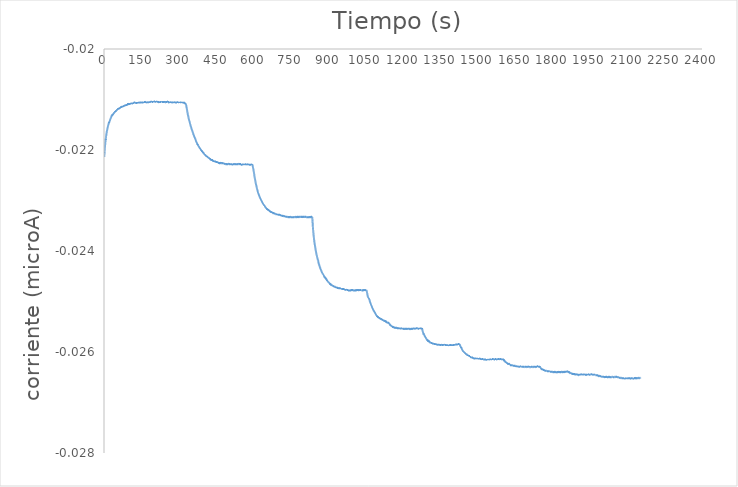
| Category | Series 0 |
|---|---|
| 0.1 | -0.022 |
| 0.2 | -0.022 |
| 0.3 | -0.022 |
| 0.4 | -0.022 |
| 0.5 | -0.022 |
| 0.6 | -0.022 |
| 0.7 | -0.022 |
| 0.8 | -0.022 |
| 0.9 | -0.022 |
| 1.0 | -0.022 |
| 1.1 | -0.022 |
| 1.2 | -0.022 |
| 1.3 | -0.022 |
| 1.4 | -0.022 |
| 1.5 | -0.022 |
| 1.6 | -0.022 |
| 1.7 | -0.022 |
| 1.8 | -0.022 |
| 1.9 | -0.022 |
| 2.0 | -0.022 |
| 2.1 | -0.022 |
| 2.2 | -0.022 |
| 2.3 | -0.022 |
| 2.4 | -0.022 |
| 2.5 | -0.022 |
| 2.6 | -0.022 |
| 2.7 | -0.022 |
| 2.8 | -0.022 |
| 2.9 | -0.022 |
| 3.0 | -0.022 |
| 3.1 | -0.022 |
| 3.2 | -0.022 |
| 3.3 | -0.022 |
| 3.4 | -0.022 |
| 3.5 | -0.022 |
| 3.6 | -0.022 |
| 3.7 | -0.022 |
| 3.8 | -0.022 |
| 3.9 | -0.022 |
| 4.0 | -0.022 |
| 4.1 | -0.022 |
| 4.2 | -0.022 |
| 4.3 | -0.022 |
| 4.4 | -0.022 |
| 4.5 | -0.022 |
| 4.6 | -0.022 |
| 4.7 | -0.022 |
| 4.8 | -0.022 |
| 4.9 | -0.022 |
| 5.0 | -0.022 |
| 5.1 | -0.022 |
| 5.2 | -0.022 |
| 5.3 | -0.022 |
| 5.4 | -0.022 |
| 5.5 | -0.022 |
| 5.6 | -0.022 |
| 5.7 | -0.022 |
| 5.8 | -0.022 |
| 5.9 | -0.022 |
| 6.0 | -0.022 |
| 6.1 | -0.022 |
| 6.2 | -0.022 |
| 6.3 | -0.022 |
| 6.4 | -0.022 |
| 6.5 | -0.022 |
| 6.6 | -0.022 |
| 6.7 | -0.022 |
| 6.8 | -0.022 |
| 6.9 | -0.022 |
| 7.0 | -0.022 |
| 7.1 | -0.022 |
| 7.2 | -0.022 |
| 7.3 | -0.022 |
| 7.4 | -0.022 |
| 7.5 | -0.022 |
| 7.6 | -0.022 |
| 7.7 | -0.022 |
| 7.8 | -0.022 |
| 7.9 | -0.022 |
| 8.0 | -0.022 |
| 8.1 | -0.022 |
| 8.2 | -0.022 |
| 8.3 | -0.022 |
| 8.4 | -0.022 |
| 8.5 | -0.022 |
| 8.6 | -0.022 |
| 8.7 | -0.022 |
| 8.8 | -0.022 |
| 8.9 | -0.022 |
| 9.0 | -0.022 |
| 9.1 | -0.022 |
| 9.2 | -0.022 |
| 9.3 | -0.022 |
| 9.4 | -0.022 |
| 9.5 | -0.022 |
| 9.6 | -0.022 |
| 9.7 | -0.022 |
| 9.8 | -0.022 |
| 9.9 | -0.022 |
| 10.0 | -0.022 |
| 10.1 | -0.022 |
| 10.2 | -0.022 |
| 10.3 | -0.022 |
| 10.4 | -0.022 |
| 10.5 | -0.022 |
| 10.6 | -0.022 |
| 10.7 | -0.022 |
| 10.8 | -0.022 |
| 10.9 | -0.022 |
| 11.0 | -0.022 |
| 11.1 | -0.022 |
| 11.2 | -0.022 |
| 11.3 | -0.022 |
| 11.4 | -0.022 |
| 11.5 | -0.022 |
| 11.6 | -0.022 |
| 11.7 | -0.022 |
| 11.8 | -0.022 |
| 11.9 | -0.022 |
| 12.0 | -0.022 |
| 12.1 | -0.022 |
| 12.2 | -0.022 |
| 12.3 | -0.022 |
| 12.4 | -0.022 |
| 12.5 | -0.022 |
| 12.6 | -0.022 |
| 12.7 | -0.022 |
| 12.8 | -0.022 |
| 12.9 | -0.022 |
| 13.0 | -0.022 |
| 13.1 | -0.022 |
| 13.2 | -0.022 |
| 13.3 | -0.022 |
| 13.4 | -0.022 |
| 13.5 | -0.022 |
| 13.6 | -0.022 |
| 13.7 | -0.022 |
| 13.8 | -0.022 |
| 13.9 | -0.022 |
| 14.0 | -0.022 |
| 14.1 | -0.022 |
| 14.2 | -0.022 |
| 14.3 | -0.022 |
| 14.4 | -0.022 |
| 14.5 | -0.022 |
| 14.6 | -0.022 |
| 14.7 | -0.022 |
| 14.8 | -0.022 |
| 14.9 | -0.022 |
| 15.0 | -0.022 |
| 15.1 | -0.022 |
| 15.2 | -0.022 |
| 15.3 | -0.022 |
| 15.4 | -0.022 |
| 15.5 | -0.022 |
| 15.6 | -0.022 |
| 15.7 | -0.022 |
| 15.8 | -0.022 |
| 15.9 | -0.022 |
| 16.0 | -0.022 |
| 16.1 | -0.022 |
| 16.2 | -0.022 |
| 16.3 | -0.022 |
| 16.4 | -0.022 |
| 16.5 | -0.022 |
| 16.6 | -0.022 |
| 16.7 | -0.022 |
| 16.8 | -0.022 |
| 16.9 | -0.022 |
| 17.0 | -0.022 |
| 17.1 | -0.022 |
| 17.2 | -0.022 |
| 17.3 | -0.022 |
| 17.4 | -0.022 |
| 17.5 | -0.022 |
| 17.6 | -0.022 |
| 17.7 | -0.021 |
| 17.8 | -0.021 |
| 17.9 | -0.021 |
| 18.0 | -0.021 |
| 18.1 | -0.021 |
| 18.2 | -0.021 |
| 18.3 | -0.021 |
| 18.4 | -0.021 |
| 18.5 | -0.021 |
| 18.6 | -0.021 |
| 18.7 | -0.021 |
| 18.8 | -0.021 |
| 18.9 | -0.021 |
| 19.0 | -0.021 |
| 19.1 | -0.021 |
| 19.2 | -0.021 |
| 19.3 | -0.021 |
| 19.4 | -0.021 |
| 19.5 | -0.021 |
| 19.6 | -0.021 |
| 19.7 | -0.021 |
| 19.8 | -0.021 |
| 19.9 | -0.021 |
| 20.0 | -0.021 |
| 20.1 | -0.021 |
| 20.2 | -0.021 |
| 20.3 | -0.021 |
| 20.4 | -0.021 |
| 20.5 | -0.021 |
| 20.6 | -0.021 |
| 20.7 | -0.021 |
| 20.8 | -0.021 |
| 20.9 | -0.021 |
| 21.0 | -0.021 |
| 21.1 | -0.021 |
| 21.2 | -0.021 |
| 21.3 | -0.021 |
| 21.4 | -0.021 |
| 21.5 | -0.021 |
| 21.6 | -0.021 |
| 21.7 | -0.021 |
| 21.8 | -0.021 |
| 21.9 | -0.021 |
| 22.0 | -0.021 |
| 22.1 | -0.021 |
| 22.2 | -0.021 |
| 22.3 | -0.021 |
| 22.4 | -0.021 |
| 22.5 | -0.021 |
| 22.6 | -0.021 |
| 22.7 | -0.021 |
| 22.8 | -0.021 |
| 22.9 | -0.021 |
| 23.0 | -0.021 |
| 23.1 | -0.021 |
| 23.2 | -0.021 |
| 23.3 | -0.021 |
| 23.4 | -0.021 |
| 23.5 | -0.021 |
| 23.6 | -0.021 |
| 23.7 | -0.021 |
| 23.8 | -0.021 |
| 23.9 | -0.021 |
| 24.0 | -0.021 |
| 24.1 | -0.021 |
| 24.2 | -0.021 |
| 24.3 | -0.021 |
| 24.4 | -0.021 |
| 24.5 | -0.021 |
| 24.6 | -0.021 |
| 24.7 | -0.021 |
| 24.8 | -0.021 |
| 24.9 | -0.021 |
| 25.0 | -0.021 |
| 25.1 | -0.021 |
| 25.2 | -0.021 |
| 25.3 | -0.021 |
| 25.4 | -0.021 |
| 25.5 | -0.021 |
| 25.6 | -0.021 |
| 25.7 | -0.021 |
| 25.8 | -0.021 |
| 25.9 | -0.021 |
| 26.0 | -0.021 |
| 26.1 | -0.021 |
| 26.2 | -0.021 |
| 26.3 | -0.021 |
| 26.4 | -0.021 |
| 26.5 | -0.021 |
| 26.6 | -0.021 |
| 26.7 | -0.021 |
| 26.8 | -0.021 |
| 26.9 | -0.021 |
| 27.0 | -0.021 |
| 27.1 | -0.021 |
| 27.2 | -0.021 |
| 27.3 | -0.021 |
| 27.4 | -0.021 |
| 27.5 | -0.021 |
| 27.6 | -0.021 |
| 27.7 | -0.021 |
| 27.8 | -0.021 |
| 27.9 | -0.021 |
| 28.0 | -0.021 |
| 28.1 | -0.021 |
| 28.2 | -0.021 |
| 28.3 | -0.021 |
| 28.4 | -0.021 |
| 28.5 | -0.021 |
| 28.6 | -0.021 |
| 28.7 | -0.021 |
| 28.8 | -0.021 |
| 28.9 | -0.021 |
| 29.0 | -0.021 |
| 29.1 | -0.021 |
| 29.2 | -0.021 |
| 29.3 | -0.021 |
| 29.4 | -0.021 |
| 29.5 | -0.021 |
| 29.6 | -0.021 |
| 29.7 | -0.021 |
| 29.8 | -0.021 |
| 29.9 | -0.021 |
| 30.0 | -0.021 |
| 30.1 | -0.021 |
| 30.2 | -0.021 |
| 30.3 | -0.021 |
| 30.4 | -0.021 |
| 30.5 | -0.021 |
| 30.6 | -0.021 |
| 30.7 | -0.021 |
| 30.8 | -0.021 |
| 30.9 | -0.021 |
| 31.0 | -0.021 |
| 31.1 | -0.021 |
| 31.2 | -0.021 |
| 31.3 | -0.021 |
| 31.4 | -0.021 |
| 31.5 | -0.021 |
| 31.6 | -0.021 |
| 31.7 | -0.021 |
| 31.8 | -0.021 |
| 31.9 | -0.021 |
| 32.0 | -0.021 |
| 32.1 | -0.021 |
| 32.2 | -0.021 |
| 32.3 | -0.021 |
| 32.4 | -0.021 |
| 32.5 | -0.021 |
| 32.6 | -0.021 |
| 32.7 | -0.021 |
| 32.8 | -0.021 |
| 32.9 | -0.021 |
| 33.0 | -0.021 |
| 33.1 | -0.021 |
| 33.2 | -0.021 |
| 33.3 | -0.021 |
| 33.4 | -0.021 |
| 33.5 | -0.021 |
| 33.6 | -0.021 |
| 33.7 | -0.021 |
| 33.8 | -0.021 |
| 33.9 | -0.021 |
| 34.0 | -0.021 |
| 34.1 | -0.021 |
| 34.2 | -0.021 |
| 34.3 | -0.021 |
| 34.4 | -0.021 |
| 34.5 | -0.021 |
| 34.6 | -0.021 |
| 34.7 | -0.021 |
| 34.8 | -0.021 |
| 34.9 | -0.021 |
| 35.0 | -0.021 |
| 35.1 | -0.021 |
| 35.2 | -0.021 |
| 35.3 | -0.021 |
| 35.4 | -0.021 |
| 35.5 | -0.021 |
| 35.6 | -0.021 |
| 35.7 | -0.021 |
| 35.8 | -0.021 |
| 35.9 | -0.021 |
| 36.0 | -0.021 |
| 36.1 | -0.021 |
| 36.2 | -0.021 |
| 36.3 | -0.021 |
| 36.4 | -0.021 |
| 36.5 | -0.021 |
| 36.6 | -0.021 |
| 36.7 | -0.021 |
| 36.8 | -0.021 |
| 36.9 | -0.021 |
| 37.0 | -0.021 |
| 37.1 | -0.021 |
| 37.2 | -0.021 |
| 37.3 | -0.021 |
| 37.4 | -0.021 |
| 37.5 | -0.021 |
| 37.6 | -0.021 |
| 37.7 | -0.021 |
| 37.8 | -0.021 |
| 37.9 | -0.021 |
| 38.0 | -0.021 |
| 38.1 | -0.021 |
| 38.2 | -0.021 |
| 38.3 | -0.021 |
| 38.4 | -0.021 |
| 38.5 | -0.021 |
| 38.6 | -0.021 |
| 38.7 | -0.021 |
| 38.8 | -0.021 |
| 38.9 | -0.021 |
| 39.0 | -0.021 |
| 39.1 | -0.021 |
| 39.2 | -0.021 |
| 39.3 | -0.021 |
| 39.4 | -0.021 |
| 39.5 | -0.021 |
| 39.6 | -0.021 |
| 39.7 | -0.021 |
| 39.8 | -0.021 |
| 39.9 | -0.021 |
| 40.0 | -0.021 |
| 40.1 | -0.021 |
| 40.2 | -0.021 |
| 40.3 | -0.021 |
| 40.4 | -0.021 |
| 40.5 | -0.021 |
| 40.6 | -0.021 |
| 40.7 | -0.021 |
| 40.8 | -0.021 |
| 40.9 | -0.021 |
| 41.0 | -0.021 |
| 41.1 | -0.021 |
| 41.2 | -0.021 |
| 41.3 | -0.021 |
| 41.4 | -0.021 |
| 41.5 | -0.021 |
| 41.6 | -0.021 |
| 41.7 | -0.021 |
| 41.8 | -0.021 |
| 41.9 | -0.021 |
| 42.0 | -0.021 |
| 42.1 | -0.021 |
| 42.2 | -0.021 |
| 42.3 | -0.021 |
| 42.4 | -0.021 |
| 42.5 | -0.021 |
| 42.6 | -0.021 |
| 42.7 | -0.021 |
| 42.8 | -0.021 |
| 42.9 | -0.021 |
| 43.0 | -0.021 |
| 43.1 | -0.021 |
| 43.2 | -0.021 |
| 43.3 | -0.021 |
| 43.4 | -0.021 |
| 43.5 | -0.021 |
| 43.6 | -0.021 |
| 43.7 | -0.021 |
| 43.8 | -0.021 |
| 43.9 | -0.021 |
| 44.0 | -0.021 |
| 44.1 | -0.021 |
| 44.2 | -0.021 |
| 44.3 | -0.021 |
| 44.4 | -0.021 |
| 44.5 | -0.021 |
| 44.6 | -0.021 |
| 44.7 | -0.021 |
| 44.8 | -0.021 |
| 44.9 | -0.021 |
| 45.0 | -0.021 |
| 45.1 | -0.021 |
| 45.2 | -0.021 |
| 45.3 | -0.021 |
| 45.4 | -0.021 |
| 45.5 | -0.021 |
| 45.6 | -0.021 |
| 45.7 | -0.021 |
| 45.8 | -0.021 |
| 45.9 | -0.021 |
| 46.0 | -0.021 |
| 46.1 | -0.021 |
| 46.2 | -0.021 |
| 46.3 | -0.021 |
| 46.4 | -0.021 |
| 46.5 | -0.021 |
| 46.6 | -0.021 |
| 46.7 | -0.021 |
| 46.8 | -0.021 |
| 46.9 | -0.021 |
| 47.0 | -0.021 |
| 47.1 | -0.021 |
| 47.2 | -0.021 |
| 47.3 | -0.021 |
| 47.4 | -0.021 |
| 47.5 | -0.021 |
| 47.6 | -0.021 |
| 47.7 | -0.021 |
| 47.8 | -0.021 |
| 47.9 | -0.021 |
| 48.0 | -0.021 |
| 48.1 | -0.021 |
| 48.2 | -0.021 |
| 48.3 | -0.021 |
| 48.4 | -0.021 |
| 48.5 | -0.021 |
| 48.6 | -0.021 |
| 48.7 | -0.021 |
| 48.8 | -0.021 |
| 48.9 | -0.021 |
| 49.0 | -0.021 |
| 49.1 | -0.021 |
| 49.2 | -0.021 |
| 49.3 | -0.021 |
| 49.4 | -0.021 |
| 49.5 | -0.021 |
| 49.6 | -0.021 |
| 49.7 | -0.021 |
| 49.8 | -0.021 |
| 49.9 | -0.021 |
| 50.0 | -0.021 |
| 50.1 | -0.021 |
| 50.2 | -0.021 |
| 50.3 | -0.021 |
| 50.4 | -0.021 |
| 50.5 | -0.021 |
| 50.6 | -0.021 |
| 50.7 | -0.021 |
| 50.8 | -0.021 |
| 50.9 | -0.021 |
| 51.0 | -0.021 |
| 51.1 | -0.021 |
| 51.2 | -0.021 |
| 51.3 | -0.021 |
| 51.4 | -0.021 |
| 51.5 | -0.021 |
| 51.6 | -0.021 |
| 51.7 | -0.021 |
| 51.8 | -0.021 |
| 51.9 | -0.021 |
| 52.0 | -0.021 |
| 52.1 | -0.021 |
| 52.2 | -0.021 |
| 52.3 | -0.021 |
| 52.4 | -0.021 |
| 52.5 | -0.021 |
| 52.6 | -0.021 |
| 52.7 | -0.021 |
| 52.8 | -0.021 |
| 52.9 | -0.021 |
| 53.0 | -0.021 |
| 53.1 | -0.021 |
| 53.2 | -0.021 |
| 53.3 | -0.021 |
| 53.4 | -0.021 |
| 53.5 | -0.021 |
| 53.6 | -0.021 |
| 53.7 | -0.021 |
| 53.8 | -0.021 |
| 53.9 | -0.021 |
| 54.0 | -0.021 |
| 54.1 | -0.021 |
| 54.2 | -0.021 |
| 54.3 | -0.021 |
| 54.4 | -0.021 |
| 54.5 | -0.021 |
| 54.6 | -0.021 |
| 54.7 | -0.021 |
| 54.8 | -0.021 |
| 54.9 | -0.021 |
| 55.0 | -0.021 |
| 55.1 | -0.021 |
| 55.2 | -0.021 |
| 55.3 | -0.021 |
| 55.4 | -0.021 |
| 55.5 | -0.021 |
| 55.6 | -0.021 |
| 55.7 | -0.021 |
| 55.8 | -0.021 |
| 55.9 | -0.021 |
| 56.0 | -0.021 |
| 56.1 | -0.021 |
| 56.2 | -0.021 |
| 56.3 | -0.021 |
| 56.4 | -0.021 |
| 56.5 | -0.021 |
| 56.6 | -0.021 |
| 56.7 | -0.021 |
| 56.8 | -0.021 |
| 56.9 | -0.021 |
| 57.0 | -0.021 |
| 57.1 | -0.021 |
| 57.2 | -0.021 |
| 57.3 | -0.021 |
| 57.4 | -0.021 |
| 57.5 | -0.021 |
| 57.6 | -0.021 |
| 57.7 | -0.021 |
| 57.8 | -0.021 |
| 57.9 | -0.021 |
| 58.0 | -0.021 |
| 58.1 | -0.021 |
| 58.2 | -0.021 |
| 58.3 | -0.021 |
| 58.4 | -0.021 |
| 58.5 | -0.021 |
| 58.6 | -0.021 |
| 58.7 | -0.021 |
| 58.8 | -0.021 |
| 58.9 | -0.021 |
| 59.0 | -0.021 |
| 59.1 | -0.021 |
| 59.2 | -0.021 |
| 59.3 | -0.021 |
| 59.4 | -0.021 |
| 59.5 | -0.021 |
| 59.6 | -0.021 |
| 59.7 | -0.021 |
| 59.8 | -0.021 |
| 59.9 | -0.021 |
| 60.0 | -0.021 |
| 60.1 | -0.021 |
| 60.2 | -0.021 |
| 60.3 | -0.021 |
| 60.4 | -0.021 |
| 60.5 | -0.021 |
| 60.6 | -0.021 |
| 60.7 | -0.021 |
| 60.8 | -0.021 |
| 60.9 | -0.021 |
| 61.0 | -0.021 |
| 61.1 | -0.021 |
| 61.2 | -0.021 |
| 61.3 | -0.021 |
| 61.4 | -0.021 |
| 61.5 | -0.021 |
| 61.6 | -0.021 |
| 61.7 | -0.021 |
| 61.8 | -0.021 |
| 61.9 | -0.021 |
| 62.0 | -0.021 |
| 62.1 | -0.021 |
| 62.2 | -0.021 |
| 62.3 | -0.021 |
| 62.4 | -0.021 |
| 62.5 | -0.021 |
| 62.6 | -0.021 |
| 62.7 | -0.021 |
| 62.8 | -0.021 |
| 62.9 | -0.021 |
| 63.0 | -0.021 |
| 63.1 | -0.021 |
| 63.2 | -0.021 |
| 63.3 | -0.021 |
| 63.4 | -0.021 |
| 63.5 | -0.021 |
| 63.6 | -0.021 |
| 63.7 | -0.021 |
| 63.8 | -0.021 |
| 63.9 | -0.021 |
| 64.0 | -0.021 |
| 64.1 | -0.021 |
| 64.2 | -0.021 |
| 64.3 | -0.021 |
| 64.4 | -0.021 |
| 64.5 | -0.021 |
| 64.6 | -0.021 |
| 64.7 | -0.021 |
| 64.8 | -0.021 |
| 64.9 | -0.021 |
| 65.0 | -0.021 |
| 65.1 | -0.021 |
| 65.2 | -0.021 |
| 65.3 | -0.021 |
| 65.4 | -0.021 |
| 65.5 | -0.021 |
| 65.6 | -0.021 |
| 65.7 | -0.021 |
| 65.8 | -0.021 |
| 65.9 | -0.021 |
| 66.0 | -0.021 |
| 66.1 | -0.021 |
| 66.2 | -0.021 |
| 66.3 | -0.021 |
| 66.4 | -0.021 |
| 66.5 | -0.021 |
| 66.6 | -0.021 |
| 66.7 | -0.021 |
| 66.8 | -0.021 |
| 66.9 | -0.021 |
| 67.0 | -0.021 |
| 67.1 | -0.021 |
| 67.2 | -0.021 |
| 67.3 | -0.021 |
| 67.4 | -0.021 |
| 67.5 | -0.021 |
| 67.6 | -0.021 |
| 67.7 | -0.021 |
| 67.8 | -0.021 |
| 67.9 | -0.021 |
| 68.0 | -0.021 |
| 68.1 | -0.021 |
| 68.2 | -0.021 |
| 68.3 | -0.021 |
| 68.4 | -0.021 |
| 68.5 | -0.021 |
| 68.6 | -0.021 |
| 68.7 | -0.021 |
| 68.8 | -0.021 |
| 68.9 | -0.021 |
| 69.0 | -0.021 |
| 69.1 | -0.021 |
| 69.2 | -0.021 |
| 69.3 | -0.021 |
| 69.4 | -0.021 |
| 69.5 | -0.021 |
| 69.6 | -0.021 |
| 69.7 | -0.021 |
| 69.8 | -0.021 |
| 69.9 | -0.021 |
| 70.0 | -0.021 |
| 70.1 | -0.021 |
| 70.2 | -0.021 |
| 70.3 | -0.021 |
| 70.4 | -0.021 |
| 70.5 | -0.021 |
| 70.6 | -0.021 |
| 70.7 | -0.021 |
| 70.8 | -0.021 |
| 70.9 | -0.021 |
| 71.0 | -0.021 |
| 71.1 | -0.021 |
| 71.2 | -0.021 |
| 71.3 | -0.021 |
| 71.4 | -0.021 |
| 71.5 | -0.021 |
| 71.6 | -0.021 |
| 71.7 | -0.021 |
| 71.8 | -0.021 |
| 71.9 | -0.021 |
| 72.0 | -0.021 |
| 72.1 | -0.021 |
| 72.2 | -0.021 |
| 72.3 | -0.021 |
| 72.4 | -0.021 |
| 72.5 | -0.021 |
| 72.6 | -0.021 |
| 72.7 | -0.021 |
| 72.8 | -0.021 |
| 72.9 | -0.021 |
| 73.0 | -0.021 |
| 73.1 | -0.021 |
| 73.2 | -0.021 |
| 73.3 | -0.021 |
| 73.4 | -0.021 |
| 73.5 | -0.021 |
| 73.6 | -0.021 |
| 73.7 | -0.021 |
| 73.8 | -0.021 |
| 73.9 | -0.021 |
| 74.0 | -0.021 |
| 74.1 | -0.021 |
| 74.2 | -0.021 |
| 74.3 | -0.021 |
| 74.4 | -0.021 |
| 74.5 | -0.021 |
| 74.6 | -0.021 |
| 74.7 | -0.021 |
| 74.8 | -0.021 |
| 74.9 | -0.021 |
| 75.0 | -0.021 |
| 75.1 | -0.021 |
| 75.2 | -0.021 |
| 75.3 | -0.021 |
| 75.4 | -0.021 |
| 75.5 | -0.021 |
| 75.6 | -0.021 |
| 75.7 | -0.021 |
| 75.8 | -0.021 |
| 75.9 | -0.021 |
| 76.0 | -0.021 |
| 76.1 | -0.021 |
| 76.2 | -0.021 |
| 76.3 | -0.021 |
| 76.4 | -0.021 |
| 76.5 | -0.021 |
| 76.6 | -0.021 |
| 76.7 | -0.021 |
| 76.8 | -0.021 |
| 76.9 | -0.021 |
| 77.0 | -0.021 |
| 77.1 | -0.021 |
| 77.2 | -0.021 |
| 77.3 | -0.021 |
| 77.4 | -0.021 |
| 77.5 | -0.021 |
| 77.6 | -0.021 |
| 77.7 | -0.021 |
| 77.8 | -0.021 |
| 77.9 | -0.021 |
| 78.0 | -0.021 |
| 78.1 | -0.021 |
| 78.2 | -0.021 |
| 78.3 | -0.021 |
| 78.4 | -0.021 |
| 78.5 | -0.021 |
| 78.6 | -0.021 |
| 78.7 | -0.021 |
| 78.8 | -0.021 |
| 78.9 | -0.021 |
| 79.0 | -0.021 |
| 79.1 | -0.021 |
| 79.2 | -0.021 |
| 79.3 | -0.021 |
| 79.4 | -0.021 |
| 79.5 | -0.021 |
| 79.6 | -0.021 |
| 79.7 | -0.021 |
| 79.8 | -0.021 |
| 79.9 | -0.021 |
| 80.0 | -0.021 |
| 80.1 | -0.021 |
| 80.2 | -0.021 |
| 80.3 | -0.021 |
| 80.4 | -0.021 |
| 80.5 | -0.021 |
| 80.6 | -0.021 |
| 80.7 | -0.021 |
| 80.8 | -0.021 |
| 80.9 | -0.021 |
| 81.0 | -0.021 |
| 81.1 | -0.021 |
| 81.2 | -0.021 |
| 81.3 | -0.021 |
| 81.4 | -0.021 |
| 81.5 | -0.021 |
| 81.6 | -0.021 |
| 81.7 | -0.021 |
| 81.8 | -0.021 |
| 81.9 | -0.021 |
| 82.0 | -0.021 |
| 82.1 | -0.021 |
| 82.2 | -0.021 |
| 82.3 | -0.021 |
| 82.4 | -0.021 |
| 82.5 | -0.021 |
| 82.6 | -0.021 |
| 82.7 | -0.021 |
| 82.8 | -0.021 |
| 82.9 | -0.021 |
| 83.0 | -0.021 |
| 83.1 | -0.021 |
| 83.2 | -0.021 |
| 83.3 | -0.021 |
| 83.4 | -0.021 |
| 83.5 | -0.021 |
| 83.6 | -0.021 |
| 83.7 | -0.021 |
| 83.8 | -0.021 |
| 83.9 | -0.021 |
| 84.0 | -0.021 |
| 84.1 | -0.021 |
| 84.2 | -0.021 |
| 84.3 | -0.021 |
| 84.4 | -0.021 |
| 84.5 | -0.021 |
| 84.6 | -0.021 |
| 84.7 | -0.021 |
| 84.8 | -0.021 |
| 84.9 | -0.021 |
| 85.0 | -0.021 |
| 85.1 | -0.021 |
| 85.2 | -0.021 |
| 85.3 | -0.021 |
| 85.4 | -0.021 |
| 85.5 | -0.021 |
| 85.6 | -0.021 |
| 85.7 | -0.021 |
| 85.8 | -0.021 |
| 85.9 | -0.021 |
| 86.0 | -0.021 |
| 86.1 | -0.021 |
| 86.2 | -0.021 |
| 86.3 | -0.021 |
| 86.4 | -0.021 |
| 86.5 | -0.021 |
| 86.6 | -0.021 |
| 86.7 | -0.021 |
| 86.8 | -0.021 |
| 86.9 | -0.021 |
| 87.0 | -0.021 |
| 87.1 | -0.021 |
| 87.2 | -0.021 |
| 87.3 | -0.021 |
| 87.4 | -0.021 |
| 87.5 | -0.021 |
| 87.6 | -0.021 |
| 87.7 | -0.021 |
| 87.8 | -0.021 |
| 87.9 | -0.021 |
| 88.0 | -0.021 |
| 88.1 | -0.021 |
| 88.2 | -0.021 |
| 88.3 | -0.021 |
| 88.4 | -0.021 |
| 88.5 | -0.021 |
| 88.6 | -0.021 |
| 88.7 | -0.021 |
| 88.8 | -0.021 |
| 88.9 | -0.021 |
| 89.0 | -0.021 |
| 89.1 | -0.021 |
| 89.2 | -0.021 |
| 89.3 | -0.021 |
| 89.4 | -0.021 |
| 89.5 | -0.021 |
| 89.6 | -0.021 |
| 89.7 | -0.021 |
| 89.8 | -0.021 |
| 89.9 | -0.021 |
| 90.0 | -0.021 |
| 90.1 | -0.021 |
| 90.2 | -0.021 |
| 90.3 | -0.021 |
| 90.4 | -0.021 |
| 90.5 | -0.021 |
| 90.6 | -0.021 |
| 90.7 | -0.021 |
| 90.8 | -0.021 |
| 90.9 | -0.021 |
| 91.0 | -0.021 |
| 91.1 | -0.021 |
| 91.2 | -0.021 |
| 91.3 | -0.021 |
| 91.4 | -0.021 |
| 91.5 | -0.021 |
| 91.6 | -0.021 |
| 91.7 | -0.021 |
| 91.8 | -0.021 |
| 91.9 | -0.021 |
| 92.0 | -0.021 |
| 92.1 | -0.021 |
| 92.2 | -0.021 |
| 92.3 | -0.021 |
| 92.4 | -0.021 |
| 92.5 | -0.021 |
| 92.6 | -0.021 |
| 92.7 | -0.021 |
| 92.8 | -0.021 |
| 92.9 | -0.021 |
| 93.0 | -0.021 |
| 93.1 | -0.021 |
| 93.2 | -0.021 |
| 93.3 | -0.021 |
| 93.4 | -0.021 |
| 93.5 | -0.021 |
| 93.6 | -0.021 |
| 93.7 | -0.021 |
| 93.8 | -0.021 |
| 93.9 | -0.021 |
| 94.0 | -0.021 |
| 94.1 | -0.021 |
| 94.2 | -0.021 |
| 94.3 | -0.021 |
| 94.4 | -0.021 |
| 94.5 | -0.021 |
| 94.6 | -0.021 |
| 94.7 | -0.021 |
| 94.8 | -0.021 |
| 94.9 | -0.021 |
| 95.0 | -0.021 |
| 95.1 | -0.021 |
| 95.2 | -0.021 |
| 95.3 | -0.021 |
| 95.4 | -0.021 |
| 95.5 | -0.021 |
| 95.6 | -0.021 |
| 95.7 | -0.021 |
| 95.8 | -0.021 |
| 95.9 | -0.021 |
| 96.0 | -0.021 |
| 96.1 | -0.021 |
| 96.2 | -0.021 |
| 96.3 | -0.021 |
| 96.4 | -0.021 |
| 96.5 | -0.021 |
| 96.6 | -0.021 |
| 96.7 | -0.021 |
| 96.8 | -0.021 |
| 96.9 | -0.021 |
| 97.0 | -0.021 |
| 97.1 | -0.021 |
| 97.2 | -0.021 |
| 97.3 | -0.021 |
| 97.4 | -0.021 |
| 97.5 | -0.021 |
| 97.6 | -0.021 |
| 97.7 | -0.021 |
| 97.8 | -0.021 |
| 97.9 | -0.021 |
| 98.0 | -0.021 |
| 98.1 | -0.021 |
| 98.2 | -0.021 |
| 98.3 | -0.021 |
| 98.4 | -0.021 |
| 98.5 | -0.021 |
| 98.6 | -0.021 |
| 98.7 | -0.021 |
| 98.8 | -0.021 |
| 98.9 | -0.021 |
| 99.0 | -0.021 |
| 99.1 | -0.021 |
| 99.2 | -0.021 |
| 99.3 | -0.021 |
| 99.4 | -0.021 |
| 99.5 | -0.021 |
| 99.6 | -0.021 |
| 99.7 | -0.021 |
| 99.8 | -0.021 |
| 99.9 | -0.021 |
| 100.0 | -0.021 |
| 100.1 | -0.021 |
| 100.2 | -0.021 |
| 100.3 | -0.021 |
| 100.4 | -0.021 |
| 100.5 | -0.021 |
| 100.6 | -0.021 |
| 100.7 | -0.021 |
| 100.8 | -0.021 |
| 100.9 | -0.021 |
| 101.0 | -0.021 |
| 101.1 | -0.021 |
| 101.2 | -0.021 |
| 101.3 | -0.021 |
| 101.4 | -0.021 |
| 101.5 | -0.021 |
| 101.6 | -0.021 |
| 101.7 | -0.021 |
| 101.8 | -0.021 |
| 101.9 | -0.021 |
| 102.0 | -0.021 |
| 102.1 | -0.021 |
| 102.2 | -0.021 |
| 102.3 | -0.021 |
| 102.4 | -0.021 |
| 102.5 | -0.021 |
| 102.6 | -0.021 |
| 102.7 | -0.021 |
| 102.8 | -0.021 |
| 102.9 | -0.021 |
| 103.0 | -0.021 |
| 103.1 | -0.021 |
| 103.2 | -0.021 |
| 103.3 | -0.021 |
| 103.4 | -0.021 |
| 103.5 | -0.021 |
| 103.6 | -0.021 |
| 103.7 | -0.021 |
| 103.8 | -0.021 |
| 103.9 | -0.021 |
| 104.0 | -0.021 |
| 104.1 | -0.021 |
| 104.2 | -0.021 |
| 104.3 | -0.021 |
| 104.4 | -0.021 |
| 104.5 | -0.021 |
| 104.6 | -0.021 |
| 104.7 | -0.021 |
| 104.8 | -0.021 |
| 104.9 | -0.021 |
| 105.0 | -0.021 |
| 105.1 | -0.021 |
| 105.2 | -0.021 |
| 105.3 | -0.021 |
| 105.4 | -0.021 |
| 105.5 | -0.021 |
| 105.6 | -0.021 |
| 105.7 | -0.021 |
| 105.8 | -0.021 |
| 105.9 | -0.021 |
| 106.0 | -0.021 |
| 106.1 | -0.021 |
| 106.2 | -0.021 |
| 106.3 | -0.021 |
| 106.4 | -0.021 |
| 106.5 | -0.021 |
| 106.6 | -0.021 |
| 106.7 | -0.021 |
| 106.8 | -0.021 |
| 106.9 | -0.021 |
| 107.0 | -0.021 |
| 107.1 | -0.021 |
| 107.2 | -0.021 |
| 107.3 | -0.021 |
| 107.4 | -0.021 |
| 107.5 | -0.021 |
| 107.6 | -0.021 |
| 107.7 | -0.021 |
| 107.8 | -0.021 |
| 107.9 | -0.021 |
| 108.0 | -0.021 |
| 108.1 | -0.021 |
| 108.2 | -0.021 |
| 108.3 | -0.021 |
| 108.4 | -0.021 |
| 108.5 | -0.021 |
| 108.6 | -0.021 |
| 108.7 | -0.021 |
| 108.8 | -0.021 |
| 108.9 | -0.021 |
| 109.0 | -0.021 |
| 109.1 | -0.021 |
| 109.2 | -0.021 |
| 109.3 | -0.021 |
| 109.4 | -0.021 |
| 109.5 | -0.021 |
| 109.6 | -0.021 |
| 109.7 | -0.021 |
| 109.8 | -0.021 |
| 109.9 | -0.021 |
| 110.0 | -0.021 |
| 110.1 | -0.021 |
| 110.2 | -0.021 |
| 110.3 | -0.021 |
| 110.4 | -0.021 |
| 110.5 | -0.021 |
| 110.6 | -0.021 |
| 110.7 | -0.021 |
| 110.8 | -0.021 |
| 110.9 | -0.021 |
| 111.0 | -0.021 |
| 111.1 | -0.021 |
| 111.2 | -0.021 |
| 111.3 | -0.021 |
| 111.4 | -0.021 |
| 111.5 | -0.021 |
| 111.6 | -0.021 |
| 111.7 | -0.021 |
| 111.8 | -0.021 |
| 111.9 | -0.021 |
| 112.0 | -0.021 |
| 112.1 | -0.021 |
| 112.2 | -0.021 |
| 112.3 | -0.021 |
| 112.4 | -0.021 |
| 112.5 | -0.021 |
| 112.6 | -0.021 |
| 112.7 | -0.021 |
| 112.8 | -0.021 |
| 112.9 | -0.021 |
| 113.0 | -0.021 |
| 113.1 | -0.021 |
| 113.2 | -0.021 |
| 113.3 | -0.021 |
| 113.4 | -0.021 |
| 113.5 | -0.021 |
| 113.6 | -0.021 |
| 113.7 | -0.021 |
| 113.8 | -0.021 |
| 113.9 | -0.021 |
| 114.0 | -0.021 |
| 114.1 | -0.021 |
| 114.2 | -0.021 |
| 114.3 | -0.021 |
| 114.4 | -0.021 |
| 114.5 | -0.021 |
| 114.6 | -0.021 |
| 114.7 | -0.021 |
| 114.8 | -0.021 |
| 114.9 | -0.021 |
| 115.0 | -0.021 |
| 115.1 | -0.021 |
| 115.2 | -0.021 |
| 115.3 | -0.021 |
| 115.4 | -0.021 |
| 115.5 | -0.021 |
| 115.6 | -0.021 |
| 115.7 | -0.021 |
| 115.8 | -0.021 |
| 115.9 | -0.021 |
| 116.0 | -0.021 |
| 116.1 | -0.021 |
| 116.2 | -0.021 |
| 116.3 | -0.021 |
| 116.4 | -0.021 |
| 116.5 | -0.021 |
| 116.6 | -0.021 |
| 116.7 | -0.021 |
| 116.8 | -0.021 |
| 116.9 | -0.021 |
| 117.0 | -0.021 |
| 117.1 | -0.021 |
| 117.2 | -0.021 |
| 117.3 | -0.021 |
| 117.4 | -0.021 |
| 117.5 | -0.021 |
| 117.6 | -0.021 |
| 117.7 | -0.021 |
| 117.8 | -0.021 |
| 117.9 | -0.021 |
| 118.0 | -0.021 |
| 118.1 | -0.021 |
| 118.2 | -0.021 |
| 118.3 | -0.021 |
| 118.4 | -0.021 |
| 118.5 | -0.021 |
| 118.6 | -0.021 |
| 118.7 | -0.021 |
| 118.8 | -0.021 |
| 118.9 | -0.021 |
| 119.0 | -0.021 |
| 119.1 | -0.021 |
| 119.2 | -0.021 |
| 119.3 | -0.021 |
| 119.4 | -0.021 |
| 119.5 | -0.021 |
| 119.6 | -0.021 |
| 119.7 | -0.021 |
| 119.8 | -0.021 |
| 119.9 | -0.021 |
| 120.0 | -0.021 |
| 120.1 | -0.021 |
| 120.2 | -0.021 |
| 120.3 | -0.021 |
| 120.4 | -0.021 |
| 120.5 | -0.021 |
| 120.6 | -0.021 |
| 120.7 | -0.021 |
| 120.8 | -0.021 |
| 120.9 | -0.021 |
| 121.0 | -0.021 |
| 121.1 | -0.021 |
| 121.2 | -0.021 |
| 121.3 | -0.021 |
| 121.4 | -0.021 |
| 121.5 | -0.021 |
| 121.6 | -0.021 |
| 121.7 | -0.021 |
| 121.8 | -0.021 |
| 121.9 | -0.021 |
| 122.0 | -0.021 |
| 122.1 | -0.021 |
| 122.2 | -0.021 |
| 122.3 | -0.021 |
| 122.4 | -0.021 |
| 122.5 | -0.021 |
| 122.6 | -0.021 |
| 122.7 | -0.021 |
| 122.8 | -0.021 |
| 122.9 | -0.021 |
| 123.0 | -0.021 |
| 123.1 | -0.021 |
| 123.2 | -0.021 |
| 123.3 | -0.021 |
| 123.4 | -0.021 |
| 123.5 | -0.021 |
| 123.6 | -0.021 |
| 123.7 | -0.021 |
| 123.8 | -0.021 |
| 123.9 | -0.021 |
| 124.0 | -0.021 |
| 124.1 | -0.021 |
| 124.2 | -0.021 |
| 124.3 | -0.021 |
| 124.4 | -0.021 |
| 124.5 | -0.021 |
| 124.6 | -0.021 |
| 124.7 | -0.021 |
| 124.8 | -0.021 |
| 124.9 | -0.021 |
| 125.0 | -0.021 |
| 125.1 | -0.021 |
| 125.2 | -0.021 |
| 125.3 | -0.021 |
| 125.4 | -0.021 |
| 125.5 | -0.021 |
| 125.6 | -0.021 |
| 125.7 | -0.021 |
| 125.8 | -0.021 |
| 125.9 | -0.021 |
| 126.0 | -0.021 |
| 126.1 | -0.021 |
| 126.2 | -0.021 |
| 126.3 | -0.021 |
| 126.4 | -0.021 |
| 126.5 | -0.021 |
| 126.6 | -0.021 |
| 126.7 | -0.021 |
| 126.8 | -0.021 |
| 126.9 | -0.021 |
| 127.0 | -0.021 |
| 127.1 | -0.021 |
| 127.2 | -0.021 |
| 127.3 | -0.021 |
| 127.4 | -0.021 |
| 127.5 | -0.021 |
| 127.6 | -0.021 |
| 127.7 | -0.021 |
| 127.8 | -0.021 |
| 127.9 | -0.021 |
| 128.0 | -0.021 |
| 128.1 | -0.021 |
| 128.2 | -0.021 |
| 128.3 | -0.021 |
| 128.4 | -0.021 |
| 128.5 | -0.021 |
| 128.6 | -0.021 |
| 128.7 | -0.021 |
| 128.8 | -0.021 |
| 128.9 | -0.021 |
| 129.0 | -0.021 |
| 129.1 | -0.021 |
| 129.2 | -0.021 |
| 129.3 | -0.021 |
| 129.4 | -0.021 |
| 129.5 | -0.021 |
| 129.6 | -0.021 |
| 129.7 | -0.021 |
| 129.8 | -0.021 |
| 129.9 | -0.021 |
| 130.0 | -0.021 |
| 130.1 | -0.021 |
| 130.2 | -0.021 |
| 130.3 | -0.021 |
| 130.4 | -0.021 |
| 130.5 | -0.021 |
| 130.6 | -0.021 |
| 130.7 | -0.021 |
| 130.8 | -0.021 |
| 130.9 | -0.021 |
| 131.0 | -0.021 |
| 131.1 | -0.021 |
| 131.2 | -0.021 |
| 131.3 | -0.021 |
| 131.4 | -0.021 |
| 131.5 | -0.021 |
| 131.6 | -0.021 |
| 131.7 | -0.021 |
| 131.8 | -0.021 |
| 131.9 | -0.021 |
| 132.0 | -0.021 |
| 132.1 | -0.021 |
| 132.2 | -0.021 |
| 132.3 | -0.021 |
| 132.4 | -0.021 |
| 132.5 | -0.021 |
| 132.6 | -0.021 |
| 132.7 | -0.021 |
| 132.8 | -0.021 |
| 132.9 | -0.021 |
| 133.0 | -0.021 |
| 133.1 | -0.021 |
| 133.2 | -0.021 |
| 133.3 | -0.021 |
| 133.4 | -0.021 |
| 133.5 | -0.021 |
| 133.6 | -0.021 |
| 133.7 | -0.021 |
| 133.8 | -0.021 |
| 133.9 | -0.021 |
| 134.0 | -0.021 |
| 134.1 | -0.021 |
| 134.2 | -0.021 |
| 134.3 | -0.021 |
| 134.4 | -0.021 |
| 134.5 | -0.021 |
| 134.6 | -0.021 |
| 134.7 | -0.021 |
| 134.8 | -0.021 |
| 134.9 | -0.021 |
| 135.0 | -0.021 |
| 135.1 | -0.021 |
| 135.2 | -0.021 |
| 135.3 | -0.021 |
| 135.4 | -0.021 |
| 135.5 | -0.021 |
| 135.6 | -0.021 |
| 135.7 | -0.021 |
| 135.8 | -0.021 |
| 135.9 | -0.021 |
| 136.0 | -0.021 |
| 136.1 | -0.021 |
| 136.2 | -0.021 |
| 136.3 | -0.021 |
| 136.4 | -0.021 |
| 136.5 | -0.021 |
| 136.6 | -0.021 |
| 136.7 | -0.021 |
| 136.8 | -0.021 |
| 136.9 | -0.021 |
| 137.0 | -0.021 |
| 137.1 | -0.021 |
| 137.2 | -0.021 |
| 137.3 | -0.021 |
| 137.4 | -0.021 |
| 137.5 | -0.021 |
| 137.6 | -0.021 |
| 137.7 | -0.021 |
| 137.8 | -0.021 |
| 137.9 | -0.021 |
| 138.0 | -0.021 |
| 138.1 | -0.021 |
| 138.2 | -0.021 |
| 138.3 | -0.021 |
| 138.4 | -0.021 |
| 138.5 | -0.021 |
| 138.6 | -0.021 |
| 138.7 | -0.021 |
| 138.8 | -0.021 |
| 138.9 | -0.021 |
| 139.0 | -0.021 |
| 139.1 | -0.021 |
| 139.2 | -0.021 |
| 139.3 | -0.021 |
| 139.4 | -0.021 |
| 139.5 | -0.021 |
| 139.6 | -0.021 |
| 139.7 | -0.021 |
| 139.8 | -0.021 |
| 139.9 | -0.021 |
| 140.0 | -0.021 |
| 140.1 | -0.021 |
| 140.2 | -0.021 |
| 140.3 | -0.021 |
| 140.4 | -0.021 |
| 140.5 | -0.021 |
| 140.6 | -0.021 |
| 140.7 | -0.021 |
| 140.8 | -0.021 |
| 140.9 | -0.021 |
| 141.0 | -0.021 |
| 141.1 | -0.021 |
| 141.2 | -0.021 |
| 141.3 | -0.021 |
| 141.4 | -0.021 |
| 141.5 | -0.021 |
| 141.6 | -0.021 |
| 141.7 | -0.021 |
| 141.8 | -0.021 |
| 141.9 | -0.021 |
| 142.0 | -0.021 |
| 142.1 | -0.021 |
| 142.2 | -0.021 |
| 142.3 | -0.021 |
| 142.4 | -0.021 |
| 142.5 | -0.021 |
| 142.6 | -0.021 |
| 142.7 | -0.021 |
| 142.8 | -0.021 |
| 142.9 | -0.021 |
| 143.0 | -0.021 |
| 143.1 | -0.021 |
| 143.2 | -0.021 |
| 143.3 | -0.021 |
| 143.4 | -0.021 |
| 143.5 | -0.021 |
| 143.6 | -0.021 |
| 143.7 | -0.021 |
| 143.8 | -0.021 |
| 143.9 | -0.021 |
| 144.0 | -0.021 |
| 144.1 | -0.021 |
| 144.2 | -0.021 |
| 144.3 | -0.021 |
| 144.4 | -0.021 |
| 144.5 | -0.021 |
| 144.6 | -0.021 |
| 144.7 | -0.021 |
| 144.8 | -0.021 |
| 144.9 | -0.021 |
| 145.0 | -0.021 |
| 145.1 | -0.021 |
| 145.2 | -0.021 |
| 145.3 | -0.021 |
| 145.4 | -0.021 |
| 145.5 | -0.021 |
| 145.6 | -0.021 |
| 145.7 | -0.021 |
| 145.8 | -0.021 |
| 145.9 | -0.021 |
| 146.0 | -0.021 |
| 146.1 | -0.021 |
| 146.2 | -0.021 |
| 146.3 | -0.021 |
| 146.4 | -0.021 |
| 146.5 | -0.021 |
| 146.6 | -0.021 |
| 146.7 | -0.021 |
| 146.8 | -0.021 |
| 146.9 | -0.021 |
| 147.0 | -0.021 |
| 147.1 | -0.021 |
| 147.2 | -0.021 |
| 147.3 | -0.021 |
| 147.4 | -0.021 |
| 147.5 | -0.021 |
| 147.6 | -0.021 |
| 147.7 | -0.021 |
| 147.8 | -0.021 |
| 147.9 | -0.021 |
| 148.0 | -0.021 |
| 148.1 | -0.021 |
| 148.2 | -0.021 |
| 148.3 | -0.021 |
| 148.4 | -0.021 |
| 148.5 | -0.021 |
| 148.6 | -0.021 |
| 148.7 | -0.021 |
| 148.8 | -0.021 |
| 148.9 | -0.021 |
| 149.0 | -0.021 |
| 149.1 | -0.021 |
| 149.2 | -0.021 |
| 149.3 | -0.021 |
| 149.4 | -0.021 |
| 149.5 | -0.021 |
| 149.6 | -0.021 |
| 149.7 | -0.021 |
| 149.8 | -0.021 |
| 149.9 | -0.021 |
| 150.0 | -0.021 |
| 150.1 | -0.021 |
| 150.2 | -0.021 |
| 150.3 | -0.021 |
| 150.4 | -0.021 |
| 150.5 | -0.021 |
| 150.6 | -0.021 |
| 150.7 | -0.021 |
| 150.8 | -0.021 |
| 150.9 | -0.021 |
| 151.0 | -0.021 |
| 151.1 | -0.021 |
| 151.2 | -0.021 |
| 151.3 | -0.021 |
| 151.4 | -0.021 |
| 151.5 | -0.021 |
| 151.6 | -0.021 |
| 151.7 | -0.021 |
| 151.8 | -0.021 |
| 151.9 | -0.021 |
| 152.0 | -0.021 |
| 152.1 | -0.021 |
| 152.2 | -0.021 |
| 152.3 | -0.021 |
| 152.4 | -0.021 |
| 152.5 | -0.021 |
| 152.6 | -0.021 |
| 152.7 | -0.021 |
| 152.8 | -0.021 |
| 152.9 | -0.021 |
| 153.0 | -0.021 |
| 153.1 | -0.021 |
| 153.2 | -0.021 |
| 153.3 | -0.021 |
| 153.4 | -0.021 |
| 153.5 | -0.021 |
| 153.6 | -0.021 |
| 153.7 | -0.021 |
| 153.8 | -0.021 |
| 153.9 | -0.021 |
| 154.0 | -0.021 |
| 154.1 | -0.021 |
| 154.2 | -0.021 |
| 154.3 | -0.021 |
| 154.4 | -0.021 |
| 154.5 | -0.021 |
| 154.6 | -0.021 |
| 154.7 | -0.021 |
| 154.8 | -0.021 |
| 154.9 | -0.021 |
| 155.0 | -0.021 |
| 155.1 | -0.021 |
| 155.2 | -0.021 |
| 155.3 | -0.021 |
| 155.4 | -0.021 |
| 155.5 | -0.021 |
| 155.6 | -0.021 |
| 155.7 | -0.021 |
| 155.8 | -0.021 |
| 155.9 | -0.021 |
| 156.0 | -0.021 |
| 156.1 | -0.021 |
| 156.2 | -0.021 |
| 156.3 | -0.021 |
| 156.4 | -0.021 |
| 156.5 | -0.021 |
| 156.6 | -0.021 |
| 156.7 | -0.021 |
| 156.8 | -0.021 |
| 156.9 | -0.021 |
| 157.0 | -0.021 |
| 157.1 | -0.021 |
| 157.2 | -0.021 |
| 157.3 | -0.021 |
| 157.4 | -0.021 |
| 157.5 | -0.021 |
| 157.6 | -0.021 |
| 157.7 | -0.021 |
| 157.8 | -0.021 |
| 157.9 | -0.021 |
| 158.0 | -0.021 |
| 158.1 | -0.021 |
| 158.2 | -0.021 |
| 158.3 | -0.021 |
| 158.4 | -0.021 |
| 158.5 | -0.021 |
| 158.6 | -0.021 |
| 158.7 | -0.021 |
| 158.8 | -0.021 |
| 158.9 | -0.021 |
| 159.0 | -0.021 |
| 159.1 | -0.021 |
| 159.2 | -0.021 |
| 159.3 | -0.021 |
| 159.4 | -0.021 |
| 159.5 | -0.021 |
| 159.6 | -0.021 |
| 159.7 | -0.021 |
| 159.8 | -0.021 |
| 159.9 | -0.021 |
| 160.0 | -0.021 |
| 160.1 | -0.021 |
| 160.2 | -0.021 |
| 160.3 | -0.021 |
| 160.4 | -0.021 |
| 160.5 | -0.021 |
| 160.6 | -0.021 |
| 160.7 | -0.021 |
| 160.8 | -0.021 |
| 160.9 | -0.021 |
| 161.0 | -0.021 |
| 161.1 | -0.021 |
| 161.2 | -0.021 |
| 161.3 | -0.021 |
| 161.4 | -0.021 |
| 161.5 | -0.021 |
| 161.6 | -0.021 |
| 161.7 | -0.021 |
| 161.8 | -0.021 |
| 161.9 | -0.021 |
| 162.0 | -0.021 |
| 162.1 | -0.021 |
| 162.2 | -0.021 |
| 162.3 | -0.021 |
| 162.4 | -0.021 |
| 162.5 | -0.021 |
| 162.6 | -0.021 |
| 162.7 | -0.021 |
| 162.8 | -0.021 |
| 162.9 | -0.021 |
| 163.0 | -0.021 |
| 163.1 | -0.021 |
| 163.2 | -0.021 |
| 163.3 | -0.021 |
| 163.4 | -0.021 |
| 163.5 | -0.021 |
| 163.6 | -0.021 |
| 163.7 | -0.021 |
| 163.8 | -0.021 |
| 163.9 | -0.021 |
| 164.0 | -0.021 |
| 164.1 | -0.021 |
| 164.2 | -0.021 |
| 164.3 | -0.021 |
| 164.4 | -0.021 |
| 164.5 | -0.021 |
| 164.6 | -0.021 |
| 164.7 | -0.021 |
| 164.8 | -0.021 |
| 164.9 | -0.021 |
| 165.0 | -0.021 |
| 165.1 | -0.021 |
| 165.2 | -0.021 |
| 165.3 | -0.021 |
| 165.4 | -0.021 |
| 165.5 | -0.021 |
| 165.6 | -0.021 |
| 165.7 | -0.021 |
| 165.8 | -0.021 |
| 165.9 | -0.021 |
| 166.0 | -0.021 |
| 166.1 | -0.021 |
| 166.2 | -0.021 |
| 166.3 | -0.021 |
| 166.4 | -0.021 |
| 166.5 | -0.021 |
| 166.6 | -0.021 |
| 166.7 | -0.021 |
| 166.8 | -0.021 |
| 166.9 | -0.021 |
| 167.0 | -0.021 |
| 167.1 | -0.021 |
| 167.2 | -0.021 |
| 167.3 | -0.021 |
| 167.4 | -0.021 |
| 167.5 | -0.021 |
| 167.6 | -0.021 |
| 167.7 | -0.021 |
| 167.8 | -0.021 |
| 167.9 | -0.021 |
| 168.0 | -0.021 |
| 168.1 | -0.021 |
| 168.2 | -0.021 |
| 168.3 | -0.021 |
| 168.4 | -0.021 |
| 168.5 | -0.021 |
| 168.6 | -0.021 |
| 168.7 | -0.021 |
| 168.8 | -0.021 |
| 168.9 | -0.021 |
| 169.0 | -0.021 |
| 169.1 | -0.021 |
| 169.2 | -0.021 |
| 169.3 | -0.021 |
| 169.4 | -0.021 |
| 169.5 | -0.021 |
| 169.6 | -0.021 |
| 169.7 | -0.021 |
| 169.8 | -0.021 |
| 169.9 | -0.021 |
| 170.0 | -0.021 |
| 170.1 | -0.021 |
| 170.2 | -0.021 |
| 170.3 | -0.021 |
| 170.4 | -0.021 |
| 170.5 | -0.021 |
| 170.6 | -0.021 |
| 170.7 | -0.021 |
| 170.8 | -0.021 |
| 170.9 | -0.021 |
| 171.0 | -0.021 |
| 171.1 | -0.021 |
| 171.2 | -0.021 |
| 171.3 | -0.021 |
| 171.4 | -0.021 |
| 171.5 | -0.021 |
| 171.6 | -0.021 |
| 171.7 | -0.021 |
| 171.8 | -0.021 |
| 171.9 | -0.021 |
| 172.0 | -0.021 |
| 172.1 | -0.021 |
| 172.2 | -0.021 |
| 172.3 | -0.021 |
| 172.4 | -0.021 |
| 172.5 | -0.021 |
| 172.6 | -0.021 |
| 172.7 | -0.021 |
| 172.8 | -0.021 |
| 172.9 | -0.021 |
| 173.0 | -0.021 |
| 173.1 | -0.021 |
| 173.2 | -0.021 |
| 173.3 | -0.021 |
| 173.4 | -0.021 |
| 173.5 | -0.021 |
| 173.6 | -0.021 |
| 173.7 | -0.021 |
| 173.8 | -0.021 |
| 173.9 | -0.021 |
| 174.0 | -0.021 |
| 174.1 | -0.021 |
| 174.2 | -0.021 |
| 174.3 | -0.021 |
| 174.4 | -0.021 |
| 174.5 | -0.021 |
| 174.6 | -0.021 |
| 174.7 | -0.021 |
| 174.8 | -0.021 |
| 174.9 | -0.021 |
| 175.0 | -0.021 |
| 175.1 | -0.021 |
| 175.2 | -0.021 |
| 175.3 | -0.021 |
| 175.4 | -0.021 |
| 175.5 | -0.021 |
| 175.6 | -0.021 |
| 175.7 | -0.021 |
| 175.8 | -0.021 |
| 175.9 | -0.021 |
| 176.0 | -0.021 |
| 176.1 | -0.021 |
| 176.2 | -0.021 |
| 176.3 | -0.021 |
| 176.4 | -0.021 |
| 176.5 | -0.021 |
| 176.6 | -0.021 |
| 176.7 | -0.021 |
| 176.8 | -0.021 |
| 176.9 | -0.021 |
| 177.0 | -0.021 |
| 177.1 | -0.021 |
| 177.2 | -0.021 |
| 177.3 | -0.021 |
| 177.4 | -0.021 |
| 177.5 | -0.021 |
| 177.6 | -0.021 |
| 177.7 | -0.021 |
| 177.8 | -0.021 |
| 177.9 | -0.021 |
| 178.0 | -0.021 |
| 178.1 | -0.021 |
| 178.2 | -0.021 |
| 178.3 | -0.021 |
| 178.4 | -0.021 |
| 178.5 | -0.021 |
| 178.6 | -0.021 |
| 178.7 | -0.021 |
| 178.8 | -0.021 |
| 178.9 | -0.021 |
| 179.0 | -0.021 |
| 179.1 | -0.021 |
| 179.2 | -0.021 |
| 179.3 | -0.021 |
| 179.4 | -0.021 |
| 179.5 | -0.021 |
| 179.6 | -0.021 |
| 179.7 | -0.021 |
| 179.8 | -0.021 |
| 179.9 | -0.021 |
| 180.0 | -0.021 |
| 180.1 | -0.021 |
| 180.2 | -0.021 |
| 180.3 | -0.021 |
| 180.4 | -0.021 |
| 180.5 | -0.021 |
| 180.6 | -0.021 |
| 180.7 | -0.021 |
| 180.8 | -0.021 |
| 180.9 | -0.021 |
| 181.0 | -0.021 |
| 181.1 | -0.021 |
| 181.2 | -0.021 |
| 181.3 | -0.021 |
| 181.4 | -0.021 |
| 181.5 | -0.021 |
| 181.6 | -0.021 |
| 181.7 | -0.021 |
| 181.8 | -0.021 |
| 181.9 | -0.021 |
| 182.0 | -0.021 |
| 182.1 | -0.021 |
| 182.2 | -0.021 |
| 182.3 | -0.021 |
| 182.4 | -0.021 |
| 182.5 | -0.021 |
| 182.6 | -0.021 |
| 182.7 | -0.021 |
| 182.8 | -0.021 |
| 182.9 | -0.021 |
| 183.0 | -0.021 |
| 183.1 | -0.021 |
| 183.2 | -0.021 |
| 183.3 | -0.021 |
| 183.4 | -0.021 |
| 183.5 | -0.021 |
| 183.6 | -0.021 |
| 183.7 | -0.021 |
| 183.8 | -0.021 |
| 183.9 | -0.021 |
| 184.0 | -0.021 |
| 184.1 | -0.021 |
| 184.2 | -0.021 |
| 184.3 | -0.021 |
| 184.4 | -0.021 |
| 184.5 | -0.021 |
| 184.6 | -0.021 |
| 184.7 | -0.021 |
| 184.8 | -0.021 |
| 184.9 | -0.021 |
| 185.0 | -0.021 |
| 185.1 | -0.021 |
| 185.2 | -0.021 |
| 185.3 | -0.021 |
| 185.4 | -0.021 |
| 185.5 | -0.021 |
| 185.6 | -0.021 |
| 185.7 | -0.021 |
| 185.8 | -0.021 |
| 185.9 | -0.021 |
| 186.0 | -0.021 |
| 186.1 | -0.021 |
| 186.2 | -0.021 |
| 186.3 | -0.021 |
| 186.4 | -0.021 |
| 186.5 | -0.021 |
| 186.6 | -0.021 |
| 186.7 | -0.021 |
| 186.8 | -0.021 |
| 186.9 | -0.021 |
| 187.0 | -0.021 |
| 187.1 | -0.021 |
| 187.2 | -0.021 |
| 187.3 | -0.021 |
| 187.4 | -0.021 |
| 187.5 | -0.021 |
| 187.6 | -0.021 |
| 187.7 | -0.021 |
| 187.8 | -0.021 |
| 187.9 | -0.021 |
| 188.0 | -0.021 |
| 188.1 | -0.021 |
| 188.2 | -0.021 |
| 188.3 | -0.021 |
| 188.4 | -0.021 |
| 188.5 | -0.021 |
| 188.6 | -0.021 |
| 188.7 | -0.021 |
| 188.8 | -0.021 |
| 188.9 | -0.021 |
| 189.0 | -0.021 |
| 189.1 | -0.021 |
| 189.2 | -0.021 |
| 189.3 | -0.021 |
| 189.4 | -0.021 |
| 189.5 | -0.021 |
| 189.6 | -0.021 |
| 189.7 | -0.021 |
| 189.8 | -0.021 |
| 189.9 | -0.021 |
| 190.0 | -0.021 |
| 190.1 | -0.021 |
| 190.2 | -0.021 |
| 190.3 | -0.021 |
| 190.4 | -0.021 |
| 190.5 | -0.021 |
| 190.6 | -0.021 |
| 190.7 | -0.021 |
| 190.8 | -0.021 |
| 190.9 | -0.021 |
| 191.0 | -0.021 |
| 191.1 | -0.021 |
| 191.2 | -0.021 |
| 191.3 | -0.021 |
| 191.4 | -0.021 |
| 191.5 | -0.021 |
| 191.6 | -0.021 |
| 191.7 | -0.021 |
| 191.8 | -0.021 |
| 191.9 | -0.021 |
| 192.0 | -0.021 |
| 192.1 | -0.021 |
| 192.2 | -0.021 |
| 192.3 | -0.021 |
| 192.4 | -0.021 |
| 192.5 | -0.021 |
| 192.6 | -0.021 |
| 192.7 | -0.021 |
| 192.8 | -0.021 |
| 192.9 | -0.021 |
| 193.0 | -0.021 |
| 193.1 | -0.021 |
| 193.2 | -0.021 |
| 193.3 | -0.021 |
| 193.4 | -0.021 |
| 193.5 | -0.021 |
| 193.6 | -0.021 |
| 193.7 | -0.021 |
| 193.8 | -0.021 |
| 193.9 | -0.021 |
| 194.0 | -0.021 |
| 194.1 | -0.021 |
| 194.2 | -0.021 |
| 194.3 | -0.021 |
| 194.4 | -0.021 |
| 194.5 | -0.021 |
| 194.6 | -0.021 |
| 194.7 | -0.021 |
| 194.8 | -0.021 |
| 194.9 | -0.021 |
| 195.0 | -0.021 |
| 195.1 | -0.021 |
| 195.2 | -0.021 |
| 195.3 | -0.021 |
| 195.4 | -0.021 |
| 195.5 | -0.021 |
| 195.6 | -0.021 |
| 195.7 | -0.021 |
| 195.8 | -0.021 |
| 195.9 | -0.021 |
| 196.0 | -0.021 |
| 196.1 | -0.021 |
| 196.2 | -0.021 |
| 196.3 | -0.021 |
| 196.4 | -0.021 |
| 196.5 | -0.021 |
| 196.6 | -0.021 |
| 196.7 | -0.021 |
| 196.8 | -0.021 |
| 196.9 | -0.021 |
| 197.0 | -0.021 |
| 197.1 | -0.021 |
| 197.2 | -0.021 |
| 197.3 | -0.021 |
| 197.4 | -0.021 |
| 197.5 | -0.021 |
| 197.6 | -0.021 |
| 197.7 | -0.021 |
| 197.8 | -0.021 |
| 197.9 | -0.021 |
| 198.0 | -0.021 |
| 198.1 | -0.021 |
| 198.2 | -0.021 |
| 198.3 | -0.021 |
| 198.4 | -0.021 |
| 198.5 | -0.021 |
| 198.6 | -0.021 |
| 198.7 | -0.021 |
| 198.8 | -0.021 |
| 198.9 | -0.021 |
| 199.0 | -0.021 |
| 199.1 | -0.021 |
| 199.2 | -0.021 |
| 199.3 | -0.021 |
| 199.4 | -0.021 |
| 199.5 | -0.021 |
| 199.6 | -0.021 |
| 199.7 | -0.021 |
| 199.8 | -0.021 |
| 199.9 | -0.021 |
| 200.0 | -0.021 |
| 200.1 | -0.021 |
| 200.2 | -0.021 |
| 200.3 | -0.021 |
| 200.4 | -0.021 |
| 200.5 | -0.021 |
| 200.6 | -0.021 |
| 200.7 | -0.021 |
| 200.8 | -0.021 |
| 200.9 | -0.021 |
| 201.0 | -0.021 |
| 201.1 | -0.021 |
| 201.2 | -0.021 |
| 201.3 | -0.021 |
| 201.4 | -0.021 |
| 201.5 | -0.021 |
| 201.6 | -0.021 |
| 201.7 | -0.021 |
| 201.8 | -0.021 |
| 201.9 | -0.021 |
| 202.0 | -0.021 |
| 202.1 | -0.021 |
| 202.2 | -0.021 |
| 202.3 | -0.021 |
| 202.4 | -0.021 |
| 202.5 | -0.021 |
| 202.6 | -0.021 |
| 202.7 | -0.021 |
| 202.8 | -0.021 |
| 202.9 | -0.021 |
| 203.0 | -0.021 |
| 203.1 | -0.021 |
| 203.2 | -0.021 |
| 203.3 | -0.021 |
| 203.4 | -0.021 |
| 203.5 | -0.021 |
| 203.6 | -0.021 |
| 203.7 | -0.021 |
| 203.8 | -0.021 |
| 203.9 | -0.021 |
| 204.0 | -0.021 |
| 204.1 | -0.021 |
| 204.2 | -0.021 |
| 204.3 | -0.021 |
| 204.4 | -0.021 |
| 204.5 | -0.021 |
| 204.6 | -0.021 |
| 204.7 | -0.021 |
| 204.8 | -0.021 |
| 204.9 | -0.021 |
| 205.0 | -0.021 |
| 205.1 | -0.021 |
| 205.2 | -0.021 |
| 205.3 | -0.021 |
| 205.4 | -0.021 |
| 205.5 | -0.021 |
| 205.6 | -0.021 |
| 205.7 | -0.021 |
| 205.8 | -0.021 |
| 205.9 | -0.021 |
| 206.0 | -0.021 |
| 206.1 | -0.021 |
| 206.2 | -0.021 |
| 206.3 | -0.021 |
| 206.4 | -0.021 |
| 206.5 | -0.021 |
| 206.6 | -0.021 |
| 206.7 | -0.021 |
| 206.8 | -0.021 |
| 206.9 | -0.021 |
| 207.0 | -0.021 |
| 207.1 | -0.021 |
| 207.2 | -0.021 |
| 207.3 | -0.021 |
| 207.4 | -0.021 |
| 207.5 | -0.021 |
| 207.6 | -0.021 |
| 207.7 | -0.021 |
| 207.8 | -0.021 |
| 207.9 | -0.021 |
| 208.0 | -0.021 |
| 208.1 | -0.021 |
| 208.2 | -0.021 |
| 208.3 | -0.021 |
| 208.4 | -0.021 |
| 208.5 | -0.021 |
| 208.6 | -0.021 |
| 208.7 | -0.021 |
| 208.8 | -0.021 |
| 208.9 | -0.021 |
| 209.0 | -0.021 |
| 209.1 | -0.021 |
| 209.2 | -0.021 |
| 209.3 | -0.021 |
| 209.4 | -0.021 |
| 209.5 | -0.021 |
| 209.6 | -0.021 |
| 209.7 | -0.021 |
| 209.8 | -0.021 |
| 209.9 | -0.021 |
| 210.0 | -0.021 |
| 210.1 | -0.021 |
| 210.2 | -0.021 |
| 210.3 | -0.021 |
| 210.4 | -0.021 |
| 210.5 | -0.021 |
| 210.6 | -0.021 |
| 210.7 | -0.021 |
| 210.8 | -0.021 |
| 210.9 | -0.021 |
| 211.0 | -0.021 |
| 211.1 | -0.021 |
| 211.2 | -0.021 |
| 211.3 | -0.021 |
| 211.4 | -0.021 |
| 211.5 | -0.021 |
| 211.6 | -0.021 |
| 211.7 | -0.021 |
| 211.8 | -0.021 |
| 211.9 | -0.021 |
| 212.0 | -0.021 |
| 212.1 | -0.021 |
| 212.2 | -0.021 |
| 212.3 | -0.021 |
| 212.4 | -0.021 |
| 212.5 | -0.021 |
| 212.6 | -0.021 |
| 212.7 | -0.021 |
| 212.8 | -0.021 |
| 212.9 | -0.021 |
| 213.0 | -0.021 |
| 213.1 | -0.021 |
| 213.2 | -0.021 |
| 213.3 | -0.021 |
| 213.4 | -0.021 |
| 213.5 | -0.021 |
| 213.6 | -0.021 |
| 213.7 | -0.021 |
| 213.8 | -0.021 |
| 213.9 | -0.021 |
| 214.0 | -0.021 |
| 214.1 | -0.021 |
| 214.2 | -0.021 |
| 214.3 | -0.021 |
| 214.4 | -0.021 |
| 214.5 | -0.021 |
| 214.6 | -0.021 |
| 214.7 | -0.021 |
| 214.8 | -0.021 |
| 214.9 | -0.021 |
| 215.0 | -0.021 |
| 215.1 | -0.021 |
| 215.2 | -0.021 |
| 215.3 | -0.021 |
| 215.4 | -0.021 |
| 215.5 | -0.021 |
| 215.6 | -0.021 |
| 215.7 | -0.021 |
| 215.8 | -0.021 |
| 215.9 | -0.021 |
| 216.0 | -0.021 |
| 216.1 | -0.021 |
| 216.2 | -0.021 |
| 216.3 | -0.021 |
| 216.4 | -0.021 |
| 216.5 | -0.021 |
| 216.6 | -0.021 |
| 216.7 | -0.021 |
| 216.8 | -0.021 |
| 216.9 | -0.021 |
| 217.0 | -0.021 |
| 217.1 | -0.021 |
| 217.2 | -0.021 |
| 217.3 | -0.021 |
| 217.4 | -0.021 |
| 217.5 | -0.021 |
| 217.6 | -0.021 |
| 217.7 | -0.021 |
| 217.8 | -0.021 |
| 217.9 | -0.021 |
| 218.0 | -0.021 |
| 218.1 | -0.021 |
| 218.2 | -0.021 |
| 218.3 | -0.021 |
| 218.4 | -0.021 |
| 218.5 | -0.021 |
| 218.6 | -0.021 |
| 218.7 | -0.021 |
| 218.8 | -0.021 |
| 218.9 | -0.021 |
| 219.0 | -0.021 |
| 219.1 | -0.021 |
| 219.2 | -0.021 |
| 219.3 | -0.021 |
| 219.4 | -0.021 |
| 219.5 | -0.021 |
| 219.6 | -0.021 |
| 219.7 | -0.021 |
| 219.8 | -0.021 |
| 219.9 | -0.021 |
| 220.0 | -0.021 |
| 220.1 | -0.021 |
| 220.2 | -0.021 |
| 220.3 | -0.021 |
| 220.4 | -0.021 |
| 220.5 | -0.021 |
| 220.6 | -0.021 |
| 220.7 | -0.021 |
| 220.8 | -0.021 |
| 220.9 | -0.021 |
| 221.0 | -0.021 |
| 221.1 | -0.021 |
| 221.2 | -0.021 |
| 221.3 | -0.021 |
| 221.4 | -0.021 |
| 221.5 | -0.021 |
| 221.6 | -0.021 |
| 221.7 | -0.021 |
| 221.8 | -0.021 |
| 221.9 | -0.021 |
| 222.0 | -0.021 |
| 222.1 | -0.021 |
| 222.2 | -0.021 |
| 222.3 | -0.021 |
| 222.4 | -0.021 |
| 222.5 | -0.021 |
| 222.6 | -0.021 |
| 222.7 | -0.021 |
| 222.8 | -0.021 |
| 222.9 | -0.021 |
| 223.0 | -0.021 |
| 223.1 | -0.021 |
| 223.2 | -0.021 |
| 223.3 | -0.021 |
| 223.4 | -0.021 |
| 223.5 | -0.021 |
| 223.6 | -0.021 |
| 223.7 | -0.021 |
| 223.8 | -0.021 |
| 223.9 | -0.021 |
| 224.0 | -0.021 |
| 224.1 | -0.021 |
| 224.2 | -0.021 |
| 224.3 | -0.021 |
| 224.4 | -0.021 |
| 224.5 | -0.021 |
| 224.6 | -0.021 |
| 224.7 | -0.021 |
| 224.8 | -0.021 |
| 224.9 | -0.021 |
| 225.0 | -0.021 |
| 225.1 | -0.021 |
| 225.2 | -0.021 |
| 225.3 | -0.021 |
| 225.4 | -0.021 |
| 225.5 | -0.021 |
| 225.6 | -0.021 |
| 225.7 | -0.021 |
| 225.8 | -0.021 |
| 225.9 | -0.021 |
| 226.0 | -0.021 |
| 226.1 | -0.021 |
| 226.2 | -0.021 |
| 226.3 | -0.021 |
| 226.4 | -0.021 |
| 226.5 | -0.021 |
| 226.6 | -0.021 |
| 226.7 | -0.021 |
| 226.8 | -0.021 |
| 226.9 | -0.021 |
| 227.0 | -0.021 |
| 227.1 | -0.021 |
| 227.2 | -0.021 |
| 227.3 | -0.021 |
| 227.4 | -0.021 |
| 227.5 | -0.021 |
| 227.6 | -0.021 |
| 227.7 | -0.021 |
| 227.8 | -0.021 |
| 227.9 | -0.021 |
| 228.0 | -0.021 |
| 228.1 | -0.021 |
| 228.2 | -0.021 |
| 228.3 | -0.021 |
| 228.4 | -0.021 |
| 228.5 | -0.021 |
| 228.6 | -0.021 |
| 228.7 | -0.021 |
| 228.8 | -0.021 |
| 228.9 | -0.021 |
| 229.0 | -0.021 |
| 229.1 | -0.021 |
| 229.2 | -0.021 |
| 229.3 | -0.021 |
| 229.4 | -0.021 |
| 229.5 | -0.021 |
| 229.6 | -0.021 |
| 229.7 | -0.021 |
| 229.8 | -0.021 |
| 229.9 | -0.021 |
| 230.0 | -0.021 |
| 230.1 | -0.021 |
| 230.2 | -0.021 |
| 230.3 | -0.021 |
| 230.4 | -0.021 |
| 230.5 | -0.021 |
| 230.6 | -0.021 |
| 230.7 | -0.021 |
| 230.8 | -0.021 |
| 230.9 | -0.021 |
| 231.0 | -0.021 |
| 231.1 | -0.021 |
| 231.2 | -0.021 |
| 231.3 | -0.021 |
| 231.4 | -0.021 |
| 231.5 | -0.021 |
| 231.6 | -0.021 |
| 231.7 | -0.021 |
| 231.8 | -0.021 |
| 231.9 | -0.021 |
| 232.0 | -0.021 |
| 232.1 | -0.021 |
| 232.2 | -0.021 |
| 232.3 | -0.021 |
| 232.4 | -0.021 |
| 232.5 | -0.021 |
| 232.6 | -0.021 |
| 232.7 | -0.021 |
| 232.8 | -0.021 |
| 232.9 | -0.021 |
| 233.0 | -0.021 |
| 233.1 | -0.021 |
| 233.2 | -0.021 |
| 233.3 | -0.021 |
| 233.4 | -0.021 |
| 233.5 | -0.021 |
| 233.6 | -0.021 |
| 233.7 | -0.021 |
| 233.8 | -0.021 |
| 233.9 | -0.021 |
| 234.0 | -0.021 |
| 234.1 | -0.021 |
| 234.2 | -0.021 |
| 234.3 | -0.021 |
| 234.4 | -0.021 |
| 234.5 | -0.021 |
| 234.6 | -0.021 |
| 234.7 | -0.021 |
| 234.8 | -0.021 |
| 234.9 | -0.021 |
| 235.0 | -0.021 |
| 235.1 | -0.021 |
| 235.2 | -0.021 |
| 235.3 | -0.021 |
| 235.4 | -0.021 |
| 235.5 | -0.021 |
| 235.6 | -0.021 |
| 235.7 | -0.021 |
| 235.8 | -0.021 |
| 235.9 | -0.021 |
| 236.0 | -0.021 |
| 236.1 | -0.021 |
| 236.2 | -0.021 |
| 236.3 | -0.021 |
| 236.4 | -0.021 |
| 236.5 | -0.021 |
| 236.6 | -0.021 |
| 236.7 | -0.021 |
| 236.8 | -0.021 |
| 236.9 | -0.021 |
| 237.0 | -0.021 |
| 237.1 | -0.021 |
| 237.2 | -0.021 |
| 237.3 | -0.021 |
| 237.4 | -0.021 |
| 237.5 | -0.021 |
| 237.6 | -0.021 |
| 237.7 | -0.021 |
| 237.8 | -0.021 |
| 237.9 | -0.021 |
| 238.0 | -0.021 |
| 238.1 | -0.021 |
| 238.2 | -0.021 |
| 238.3 | -0.021 |
| 238.4 | -0.021 |
| 238.5 | -0.021 |
| 238.6 | -0.021 |
| 238.7 | -0.021 |
| 238.8 | -0.021 |
| 238.9 | -0.021 |
| 239.0 | -0.021 |
| 239.1 | -0.021 |
| 239.2 | -0.021 |
| 239.3 | -0.021 |
| 239.4 | -0.021 |
| 239.5 | -0.021 |
| 239.6 | -0.021 |
| 239.7 | -0.021 |
| 239.8 | -0.021 |
| 239.9 | -0.021 |
| 240.0 | -0.021 |
| 240.1 | -0.021 |
| 240.2 | -0.021 |
| 240.3 | -0.021 |
| 240.4 | -0.021 |
| 240.5 | -0.021 |
| 240.6 | -0.021 |
| 240.7 | -0.021 |
| 240.8 | -0.021 |
| 240.9 | -0.021 |
| 241.0 | -0.021 |
| 241.1 | -0.021 |
| 241.2 | -0.021 |
| 241.3 | -0.021 |
| 241.4 | -0.021 |
| 241.5 | -0.021 |
| 241.6 | -0.021 |
| 241.7 | -0.021 |
| 241.8 | -0.021 |
| 241.9 | -0.021 |
| 242.0 | -0.021 |
| 242.1 | -0.021 |
| 242.2 | -0.021 |
| 242.3 | -0.021 |
| 242.4 | -0.021 |
| 242.5 | -0.021 |
| 242.6 | -0.021 |
| 242.7 | -0.021 |
| 242.8 | -0.021 |
| 242.9 | -0.021 |
| 243.0 | -0.021 |
| 243.1 | -0.021 |
| 243.2 | -0.021 |
| 243.3 | -0.021 |
| 243.4 | -0.021 |
| 243.5 | -0.021 |
| 243.6 | -0.021 |
| 243.7 | -0.021 |
| 243.8 | -0.021 |
| 243.9 | -0.021 |
| 244.0 | -0.021 |
| 244.1 | -0.021 |
| 244.2 | -0.021 |
| 244.3 | -0.021 |
| 244.4 | -0.021 |
| 244.5 | -0.021 |
| 244.6 | -0.021 |
| 244.7 | -0.021 |
| 244.8 | -0.021 |
| 244.9 | -0.021 |
| 245.0 | -0.021 |
| 245.1 | -0.021 |
| 245.2 | -0.021 |
| 245.3 | -0.021 |
| 245.4 | -0.021 |
| 245.5 | -0.021 |
| 245.6 | -0.021 |
| 245.7 | -0.021 |
| 245.8 | -0.021 |
| 245.9 | -0.021 |
| 246.0 | -0.021 |
| 246.1 | -0.021 |
| 246.2 | -0.021 |
| 246.3 | -0.021 |
| 246.4 | -0.021 |
| 246.5 | -0.021 |
| 246.6 | -0.021 |
| 246.7 | -0.021 |
| 246.8 | -0.021 |
| 246.9 | -0.021 |
| 247.0 | -0.021 |
| 247.1 | -0.021 |
| 247.2 | -0.021 |
| 247.3 | -0.021 |
| 247.4 | -0.021 |
| 247.5 | -0.021 |
| 247.6 | -0.021 |
| 247.7 | -0.021 |
| 247.8 | -0.021 |
| 247.9 | -0.021 |
| 248.0 | -0.021 |
| 248.1 | -0.021 |
| 248.2 | -0.021 |
| 248.3 | -0.021 |
| 248.4 | -0.021 |
| 248.5 | -0.021 |
| 248.6 | -0.021 |
| 248.7 | -0.021 |
| 248.8 | -0.021 |
| 248.9 | -0.021 |
| 249.0 | -0.021 |
| 249.1 | -0.021 |
| 249.2 | -0.021 |
| 249.3 | -0.021 |
| 249.4 | -0.021 |
| 249.5 | -0.021 |
| 249.6 | -0.021 |
| 249.7 | -0.021 |
| 249.8 | -0.021 |
| 249.9 | -0.021 |
| 250.0 | -0.021 |
| 250.1 | -0.021 |
| 250.2 | -0.021 |
| 250.3 | -0.021 |
| 250.4 | -0.021 |
| 250.5 | -0.021 |
| 250.6 | -0.021 |
| 250.7 | -0.021 |
| 250.8 | -0.021 |
| 250.9 | -0.021 |
| 251.0 | -0.021 |
| 251.1 | -0.021 |
| 251.2 | -0.021 |
| 251.3 | -0.021 |
| 251.4 | -0.021 |
| 251.5 | -0.021 |
| 251.6 | -0.021 |
| 251.7 | -0.021 |
| 251.8 | -0.021 |
| 251.9 | -0.021 |
| 252.0 | -0.021 |
| 252.1 | -0.021 |
| 252.2 | -0.021 |
| 252.3 | -0.021 |
| 252.4 | -0.021 |
| 252.5 | -0.021 |
| 252.6 | -0.021 |
| 252.7 | -0.021 |
| 252.8 | -0.021 |
| 252.9 | -0.021 |
| 253.0 | -0.021 |
| 253.1 | -0.021 |
| 253.2 | -0.021 |
| 253.3 | -0.021 |
| 253.4 | -0.021 |
| 253.5 | -0.021 |
| 253.6 | -0.021 |
| 253.7 | -0.021 |
| 253.8 | -0.021 |
| 253.9 | -0.021 |
| 254.0 | -0.021 |
| 254.1 | -0.021 |
| 254.2 | -0.021 |
| 254.3 | -0.021 |
| 254.4 | -0.021 |
| 254.5 | -0.021 |
| 254.6 | -0.021 |
| 254.7 | -0.021 |
| 254.8 | -0.021 |
| 254.9 | -0.021 |
| 255.0 | -0.021 |
| 255.1 | -0.021 |
| 255.2 | -0.021 |
| 255.3 | -0.021 |
| 255.4 | -0.021 |
| 255.5 | -0.021 |
| 255.6 | -0.021 |
| 255.7 | -0.021 |
| 255.8 | -0.021 |
| 255.9 | -0.021 |
| 256.0 | -0.021 |
| 256.1 | -0.021 |
| 256.2 | -0.021 |
| 256.3 | -0.021 |
| 256.4 | -0.021 |
| 256.5 | -0.021 |
| 256.6 | -0.021 |
| 256.7 | -0.021 |
| 256.8 | -0.021 |
| 256.9 | -0.021 |
| 257.0 | -0.021 |
| 257.1 | -0.021 |
| 257.2 | -0.021 |
| 257.3 | -0.021 |
| 257.4 | -0.021 |
| 257.5 | -0.021 |
| 257.6 | -0.021 |
| 257.7 | -0.021 |
| 257.8 | -0.021 |
| 257.9 | -0.021 |
| 258.0 | -0.021 |
| 258.1 | -0.021 |
| 258.2 | -0.021 |
| 258.3 | -0.021 |
| 258.4 | -0.021 |
| 258.5 | -0.021 |
| 258.6 | -0.021 |
| 258.7 | -0.021 |
| 258.8 | -0.021 |
| 258.9 | -0.021 |
| 259.0 | -0.021 |
| 259.1 | -0.021 |
| 259.2 | -0.021 |
| 259.3 | -0.021 |
| 259.4 | -0.021 |
| 259.5 | -0.021 |
| 259.6 | -0.021 |
| 259.7 | -0.021 |
| 259.8 | -0.021 |
| 259.9 | -0.021 |
| 260.0 | -0.021 |
| 260.1 | -0.021 |
| 260.2 | -0.021 |
| 260.3 | -0.021 |
| 260.4 | -0.021 |
| 260.5 | -0.021 |
| 260.6 | -0.021 |
| 260.7 | -0.021 |
| 260.8 | -0.021 |
| 260.9 | -0.021 |
| 261.0 | -0.021 |
| 261.1 | -0.021 |
| 261.2 | -0.021 |
| 261.3 | -0.021 |
| 261.4 | -0.021 |
| 261.5 | -0.021 |
| 261.6 | -0.021 |
| 261.7 | -0.021 |
| 261.8 | -0.021 |
| 261.9 | -0.021 |
| 262.0 | -0.021 |
| 262.1 | -0.021 |
| 262.2 | -0.021 |
| 262.3 | -0.021 |
| 262.4 | -0.021 |
| 262.5 | -0.021 |
| 262.6 | -0.021 |
| 262.7 | -0.021 |
| 262.8 | -0.021 |
| 262.9 | -0.021 |
| 263.0 | -0.021 |
| 263.1 | -0.021 |
| 263.2 | -0.021 |
| 263.3 | -0.021 |
| 263.4 | -0.021 |
| 263.5 | -0.021 |
| 263.6 | -0.021 |
| 263.7 | -0.021 |
| 263.8 | -0.021 |
| 263.9 | -0.021 |
| 264.0 | -0.021 |
| 264.1 | -0.021 |
| 264.2 | -0.021 |
| 264.3 | -0.021 |
| 264.4 | -0.021 |
| 264.5 | -0.021 |
| 264.6 | -0.021 |
| 264.7 | -0.021 |
| 264.8 | -0.021 |
| 264.9 | -0.021 |
| 265.0 | -0.021 |
| 265.1 | -0.021 |
| 265.2 | -0.021 |
| 265.3 | -0.021 |
| 265.4 | -0.021 |
| 265.5 | -0.021 |
| 265.6 | -0.021 |
| 265.7 | -0.021 |
| 265.8 | -0.021 |
| 265.9 | -0.021 |
| 266.0 | -0.021 |
| 266.1 | -0.021 |
| 266.2 | -0.021 |
| 266.3 | -0.021 |
| 266.4 | -0.021 |
| 266.5 | -0.021 |
| 266.6 | -0.021 |
| 266.7 | -0.021 |
| 266.8 | -0.021 |
| 266.9 | -0.021 |
| 267.0 | -0.021 |
| 267.1 | -0.021 |
| 267.2 | -0.021 |
| 267.3 | -0.021 |
| 267.4 | -0.021 |
| 267.5 | -0.021 |
| 267.6 | -0.021 |
| 267.7 | -0.021 |
| 267.8 | -0.021 |
| 267.9 | -0.021 |
| 268.0 | -0.021 |
| 268.1 | -0.021 |
| 268.2 | -0.021 |
| 268.3 | -0.021 |
| 268.4 | -0.021 |
| 268.5 | -0.021 |
| 268.6 | -0.021 |
| 268.7 | -0.021 |
| 268.8 | -0.021 |
| 268.9 | -0.021 |
| 269.0 | -0.021 |
| 269.1 | -0.021 |
| 269.2 | -0.021 |
| 269.3 | -0.021 |
| 269.4 | -0.021 |
| 269.5 | -0.021 |
| 269.6 | -0.021 |
| 269.7 | -0.021 |
| 269.8 | -0.021 |
| 269.9 | -0.021 |
| 270.0 | -0.021 |
| 270.1 | -0.021 |
| 270.2 | -0.021 |
| 270.3 | -0.021 |
| 270.4 | -0.021 |
| 270.5 | -0.021 |
| 270.6 | -0.021 |
| 270.7 | -0.021 |
| 270.8 | -0.021 |
| 270.9 | -0.021 |
| 271.0 | -0.021 |
| 271.1 | -0.021 |
| 271.2 | -0.021 |
| 271.3 | -0.021 |
| 271.4 | -0.021 |
| 271.5 | -0.021 |
| 271.6 | -0.021 |
| 271.7 | -0.021 |
| 271.8 | -0.021 |
| 271.9 | -0.021 |
| 272.0 | -0.021 |
| 272.1 | -0.021 |
| 272.2 | -0.021 |
| 272.3 | -0.021 |
| 272.4 | -0.021 |
| 272.5 | -0.021 |
| 272.6 | -0.021 |
| 272.7 | -0.021 |
| 272.8 | -0.021 |
| 272.9 | -0.021 |
| 273.0 | -0.021 |
| 273.1 | -0.021 |
| 273.2 | -0.021 |
| 273.3 | -0.021 |
| 273.4 | -0.021 |
| 273.5 | -0.021 |
| 273.6 | -0.021 |
| 273.7 | -0.021 |
| 273.8 | -0.021 |
| 273.9 | -0.021 |
| 274.0 | -0.021 |
| 274.1 | -0.021 |
| 274.2 | -0.021 |
| 274.3 | -0.021 |
| 274.4 | -0.021 |
| 274.5 | -0.021 |
| 274.6 | -0.021 |
| 274.7 | -0.021 |
| 274.8 | -0.021 |
| 274.9 | -0.021 |
| 275.0 | -0.021 |
| 275.1 | -0.021 |
| 275.2 | -0.021 |
| 275.3 | -0.021 |
| 275.4 | -0.021 |
| 275.5 | -0.021 |
| 275.6 | -0.021 |
| 275.7 | -0.021 |
| 275.8 | -0.021 |
| 275.9 | -0.021 |
| 276.0 | -0.021 |
| 276.1 | -0.021 |
| 276.2 | -0.021 |
| 276.3 | -0.021 |
| 276.4 | -0.021 |
| 276.5 | -0.021 |
| 276.6 | -0.021 |
| 276.7 | -0.021 |
| 276.8 | -0.021 |
| 276.9 | -0.021 |
| 277.0 | -0.021 |
| 277.1 | -0.021 |
| 277.2 | -0.021 |
| 277.3 | -0.021 |
| 277.4 | -0.021 |
| 277.5 | -0.021 |
| 277.6 | -0.021 |
| 277.7 | -0.021 |
| 277.8 | -0.021 |
| 277.9 | -0.021 |
| 278.0 | -0.021 |
| 278.1 | -0.021 |
| 278.2 | -0.021 |
| 278.3 | -0.021 |
| 278.4 | -0.021 |
| 278.5 | -0.021 |
| 278.6 | -0.021 |
| 278.7 | -0.021 |
| 278.8 | -0.021 |
| 278.9 | -0.021 |
| 279.0 | -0.021 |
| 279.1 | -0.021 |
| 279.2 | -0.021 |
| 279.3 | -0.021 |
| 279.4 | -0.021 |
| 279.5 | -0.021 |
| 279.6 | -0.021 |
| 279.7 | -0.021 |
| 279.8 | -0.021 |
| 279.9 | -0.021 |
| 280.0 | -0.021 |
| 280.1 | -0.021 |
| 280.2 | -0.021 |
| 280.3 | -0.021 |
| 280.4 | -0.021 |
| 280.5 | -0.021 |
| 280.6 | -0.021 |
| 280.7 | -0.021 |
| 280.8 | -0.021 |
| 280.9 | -0.021 |
| 281.0 | -0.021 |
| 281.1 | -0.021 |
| 281.2 | -0.021 |
| 281.3 | -0.021 |
| 281.4 | -0.021 |
| 281.5 | -0.021 |
| 281.6 | -0.021 |
| 281.7 | -0.021 |
| 281.8 | -0.021 |
| 281.9 | -0.021 |
| 282.0 | -0.021 |
| 282.1 | -0.021 |
| 282.2 | -0.021 |
| 282.3 | -0.021 |
| 282.4 | -0.021 |
| 282.5 | -0.021 |
| 282.6 | -0.021 |
| 282.7 | -0.021 |
| 282.8 | -0.021 |
| 282.9 | -0.021 |
| 283.0 | -0.021 |
| 283.1 | -0.021 |
| 283.2 | -0.021 |
| 283.3 | -0.021 |
| 283.4 | -0.021 |
| 283.5 | -0.021 |
| 283.6 | -0.021 |
| 283.7 | -0.021 |
| 283.8 | -0.021 |
| 283.9 | -0.021 |
| 284.0 | -0.021 |
| 284.1 | -0.021 |
| 284.2 | -0.021 |
| 284.3 | -0.021 |
| 284.4 | -0.021 |
| 284.5 | -0.021 |
| 284.6 | -0.021 |
| 284.7 | -0.021 |
| 284.8 | -0.021 |
| 284.9 | -0.021 |
| 285.0 | -0.021 |
| 285.1 | -0.021 |
| 285.2 | -0.021 |
| 285.3 | -0.021 |
| 285.4 | -0.021 |
| 285.5 | -0.021 |
| 285.6 | -0.021 |
| 285.7 | -0.021 |
| 285.8 | -0.021 |
| 285.9 | -0.021 |
| 286.0 | -0.021 |
| 286.1 | -0.021 |
| 286.2 | -0.021 |
| 286.3 | -0.021 |
| 286.4 | -0.021 |
| 286.5 | -0.021 |
| 286.6 | -0.021 |
| 286.7 | -0.021 |
| 286.8 | -0.021 |
| 286.9 | -0.021 |
| 287.0 | -0.021 |
| 287.1 | -0.021 |
| 287.2 | -0.021 |
| 287.3 | -0.021 |
| 287.4 | -0.021 |
| 287.5 | -0.021 |
| 287.6 | -0.021 |
| 287.7 | -0.021 |
| 287.8 | -0.021 |
| 287.9 | -0.021 |
| 288.0 | -0.021 |
| 288.1 | -0.021 |
| 288.2 | -0.021 |
| 288.3 | -0.021 |
| 288.4 | -0.021 |
| 288.5 | -0.021 |
| 288.6 | -0.021 |
| 288.7 | -0.021 |
| 288.8 | -0.021 |
| 288.9 | -0.021 |
| 289.0 | -0.021 |
| 289.1 | -0.021 |
| 289.2 | -0.021 |
| 289.3 | -0.021 |
| 289.4 | -0.021 |
| 289.5 | -0.021 |
| 289.6 | -0.021 |
| 289.7 | -0.021 |
| 289.8 | -0.021 |
| 289.9 | -0.021 |
| 290.0 | -0.021 |
| 290.1 | -0.021 |
| 290.2 | -0.021 |
| 290.3 | -0.021 |
| 290.4 | -0.021 |
| 290.5 | -0.021 |
| 290.6 | -0.021 |
| 290.7 | -0.021 |
| 290.8 | -0.021 |
| 290.9 | -0.021 |
| 291.0 | -0.021 |
| 291.1 | -0.021 |
| 291.2 | -0.021 |
| 291.3 | -0.021 |
| 291.4 | -0.021 |
| 291.5 | -0.021 |
| 291.6 | -0.021 |
| 291.7 | -0.021 |
| 291.8 | -0.021 |
| 291.9 | -0.021 |
| 292.0 | -0.021 |
| 292.1 | -0.021 |
| 292.2 | -0.021 |
| 292.3 | -0.021 |
| 292.4 | -0.021 |
| 292.5 | -0.021 |
| 292.6 | -0.021 |
| 292.7 | -0.021 |
| 292.8 | -0.021 |
| 292.9 | -0.021 |
| 293.0 | -0.021 |
| 293.1 | -0.021 |
| 293.2 | -0.021 |
| 293.3 | -0.021 |
| 293.4 | -0.021 |
| 293.5 | -0.021 |
| 293.6 | -0.021 |
| 293.7 | -0.021 |
| 293.8 | -0.021 |
| 293.9 | -0.021 |
| 294.0 | -0.021 |
| 294.1 | -0.021 |
| 294.2 | -0.021 |
| 294.3 | -0.021 |
| 294.4 | -0.021 |
| 294.5 | -0.021 |
| 294.6 | -0.021 |
| 294.7 | -0.021 |
| 294.8 | -0.021 |
| 294.9 | -0.021 |
| 295.0 | -0.021 |
| 295.1 | -0.021 |
| 295.2 | -0.021 |
| 295.3 | -0.021 |
| 295.4 | -0.021 |
| 295.5 | -0.021 |
| 295.6 | -0.021 |
| 295.7 | -0.021 |
| 295.8 | -0.021 |
| 295.9 | -0.021 |
| 296.0 | -0.021 |
| 296.1 | -0.021 |
| 296.2 | -0.021 |
| 296.3 | -0.021 |
| 296.4 | -0.021 |
| 296.5 | -0.021 |
| 296.6 | -0.021 |
| 296.7 | -0.021 |
| 296.8 | -0.021 |
| 296.9 | -0.021 |
| 297.0 | -0.021 |
| 297.1 | -0.021 |
| 297.2 | -0.021 |
| 297.3 | -0.021 |
| 297.4 | -0.021 |
| 297.5 | -0.021 |
| 297.6 | -0.021 |
| 297.7 | -0.021 |
| 297.8 | -0.021 |
| 297.9 | -0.021 |
| 298.0 | -0.021 |
| 298.1 | -0.021 |
| 298.2 | -0.021 |
| 298.3 | -0.021 |
| 298.4 | -0.021 |
| 298.5 | -0.021 |
| 298.6 | -0.021 |
| 298.7 | -0.021 |
| 298.8 | -0.021 |
| 298.9 | -0.021 |
| 299.0 | -0.021 |
| 299.1 | -0.021 |
| 299.2 | -0.021 |
| 299.3 | -0.021 |
| 299.4 | -0.021 |
| 299.5 | -0.021 |
| 299.6 | -0.021 |
| 299.7 | -0.021 |
| 299.8 | -0.021 |
| 299.9 | -0.021 |
| 300.0 | -0.021 |
| 300.1 | -0.021 |
| 300.2 | -0.021 |
| 300.3 | -0.021 |
| 300.4 | -0.021 |
| 300.5 | -0.021 |
| 300.6 | -0.021 |
| 300.7 | -0.021 |
| 300.8 | -0.021 |
| 300.9 | -0.021 |
| 301.0 | -0.021 |
| 301.1 | -0.021 |
| 301.2 | -0.021 |
| 301.3 | -0.021 |
| 301.4 | -0.021 |
| 301.5 | -0.021 |
| 301.6 | -0.021 |
| 301.7 | -0.021 |
| 301.8 | -0.021 |
| 301.9 | -0.021 |
| 302.0 | -0.021 |
| 302.1 | -0.021 |
| 302.2 | -0.021 |
| 302.3 | -0.021 |
| 302.4 | -0.021 |
| 302.5 | -0.021 |
| 302.6 | -0.021 |
| 302.7 | -0.021 |
| 302.8 | -0.021 |
| 302.9 | -0.021 |
| 303.0 | -0.021 |
| 303.1 | -0.021 |
| 303.2 | -0.021 |
| 303.3 | -0.021 |
| 303.4 | -0.021 |
| 303.5 | -0.021 |
| 303.6 | -0.021 |
| 303.7 | -0.021 |
| 303.8 | -0.021 |
| 303.9 | -0.021 |
| 304.0 | -0.021 |
| 304.1 | -0.021 |
| 304.2 | -0.021 |
| 304.3 | -0.021 |
| 304.4 | -0.021 |
| 304.5 | -0.021 |
| 304.6 | -0.021 |
| 304.7 | -0.021 |
| 304.8 | -0.021 |
| 304.9 | -0.021 |
| 305.0 | -0.021 |
| 305.1 | -0.021 |
| 305.2 | -0.021 |
| 305.3 | -0.021 |
| 305.4 | -0.021 |
| 305.5 | -0.021 |
| 305.6 | -0.021 |
| 305.7 | -0.021 |
| 305.8 | -0.021 |
| 305.9 | -0.021 |
| 306.0 | -0.021 |
| 306.1 | -0.021 |
| 306.2 | -0.021 |
| 306.3 | -0.021 |
| 306.4 | -0.021 |
| 306.5 | -0.021 |
| 306.6 | -0.021 |
| 306.7 | -0.021 |
| 306.8 | -0.021 |
| 306.9 | -0.021 |
| 307.0 | -0.021 |
| 307.1 | -0.021 |
| 307.2 | -0.021 |
| 307.3 | -0.021 |
| 307.4 | -0.021 |
| 307.5 | -0.021 |
| 307.6 | -0.021 |
| 307.7 | -0.021 |
| 307.8 | -0.021 |
| 307.9 | -0.021 |
| 308.0 | -0.021 |
| 308.1 | -0.021 |
| 308.2 | -0.021 |
| 308.3 | -0.021 |
| 308.4 | -0.021 |
| 308.5 | -0.021 |
| 308.6 | -0.021 |
| 308.7 | -0.021 |
| 308.8 | -0.021 |
| 308.9 | -0.021 |
| 309.0 | -0.021 |
| 309.1 | -0.021 |
| 309.2 | -0.021 |
| 309.3 | -0.021 |
| 309.4 | -0.021 |
| 309.5 | -0.021 |
| 309.6 | -0.021 |
| 309.7 | -0.021 |
| 309.8 | -0.021 |
| 309.9 | -0.021 |
| 310.0 | -0.021 |
| 310.1 | -0.021 |
| 310.2 | -0.021 |
| 310.3 | -0.021 |
| 310.4 | -0.021 |
| 310.5 | -0.021 |
| 310.6 | -0.021 |
| 310.7 | -0.021 |
| 310.8 | -0.021 |
| 310.9 | -0.021 |
| 311.0 | -0.021 |
| 311.1 | -0.021 |
| 311.2 | -0.021 |
| 311.3 | -0.021 |
| 311.4 | -0.021 |
| 311.5 | -0.021 |
| 311.6 | -0.021 |
| 311.7 | -0.021 |
| 311.8 | -0.021 |
| 311.9 | -0.021 |
| 312.0 | -0.021 |
| 312.1 | -0.021 |
| 312.2 | -0.021 |
| 312.3 | -0.021 |
| 312.4 | -0.021 |
| 312.5 | -0.021 |
| 312.6 | -0.021 |
| 312.7 | -0.021 |
| 312.8 | -0.021 |
| 312.9 | -0.021 |
| 313.0 | -0.021 |
| 313.1 | -0.021 |
| 313.2 | -0.021 |
| 313.3 | -0.021 |
| 313.4 | -0.021 |
| 313.5 | -0.021 |
| 313.6 | -0.021 |
| 313.7 | -0.021 |
| 313.8 | -0.021 |
| 313.9 | -0.021 |
| 314.0 | -0.021 |
| 314.1 | -0.021 |
| 314.2 | -0.021 |
| 314.3 | -0.021 |
| 314.4 | -0.021 |
| 314.5 | -0.021 |
| 314.6 | -0.021 |
| 314.7 | -0.021 |
| 314.8 | -0.021 |
| 314.9 | -0.021 |
| 315.0 | -0.021 |
| 315.1 | -0.021 |
| 315.2 | -0.021 |
| 315.3 | -0.021 |
| 315.4 | -0.021 |
| 315.5 | -0.021 |
| 315.6 | -0.021 |
| 315.7 | -0.021 |
| 315.8 | -0.021 |
| 315.9 | -0.021 |
| 316.0 | -0.021 |
| 316.1 | -0.021 |
| 316.2 | -0.021 |
| 316.3 | -0.021 |
| 316.4 | -0.021 |
| 316.5 | -0.021 |
| 316.6 | -0.021 |
| 316.7 | -0.021 |
| 316.8 | -0.021 |
| 316.9 | -0.021 |
| 317.0 | -0.021 |
| 317.1 | -0.021 |
| 317.2 | -0.021 |
| 317.3 | -0.021 |
| 317.4 | -0.021 |
| 317.5 | -0.021 |
| 317.6 | -0.021 |
| 317.7 | -0.021 |
| 317.8 | -0.021 |
| 317.9 | -0.021 |
| 318.0 | -0.021 |
| 318.1 | -0.021 |
| 318.2 | -0.021 |
| 318.3 | -0.021 |
| 318.4 | -0.021 |
| 318.5 | -0.021 |
| 318.6 | -0.021 |
| 318.7 | -0.021 |
| 318.8 | -0.021 |
| 318.9 | -0.021 |
| 319.0 | -0.021 |
| 319.1 | -0.021 |
| 319.2 | -0.021 |
| 319.3 | -0.021 |
| 319.4 | -0.021 |
| 319.5 | -0.021 |
| 319.6 | -0.021 |
| 319.7 | -0.021 |
| 319.8 | -0.021 |
| 319.9 | -0.021 |
| 320.0 | -0.021 |
| 320.1 | -0.021 |
| 320.2 | -0.021 |
| 320.3 | -0.021 |
| 320.4 | -0.021 |
| 320.5 | -0.021 |
| 320.6 | -0.021 |
| 320.7 | -0.021 |
| 320.8 | -0.021 |
| 320.9 | -0.021 |
| 321.0 | -0.021 |
| 321.1 | -0.021 |
| 321.2 | -0.021 |
| 321.3 | -0.021 |
| 321.4 | -0.021 |
| 321.5 | -0.021 |
| 321.6 | -0.021 |
| 321.7 | -0.021 |
| 321.8 | -0.021 |
| 321.9 | -0.021 |
| 322.0 | -0.021 |
| 322.1 | -0.021 |
| 322.2 | -0.021 |
| 322.3 | -0.021 |
| 322.4 | -0.021 |
| 322.5 | -0.021 |
| 322.6 | -0.021 |
| 322.7 | -0.021 |
| 322.8 | -0.021 |
| 322.9 | -0.021 |
| 323.0 | -0.021 |
| 323.1 | -0.021 |
| 323.2 | -0.021 |
| 323.3 | -0.021 |
| 323.4 | -0.021 |
| 323.5 | -0.021 |
| 323.6 | -0.021 |
| 323.7 | -0.021 |
| 323.8 | -0.021 |
| 323.9 | -0.021 |
| 324.0 | -0.021 |
| 324.1 | -0.021 |
| 324.2 | -0.021 |
| 324.3 | -0.021 |
| 324.4 | -0.021 |
| 324.5 | -0.021 |
| 324.6 | -0.021 |
| 324.7 | -0.021 |
| 324.8 | -0.021 |
| 324.9 | -0.021 |
| 325.0 | -0.021 |
| 325.1 | -0.021 |
| 325.2 | -0.021 |
| 325.3 | -0.021 |
| 325.4 | -0.021 |
| 325.5 | -0.021 |
| 325.6 | -0.021 |
| 325.7 | -0.021 |
| 325.8 | -0.021 |
| 325.9 | -0.021 |
| 326.0 | -0.021 |
| 326.1 | -0.021 |
| 326.2 | -0.021 |
| 326.3 | -0.021 |
| 326.4 | -0.021 |
| 326.5 | -0.021 |
| 326.6 | -0.021 |
| 326.7 | -0.021 |
| 326.8 | -0.021 |
| 326.9 | -0.021 |
| 327.0 | -0.021 |
| 327.1 | -0.021 |
| 327.2 | -0.021 |
| 327.3 | -0.021 |
| 327.4 | -0.021 |
| 327.5 | -0.021 |
| 327.6 | -0.021 |
| 327.7 | -0.021 |
| 327.8 | -0.021 |
| 327.9 | -0.021 |
| 328.0 | -0.021 |
| 328.1 | -0.021 |
| 328.2 | -0.021 |
| 328.3 | -0.021 |
| 328.4 | -0.021 |
| 328.5 | -0.021 |
| 328.6 | -0.021 |
| 328.7 | -0.021 |
| 328.8 | -0.021 |
| 328.9 | -0.021 |
| 329.0 | -0.021 |
| 329.1 | -0.021 |
| 329.2 | -0.021 |
| 329.3 | -0.021 |
| 329.4 | -0.021 |
| 329.5 | -0.021 |
| 329.6 | -0.021 |
| 329.7 | -0.021 |
| 329.8 | -0.021 |
| 329.9 | -0.021 |
| 330.0 | -0.021 |
| 330.1 | -0.021 |
| 330.2 | -0.021 |
| 330.3 | -0.021 |
| 330.4 | -0.021 |
| 330.5 | -0.021 |
| 330.6 | -0.021 |
| 330.7 | -0.021 |
| 330.8 | -0.021 |
| 330.9 | -0.021 |
| 331.0 | -0.021 |
| 331.1 | -0.021 |
| 331.2 | -0.021 |
| 331.3 | -0.021 |
| 331.4 | -0.021 |
| 331.5 | -0.021 |
| 331.6 | -0.021 |
| 331.7 | -0.021 |
| 331.8 | -0.021 |
| 331.9 | -0.021 |
| 332.0 | -0.021 |
| 332.1 | -0.021 |
| 332.2 | -0.021 |
| 332.3 | -0.021 |
| 332.4 | -0.021 |
| 332.5 | -0.021 |
| 332.6 | -0.021 |
| 332.7 | -0.021 |
| 332.8 | -0.021 |
| 332.9 | -0.021 |
| 333.0 | -0.021 |
| 333.1 | -0.021 |
| 333.2 | -0.021 |
| 333.3 | -0.021 |
| 333.4 | -0.021 |
| 333.5 | -0.021 |
| 333.6 | -0.021 |
| 333.7 | -0.021 |
| 333.8 | -0.021 |
| 333.9 | -0.021 |
| 334.0 | -0.021 |
| 334.1 | -0.021 |
| 334.2 | -0.021 |
| 334.3 | -0.021 |
| 334.4 | -0.021 |
| 334.5 | -0.021 |
| 334.6 | -0.021 |
| 334.7 | -0.021 |
| 334.8 | -0.021 |
| 334.9 | -0.021 |
| 335.0 | -0.021 |
| 335.1 | -0.021 |
| 335.2 | -0.021 |
| 335.3 | -0.021 |
| 335.4 | -0.021 |
| 335.5 | -0.021 |
| 335.6 | -0.021 |
| 335.7 | -0.021 |
| 335.8 | -0.021 |
| 335.9 | -0.021 |
| 336.0 | -0.021 |
| 336.1 | -0.021 |
| 336.2 | -0.021 |
| 336.3 | -0.021 |
| 336.4 | -0.021 |
| 336.5 | -0.021 |
| 336.6 | -0.021 |
| 336.7 | -0.021 |
| 336.8 | -0.021 |
| 336.9 | -0.021 |
| 337.0 | -0.021 |
| 337.1 | -0.021 |
| 337.2 | -0.021 |
| 337.3 | -0.021 |
| 337.4 | -0.021 |
| 337.5 | -0.021 |
| 337.6 | -0.021 |
| 337.7 | -0.021 |
| 337.8 | -0.021 |
| 337.9 | -0.021 |
| 338.0 | -0.021 |
| 338.1 | -0.021 |
| 338.2 | -0.021 |
| 338.3 | -0.021 |
| 338.4 | -0.021 |
| 338.5 | -0.021 |
| 338.6 | -0.021 |
| 338.7 | -0.021 |
| 338.8 | -0.021 |
| 338.9 | -0.021 |
| 339.0 | -0.021 |
| 339.1 | -0.021 |
| 339.2 | -0.021 |
| 339.3 | -0.021 |
| 339.4 | -0.021 |
| 339.5 | -0.021 |
| 339.6 | -0.021 |
| 339.7 | -0.021 |
| 339.8 | -0.021 |
| 339.9 | -0.021 |
| 340.0 | -0.021 |
| 340.1 | -0.021 |
| 340.2 | -0.021 |
| 340.3 | -0.021 |
| 340.4 | -0.021 |
| 340.5 | -0.021 |
| 340.6 | -0.021 |
| 340.7 | -0.021 |
| 340.8 | -0.021 |
| 340.9 | -0.021 |
| 341.0 | -0.021 |
| 341.1 | -0.021 |
| 341.2 | -0.021 |
| 341.3 | -0.021 |
| 341.4 | -0.021 |
| 341.5 | -0.021 |
| 341.6 | -0.021 |
| 341.7 | -0.021 |
| 341.8 | -0.021 |
| 341.9 | -0.021 |
| 342.0 | -0.021 |
| 342.1 | -0.021 |
| 342.2 | -0.021 |
| 342.3 | -0.021 |
| 342.4 | -0.021 |
| 342.5 | -0.021 |
| 342.6 | -0.021 |
| 342.7 | -0.021 |
| 342.8 | -0.021 |
| 342.9 | -0.021 |
| 343.0 | -0.021 |
| 343.1 | -0.021 |
| 343.2 | -0.021 |
| 343.3 | -0.021 |
| 343.4 | -0.021 |
| 343.5 | -0.021 |
| 343.6 | -0.021 |
| 343.7 | -0.021 |
| 343.8 | -0.021 |
| 343.9 | -0.021 |
| 344.0 | -0.021 |
| 344.1 | -0.021 |
| 344.2 | -0.021 |
| 344.3 | -0.021 |
| 344.4 | -0.021 |
| 344.5 | -0.021 |
| 344.6 | -0.021 |
| 344.7 | -0.021 |
| 344.8 | -0.021 |
| 344.9 | -0.021 |
| 345.0 | -0.021 |
| 345.1 | -0.021 |
| 345.2 | -0.021 |
| 345.3 | -0.021 |
| 345.4 | -0.021 |
| 345.5 | -0.021 |
| 345.6 | -0.021 |
| 345.7 | -0.021 |
| 345.8 | -0.021 |
| 345.9 | -0.021 |
| 346.0 | -0.021 |
| 346.1 | -0.021 |
| 346.2 | -0.022 |
| 346.3 | -0.022 |
| 346.4 | -0.022 |
| 346.5 | -0.022 |
| 346.6 | -0.022 |
| 346.7 | -0.022 |
| 346.8 | -0.022 |
| 346.9 | -0.022 |
| 347.0 | -0.022 |
| 347.1 | -0.022 |
| 347.2 | -0.022 |
| 347.3 | -0.022 |
| 347.4 | -0.022 |
| 347.5 | -0.022 |
| 347.6 | -0.022 |
| 347.7 | -0.022 |
| 347.8 | -0.022 |
| 347.9 | -0.022 |
| 348.0 | -0.022 |
| 348.1 | -0.022 |
| 348.2 | -0.022 |
| 348.3 | -0.022 |
| 348.4 | -0.022 |
| 348.5 | -0.022 |
| 348.6 | -0.022 |
| 348.7 | -0.022 |
| 348.8 | -0.022 |
| 348.9 | -0.022 |
| 349.0 | -0.022 |
| 349.1 | -0.022 |
| 349.2 | -0.022 |
| 349.3 | -0.022 |
| 349.4 | -0.022 |
| 349.5 | -0.022 |
| 349.6 | -0.022 |
| 349.7 | -0.022 |
| 349.8 | -0.022 |
| 349.9 | -0.022 |
| 350.0 | -0.022 |
| 350.1 | -0.022 |
| 350.2 | -0.022 |
| 350.3 | -0.022 |
| 350.4 | -0.022 |
| 350.5 | -0.022 |
| 350.6 | -0.022 |
| 350.7 | -0.022 |
| 350.8 | -0.022 |
| 350.9 | -0.022 |
| 351.0 | -0.022 |
| 351.1 | -0.022 |
| 351.2 | -0.022 |
| 351.3 | -0.022 |
| 351.4 | -0.022 |
| 351.5 | -0.022 |
| 351.6 | -0.022 |
| 351.7 | -0.022 |
| 351.8 | -0.022 |
| 351.9 | -0.022 |
| 352.0 | -0.022 |
| 352.1 | -0.022 |
| 352.2 | -0.022 |
| 352.3 | -0.022 |
| 352.4 | -0.022 |
| 352.5 | -0.022 |
| 352.6 | -0.022 |
| 352.7 | -0.022 |
| 352.8 | -0.022 |
| 352.9 | -0.022 |
| 353.0 | -0.022 |
| 353.1 | -0.022 |
| 353.2 | -0.022 |
| 353.3 | -0.022 |
| 353.4 | -0.022 |
| 353.5 | -0.022 |
| 353.6 | -0.022 |
| 353.7 | -0.022 |
| 353.8 | -0.022 |
| 353.9 | -0.022 |
| 354.0 | -0.022 |
| 354.1 | -0.022 |
| 354.2 | -0.022 |
| 354.3 | -0.022 |
| 354.4 | -0.022 |
| 354.5 | -0.022 |
| 354.6 | -0.022 |
| 354.7 | -0.022 |
| 354.8 | -0.022 |
| 354.9 | -0.022 |
| 355.0 | -0.022 |
| 355.1 | -0.022 |
| 355.2 | -0.022 |
| 355.3 | -0.022 |
| 355.4 | -0.022 |
| 355.5 | -0.022 |
| 355.6 | -0.022 |
| 355.7 | -0.022 |
| 355.8 | -0.022 |
| 355.9 | -0.022 |
| 356.0 | -0.022 |
| 356.1 | -0.022 |
| 356.2 | -0.022 |
| 356.3 | -0.022 |
| 356.4 | -0.022 |
| 356.5 | -0.022 |
| 356.6 | -0.022 |
| 356.7 | -0.022 |
| 356.8 | -0.022 |
| 356.9 | -0.022 |
| 357.0 | -0.022 |
| 357.1 | -0.022 |
| 357.2 | -0.022 |
| 357.3 | -0.022 |
| 357.4 | -0.022 |
| 357.5 | -0.022 |
| 357.6 | -0.022 |
| 357.7 | -0.022 |
| 357.8 | -0.022 |
| 357.9 | -0.022 |
| 358.0 | -0.022 |
| 358.1 | -0.022 |
| 358.2 | -0.022 |
| 358.3 | -0.022 |
| 358.4 | -0.022 |
| 358.5 | -0.022 |
| 358.6 | -0.022 |
| 358.7 | -0.022 |
| 358.8 | -0.022 |
| 358.9 | -0.022 |
| 359.0 | -0.022 |
| 359.1 | -0.022 |
| 359.2 | -0.022 |
| 359.3 | -0.022 |
| 359.4 | -0.022 |
| 359.5 | -0.022 |
| 359.6 | -0.022 |
| 359.7 | -0.022 |
| 359.8 | -0.022 |
| 359.9 | -0.022 |
| 360.0 | -0.022 |
| 360.1 | -0.022 |
| 360.2 | -0.022 |
| 360.3 | -0.022 |
| 360.4 | -0.022 |
| 360.5 | -0.022 |
| 360.6 | -0.022 |
| 360.7 | -0.022 |
| 360.8 | -0.022 |
| 360.9 | -0.022 |
| 361.0 | -0.022 |
| 361.1 | -0.022 |
| 361.2 | -0.022 |
| 361.3 | -0.022 |
| 361.4 | -0.022 |
| 361.5 | -0.022 |
| 361.6 | -0.022 |
| 361.7 | -0.022 |
| 361.8 | -0.022 |
| 361.9 | -0.022 |
| 362.0 | -0.022 |
| 362.1 | -0.022 |
| 362.2 | -0.022 |
| 362.3 | -0.022 |
| 362.4 | -0.022 |
| 362.5 | -0.022 |
| 362.6 | -0.022 |
| 362.7 | -0.022 |
| 362.8 | -0.022 |
| 362.9 | -0.022 |
| 363.0 | -0.022 |
| 363.1 | -0.022 |
| 363.2 | -0.022 |
| 363.3 | -0.022 |
| 363.4 | -0.022 |
| 363.5 | -0.022 |
| 363.6 | -0.022 |
| 363.7 | -0.022 |
| 363.8 | -0.022 |
| 363.9 | -0.022 |
| 364.0 | -0.022 |
| 364.1 | -0.022 |
| 364.2 | -0.022 |
| 364.3 | -0.022 |
| 364.4 | -0.022 |
| 364.5 | -0.022 |
| 364.6 | -0.022 |
| 364.7 | -0.022 |
| 364.8 | -0.022 |
| 364.9 | -0.022 |
| 365.0 | -0.022 |
| 365.1 | -0.022 |
| 365.2 | -0.022 |
| 365.3 | -0.022 |
| 365.4 | -0.022 |
| 365.5 | -0.022 |
| 365.6 | -0.022 |
| 365.7 | -0.022 |
| 365.8 | -0.022 |
| 365.9 | -0.022 |
| 366.0 | -0.022 |
| 366.1 | -0.022 |
| 366.2 | -0.022 |
| 366.3 | -0.022 |
| 366.4 | -0.022 |
| 366.5 | -0.022 |
| 366.6 | -0.022 |
| 366.7 | -0.022 |
| 366.8 | -0.022 |
| 366.9 | -0.022 |
| 367.0 | -0.022 |
| 367.1 | -0.022 |
| 367.2 | -0.022 |
| 367.3 | -0.022 |
| 367.4 | -0.022 |
| 367.5 | -0.022 |
| 367.6 | -0.022 |
| 367.7 | -0.022 |
| 367.8 | -0.022 |
| 367.9 | -0.022 |
| 368.0 | -0.022 |
| 368.1 | -0.022 |
| 368.2 | -0.022 |
| 368.3 | -0.022 |
| 368.4 | -0.022 |
| 368.5 | -0.022 |
| 368.6 | -0.022 |
| 368.7 | -0.022 |
| 368.8 | -0.022 |
| 368.9 | -0.022 |
| 369.0 | -0.022 |
| 369.1 | -0.022 |
| 369.2 | -0.022 |
| 369.3 | -0.022 |
| 369.4 | -0.022 |
| 369.5 | -0.022 |
| 369.6 | -0.022 |
| 369.7 | -0.022 |
| 369.8 | -0.022 |
| 369.9 | -0.022 |
| 370.0 | -0.022 |
| 370.1 | -0.022 |
| 370.2 | -0.022 |
| 370.3 | -0.022 |
| 370.4 | -0.022 |
| 370.5 | -0.022 |
| 370.6 | -0.022 |
| 370.7 | -0.022 |
| 370.8 | -0.022 |
| 370.9 | -0.022 |
| 371.0 | -0.022 |
| 371.1 | -0.022 |
| 371.2 | -0.022 |
| 371.3 | -0.022 |
| 371.4 | -0.022 |
| 371.5 | -0.022 |
| 371.6 | -0.022 |
| 371.7 | -0.022 |
| 371.8 | -0.022 |
| 371.9 | -0.022 |
| 372.0 | -0.022 |
| 372.1 | -0.022 |
| 372.2 | -0.022 |
| 372.3 | -0.022 |
| 372.4 | -0.022 |
| 372.5 | -0.022 |
| 372.6 | -0.022 |
| 372.7 | -0.022 |
| 372.8 | -0.022 |
| 372.9 | -0.022 |
| 373.0 | -0.022 |
| 373.1 | -0.022 |
| 373.2 | -0.022 |
| 373.3 | -0.022 |
| 373.4 | -0.022 |
| 373.5 | -0.022 |
| 373.6 | -0.022 |
| 373.7 | -0.022 |
| 373.8 | -0.022 |
| 373.9 | -0.022 |
| 374.0 | -0.022 |
| 374.1 | -0.022 |
| 374.2 | -0.022 |
| 374.3 | -0.022 |
| 374.4 | -0.022 |
| 374.5 | -0.022 |
| 374.6 | -0.022 |
| 374.7 | -0.022 |
| 374.8 | -0.022 |
| 374.9 | -0.022 |
| 375.0 | -0.022 |
| 375.1 | -0.022 |
| 375.2 | -0.022 |
| 375.3 | -0.022 |
| 375.4 | -0.022 |
| 375.5 | -0.022 |
| 375.6 | -0.022 |
| 375.7 | -0.022 |
| 375.8 | -0.022 |
| 375.9 | -0.022 |
| 376.0 | -0.022 |
| 376.1 | -0.022 |
| 376.2 | -0.022 |
| 376.3 | -0.022 |
| 376.4 | -0.022 |
| 376.5 | -0.022 |
| 376.6 | -0.022 |
| 376.7 | -0.022 |
| 376.8 | -0.022 |
| 376.9 | -0.022 |
| 377.0 | -0.022 |
| 377.1 | -0.022 |
| 377.2 | -0.022 |
| 377.3 | -0.022 |
| 377.4 | -0.022 |
| 377.5 | -0.022 |
| 377.6 | -0.022 |
| 377.7 | -0.022 |
| 377.8 | -0.022 |
| 377.9 | -0.022 |
| 378.0 | -0.022 |
| 378.1 | -0.022 |
| 378.2 | -0.022 |
| 378.3 | -0.022 |
| 378.4 | -0.022 |
| 378.5 | -0.022 |
| 378.6 | -0.022 |
| 378.7 | -0.022 |
| 378.8 | -0.022 |
| 378.9 | -0.022 |
| 379.0 | -0.022 |
| 379.1 | -0.022 |
| 379.2 | -0.022 |
| 379.3 | -0.022 |
| 379.4 | -0.022 |
| 379.5 | -0.022 |
| 379.6 | -0.022 |
| 379.7 | -0.022 |
| 379.8 | -0.022 |
| 379.9 | -0.022 |
| 380.0 | -0.022 |
| 380.1 | -0.022 |
| 380.2 | -0.022 |
| 380.3 | -0.022 |
| 380.4 | -0.022 |
| 380.5 | -0.022 |
| 380.6 | -0.022 |
| 380.7 | -0.022 |
| 380.8 | -0.022 |
| 380.9 | -0.022 |
| 381.0 | -0.022 |
| 381.1 | -0.022 |
| 381.2 | -0.022 |
| 381.3 | -0.022 |
| 381.4 | -0.022 |
| 381.5 | -0.022 |
| 381.6 | -0.022 |
| 381.7 | -0.022 |
| 381.8 | -0.022 |
| 381.9 | -0.022 |
| 382.0 | -0.022 |
| 382.1 | -0.022 |
| 382.2 | -0.022 |
| 382.3 | -0.022 |
| 382.4 | -0.022 |
| 382.5 | -0.022 |
| 382.6 | -0.022 |
| 382.7 | -0.022 |
| 382.8 | -0.022 |
| 382.9 | -0.022 |
| 383.0 | -0.022 |
| 383.1 | -0.022 |
| 383.2 | -0.022 |
| 383.3 | -0.022 |
| 383.4 | -0.022 |
| 383.5 | -0.022 |
| 383.6 | -0.022 |
| 383.7 | -0.022 |
| 383.8 | -0.022 |
| 383.9 | -0.022 |
| 384.0 | -0.022 |
| 384.1 | -0.022 |
| 384.2 | -0.022 |
| 384.3 | -0.022 |
| 384.4 | -0.022 |
| 384.5 | -0.022 |
| 384.6 | -0.022 |
| 384.7 | -0.022 |
| 384.8 | -0.022 |
| 384.9 | -0.022 |
| 385.0 | -0.022 |
| 385.1 | -0.022 |
| 385.2 | -0.022 |
| 385.3 | -0.022 |
| 385.4 | -0.022 |
| 385.5 | -0.022 |
| 385.6 | -0.022 |
| 385.7 | -0.022 |
| 385.8 | -0.022 |
| 385.9 | -0.022 |
| 386.0 | -0.022 |
| 386.1 | -0.022 |
| 386.2 | -0.022 |
| 386.3 | -0.022 |
| 386.4 | -0.022 |
| 386.5 | -0.022 |
| 386.6 | -0.022 |
| 386.7 | -0.022 |
| 386.8 | -0.022 |
| 386.9 | -0.022 |
| 387.0 | -0.022 |
| 387.1 | -0.022 |
| 387.2 | -0.022 |
| 387.3 | -0.022 |
| 387.4 | -0.022 |
| 387.5 | -0.022 |
| 387.6 | -0.022 |
| 387.7 | -0.022 |
| 387.8 | -0.022 |
| 387.9 | -0.022 |
| 388.0 | -0.022 |
| 388.1 | -0.022 |
| 388.2 | -0.022 |
| 388.3 | -0.022 |
| 388.4 | -0.022 |
| 388.5 | -0.022 |
| 388.6 | -0.022 |
| 388.7 | -0.022 |
| 388.8 | -0.022 |
| 388.9 | -0.022 |
| 389.0 | -0.022 |
| 389.1 | -0.022 |
| 389.2 | -0.022 |
| 389.3 | -0.022 |
| 389.4 | -0.022 |
| 389.5 | -0.022 |
| 389.6 | -0.022 |
| 389.7 | -0.022 |
| 389.8 | -0.022 |
| 389.9 | -0.022 |
| 390.0 | -0.022 |
| 390.1 | -0.022 |
| 390.2 | -0.022 |
| 390.3 | -0.022 |
| 390.4 | -0.022 |
| 390.5 | -0.022 |
| 390.6 | -0.022 |
| 390.7 | -0.022 |
| 390.8 | -0.022 |
| 390.9 | -0.022 |
| 391.0 | -0.022 |
| 391.1 | -0.022 |
| 391.2 | -0.022 |
| 391.3 | -0.022 |
| 391.4 | -0.022 |
| 391.5 | -0.022 |
| 391.6 | -0.022 |
| 391.7 | -0.022 |
| 391.8 | -0.022 |
| 391.9 | -0.022 |
| 392.0 | -0.022 |
| 392.1 | -0.022 |
| 392.2 | -0.022 |
| 392.3 | -0.022 |
| 392.4 | -0.022 |
| 392.5 | -0.022 |
| 392.6 | -0.022 |
| 392.7 | -0.022 |
| 392.8 | -0.022 |
| 392.9 | -0.022 |
| 393.0 | -0.022 |
| 393.1 | -0.022 |
| 393.2 | -0.022 |
| 393.3 | -0.022 |
| 393.4 | -0.022 |
| 393.5 | -0.022 |
| 393.6 | -0.022 |
| 393.7 | -0.022 |
| 393.8 | -0.022 |
| 393.9 | -0.022 |
| 394.0 | -0.022 |
| 394.1 | -0.022 |
| 394.2 | -0.022 |
| 394.3 | -0.022 |
| 394.4 | -0.022 |
| 394.5 | -0.022 |
| 394.6 | -0.022 |
| 394.7 | -0.022 |
| 394.8 | -0.022 |
| 394.9 | -0.022 |
| 395.0 | -0.022 |
| 395.1 | -0.022 |
| 395.2 | -0.022 |
| 395.3 | -0.022 |
| 395.4 | -0.022 |
| 395.5 | -0.022 |
| 395.6 | -0.022 |
| 395.7 | -0.022 |
| 395.8 | -0.022 |
| 395.9 | -0.022 |
| 396.0 | -0.022 |
| 396.1 | -0.022 |
| 396.2 | -0.022 |
| 396.3 | -0.022 |
| 396.4 | -0.022 |
| 396.5 | -0.022 |
| 396.6 | -0.022 |
| 396.7 | -0.022 |
| 396.8 | -0.022 |
| 396.9 | -0.022 |
| 397.0 | -0.022 |
| 397.1 | -0.022 |
| 397.2 | -0.022 |
| 397.3 | -0.022 |
| 397.4 | -0.022 |
| 397.5 | -0.022 |
| 397.6 | -0.022 |
| 397.7 | -0.022 |
| 397.8 | -0.022 |
| 397.9 | -0.022 |
| 398.0 | -0.022 |
| 398.1 | -0.022 |
| 398.2 | -0.022 |
| 398.3 | -0.022 |
| 398.4 | -0.022 |
| 398.5 | -0.022 |
| 398.6 | -0.022 |
| 398.7 | -0.022 |
| 398.8 | -0.022 |
| 398.9 | -0.022 |
| 399.0 | -0.022 |
| 399.1 | -0.022 |
| 399.2 | -0.022 |
| 399.3 | -0.022 |
| 399.4 | -0.022 |
| 399.5 | -0.022 |
| 399.6 | -0.022 |
| 399.7 | -0.022 |
| 399.8 | -0.022 |
| 399.9 | -0.022 |
| 400.0 | -0.022 |
| 400.1 | -0.022 |
| 400.2 | -0.022 |
| 400.3 | -0.022 |
| 400.4 | -0.022 |
| 400.5 | -0.022 |
| 400.6 | -0.022 |
| 400.7 | -0.022 |
| 400.8 | -0.022 |
| 400.9 | -0.022 |
| 401.0 | -0.022 |
| 401.1 | -0.022 |
| 401.2 | -0.022 |
| 401.3 | -0.022 |
| 401.4 | -0.022 |
| 401.5 | -0.022 |
| 401.6 | -0.022 |
| 401.7 | -0.022 |
| 401.8 | -0.022 |
| 401.9 | -0.022 |
| 402.0 | -0.022 |
| 402.1 | -0.022 |
| 402.2 | -0.022 |
| 402.3 | -0.022 |
| 402.4 | -0.022 |
| 402.5 | -0.022 |
| 402.6 | -0.022 |
| 402.7 | -0.022 |
| 402.8 | -0.022 |
| 402.9 | -0.022 |
| 403.0 | -0.022 |
| 403.1 | -0.022 |
| 403.2 | -0.022 |
| 403.3 | -0.022 |
| 403.4 | -0.022 |
| 403.5 | -0.022 |
| 403.6 | -0.022 |
| 403.7 | -0.022 |
| 403.8 | -0.022 |
| 403.9 | -0.022 |
| 404.0 | -0.022 |
| 404.1 | -0.022 |
| 404.2 | -0.022 |
| 404.3 | -0.022 |
| 404.4 | -0.022 |
| 404.5 | -0.022 |
| 404.6 | -0.022 |
| 404.7 | -0.022 |
| 404.8 | -0.022 |
| 404.9 | -0.022 |
| 405.0 | -0.022 |
| 405.1 | -0.022 |
| 405.2 | -0.022 |
| 405.3 | -0.022 |
| 405.4 | -0.022 |
| 405.5 | -0.022 |
| 405.6 | -0.022 |
| 405.7 | -0.022 |
| 405.8 | -0.022 |
| 405.9 | -0.022 |
| 406.0 | -0.022 |
| 406.1 | -0.022 |
| 406.2 | -0.022 |
| 406.3 | -0.022 |
| 406.4 | -0.022 |
| 406.5 | -0.022 |
| 406.6 | -0.022 |
| 406.7 | -0.022 |
| 406.8 | -0.022 |
| 406.9 | -0.022 |
| 407.0 | -0.022 |
| 407.1 | -0.022 |
| 407.2 | -0.022 |
| 407.3 | -0.022 |
| 407.4 | -0.022 |
| 407.5 | -0.022 |
| 407.6 | -0.022 |
| 407.7 | -0.022 |
| 407.8 | -0.022 |
| 407.9 | -0.022 |
| 408.0 | -0.022 |
| 408.1 | -0.022 |
| 408.2 | -0.022 |
| 408.3 | -0.022 |
| 408.4 | -0.022 |
| 408.5 | -0.022 |
| 408.6 | -0.022 |
| 408.7 | -0.022 |
| 408.8 | -0.022 |
| 408.9 | -0.022 |
| 409.0 | -0.022 |
| 409.1 | -0.022 |
| 409.2 | -0.022 |
| 409.3 | -0.022 |
| 409.4 | -0.022 |
| 409.5 | -0.022 |
| 409.6 | -0.022 |
| 409.7 | -0.022 |
| 409.8 | -0.022 |
| 409.9 | -0.022 |
| 410.0 | -0.022 |
| 410.1 | -0.022 |
| 410.2 | -0.022 |
| 410.3 | -0.022 |
| 410.4 | -0.022 |
| 410.5 | -0.022 |
| 410.6 | -0.022 |
| 410.7 | -0.022 |
| 410.8 | -0.022 |
| 410.9 | -0.022 |
| 411.0 | -0.022 |
| 411.1 | -0.022 |
| 411.2 | -0.022 |
| 411.3 | -0.022 |
| 411.4 | -0.022 |
| 411.5 | -0.022 |
| 411.6 | -0.022 |
| 411.7 | -0.022 |
| 411.8 | -0.022 |
| 411.9 | -0.022 |
| 412.0 | -0.022 |
| 412.1 | -0.022 |
| 412.2 | -0.022 |
| 412.3 | -0.022 |
| 412.4 | -0.022 |
| 412.5 | -0.022 |
| 412.6 | -0.022 |
| 412.7 | -0.022 |
| 412.8 | -0.022 |
| 412.9 | -0.022 |
| 413.0 | -0.022 |
| 413.1 | -0.022 |
| 413.2 | -0.022 |
| 413.3 | -0.022 |
| 413.4 | -0.022 |
| 413.5 | -0.022 |
| 413.6 | -0.022 |
| 413.7 | -0.022 |
| 413.8 | -0.022 |
| 413.9 | -0.022 |
| 414.0 | -0.022 |
| 414.1 | -0.022 |
| 414.2 | -0.022 |
| 414.3 | -0.022 |
| 414.4 | -0.022 |
| 414.5 | -0.022 |
| 414.6 | -0.022 |
| 414.7 | -0.022 |
| 414.8 | -0.022 |
| 414.9 | -0.022 |
| 415.0 | -0.022 |
| 415.1 | -0.022 |
| 415.2 | -0.022 |
| 415.3 | -0.022 |
| 415.4 | -0.022 |
| 415.5 | -0.022 |
| 415.6 | -0.022 |
| 415.7 | -0.022 |
| 415.8 | -0.022 |
| 415.9 | -0.022 |
| 416.0 | -0.022 |
| 416.1 | -0.022 |
| 416.2 | -0.022 |
| 416.3 | -0.022 |
| 416.4 | -0.022 |
| 416.5 | -0.022 |
| 416.6 | -0.022 |
| 416.7 | -0.022 |
| 416.8 | -0.022 |
| 416.9 | -0.022 |
| 417.0 | -0.022 |
| 417.1 | -0.022 |
| 417.2 | -0.022 |
| 417.3 | -0.022 |
| 417.4 | -0.022 |
| 417.5 | -0.022 |
| 417.6 | -0.022 |
| 417.7 | -0.022 |
| 417.8 | -0.022 |
| 417.9 | -0.022 |
| 418.0 | -0.022 |
| 418.1 | -0.022 |
| 418.2 | -0.022 |
| 418.3 | -0.022 |
| 418.4 | -0.022 |
| 418.5 | -0.022 |
| 418.6 | -0.022 |
| 418.7 | -0.022 |
| 418.8 | -0.022 |
| 418.9 | -0.022 |
| 419.0 | -0.022 |
| 419.1 | -0.022 |
| 419.2 | -0.022 |
| 419.3 | -0.022 |
| 419.4 | -0.022 |
| 419.5 | -0.022 |
| 419.6 | -0.022 |
| 419.7 | -0.022 |
| 419.8 | -0.022 |
| 419.9 | -0.022 |
| 420.0 | -0.022 |
| 420.1 | -0.022 |
| 420.2 | -0.022 |
| 420.3 | -0.022 |
| 420.4 | -0.022 |
| 420.5 | -0.022 |
| 420.6 | -0.022 |
| 420.7 | -0.022 |
| 420.8 | -0.022 |
| 420.9 | -0.022 |
| 421.0 | -0.022 |
| 421.1 | -0.022 |
| 421.2 | -0.022 |
| 421.3 | -0.022 |
| 421.4 | -0.022 |
| 421.5 | -0.022 |
| 421.6 | -0.022 |
| 421.7 | -0.022 |
| 421.8 | -0.022 |
| 421.9 | -0.022 |
| 422.0 | -0.022 |
| 422.1 | -0.022 |
| 422.2 | -0.022 |
| 422.3 | -0.022 |
| 422.4 | -0.022 |
| 422.5 | -0.022 |
| 422.6 | -0.022 |
| 422.7 | -0.022 |
| 422.8 | -0.022 |
| 422.9 | -0.022 |
| 423.0 | -0.022 |
| 423.1 | -0.022 |
| 423.2 | -0.022 |
| 423.3 | -0.022 |
| 423.4 | -0.022 |
| 423.5 | -0.022 |
| 423.6 | -0.022 |
| 423.7 | -0.022 |
| 423.8 | -0.022 |
| 423.9 | -0.022 |
| 424.0 | -0.022 |
| 424.1 | -0.022 |
| 424.2 | -0.022 |
| 424.3 | -0.022 |
| 424.4 | -0.022 |
| 424.5 | -0.022 |
| 424.6 | -0.022 |
| 424.7 | -0.022 |
| 424.8 | -0.022 |
| 424.9 | -0.022 |
| 425.0 | -0.022 |
| 425.1 | -0.022 |
| 425.2 | -0.022 |
| 425.3 | -0.022 |
| 425.4 | -0.022 |
| 425.5 | -0.022 |
| 425.6 | -0.022 |
| 425.7 | -0.022 |
| 425.8 | -0.022 |
| 425.9 | -0.022 |
| 426.0 | -0.022 |
| 426.1 | -0.022 |
| 426.2 | -0.022 |
| 426.3 | -0.022 |
| 426.4 | -0.022 |
| 426.5 | -0.022 |
| 426.6 | -0.022 |
| 426.7 | -0.022 |
| 426.8 | -0.022 |
| 426.9 | -0.022 |
| 427.0 | -0.022 |
| 427.1 | -0.022 |
| 427.2 | -0.022 |
| 427.3 | -0.022 |
| 427.4 | -0.022 |
| 427.5 | -0.022 |
| 427.6 | -0.022 |
| 427.7 | -0.022 |
| 427.8 | -0.022 |
| 427.9 | -0.022 |
| 428.0 | -0.022 |
| 428.1 | -0.022 |
| 428.2 | -0.022 |
| 428.3 | -0.022 |
| 428.4 | -0.022 |
| 428.5 | -0.022 |
| 428.6 | -0.022 |
| 428.7 | -0.022 |
| 428.8 | -0.022 |
| 428.9 | -0.022 |
| 429.0 | -0.022 |
| 429.1 | -0.022 |
| 429.2 | -0.022 |
| 429.3 | -0.022 |
| 429.4 | -0.022 |
| 429.5 | -0.022 |
| 429.6 | -0.022 |
| 429.7 | -0.022 |
| 429.8 | -0.022 |
| 429.9 | -0.022 |
| 430.0 | -0.022 |
| 430.1 | -0.022 |
| 430.2 | -0.022 |
| 430.3 | -0.022 |
| 430.4 | -0.022 |
| 430.5 | -0.022 |
| 430.6 | -0.022 |
| 430.7 | -0.022 |
| 430.8 | -0.022 |
| 430.9 | -0.022 |
| 431.0 | -0.022 |
| 431.1 | -0.022 |
| 431.2 | -0.022 |
| 431.3 | -0.022 |
| 431.4 | -0.022 |
| 431.5 | -0.022 |
| 431.6 | -0.022 |
| 431.7 | -0.022 |
| 431.8 | -0.022 |
| 431.9 | -0.022 |
| 432.0 | -0.022 |
| 432.1 | -0.022 |
| 432.2 | -0.022 |
| 432.3 | -0.022 |
| 432.4 | -0.022 |
| 432.5 | -0.022 |
| 432.6 | -0.022 |
| 432.7 | -0.022 |
| 432.8 | -0.022 |
| 432.9 | -0.022 |
| 433.0 | -0.022 |
| 433.1 | -0.022 |
| 433.2 | -0.022 |
| 433.3 | -0.022 |
| 433.4 | -0.022 |
| 433.5 | -0.022 |
| 433.6 | -0.022 |
| 433.7 | -0.022 |
| 433.8 | -0.022 |
| 433.9 | -0.022 |
| 434.0 | -0.022 |
| 434.1 | -0.022 |
| 434.2 | -0.022 |
| 434.3 | -0.022 |
| 434.4 | -0.022 |
| 434.5 | -0.022 |
| 434.6 | -0.022 |
| 434.7 | -0.022 |
| 434.8 | -0.022 |
| 434.9 | -0.022 |
| 435.0 | -0.022 |
| 435.1 | -0.022 |
| 435.2 | -0.022 |
| 435.3 | -0.022 |
| 435.4 | -0.022 |
| 435.5 | -0.022 |
| 435.6 | -0.022 |
| 435.7 | -0.022 |
| 435.8 | -0.022 |
| 435.9 | -0.022 |
| 436.0 | -0.022 |
| 436.1 | -0.022 |
| 436.2 | -0.022 |
| 436.3 | -0.022 |
| 436.4 | -0.022 |
| 436.5 | -0.022 |
| 436.6 | -0.022 |
| 436.7 | -0.022 |
| 436.8 | -0.022 |
| 436.9 | -0.022 |
| 437.0 | -0.022 |
| 437.1 | -0.022 |
| 437.2 | -0.022 |
| 437.3 | -0.022 |
| 437.4 | -0.022 |
| 437.5 | -0.022 |
| 437.6 | -0.022 |
| 437.7 | -0.022 |
| 437.8 | -0.022 |
| 437.9 | -0.022 |
| 438.0 | -0.022 |
| 438.1 | -0.022 |
| 438.2 | -0.022 |
| 438.3 | -0.022 |
| 438.4 | -0.022 |
| 438.5 | -0.022 |
| 438.6 | -0.022 |
| 438.7 | -0.022 |
| 438.8 | -0.022 |
| 438.9 | -0.022 |
| 439.0 | -0.022 |
| 439.1 | -0.022 |
| 439.2 | -0.022 |
| 439.3 | -0.022 |
| 439.4 | -0.022 |
| 439.5 | -0.022 |
| 439.6 | -0.022 |
| 439.7 | -0.022 |
| 439.8 | -0.022 |
| 439.9 | -0.022 |
| 440.0 | -0.022 |
| 440.1 | -0.022 |
| 440.2 | -0.022 |
| 440.3 | -0.022 |
| 440.4 | -0.022 |
| 440.5 | -0.022 |
| 440.6 | -0.022 |
| 440.7 | -0.022 |
| 440.8 | -0.022 |
| 440.9 | -0.022 |
| 441.0 | -0.022 |
| 441.1 | -0.022 |
| 441.2 | -0.022 |
| 441.3 | -0.022 |
| 441.4 | -0.022 |
| 441.5 | -0.022 |
| 441.6 | -0.022 |
| 441.7 | -0.022 |
| 441.8 | -0.022 |
| 441.9 | -0.022 |
| 442.0 | -0.022 |
| 442.1 | -0.022 |
| 442.2 | -0.022 |
| 442.3 | -0.022 |
| 442.4 | -0.022 |
| 442.5 | -0.022 |
| 442.6 | -0.022 |
| 442.7 | -0.022 |
| 442.8 | -0.022 |
| 442.9 | -0.022 |
| 443.0 | -0.022 |
| 443.1 | -0.022 |
| 443.2 | -0.022 |
| 443.3 | -0.022 |
| 443.4 | -0.022 |
| 443.5 | -0.022 |
| 443.6 | -0.022 |
| 443.7 | -0.022 |
| 443.8 | -0.022 |
| 443.9 | -0.022 |
| 444.0 | -0.022 |
| 444.1 | -0.022 |
| 444.2 | -0.022 |
| 444.3 | -0.022 |
| 444.4 | -0.022 |
| 444.5 | -0.022 |
| 444.6 | -0.022 |
| 444.7 | -0.022 |
| 444.8 | -0.022 |
| 444.9 | -0.022 |
| 445.0 | -0.022 |
| 445.1 | -0.022 |
| 445.2 | -0.022 |
| 445.3 | -0.022 |
| 445.4 | -0.022 |
| 445.5 | -0.022 |
| 445.6 | -0.022 |
| 445.7 | -0.022 |
| 445.8 | -0.022 |
| 445.9 | -0.022 |
| 446.0 | -0.022 |
| 446.1 | -0.022 |
| 446.2 | -0.022 |
| 446.3 | -0.022 |
| 446.4 | -0.022 |
| 446.5 | -0.022 |
| 446.6 | -0.022 |
| 446.7 | -0.022 |
| 446.8 | -0.022 |
| 446.9 | -0.022 |
| 447.0 | -0.022 |
| 447.1 | -0.022 |
| 447.2 | -0.022 |
| 447.3 | -0.022 |
| 447.4 | -0.022 |
| 447.5 | -0.022 |
| 447.6 | -0.022 |
| 447.7 | -0.022 |
| 447.8 | -0.022 |
| 447.9 | -0.022 |
| 448.0 | -0.022 |
| 448.1 | -0.022 |
| 448.2 | -0.022 |
| 448.3 | -0.022 |
| 448.4 | -0.022 |
| 448.5 | -0.022 |
| 448.6 | -0.022 |
| 448.7 | -0.022 |
| 448.8 | -0.022 |
| 448.9 | -0.022 |
| 449.0 | -0.022 |
| 449.1 | -0.022 |
| 449.2 | -0.022 |
| 449.3 | -0.022 |
| 449.4 | -0.022 |
| 449.5 | -0.022 |
| 449.6 | -0.022 |
| 449.7 | -0.022 |
| 449.8 | -0.022 |
| 449.9 | -0.022 |
| 450.0 | -0.022 |
| 450.1 | -0.022 |
| 450.2 | -0.022 |
| 450.3 | -0.022 |
| 450.4 | -0.022 |
| 450.5 | -0.022 |
| 450.6 | -0.022 |
| 450.7 | -0.022 |
| 450.8 | -0.022 |
| 450.9 | -0.022 |
| 451.0 | -0.022 |
| 451.1 | -0.022 |
| 451.2 | -0.022 |
| 451.3 | -0.022 |
| 451.4 | -0.022 |
| 451.5 | -0.022 |
| 451.6 | -0.022 |
| 451.7 | -0.022 |
| 451.8 | -0.022 |
| 451.9 | -0.022 |
| 452.0 | -0.022 |
| 452.1 | -0.022 |
| 452.2 | -0.022 |
| 452.3 | -0.022 |
| 452.4 | -0.022 |
| 452.5 | -0.022 |
| 452.6 | -0.022 |
| 452.7 | -0.022 |
| 452.8 | -0.022 |
| 452.9 | -0.022 |
| 453.0 | -0.022 |
| 453.1 | -0.022 |
| 453.2 | -0.022 |
| 453.3 | -0.022 |
| 453.4 | -0.022 |
| 453.5 | -0.022 |
| 453.6 | -0.022 |
| 453.7 | -0.022 |
| 453.8 | -0.022 |
| 453.9 | -0.022 |
| 454.0 | -0.022 |
| 454.1 | -0.022 |
| 454.2 | -0.022 |
| 454.3 | -0.022 |
| 454.4 | -0.022 |
| 454.5 | -0.022 |
| 454.6 | -0.022 |
| 454.7 | -0.022 |
| 454.8 | -0.022 |
| 454.9 | -0.022 |
| 455.0 | -0.022 |
| 455.1 | -0.022 |
| 455.2 | -0.022 |
| 455.3 | -0.022 |
| 455.4 | -0.022 |
| 455.5 | -0.022 |
| 455.6 | -0.022 |
| 455.7 | -0.022 |
| 455.8 | -0.022 |
| 455.9 | -0.022 |
| 456.0 | -0.022 |
| 456.1 | -0.022 |
| 456.2 | -0.022 |
| 456.3 | -0.022 |
| 456.4 | -0.022 |
| 456.5 | -0.022 |
| 456.6 | -0.022 |
| 456.7 | -0.022 |
| 456.8 | -0.022 |
| 456.9 | -0.022 |
| 457.0 | -0.022 |
| 457.1 | -0.022 |
| 457.2 | -0.022 |
| 457.3 | -0.022 |
| 457.4 | -0.022 |
| 457.5 | -0.022 |
| 457.6 | -0.022 |
| 457.7 | -0.022 |
| 457.8 | -0.022 |
| 457.9 | -0.022 |
| 458.0 | -0.022 |
| 458.1 | -0.022 |
| 458.2 | -0.022 |
| 458.3 | -0.022 |
| 458.4 | -0.022 |
| 458.5 | -0.022 |
| 458.6 | -0.022 |
| 458.7 | -0.022 |
| 458.8 | -0.022 |
| 458.9 | -0.022 |
| 459.0 | -0.022 |
| 459.1 | -0.022 |
| 459.2 | -0.022 |
| 459.3 | -0.022 |
| 459.4 | -0.022 |
| 459.5 | -0.022 |
| 459.6 | -0.022 |
| 459.7 | -0.022 |
| 459.8 | -0.022 |
| 459.9 | -0.022 |
| 460.0 | -0.022 |
| 460.1 | -0.022 |
| 460.2 | -0.022 |
| 460.3 | -0.022 |
| 460.4 | -0.022 |
| 460.5 | -0.022 |
| 460.6 | -0.022 |
| 460.7 | -0.022 |
| 460.8 | -0.022 |
| 460.9 | -0.022 |
| 461.0 | -0.022 |
| 461.1 | -0.022 |
| 461.2 | -0.022 |
| 461.3 | -0.022 |
| 461.4 | -0.022 |
| 461.5 | -0.022 |
| 461.6 | -0.022 |
| 461.7 | -0.022 |
| 461.8 | -0.022 |
| 461.9 | -0.022 |
| 462.0 | -0.022 |
| 462.1 | -0.022 |
| 462.2 | -0.022 |
| 462.3 | -0.022 |
| 462.4 | -0.022 |
| 462.5 | -0.022 |
| 462.6 | -0.022 |
| 462.7 | -0.022 |
| 462.8 | -0.022 |
| 462.9 | -0.022 |
| 463.0 | -0.022 |
| 463.1 | -0.022 |
| 463.2 | -0.022 |
| 463.3 | -0.022 |
| 463.4 | -0.022 |
| 463.5 | -0.022 |
| 463.6 | -0.022 |
| 463.7 | -0.022 |
| 463.8 | -0.022 |
| 463.9 | -0.022 |
| 464.0 | -0.022 |
| 464.1 | -0.022 |
| 464.2 | -0.022 |
| 464.3 | -0.022 |
| 464.4 | -0.022 |
| 464.5 | -0.022 |
| 464.6 | -0.022 |
| 464.7 | -0.022 |
| 464.8 | -0.022 |
| 464.9 | -0.022 |
| 465.0 | -0.022 |
| 465.1 | -0.022 |
| 465.2 | -0.022 |
| 465.3 | -0.022 |
| 465.4 | -0.022 |
| 465.5 | -0.022 |
| 465.6 | -0.022 |
| 465.7 | -0.022 |
| 465.8 | -0.022 |
| 465.9 | -0.022 |
| 466.0 | -0.022 |
| 466.1 | -0.022 |
| 466.2 | -0.022 |
| 466.3 | -0.022 |
| 466.4 | -0.022 |
| 466.5 | -0.022 |
| 466.6 | -0.022 |
| 466.7 | -0.022 |
| 466.8 | -0.022 |
| 466.9 | -0.022 |
| 467.0 | -0.022 |
| 467.1 | -0.022 |
| 467.2 | -0.022 |
| 467.3 | -0.022 |
| 467.4 | -0.022 |
| 467.5 | -0.022 |
| 467.6 | -0.022 |
| 467.7 | -0.022 |
| 467.8 | -0.022 |
| 467.9 | -0.022 |
| 468.0 | -0.022 |
| 468.1 | -0.022 |
| 468.2 | -0.022 |
| 468.3 | -0.022 |
| 468.4 | -0.022 |
| 468.5 | -0.022 |
| 468.6 | -0.022 |
| 468.7 | -0.022 |
| 468.8 | -0.022 |
| 468.9 | -0.022 |
| 469.0 | -0.022 |
| 469.1 | -0.022 |
| 469.2 | -0.022 |
| 469.3 | -0.022 |
| 469.4 | -0.022 |
| 469.5 | -0.022 |
| 469.6 | -0.022 |
| 469.7 | -0.022 |
| 469.8 | -0.022 |
| 469.9 | -0.022 |
| 470.0 | -0.022 |
| 470.1 | -0.022 |
| 470.2 | -0.022 |
| 470.3 | -0.022 |
| 470.4 | -0.022 |
| 470.5 | -0.022 |
| 470.6 | -0.022 |
| 470.7 | -0.022 |
| 470.8 | -0.022 |
| 470.9 | -0.022 |
| 471.0 | -0.022 |
| 471.1 | -0.022 |
| 471.2 | -0.022 |
| 471.3 | -0.022 |
| 471.4 | -0.022 |
| 471.5 | -0.022 |
| 471.6 | -0.022 |
| 471.7 | -0.022 |
| 471.8 | -0.022 |
| 471.9 | -0.022 |
| 472.0 | -0.022 |
| 472.1 | -0.022 |
| 472.2 | -0.022 |
| 472.3 | -0.022 |
| 472.4 | -0.022 |
| 472.5 | -0.022 |
| 472.6 | -0.022 |
| 472.7 | -0.022 |
| 472.8 | -0.022 |
| 472.9 | -0.022 |
| 473.0 | -0.022 |
| 473.1 | -0.022 |
| 473.2 | -0.022 |
| 473.3 | -0.022 |
| 473.4 | -0.022 |
| 473.5 | -0.022 |
| 473.6 | -0.022 |
| 473.7 | -0.022 |
| 473.8 | -0.022 |
| 473.9 | -0.022 |
| 474.0 | -0.022 |
| 474.1 | -0.022 |
| 474.2 | -0.022 |
| 474.3 | -0.022 |
| 474.4 | -0.022 |
| 474.5 | -0.022 |
| 474.6 | -0.022 |
| 474.7 | -0.022 |
| 474.8 | -0.022 |
| 474.9 | -0.022 |
| 475.0 | -0.022 |
| 475.1 | -0.022 |
| 475.2 | -0.022 |
| 475.3 | -0.022 |
| 475.4 | -0.022 |
| 475.5 | -0.022 |
| 475.6 | -0.022 |
| 475.7 | -0.022 |
| 475.8 | -0.022 |
| 475.9 | -0.022 |
| 476.0 | -0.022 |
| 476.1 | -0.022 |
| 476.2 | -0.022 |
| 476.3 | -0.022 |
| 476.4 | -0.022 |
| 476.5 | -0.022 |
| 476.6 | -0.022 |
| 476.7 | -0.022 |
| 476.8 | -0.022 |
| 476.9 | -0.022 |
| 477.0 | -0.022 |
| 477.1 | -0.022 |
| 477.2 | -0.022 |
| 477.3 | -0.022 |
| 477.4 | -0.022 |
| 477.5 | -0.022 |
| 477.6 | -0.022 |
| 477.7 | -0.022 |
| 477.8 | -0.022 |
| 477.9 | -0.022 |
| 478.0 | -0.022 |
| 478.1 | -0.022 |
| 478.2 | -0.022 |
| 478.3 | -0.022 |
| 478.4 | -0.022 |
| 478.5 | -0.022 |
| 478.6 | -0.022 |
| 478.7 | -0.022 |
| 478.8 | -0.022 |
| 478.9 | -0.022 |
| 479.0 | -0.022 |
| 479.1 | -0.022 |
| 479.2 | -0.022 |
| 479.3 | -0.022 |
| 479.4 | -0.022 |
| 479.5 | -0.022 |
| 479.6 | -0.022 |
| 479.7 | -0.022 |
| 479.8 | -0.022 |
| 479.9 | -0.022 |
| 480.0 | -0.022 |
| 480.1 | -0.022 |
| 480.2 | -0.022 |
| 480.3 | -0.022 |
| 480.4 | -0.022 |
| 480.5 | -0.022 |
| 480.6 | -0.022 |
| 480.7 | -0.022 |
| 480.8 | -0.022 |
| 480.9 | -0.022 |
| 481.0 | -0.022 |
| 481.1 | -0.022 |
| 481.2 | -0.022 |
| 481.3 | -0.022 |
| 481.4 | -0.022 |
| 481.5 | -0.022 |
| 481.6 | -0.022 |
| 481.7 | -0.022 |
| 481.8 | -0.022 |
| 481.9 | -0.022 |
| 482.0 | -0.022 |
| 482.1 | -0.022 |
| 482.2 | -0.022 |
| 482.3 | -0.022 |
| 482.4 | -0.022 |
| 482.5 | -0.022 |
| 482.6 | -0.022 |
| 482.7 | -0.022 |
| 482.8 | -0.022 |
| 482.9 | -0.022 |
| 483.0 | -0.022 |
| 483.1 | -0.022 |
| 483.2 | -0.022 |
| 483.3 | -0.022 |
| 483.4 | -0.022 |
| 483.5 | -0.022 |
| 483.6 | -0.022 |
| 483.7 | -0.022 |
| 483.8 | -0.022 |
| 483.9 | -0.022 |
| 484.0 | -0.022 |
| 484.1 | -0.022 |
| 484.2 | -0.022 |
| 484.3 | -0.022 |
| 484.4 | -0.022 |
| 484.5 | -0.022 |
| 484.6 | -0.022 |
| 484.7 | -0.022 |
| 484.8 | -0.022 |
| 484.9 | -0.022 |
| 485.0 | -0.022 |
| 485.1 | -0.022 |
| 485.2 | -0.022 |
| 485.3 | -0.022 |
| 485.4 | -0.022 |
| 485.5 | -0.022 |
| 485.6 | -0.022 |
| 485.7 | -0.022 |
| 485.8 | -0.022 |
| 485.9 | -0.022 |
| 486.0 | -0.022 |
| 486.1 | -0.022 |
| 486.2 | -0.022 |
| 486.3 | -0.022 |
| 486.4 | -0.022 |
| 486.5 | -0.022 |
| 486.6 | -0.022 |
| 486.7 | -0.022 |
| 486.8 | -0.022 |
| 486.9 | -0.022 |
| 487.0 | -0.022 |
| 487.1 | -0.022 |
| 487.2 | -0.022 |
| 487.3 | -0.022 |
| 487.4 | -0.022 |
| 487.5 | -0.022 |
| 487.6 | -0.022 |
| 487.7 | -0.022 |
| 487.8 | -0.022 |
| 487.9 | -0.022 |
| 488.0 | -0.022 |
| 488.1 | -0.022 |
| 488.2 | -0.022 |
| 488.3 | -0.022 |
| 488.4 | -0.022 |
| 488.5 | -0.022 |
| 488.6 | -0.022 |
| 488.7 | -0.022 |
| 488.8 | -0.022 |
| 488.9 | -0.022 |
| 489.0 | -0.022 |
| 489.1 | -0.022 |
| 489.2 | -0.022 |
| 489.3 | -0.022 |
| 489.4 | -0.022 |
| 489.5 | -0.022 |
| 489.6 | -0.022 |
| 489.7 | -0.022 |
| 489.8 | -0.022 |
| 489.9 | -0.022 |
| 490.0 | -0.022 |
| 490.1 | -0.022 |
| 490.2 | -0.022 |
| 490.3 | -0.022 |
| 490.4 | -0.022 |
| 490.5 | -0.022 |
| 490.6 | -0.022 |
| 490.7 | -0.022 |
| 490.8 | -0.022 |
| 490.9 | -0.022 |
| 491.0 | -0.022 |
| 491.1 | -0.022 |
| 491.2 | -0.022 |
| 491.3 | -0.022 |
| 491.4 | -0.022 |
| 491.5 | -0.022 |
| 491.6 | -0.022 |
| 491.7 | -0.022 |
| 491.8 | -0.022 |
| 491.9 | -0.022 |
| 492.0 | -0.022 |
| 492.1 | -0.022 |
| 492.2 | -0.022 |
| 492.3 | -0.022 |
| 492.4 | -0.022 |
| 492.5 | -0.022 |
| 492.6 | -0.022 |
| 492.7 | -0.022 |
| 492.8 | -0.022 |
| 492.9 | -0.022 |
| 493.0 | -0.022 |
| 493.1 | -0.022 |
| 493.2 | -0.022 |
| 493.3 | -0.022 |
| 493.4 | -0.022 |
| 493.5 | -0.022 |
| 493.6 | -0.022 |
| 493.7 | -0.022 |
| 493.8 | -0.022 |
| 493.9 | -0.022 |
| 494.0 | -0.022 |
| 494.1 | -0.022 |
| 494.2 | -0.022 |
| 494.3 | -0.022 |
| 494.4 | -0.022 |
| 494.5 | -0.022 |
| 494.6 | -0.022 |
| 494.7 | -0.022 |
| 494.8 | -0.022 |
| 494.9 | -0.022 |
| 495.0 | -0.022 |
| 495.1 | -0.022 |
| 495.2 | -0.022 |
| 495.3 | -0.022 |
| 495.4 | -0.022 |
| 495.5 | -0.022 |
| 495.6 | -0.022 |
| 495.7 | -0.022 |
| 495.8 | -0.022 |
| 495.9 | -0.022 |
| 496.0 | -0.022 |
| 496.1 | -0.022 |
| 496.2 | -0.022 |
| 496.3 | -0.022 |
| 496.4 | -0.022 |
| 496.5 | -0.022 |
| 496.6 | -0.022 |
| 496.7 | -0.022 |
| 496.8 | -0.022 |
| 496.9 | -0.022 |
| 497.0 | -0.022 |
| 497.1 | -0.022 |
| 497.2 | -0.022 |
| 497.3 | -0.022 |
| 497.4 | -0.022 |
| 497.5 | -0.022 |
| 497.6 | -0.022 |
| 497.7 | -0.022 |
| 497.8 | -0.022 |
| 497.9 | -0.022 |
| 498.0 | -0.022 |
| 498.1 | -0.022 |
| 498.2 | -0.022 |
| 498.3 | -0.022 |
| 498.4 | -0.022 |
| 498.5 | -0.022 |
| 498.6 | -0.022 |
| 498.7 | -0.022 |
| 498.8 | -0.022 |
| 498.9 | -0.022 |
| 499.0 | -0.022 |
| 499.1 | -0.022 |
| 499.2 | -0.022 |
| 499.3 | -0.022 |
| 499.4 | -0.022 |
| 499.5 | -0.022 |
| 499.6 | -0.022 |
| 499.7 | -0.022 |
| 499.8 | -0.022 |
| 499.9 | -0.022 |
| 500.0 | -0.022 |
| 500.1 | -0.022 |
| 500.2 | -0.022 |
| 500.3 | -0.022 |
| 500.4 | -0.022 |
| 500.5 | -0.022 |
| 500.6 | -0.022 |
| 500.7 | -0.022 |
| 500.8 | -0.022 |
| 500.9 | -0.022 |
| 501.0 | -0.022 |
| 501.1 | -0.022 |
| 501.2 | -0.022 |
| 501.3 | -0.022 |
| 501.4 | -0.022 |
| 501.5 | -0.022 |
| 501.6 | -0.022 |
| 501.7 | -0.022 |
| 501.8 | -0.022 |
| 501.9 | -0.022 |
| 502.0 | -0.022 |
| 502.1 | -0.022 |
| 502.2 | -0.022 |
| 502.3 | -0.022 |
| 502.4 | -0.022 |
| 502.5 | -0.022 |
| 502.6 | -0.022 |
| 502.7 | -0.022 |
| 502.8 | -0.022 |
| 502.9 | -0.022 |
| 503.0 | -0.022 |
| 503.1 | -0.022 |
| 503.2 | -0.022 |
| 503.3 | -0.022 |
| 503.4 | -0.022 |
| 503.5 | -0.022 |
| 503.6 | -0.022 |
| 503.7 | -0.022 |
| 503.8 | -0.022 |
| 503.9 | -0.022 |
| 504.0 | -0.022 |
| 504.1 | -0.022 |
| 504.2 | -0.022 |
| 504.3 | -0.022 |
| 504.4 | -0.022 |
| 504.5 | -0.022 |
| 504.6 | -0.022 |
| 504.7 | -0.022 |
| 504.8 | -0.022 |
| 504.9 | -0.022 |
| 505.0 | -0.022 |
| 505.1 | -0.022 |
| 505.2 | -0.022 |
| 505.3 | -0.022 |
| 505.4 | -0.022 |
| 505.5 | -0.022 |
| 505.6 | -0.022 |
| 505.7 | -0.022 |
| 505.8 | -0.022 |
| 505.9 | -0.022 |
| 506.0 | -0.022 |
| 506.1 | -0.022 |
| 506.2 | -0.022 |
| 506.3 | -0.022 |
| 506.4 | -0.022 |
| 506.5 | -0.022 |
| 506.6 | -0.022 |
| 506.7 | -0.022 |
| 506.8 | -0.022 |
| 506.9 | -0.022 |
| 507.0 | -0.022 |
| 507.1 | -0.022 |
| 507.2 | -0.022 |
| 507.3 | -0.022 |
| 507.4 | -0.022 |
| 507.5 | -0.022 |
| 507.6 | -0.022 |
| 507.7 | -0.022 |
| 507.8 | -0.022 |
| 507.9 | -0.022 |
| 508.0 | -0.022 |
| 508.1 | -0.022 |
| 508.2 | -0.022 |
| 508.3 | -0.022 |
| 508.4 | -0.022 |
| 508.5 | -0.022 |
| 508.6 | -0.022 |
| 508.7 | -0.022 |
| 508.8 | -0.022 |
| 508.9 | -0.022 |
| 509.0 | -0.022 |
| 509.1 | -0.022 |
| 509.2 | -0.022 |
| 509.3 | -0.022 |
| 509.4 | -0.022 |
| 509.5 | -0.022 |
| 509.6 | -0.022 |
| 509.7 | -0.022 |
| 509.8 | -0.022 |
| 509.9 | -0.022 |
| 510.0 | -0.022 |
| 510.1 | -0.022 |
| 510.2 | -0.022 |
| 510.3 | -0.022 |
| 510.4 | -0.022 |
| 510.5 | -0.022 |
| 510.6 | -0.022 |
| 510.7 | -0.022 |
| 510.8 | -0.022 |
| 510.9 | -0.022 |
| 511.0 | -0.022 |
| 511.1 | -0.022 |
| 511.2 | -0.022 |
| 511.3 | -0.022 |
| 511.4 | -0.022 |
| 511.5 | -0.022 |
| 511.6 | -0.022 |
| 511.7 | -0.022 |
| 511.8 | -0.022 |
| 511.9 | -0.022 |
| 512.0 | -0.022 |
| 512.1 | -0.022 |
| 512.2 | -0.022 |
| 512.3 | -0.022 |
| 512.4 | -0.022 |
| 512.5 | -0.022 |
| 512.6 | -0.022 |
| 512.7 | -0.022 |
| 512.8 | -0.022 |
| 512.9 | -0.022 |
| 513.0 | -0.022 |
| 513.1 | -0.022 |
| 513.2 | -0.022 |
| 513.3 | -0.022 |
| 513.4 | -0.022 |
| 513.5 | -0.022 |
| 513.6 | -0.022 |
| 513.7 | -0.022 |
| 513.8 | -0.022 |
| 513.9 | -0.022 |
| 514.0 | -0.022 |
| 514.1 | -0.022 |
| 514.2 | -0.022 |
| 514.3 | -0.022 |
| 514.4 | -0.022 |
| 514.5 | -0.022 |
| 514.6 | -0.022 |
| 514.7 | -0.022 |
| 514.8 | -0.022 |
| 514.9 | -0.022 |
| 515.0 | -0.022 |
| 515.1 | -0.022 |
| 515.2 | -0.022 |
| 515.3 | -0.022 |
| 515.4 | -0.022 |
| 515.5 | -0.022 |
| 515.6 | -0.022 |
| 515.7 | -0.022 |
| 515.8 | -0.022 |
| 515.9 | -0.022 |
| 516.0 | -0.022 |
| 516.1 | -0.022 |
| 516.2 | -0.022 |
| 516.3 | -0.022 |
| 516.4 | -0.022 |
| 516.5 | -0.022 |
| 516.6 | -0.022 |
| 516.7 | -0.022 |
| 516.8 | -0.022 |
| 516.9 | -0.022 |
| 517.0 | -0.022 |
| 517.1 | -0.022 |
| 517.2 | -0.022 |
| 517.3 | -0.022 |
| 517.4 | -0.022 |
| 517.5 | -0.022 |
| 517.6 | -0.022 |
| 517.7 | -0.022 |
| 517.8 | -0.022 |
| 517.9 | -0.022 |
| 518.0 | -0.022 |
| 518.1 | -0.022 |
| 518.2 | -0.022 |
| 518.3 | -0.022 |
| 518.4 | -0.022 |
| 518.5 | -0.022 |
| 518.6 | -0.022 |
| 518.7 | -0.022 |
| 518.8 | -0.022 |
| 518.9 | -0.022 |
| 519.0 | -0.022 |
| 519.1 | -0.022 |
| 519.2 | -0.022 |
| 519.3 | -0.022 |
| 519.4 | -0.022 |
| 519.5 | -0.022 |
| 519.6 | -0.022 |
| 519.7 | -0.022 |
| 519.8 | -0.022 |
| 519.9 | -0.022 |
| 520.0 | -0.022 |
| 520.1 | -0.022 |
| 520.2 | -0.022 |
| 520.3 | -0.022 |
| 520.4 | -0.022 |
| 520.5 | -0.022 |
| 520.6 | -0.022 |
| 520.7 | -0.022 |
| 520.8 | -0.022 |
| 520.9 | -0.022 |
| 521.0 | -0.022 |
| 521.1 | -0.022 |
| 521.2 | -0.022 |
| 521.3 | -0.022 |
| 521.4 | -0.022 |
| 521.5 | -0.022 |
| 521.6 | -0.022 |
| 521.7 | -0.022 |
| 521.8 | -0.022 |
| 521.9 | -0.022 |
| 522.0 | -0.022 |
| 522.1 | -0.022 |
| 522.2 | -0.022 |
| 522.3 | -0.022 |
| 522.4 | -0.022 |
| 522.5 | -0.022 |
| 522.6 | -0.022 |
| 522.7 | -0.022 |
| 522.8 | -0.022 |
| 522.9 | -0.022 |
| 523.0 | -0.022 |
| 523.1 | -0.022 |
| 523.2 | -0.022 |
| 523.3 | -0.022 |
| 523.4 | -0.022 |
| 523.5 | -0.022 |
| 523.6 | -0.022 |
| 523.7 | -0.022 |
| 523.8 | -0.022 |
| 523.9 | -0.022 |
| 524.0 | -0.022 |
| 524.1 | -0.022 |
| 524.2 | -0.022 |
| 524.3 | -0.022 |
| 524.4 | -0.022 |
| 524.5 | -0.022 |
| 524.6 | -0.022 |
| 524.7 | -0.022 |
| 524.8 | -0.022 |
| 524.9 | -0.022 |
| 525.0 | -0.022 |
| 525.1 | -0.022 |
| 525.2 | -0.022 |
| 525.3 | -0.022 |
| 525.4 | -0.022 |
| 525.5 | -0.022 |
| 525.6 | -0.022 |
| 525.7 | -0.022 |
| 525.8 | -0.022 |
| 525.9 | -0.022 |
| 526.0 | -0.022 |
| 526.1 | -0.022 |
| 526.2 | -0.022 |
| 526.3 | -0.022 |
| 526.4 | -0.022 |
| 526.5 | -0.022 |
| 526.6 | -0.022 |
| 526.7 | -0.022 |
| 526.8 | -0.022 |
| 526.9 | -0.022 |
| 527.0 | -0.022 |
| 527.1 | -0.022 |
| 527.2 | -0.022 |
| 527.3 | -0.022 |
| 527.4 | -0.022 |
| 527.5 | -0.022 |
| 527.6 | -0.022 |
| 527.7 | -0.022 |
| 527.8 | -0.022 |
| 527.9 | -0.022 |
| 528.0 | -0.022 |
| 528.1 | -0.022 |
| 528.2 | -0.022 |
| 528.3 | -0.022 |
| 528.4 | -0.022 |
| 528.5 | -0.022 |
| 528.6 | -0.022 |
| 528.7 | -0.022 |
| 528.8 | -0.022 |
| 528.9 | -0.022 |
| 529.0 | -0.022 |
| 529.1 | -0.022 |
| 529.2 | -0.022 |
| 529.3 | -0.022 |
| 529.4 | -0.022 |
| 529.5 | -0.022 |
| 529.6 | -0.022 |
| 529.7 | -0.022 |
| 529.8 | -0.022 |
| 529.9 | -0.022 |
| 530.0 | -0.022 |
| 530.1 | -0.022 |
| 530.2 | -0.022 |
| 530.3 | -0.022 |
| 530.4 | -0.022 |
| 530.5 | -0.022 |
| 530.6 | -0.022 |
| 530.7 | -0.022 |
| 530.8 | -0.022 |
| 530.9 | -0.022 |
| 531.0 | -0.022 |
| 531.1 | -0.022 |
| 531.2 | -0.022 |
| 531.3 | -0.022 |
| 531.4 | -0.022 |
| 531.5 | -0.022 |
| 531.6 | -0.022 |
| 531.7 | -0.022 |
| 531.8 | -0.022 |
| 531.9 | -0.022 |
| 532.0 | -0.022 |
| 532.1 | -0.022 |
| 532.2 | -0.022 |
| 532.3 | -0.022 |
| 532.4 | -0.022 |
| 532.5 | -0.022 |
| 532.6 | -0.022 |
| 532.7 | -0.022 |
| 532.8 | -0.022 |
| 532.9 | -0.022 |
| 533.0 | -0.022 |
| 533.1 | -0.022 |
| 533.2 | -0.022 |
| 533.3 | -0.022 |
| 533.4 | -0.022 |
| 533.5 | -0.022 |
| 533.6 | -0.022 |
| 533.7 | -0.022 |
| 533.8 | -0.022 |
| 533.9 | -0.022 |
| 534.0 | -0.022 |
| 534.1 | -0.022 |
| 534.2 | -0.022 |
| 534.3 | -0.022 |
| 534.4 | -0.022 |
| 534.5 | -0.022 |
| 534.6 | -0.022 |
| 534.7 | -0.022 |
| 534.8 | -0.022 |
| 534.9 | -0.022 |
| 535.0 | -0.022 |
| 535.1 | -0.022 |
| 535.2 | -0.022 |
| 535.3 | -0.022 |
| 535.4 | -0.022 |
| 535.5 | -0.022 |
| 535.6 | -0.022 |
| 535.7 | -0.022 |
| 535.8 | -0.022 |
| 535.9 | -0.022 |
| 536.0 | -0.022 |
| 536.1 | -0.022 |
| 536.2 | -0.022 |
| 536.3 | -0.022 |
| 536.4 | -0.022 |
| 536.5 | -0.022 |
| 536.6 | -0.022 |
| 536.7 | -0.022 |
| 536.8 | -0.022 |
| 536.9 | -0.022 |
| 537.0 | -0.022 |
| 537.1 | -0.022 |
| 537.2 | -0.022 |
| 537.3 | -0.022 |
| 537.4 | -0.022 |
| 537.5 | -0.022 |
| 537.6 | -0.022 |
| 537.7 | -0.022 |
| 537.8 | -0.022 |
| 537.9 | -0.022 |
| 538.0 | -0.022 |
| 538.1 | -0.022 |
| 538.2 | -0.022 |
| 538.3 | -0.022 |
| 538.4 | -0.022 |
| 538.5 | -0.022 |
| 538.6 | -0.022 |
| 538.7 | -0.022 |
| 538.8 | -0.022 |
| 538.9 | -0.022 |
| 539.0 | -0.022 |
| 539.1 | -0.022 |
| 539.2 | -0.022 |
| 539.3 | -0.022 |
| 539.4 | -0.022 |
| 539.5 | -0.022 |
| 539.6 | -0.022 |
| 539.7 | -0.022 |
| 539.8 | -0.022 |
| 539.9 | -0.022 |
| 540.0 | -0.022 |
| 540.1 | -0.022 |
| 540.2 | -0.022 |
| 540.3 | -0.022 |
| 540.4 | -0.022 |
| 540.5 | -0.022 |
| 540.6 | -0.022 |
| 540.7 | -0.022 |
| 540.8 | -0.022 |
| 540.9 | -0.022 |
| 541.0 | -0.022 |
| 541.1 | -0.022 |
| 541.2 | -0.022 |
| 541.3 | -0.022 |
| 541.4 | -0.022 |
| 541.5 | -0.022 |
| 541.6 | -0.022 |
| 541.7 | -0.022 |
| 541.8 | -0.022 |
| 541.9 | -0.022 |
| 542.0 | -0.022 |
| 542.1 | -0.022 |
| 542.2 | -0.022 |
| 542.3 | -0.022 |
| 542.4 | -0.022 |
| 542.5 | -0.022 |
| 542.6 | -0.022 |
| 542.7 | -0.022 |
| 542.8 | -0.022 |
| 542.9 | -0.022 |
| 543.0 | -0.022 |
| 543.1 | -0.022 |
| 543.2 | -0.022 |
| 543.3 | -0.022 |
| 543.4 | -0.022 |
| 543.5 | -0.022 |
| 543.6 | -0.022 |
| 543.7 | -0.022 |
| 543.8 | -0.022 |
| 543.9 | -0.022 |
| 544.0 | -0.022 |
| 544.1 | -0.022 |
| 544.2 | -0.022 |
| 544.3 | -0.022 |
| 544.4 | -0.022 |
| 544.5 | -0.022 |
| 544.6 | -0.022 |
| 544.7 | -0.022 |
| 544.8 | -0.022 |
| 544.9 | -0.022 |
| 545.0 | -0.022 |
| 545.1 | -0.022 |
| 545.2 | -0.022 |
| 545.3 | -0.022 |
| 545.4 | -0.022 |
| 545.5 | -0.022 |
| 545.6 | -0.022 |
| 545.7 | -0.022 |
| 545.8 | -0.022 |
| 545.9 | -0.022 |
| 546.0 | -0.022 |
| 546.1 | -0.022 |
| 546.2 | -0.022 |
| 546.3 | -0.022 |
| 546.4 | -0.022 |
| 546.5 | -0.022 |
| 546.6 | -0.022 |
| 546.7 | -0.022 |
| 546.8 | -0.022 |
| 546.9 | -0.022 |
| 547.0 | -0.022 |
| 547.1 | -0.022 |
| 547.2 | -0.022 |
| 547.3 | -0.022 |
| 547.4 | -0.022 |
| 547.5 | -0.022 |
| 547.6 | -0.022 |
| 547.7 | -0.022 |
| 547.8 | -0.022 |
| 547.9 | -0.022 |
| 548.0 | -0.022 |
| 548.1 | -0.022 |
| 548.2 | -0.022 |
| 548.3 | -0.022 |
| 548.4 | -0.022 |
| 548.5 | -0.022 |
| 548.6 | -0.022 |
| 548.7 | -0.022 |
| 548.8 | -0.022 |
| 548.9 | -0.022 |
| 549.0 | -0.022 |
| 549.1 | -0.022 |
| 549.2 | -0.022 |
| 549.3 | -0.022 |
| 549.4 | -0.022 |
| 549.5 | -0.022 |
| 549.6 | -0.022 |
| 549.7 | -0.022 |
| 549.8 | -0.022 |
| 549.9 | -0.022 |
| 550.0 | -0.022 |
| 550.1 | -0.022 |
| 550.2 | -0.022 |
| 550.3 | -0.022 |
| 550.4 | -0.022 |
| 550.5 | -0.022 |
| 550.6 | -0.022 |
| 550.7 | -0.022 |
| 550.8 | -0.022 |
| 550.9 | -0.022 |
| 551.0 | -0.022 |
| 551.1 | -0.022 |
| 551.2 | -0.022 |
| 551.3 | -0.022 |
| 551.4 | -0.022 |
| 551.5 | -0.022 |
| 551.6 | -0.022 |
| 551.7 | -0.022 |
| 551.8 | -0.022 |
| 551.9 | -0.022 |
| 552.0 | -0.022 |
| 552.1 | -0.022 |
| 552.2 | -0.022 |
| 552.3 | -0.022 |
| 552.4 | -0.022 |
| 552.5 | -0.022 |
| 552.6 | -0.022 |
| 552.7 | -0.022 |
| 552.8 | -0.022 |
| 552.9 | -0.022 |
| 553.0 | -0.022 |
| 553.1 | -0.022 |
| 553.2 | -0.022 |
| 553.3 | -0.022 |
| 553.4 | -0.022 |
| 553.5 | -0.022 |
| 553.6 | -0.022 |
| 553.7 | -0.022 |
| 553.8 | -0.022 |
| 553.9 | -0.022 |
| 554.0 | -0.022 |
| 554.1 | -0.022 |
| 554.2 | -0.022 |
| 554.3 | -0.022 |
| 554.4 | -0.022 |
| 554.5 | -0.022 |
| 554.6 | -0.022 |
| 554.7 | -0.022 |
| 554.8 | -0.022 |
| 554.9 | -0.022 |
| 555.0 | -0.022 |
| 555.1 | -0.022 |
| 555.2 | -0.022 |
| 555.3 | -0.022 |
| 555.4 | -0.022 |
| 555.5 | -0.022 |
| 555.6 | -0.022 |
| 555.7 | -0.022 |
| 555.8 | -0.022 |
| 555.9 | -0.022 |
| 556.0 | -0.022 |
| 556.1 | -0.022 |
| 556.2 | -0.022 |
| 556.3 | -0.022 |
| 556.4 | -0.022 |
| 556.5 | -0.022 |
| 556.6 | -0.022 |
| 556.7 | -0.022 |
| 556.8 | -0.022 |
| 556.9 | -0.022 |
| 557.0 | -0.022 |
| 557.1 | -0.022 |
| 557.2 | -0.022 |
| 557.3 | -0.022 |
| 557.4 | -0.022 |
| 557.5 | -0.022 |
| 557.6 | -0.022 |
| 557.7 | -0.022 |
| 557.8 | -0.022 |
| 557.9 | -0.022 |
| 558.0 | -0.022 |
| 558.1 | -0.022 |
| 558.2 | -0.022 |
| 558.3 | -0.022 |
| 558.4 | -0.022 |
| 558.5 | -0.022 |
| 558.6 | -0.022 |
| 558.7 | -0.022 |
| 558.8 | -0.022 |
| 558.9 | -0.022 |
| 559.0 | -0.022 |
| 559.1 | -0.022 |
| 559.2 | -0.022 |
| 559.3 | -0.022 |
| 559.4 | -0.022 |
| 559.5 | -0.022 |
| 559.6 | -0.022 |
| 559.7 | -0.022 |
| 559.8 | -0.022 |
| 559.9 | -0.022 |
| 560.0 | -0.022 |
| 560.1 | -0.022 |
| 560.2 | -0.022 |
| 560.3 | -0.022 |
| 560.4 | -0.022 |
| 560.5 | -0.022 |
| 560.6 | -0.022 |
| 560.7 | -0.022 |
| 560.8 | -0.022 |
| 560.9 | -0.022 |
| 561.0 | -0.022 |
| 561.1 | -0.022 |
| 561.2 | -0.022 |
| 561.3 | -0.022 |
| 561.4 | -0.022 |
| 561.5 | -0.022 |
| 561.6 | -0.022 |
| 561.7 | -0.022 |
| 561.8 | -0.022 |
| 561.9 | -0.022 |
| 562.0 | -0.022 |
| 562.1 | -0.022 |
| 562.2 | -0.022 |
| 562.3 | -0.022 |
| 562.4 | -0.022 |
| 562.5 | -0.022 |
| 562.6 | -0.022 |
| 562.7 | -0.022 |
| 562.8 | -0.022 |
| 562.9 | -0.022 |
| 563.0 | -0.022 |
| 563.1 | -0.022 |
| 563.2 | -0.022 |
| 563.3 | -0.022 |
| 563.4 | -0.022 |
| 563.5 | -0.022 |
| 563.6 | -0.022 |
| 563.7 | -0.022 |
| 563.8 | -0.022 |
| 563.9 | -0.022 |
| 564.0 | -0.022 |
| 564.1 | -0.022 |
| 564.2 | -0.022 |
| 564.3 | -0.022 |
| 564.4 | -0.022 |
| 564.5 | -0.022 |
| 564.6 | -0.022 |
| 564.7 | -0.022 |
| 564.8 | -0.022 |
| 564.9 | -0.022 |
| 565.0 | -0.022 |
| 565.1 | -0.022 |
| 565.2 | -0.022 |
| 565.3 | -0.022 |
| 565.4 | -0.022 |
| 565.5 | -0.022 |
| 565.6 | -0.022 |
| 565.7 | -0.022 |
| 565.8 | -0.022 |
| 565.9 | -0.022 |
| 566.0 | -0.022 |
| 566.1 | -0.022 |
| 566.2 | -0.022 |
| 566.3 | -0.022 |
| 566.4 | -0.022 |
| 566.5 | -0.022 |
| 566.6 | -0.022 |
| 566.7 | -0.022 |
| 566.8 | -0.022 |
| 566.9 | -0.022 |
| 567.0 | -0.022 |
| 567.1 | -0.022 |
| 567.2 | -0.022 |
| 567.3 | -0.022 |
| 567.4 | -0.022 |
| 567.5 | -0.022 |
| 567.6 | -0.022 |
| 567.7 | -0.022 |
| 567.8 | -0.022 |
| 567.9 | -0.022 |
| 568.0 | -0.022 |
| 568.1 | -0.022 |
| 568.2 | -0.022 |
| 568.3 | -0.022 |
| 568.4 | -0.022 |
| 568.5 | -0.022 |
| 568.6 | -0.022 |
| 568.7 | -0.022 |
| 568.8 | -0.022 |
| 568.9 | -0.022 |
| 569.0 | -0.022 |
| 569.1 | -0.022 |
| 569.2 | -0.022 |
| 569.3 | -0.022 |
| 569.4 | -0.022 |
| 569.5 | -0.022 |
| 569.6 | -0.022 |
| 569.7 | -0.022 |
| 569.8 | -0.022 |
| 569.9 | -0.022 |
| 570.0 | -0.022 |
| 570.1 | -0.022 |
| 570.2 | -0.022 |
| 570.3 | -0.022 |
| 570.4 | -0.022 |
| 570.5 | -0.022 |
| 570.6 | -0.022 |
| 570.7 | -0.022 |
| 570.8 | -0.022 |
| 570.9 | -0.022 |
| 571.0 | -0.022 |
| 571.1 | -0.022 |
| 571.2 | -0.022 |
| 571.3 | -0.022 |
| 571.4 | -0.022 |
| 571.5 | -0.022 |
| 571.6 | -0.022 |
| 571.7 | -0.022 |
| 571.8 | -0.022 |
| 571.9 | -0.022 |
| 572.0 | -0.022 |
| 572.1 | -0.022 |
| 572.2 | -0.022 |
| 572.3 | -0.022 |
| 572.4 | -0.022 |
| 572.5 | -0.022 |
| 572.6 | -0.022 |
| 572.7 | -0.022 |
| 572.8 | -0.022 |
| 572.9 | -0.022 |
| 573.0 | -0.022 |
| 573.1 | -0.022 |
| 573.2 | -0.022 |
| 573.3 | -0.022 |
| 573.4 | -0.022 |
| 573.5 | -0.022 |
| 573.6 | -0.022 |
| 573.7 | -0.022 |
| 573.8 | -0.022 |
| 573.9 | -0.022 |
| 574.0 | -0.022 |
| 574.1 | -0.022 |
| 574.2 | -0.022 |
| 574.3 | -0.022 |
| 574.4 | -0.022 |
| 574.5 | -0.022 |
| 574.6 | -0.022 |
| 574.7 | -0.022 |
| 574.8 | -0.022 |
| 574.9 | -0.022 |
| 575.0 | -0.022 |
| 575.1 | -0.022 |
| 575.2 | -0.022 |
| 575.3 | -0.022 |
| 575.4 | -0.022 |
| 575.5 | -0.022 |
| 575.6 | -0.022 |
| 575.7 | -0.022 |
| 575.8 | -0.022 |
| 575.9 | -0.022 |
| 576.0 | -0.022 |
| 576.1 | -0.022 |
| 576.2 | -0.022 |
| 576.3 | -0.022 |
| 576.4 | -0.022 |
| 576.5 | -0.022 |
| 576.6 | -0.022 |
| 576.7 | -0.022 |
| 576.8 | -0.022 |
| 576.9 | -0.022 |
| 577.0 | -0.022 |
| 577.1 | -0.022 |
| 577.2 | -0.022 |
| 577.3 | -0.022 |
| 577.4 | -0.022 |
| 577.5 | -0.022 |
| 577.6 | -0.022 |
| 577.7 | -0.022 |
| 577.8 | -0.022 |
| 577.9 | -0.022 |
| 578.0 | -0.022 |
| 578.1 | -0.022 |
| 578.2 | -0.022 |
| 578.3 | -0.022 |
| 578.4 | -0.022 |
| 578.5 | -0.022 |
| 578.6 | -0.022 |
| 578.7 | -0.022 |
| 578.8 | -0.022 |
| 578.9 | -0.022 |
| 579.0 | -0.022 |
| 579.1 | -0.022 |
| 579.2 | -0.022 |
| 579.3 | -0.022 |
| 579.4 | -0.022 |
| 579.5 | -0.022 |
| 579.6 | -0.022 |
| 579.7 | -0.022 |
| 579.8 | -0.022 |
| 579.9 | -0.022 |
| 580.0 | -0.022 |
| 580.1 | -0.022 |
| 580.2 | -0.022 |
| 580.3 | -0.022 |
| 580.4 | -0.022 |
| 580.5 | -0.022 |
| 580.6 | -0.022 |
| 580.7 | -0.022 |
| 580.8 | -0.022 |
| 580.9 | -0.022 |
| 581.0 | -0.022 |
| 581.1 | -0.022 |
| 581.2 | -0.022 |
| 581.3 | -0.022 |
| 581.4 | -0.022 |
| 581.5 | -0.022 |
| 581.6 | -0.022 |
| 581.7 | -0.022 |
| 581.8 | -0.022 |
| 581.9 | -0.022 |
| 582.0 | -0.022 |
| 582.1 | -0.022 |
| 582.2 | -0.022 |
| 582.3 | -0.022 |
| 582.4 | -0.022 |
| 582.5 | -0.022 |
| 582.6 | -0.022 |
| 582.7 | -0.022 |
| 582.8 | -0.022 |
| 582.9 | -0.022 |
| 583.0 | -0.022 |
| 583.1 | -0.022 |
| 583.2 | -0.022 |
| 583.3 | -0.022 |
| 583.4 | -0.022 |
| 583.5 | -0.022 |
| 583.6 | -0.022 |
| 583.7 | -0.022 |
| 583.8 | -0.022 |
| 583.9 | -0.022 |
| 584.0 | -0.022 |
| 584.1 | -0.022 |
| 584.2 | -0.022 |
| 584.3 | -0.022 |
| 584.4 | -0.022 |
| 584.5 | -0.022 |
| 584.6 | -0.022 |
| 584.7 | -0.022 |
| 584.8 | -0.022 |
| 584.9 | -0.022 |
| 585.0 | -0.022 |
| 585.1 | -0.022 |
| 585.2 | -0.022 |
| 585.3 | -0.022 |
| 585.4 | -0.022 |
| 585.5 | -0.022 |
| 585.6 | -0.022 |
| 585.7 | -0.022 |
| 585.8 | -0.022 |
| 585.9 | -0.022 |
| 586.0 | -0.022 |
| 586.1 | -0.022 |
| 586.2 | -0.022 |
| 586.3 | -0.022 |
| 586.4 | -0.022 |
| 586.5 | -0.022 |
| 586.6 | -0.022 |
| 586.7 | -0.022 |
| 586.8 | -0.022 |
| 586.9 | -0.022 |
| 587.0 | -0.022 |
| 587.1 | -0.022 |
| 587.2 | -0.022 |
| 587.3 | -0.022 |
| 587.4 | -0.022 |
| 587.5 | -0.022 |
| 587.6 | -0.022 |
| 587.7 | -0.022 |
| 587.8 | -0.022 |
| 587.9 | -0.022 |
| 588.0 | -0.022 |
| 588.1 | -0.022 |
| 588.2 | -0.022 |
| 588.3 | -0.022 |
| 588.4 | -0.022 |
| 588.5 | -0.022 |
| 588.6 | -0.022 |
| 588.7 | -0.022 |
| 588.8 | -0.022 |
| 588.9 | -0.022 |
| 589.0 | -0.022 |
| 589.1 | -0.022 |
| 589.2 | -0.022 |
| 589.3 | -0.022 |
| 589.4 | -0.022 |
| 589.5 | -0.022 |
| 589.6 | -0.022 |
| 589.7 | -0.022 |
| 589.8 | -0.022 |
| 589.9 | -0.022 |
| 590.0 | -0.022 |
| 590.1 | -0.022 |
| 590.2 | -0.022 |
| 590.3 | -0.022 |
| 590.4 | -0.022 |
| 590.5 | -0.022 |
| 590.6 | -0.022 |
| 590.7 | -0.022 |
| 590.8 | -0.022 |
| 590.9 | -0.022 |
| 591.0 | -0.022 |
| 591.1 | -0.022 |
| 591.2 | -0.022 |
| 591.3 | -0.022 |
| 591.4 | -0.022 |
| 591.5 | -0.022 |
| 591.6 | -0.022 |
| 591.7 | -0.022 |
| 591.8 | -0.022 |
| 591.9 | -0.022 |
| 592.0 | -0.022 |
| 592.1 | -0.022 |
| 592.2 | -0.022 |
| 592.3 | -0.022 |
| 592.4 | -0.022 |
| 592.5 | -0.022 |
| 592.6 | -0.022 |
| 592.7 | -0.022 |
| 592.8 | -0.022 |
| 592.9 | -0.022 |
| 593.0 | -0.022 |
| 593.1 | -0.022 |
| 593.2 | -0.022 |
| 593.3 | -0.022 |
| 593.4 | -0.022 |
| 593.5 | -0.022 |
| 593.6 | -0.022 |
| 593.7 | -0.022 |
| 593.8 | -0.022 |
| 593.9 | -0.022 |
| 594.0 | -0.022 |
| 594.1 | -0.022 |
| 594.2 | -0.022 |
| 594.3 | -0.022 |
| 594.4 | -0.022 |
| 594.5 | -0.022 |
| 594.6 | -0.022 |
| 594.7 | -0.022 |
| 594.8 | -0.022 |
| 594.9 | -0.022 |
| 595.0 | -0.022 |
| 595.1 | -0.022 |
| 595.2 | -0.022 |
| 595.3 | -0.022 |
| 595.4 | -0.022 |
| 595.5 | -0.022 |
| 595.6 | -0.022 |
| 595.7 | -0.022 |
| 595.8 | -0.022 |
| 595.9 | -0.022 |
| 596.0 | -0.022 |
| 596.1 | -0.022 |
| 596.2 | -0.022 |
| 596.3 | -0.022 |
| 596.4 | -0.022 |
| 596.5 | -0.022 |
| 596.6 | -0.022 |
| 596.7 | -0.022 |
| 596.8 | -0.022 |
| 596.9 | -0.022 |
| 597.0 | -0.022 |
| 597.1 | -0.022 |
| 597.2 | -0.022 |
| 597.3 | -0.022 |
| 597.4 | -0.022 |
| 597.5 | -0.022 |
| 597.6 | -0.022 |
| 597.7 | -0.022 |
| 597.8 | -0.022 |
| 597.9 | -0.022 |
| 598.0 | -0.022 |
| 598.1 | -0.022 |
| 598.2 | -0.022 |
| 598.3 | -0.022 |
| 598.4 | -0.022 |
| 598.5 | -0.022 |
| 598.6 | -0.022 |
| 598.7 | -0.022 |
| 598.8 | -0.022 |
| 598.9 | -0.022 |
| 599.0 | -0.022 |
| 599.1 | -0.022 |
| 599.2 | -0.022 |
| 599.3 | -0.022 |
| 599.4 | -0.022 |
| 599.5 | -0.022 |
| 599.6 | -0.022 |
| 599.7 | -0.022 |
| 599.8 | -0.022 |
| 599.9 | -0.022 |
| 600.0 | -0.022 |
| 600.1 | -0.022 |
| 600.2 | -0.022 |
| 600.3 | -0.022 |
| 600.4 | -0.022 |
| 600.5 | -0.022 |
| 600.6 | -0.022 |
| 600.7 | -0.022 |
| 600.8 | -0.022 |
| 600.9 | -0.022 |
| 601.0 | -0.022 |
| 601.1 | -0.022 |
| 601.2 | -0.022 |
| 601.3 | -0.022 |
| 601.4 | -0.022 |
| 601.5 | -0.022 |
| 601.6 | -0.022 |
| 601.7 | -0.022 |
| 601.8 | -0.022 |
| 601.9 | -0.022 |
| 602.0 | -0.022 |
| 602.1 | -0.022 |
| 602.2 | -0.022 |
| 602.3 | -0.022 |
| 602.4 | -0.022 |
| 602.5 | -0.022 |
| 602.6 | -0.022 |
| 602.7 | -0.022 |
| 602.8 | -0.022 |
| 602.9 | -0.022 |
| 603.0 | -0.022 |
| 603.1 | -0.022 |
| 603.2 | -0.022 |
| 603.3 | -0.022 |
| 603.4 | -0.022 |
| 603.5 | -0.023 |
| 603.6 | -0.023 |
| 603.7 | -0.023 |
| 603.8 | -0.023 |
| 603.9 | -0.023 |
| 604.0 | -0.023 |
| 604.1 | -0.023 |
| 604.2 | -0.023 |
| 604.3 | -0.023 |
| 604.4 | -0.023 |
| 604.5 | -0.023 |
| 604.6 | -0.023 |
| 604.7 | -0.023 |
| 604.8 | -0.023 |
| 604.9 | -0.023 |
| 605.0 | -0.023 |
| 605.1 | -0.023 |
| 605.2 | -0.023 |
| 605.3 | -0.023 |
| 605.4 | -0.023 |
| 605.5 | -0.023 |
| 605.6 | -0.023 |
| 605.7 | -0.023 |
| 605.8 | -0.023 |
| 605.9 | -0.023 |
| 606.0 | -0.023 |
| 606.1 | -0.023 |
| 606.2 | -0.023 |
| 606.3 | -0.023 |
| 606.4 | -0.023 |
| 606.5 | -0.023 |
| 606.6 | -0.023 |
| 606.7 | -0.023 |
| 606.8 | -0.023 |
| 606.9 | -0.023 |
| 607.0 | -0.023 |
| 607.1 | -0.023 |
| 607.2 | -0.023 |
| 607.3 | -0.023 |
| 607.4 | -0.023 |
| 607.5 | -0.023 |
| 607.6 | -0.023 |
| 607.7 | -0.023 |
| 607.8 | -0.023 |
| 607.9 | -0.023 |
| 608.0 | -0.023 |
| 608.1 | -0.023 |
| 608.2 | -0.023 |
| 608.3 | -0.023 |
| 608.4 | -0.023 |
| 608.5 | -0.023 |
| 608.6 | -0.023 |
| 608.7 | -0.023 |
| 608.8 | -0.023 |
| 608.9 | -0.023 |
| 609.0 | -0.023 |
| 609.1 | -0.023 |
| 609.2 | -0.023 |
| 609.3 | -0.023 |
| 609.4 | -0.023 |
| 609.5 | -0.023 |
| 609.6 | -0.023 |
| 609.7 | -0.023 |
| 609.8 | -0.023 |
| 609.9 | -0.023 |
| 610.0 | -0.023 |
| 610.1 | -0.023 |
| 610.2 | -0.023 |
| 610.3 | -0.023 |
| 610.4 | -0.023 |
| 610.5 | -0.023 |
| 610.6 | -0.023 |
| 610.7 | -0.023 |
| 610.8 | -0.023 |
| 610.9 | -0.023 |
| 611.0 | -0.023 |
| 611.1 | -0.023 |
| 611.2 | -0.023 |
| 611.3 | -0.023 |
| 611.4 | -0.023 |
| 611.5 | -0.023 |
| 611.6 | -0.023 |
| 611.7 | -0.023 |
| 611.8 | -0.023 |
| 611.9 | -0.023 |
| 612.0 | -0.023 |
| 612.1 | -0.023 |
| 612.2 | -0.023 |
| 612.3 | -0.023 |
| 612.4 | -0.023 |
| 612.5 | -0.023 |
| 612.6 | -0.023 |
| 612.7 | -0.023 |
| 612.8 | -0.023 |
| 612.9 | -0.023 |
| 613.0 | -0.023 |
| 613.1 | -0.023 |
| 613.2 | -0.023 |
| 613.3 | -0.023 |
| 613.4 | -0.023 |
| 613.5 | -0.023 |
| 613.6 | -0.023 |
| 613.7 | -0.023 |
| 613.8 | -0.023 |
| 613.9 | -0.023 |
| 614.0 | -0.023 |
| 614.1 | -0.023 |
| 614.2 | -0.023 |
| 614.3 | -0.023 |
| 614.4 | -0.023 |
| 614.5 | -0.023 |
| 614.6 | -0.023 |
| 614.7 | -0.023 |
| 614.8 | -0.023 |
| 614.9 | -0.023 |
| 615.0 | -0.023 |
| 615.1 | -0.023 |
| 615.2 | -0.023 |
| 615.3 | -0.023 |
| 615.4 | -0.023 |
| 615.5 | -0.023 |
| 615.6 | -0.023 |
| 615.7 | -0.023 |
| 615.8 | -0.023 |
| 615.9 | -0.023 |
| 616.0 | -0.023 |
| 616.1 | -0.023 |
| 616.2 | -0.023 |
| 616.3 | -0.023 |
| 616.4 | -0.023 |
| 616.5 | -0.023 |
| 616.6 | -0.023 |
| 616.7 | -0.023 |
| 616.8 | -0.023 |
| 616.9 | -0.023 |
| 617.0 | -0.023 |
| 617.1 | -0.023 |
| 617.2 | -0.023 |
| 617.3 | -0.023 |
| 617.4 | -0.023 |
| 617.5 | -0.023 |
| 617.6 | -0.023 |
| 617.7 | -0.023 |
| 617.8 | -0.023 |
| 617.9 | -0.023 |
| 618.0 | -0.023 |
| 618.1 | -0.023 |
| 618.2 | -0.023 |
| 618.3 | -0.023 |
| 618.4 | -0.023 |
| 618.5 | -0.023 |
| 618.6 | -0.023 |
| 618.7 | -0.023 |
| 618.8 | -0.023 |
| 618.9 | -0.023 |
| 619.0 | -0.023 |
| 619.1 | -0.023 |
| 619.2 | -0.023 |
| 619.3 | -0.023 |
| 619.4 | -0.023 |
| 619.5 | -0.023 |
| 619.6 | -0.023 |
| 619.7 | -0.023 |
| 619.8 | -0.023 |
| 619.9 | -0.023 |
| 620.0 | -0.023 |
| 620.1 | -0.023 |
| 620.2 | -0.023 |
| 620.3 | -0.023 |
| 620.4 | -0.023 |
| 620.5 | -0.023 |
| 620.6 | -0.023 |
| 620.7 | -0.023 |
| 620.8 | -0.023 |
| 620.9 | -0.023 |
| 621.0 | -0.023 |
| 621.1 | -0.023 |
| 621.2 | -0.023 |
| 621.3 | -0.023 |
| 621.4 | -0.023 |
| 621.5 | -0.023 |
| 621.6 | -0.023 |
| 621.7 | -0.023 |
| 621.8 | -0.023 |
| 621.9 | -0.023 |
| 622.0 | -0.023 |
| 622.1 | -0.023 |
| 622.2 | -0.023 |
| 622.3 | -0.023 |
| 622.4 | -0.023 |
| 622.5 | -0.023 |
| 622.6 | -0.023 |
| 622.7 | -0.023 |
| 622.8 | -0.023 |
| 622.9 | -0.023 |
| 623.0 | -0.023 |
| 623.1 | -0.023 |
| 623.2 | -0.023 |
| 623.3 | -0.023 |
| 623.4 | -0.023 |
| 623.5 | -0.023 |
| 623.6 | -0.023 |
| 623.7 | -0.023 |
| 623.8 | -0.023 |
| 623.9 | -0.023 |
| 624.0 | -0.023 |
| 624.1 | -0.023 |
| 624.2 | -0.023 |
| 624.3 | -0.023 |
| 624.4 | -0.023 |
| 624.5 | -0.023 |
| 624.6 | -0.023 |
| 624.7 | -0.023 |
| 624.8 | -0.023 |
| 624.9 | -0.023 |
| 625.0 | -0.023 |
| 625.1 | -0.023 |
| 625.2 | -0.023 |
| 625.3 | -0.023 |
| 625.4 | -0.023 |
| 625.5 | -0.023 |
| 625.6 | -0.023 |
| 625.7 | -0.023 |
| 625.8 | -0.023 |
| 625.9 | -0.023 |
| 626.0 | -0.023 |
| 626.1 | -0.023 |
| 626.2 | -0.023 |
| 626.3 | -0.023 |
| 626.4 | -0.023 |
| 626.5 | -0.023 |
| 626.6 | -0.023 |
| 626.7 | -0.023 |
| 626.8 | -0.023 |
| 626.9 | -0.023 |
| 627.0 | -0.023 |
| 627.1 | -0.023 |
| 627.2 | -0.023 |
| 627.3 | -0.023 |
| 627.4 | -0.023 |
| 627.5 | -0.023 |
| 627.6 | -0.023 |
| 627.7 | -0.023 |
| 627.8 | -0.023 |
| 627.9 | -0.023 |
| 628.0 | -0.023 |
| 628.1 | -0.023 |
| 628.2 | -0.023 |
| 628.3 | -0.023 |
| 628.4 | -0.023 |
| 628.5 | -0.023 |
| 628.6 | -0.023 |
| 628.7 | -0.023 |
| 628.8 | -0.023 |
| 628.9 | -0.023 |
| 629.0 | -0.023 |
| 629.1 | -0.023 |
| 629.2 | -0.023 |
| 629.3 | -0.023 |
| 629.4 | -0.023 |
| 629.5 | -0.023 |
| 629.6 | -0.023 |
| 629.7 | -0.023 |
| 629.8 | -0.023 |
| 629.9 | -0.023 |
| 630.0 | -0.023 |
| 630.1 | -0.023 |
| 630.2 | -0.023 |
| 630.3 | -0.023 |
| 630.4 | -0.023 |
| 630.5 | -0.023 |
| 630.6 | -0.023 |
| 630.7 | -0.023 |
| 630.8 | -0.023 |
| 630.9 | -0.023 |
| 631.0 | -0.023 |
| 631.1 | -0.023 |
| 631.2 | -0.023 |
| 631.3 | -0.023 |
| 631.4 | -0.023 |
| 631.5 | -0.023 |
| 631.6 | -0.023 |
| 631.7 | -0.023 |
| 631.8 | -0.023 |
| 631.9 | -0.023 |
| 632.0 | -0.023 |
| 632.1 | -0.023 |
| 632.2 | -0.023 |
| 632.3 | -0.023 |
| 632.4 | -0.023 |
| 632.5 | -0.023 |
| 632.6 | -0.023 |
| 632.7 | -0.023 |
| 632.8 | -0.023 |
| 632.9 | -0.023 |
| 633.0 | -0.023 |
| 633.1 | -0.023 |
| 633.2 | -0.023 |
| 633.3 | -0.023 |
| 633.4 | -0.023 |
| 633.5 | -0.023 |
| 633.6 | -0.023 |
| 633.7 | -0.023 |
| 633.8 | -0.023 |
| 633.9 | -0.023 |
| 634.0 | -0.023 |
| 634.1 | -0.023 |
| 634.2 | -0.023 |
| 634.3 | -0.023 |
| 634.4 | -0.023 |
| 634.5 | -0.023 |
| 634.6 | -0.023 |
| 634.7 | -0.023 |
| 634.8 | -0.023 |
| 634.9 | -0.023 |
| 635.0 | -0.023 |
| 635.1 | -0.023 |
| 635.2 | -0.023 |
| 635.3 | -0.023 |
| 635.4 | -0.023 |
| 635.5 | -0.023 |
| 635.6 | -0.023 |
| 635.7 | -0.023 |
| 635.8 | -0.023 |
| 635.9 | -0.023 |
| 636.0 | -0.023 |
| 636.1 | -0.023 |
| 636.2 | -0.023 |
| 636.3 | -0.023 |
| 636.4 | -0.023 |
| 636.5 | -0.023 |
| 636.6 | -0.023 |
| 636.7 | -0.023 |
| 636.8 | -0.023 |
| 636.9 | -0.023 |
| 637.0 | -0.023 |
| 637.1 | -0.023 |
| 637.2 | -0.023 |
| 637.3 | -0.023 |
| 637.4 | -0.023 |
| 637.5 | -0.023 |
| 637.6 | -0.023 |
| 637.7 | -0.023 |
| 637.8 | -0.023 |
| 637.9 | -0.023 |
| 638.0 | -0.023 |
| 638.1 | -0.023 |
| 638.2 | -0.023 |
| 638.3 | -0.023 |
| 638.4 | -0.023 |
| 638.5 | -0.023 |
| 638.6 | -0.023 |
| 638.7 | -0.023 |
| 638.8 | -0.023 |
| 638.9 | -0.023 |
| 639.0 | -0.023 |
| 639.1 | -0.023 |
| 639.2 | -0.023 |
| 639.3 | -0.023 |
| 639.4 | -0.023 |
| 639.5 | -0.023 |
| 639.6 | -0.023 |
| 639.7 | -0.023 |
| 639.8 | -0.023 |
| 639.9 | -0.023 |
| 640.0 | -0.023 |
| 640.1 | -0.023 |
| 640.2 | -0.023 |
| 640.3 | -0.023 |
| 640.4 | -0.023 |
| 640.5 | -0.023 |
| 640.6 | -0.023 |
| 640.7 | -0.023 |
| 640.8 | -0.023 |
| 640.9 | -0.023 |
| 641.0 | -0.023 |
| 641.1 | -0.023 |
| 641.2 | -0.023 |
| 641.3 | -0.023 |
| 641.4 | -0.023 |
| 641.5 | -0.023 |
| 641.6 | -0.023 |
| 641.7 | -0.023 |
| 641.8 | -0.023 |
| 641.9 | -0.023 |
| 642.0 | -0.023 |
| 642.1 | -0.023 |
| 642.2 | -0.023 |
| 642.3 | -0.023 |
| 642.4 | -0.023 |
| 642.5 | -0.023 |
| 642.6 | -0.023 |
| 642.7 | -0.023 |
| 642.8 | -0.023 |
| 642.9 | -0.023 |
| 643.0 | -0.023 |
| 643.1 | -0.023 |
| 643.2 | -0.023 |
| 643.3 | -0.023 |
| 643.4 | -0.023 |
| 643.5 | -0.023 |
| 643.6 | -0.023 |
| 643.7 | -0.023 |
| 643.8 | -0.023 |
| 643.9 | -0.023 |
| 644.0 | -0.023 |
| 644.1 | -0.023 |
| 644.2 | -0.023 |
| 644.3 | -0.023 |
| 644.4 | -0.023 |
| 644.5 | -0.023 |
| 644.6 | -0.023 |
| 644.7 | -0.023 |
| 644.8 | -0.023 |
| 644.9 | -0.023 |
| 645.0 | -0.023 |
| 645.1 | -0.023 |
| 645.2 | -0.023 |
| 645.3 | -0.023 |
| 645.4 | -0.023 |
| 645.5 | -0.023 |
| 645.6 | -0.023 |
| 645.7 | -0.023 |
| 645.8 | -0.023 |
| 645.9 | -0.023 |
| 646.0 | -0.023 |
| 646.1 | -0.023 |
| 646.2 | -0.023 |
| 646.3 | -0.023 |
| 646.4 | -0.023 |
| 646.5 | -0.023 |
| 646.6 | -0.023 |
| 646.7 | -0.023 |
| 646.8 | -0.023 |
| 646.9 | -0.023 |
| 647.0 | -0.023 |
| 647.1 | -0.023 |
| 647.2 | -0.023 |
| 647.3 | -0.023 |
| 647.4 | -0.023 |
| 647.5 | -0.023 |
| 647.6 | -0.023 |
| 647.7 | -0.023 |
| 647.8 | -0.023 |
| 647.9 | -0.023 |
| 648.0 | -0.023 |
| 648.1 | -0.023 |
| 648.2 | -0.023 |
| 648.3 | -0.023 |
| 648.4 | -0.023 |
| 648.5 | -0.023 |
| 648.6 | -0.023 |
| 648.7 | -0.023 |
| 648.8 | -0.023 |
| 648.9 | -0.023 |
| 649.0 | -0.023 |
| 649.1 | -0.023 |
| 649.2 | -0.023 |
| 649.3 | -0.023 |
| 649.4 | -0.023 |
| 649.5 | -0.023 |
| 649.6 | -0.023 |
| 649.7 | -0.023 |
| 649.8 | -0.023 |
| 649.9 | -0.023 |
| 650.0 | -0.023 |
| 650.1 | -0.023 |
| 650.2 | -0.023 |
| 650.3 | -0.023 |
| 650.4 | -0.023 |
| 650.5 | -0.023 |
| 650.6 | -0.023 |
| 650.7 | -0.023 |
| 650.8 | -0.023 |
| 650.9 | -0.023 |
| 651.0 | -0.023 |
| 651.1 | -0.023 |
| 651.2 | -0.023 |
| 651.3 | -0.023 |
| 651.4 | -0.023 |
| 651.5 | -0.023 |
| 651.6 | -0.023 |
| 651.7 | -0.023 |
| 651.8 | -0.023 |
| 651.9 | -0.023 |
| 652.0 | -0.023 |
| 652.1 | -0.023 |
| 652.2 | -0.023 |
| 652.3 | -0.023 |
| 652.4 | -0.023 |
| 652.5 | -0.023 |
| 652.6 | -0.023 |
| 652.7 | -0.023 |
| 652.8 | -0.023 |
| 652.9 | -0.023 |
| 653.0 | -0.023 |
| 653.1 | -0.023 |
| 653.2 | -0.023 |
| 653.3 | -0.023 |
| 653.4 | -0.023 |
| 653.5 | -0.023 |
| 653.6 | -0.023 |
| 653.7 | -0.023 |
| 653.8 | -0.023 |
| 653.9 | -0.023 |
| 654.0 | -0.023 |
| 654.1 | -0.023 |
| 654.2 | -0.023 |
| 654.3 | -0.023 |
| 654.4 | -0.023 |
| 654.5 | -0.023 |
| 654.6 | -0.023 |
| 654.7 | -0.023 |
| 654.8 | -0.023 |
| 654.9 | -0.023 |
| 655.0 | -0.023 |
| 655.1 | -0.023 |
| 655.2 | -0.023 |
| 655.3 | -0.023 |
| 655.4 | -0.023 |
| 655.5 | -0.023 |
| 655.6 | -0.023 |
| 655.7 | -0.023 |
| 655.8 | -0.023 |
| 655.9 | -0.023 |
| 656.0 | -0.023 |
| 656.1 | -0.023 |
| 656.2 | -0.023 |
| 656.3 | -0.023 |
| 656.4 | -0.023 |
| 656.5 | -0.023 |
| 656.6 | -0.023 |
| 656.7 | -0.023 |
| 656.8 | -0.023 |
| 656.9 | -0.023 |
| 657.0 | -0.023 |
| 657.1 | -0.023 |
| 657.2 | -0.023 |
| 657.3 | -0.023 |
| 657.4 | -0.023 |
| 657.5 | -0.023 |
| 657.6 | -0.023 |
| 657.7 | -0.023 |
| 657.8 | -0.023 |
| 657.9 | -0.023 |
| 658.0 | -0.023 |
| 658.1 | -0.023 |
| 658.2 | -0.023 |
| 658.3 | -0.023 |
| 658.4 | -0.023 |
| 658.5 | -0.023 |
| 658.6 | -0.023 |
| 658.7 | -0.023 |
| 658.8 | -0.023 |
| 658.9 | -0.023 |
| 659.0 | -0.023 |
| 659.1 | -0.023 |
| 659.2 | -0.023 |
| 659.3 | -0.023 |
| 659.4 | -0.023 |
| 659.5 | -0.023 |
| 659.6 | -0.023 |
| 659.7 | -0.023 |
| 659.8 | -0.023 |
| 659.9 | -0.023 |
| 660.0 | -0.023 |
| 660.1 | -0.023 |
| 660.2 | -0.023 |
| 660.3 | -0.023 |
| 660.4 | -0.023 |
| 660.5 | -0.023 |
| 660.6 | -0.023 |
| 660.7 | -0.023 |
| 660.8 | -0.023 |
| 660.9 | -0.023 |
| 661.0 | -0.023 |
| 661.1 | -0.023 |
| 661.2 | -0.023 |
| 661.3 | -0.023 |
| 661.4 | -0.023 |
| 661.5 | -0.023 |
| 661.6 | -0.023 |
| 661.7 | -0.023 |
| 661.8 | -0.023 |
| 661.9 | -0.023 |
| 662.0 | -0.023 |
| 662.1 | -0.023 |
| 662.2 | -0.023 |
| 662.3 | -0.023 |
| 662.4 | -0.023 |
| 662.5 | -0.023 |
| 662.6 | -0.023 |
| 662.7 | -0.023 |
| 662.8 | -0.023 |
| 662.9 | -0.023 |
| 663.0 | -0.023 |
| 663.1 | -0.023 |
| 663.2 | -0.023 |
| 663.3 | -0.023 |
| 663.4 | -0.023 |
| 663.5 | -0.023 |
| 663.6 | -0.023 |
| 663.7 | -0.023 |
| 663.8 | -0.023 |
| 663.9 | -0.023 |
| 664.0 | -0.023 |
| 664.1 | -0.023 |
| 664.2 | -0.023 |
| 664.3 | -0.023 |
| 664.4 | -0.023 |
| 664.5 | -0.023 |
| 664.6 | -0.023 |
| 664.7 | -0.023 |
| 664.8 | -0.023 |
| 664.9 | -0.023 |
| 665.0 | -0.023 |
| 665.1 | -0.023 |
| 665.2 | -0.023 |
| 665.3 | -0.023 |
| 665.4 | -0.023 |
| 665.5 | -0.023 |
| 665.6 | -0.023 |
| 665.7 | -0.023 |
| 665.8 | -0.023 |
| 665.9 | -0.023 |
| 666.0 | -0.023 |
| 666.1 | -0.023 |
| 666.2 | -0.023 |
| 666.3 | -0.023 |
| 666.4 | -0.023 |
| 666.5 | -0.023 |
| 666.6 | -0.023 |
| 666.7 | -0.023 |
| 666.8 | -0.023 |
| 666.9 | -0.023 |
| 667.0 | -0.023 |
| 667.1 | -0.023 |
| 667.2 | -0.023 |
| 667.3 | -0.023 |
| 667.4 | -0.023 |
| 667.5 | -0.023 |
| 667.6 | -0.023 |
| 667.7 | -0.023 |
| 667.8 | -0.023 |
| 667.9 | -0.023 |
| 668.0 | -0.023 |
| 668.1 | -0.023 |
| 668.2 | -0.023 |
| 668.3 | -0.023 |
| 668.4 | -0.023 |
| 668.5 | -0.023 |
| 668.6 | -0.023 |
| 668.7 | -0.023 |
| 668.8 | -0.023 |
| 668.9 | -0.023 |
| 669.0 | -0.023 |
| 669.1 | -0.023 |
| 669.2 | -0.023 |
| 669.3 | -0.023 |
| 669.4 | -0.023 |
| 669.5 | -0.023 |
| 669.6 | -0.023 |
| 669.7 | -0.023 |
| 669.8 | -0.023 |
| 669.9 | -0.023 |
| 670.0 | -0.023 |
| 670.1 | -0.023 |
| 670.2 | -0.023 |
| 670.3 | -0.023 |
| 670.4 | -0.023 |
| 670.5 | -0.023 |
| 670.6 | -0.023 |
| 670.7 | -0.023 |
| 670.8 | -0.023 |
| 670.9 | -0.023 |
| 671.0 | -0.023 |
| 671.1 | -0.023 |
| 671.2 | -0.023 |
| 671.3 | -0.023 |
| 671.4 | -0.023 |
| 671.5 | -0.023 |
| 671.6 | -0.023 |
| 671.7 | -0.023 |
| 671.8 | -0.023 |
| 671.9 | -0.023 |
| 672.0 | -0.023 |
| 672.1 | -0.023 |
| 672.2 | -0.023 |
| 672.3 | -0.023 |
| 672.4 | -0.023 |
| 672.5 | -0.023 |
| 672.6 | -0.023 |
| 672.7 | -0.023 |
| 672.8 | -0.023 |
| 672.9 | -0.023 |
| 673.0 | -0.023 |
| 673.1 | -0.023 |
| 673.2 | -0.023 |
| 673.3 | -0.023 |
| 673.4 | -0.023 |
| 673.5 | -0.023 |
| 673.6 | -0.023 |
| 673.7 | -0.023 |
| 673.8 | -0.023 |
| 673.9 | -0.023 |
| 674.0 | -0.023 |
| 674.1 | -0.023 |
| 674.2 | -0.023 |
| 674.3 | -0.023 |
| 674.4 | -0.023 |
| 674.5 | -0.023 |
| 674.6 | -0.023 |
| 674.7 | -0.023 |
| 674.8 | -0.023 |
| 674.9 | -0.023 |
| 675.0 | -0.023 |
| 675.1 | -0.023 |
| 675.2 | -0.023 |
| 675.3 | -0.023 |
| 675.4 | -0.023 |
| 675.5 | -0.023 |
| 675.6 | -0.023 |
| 675.7 | -0.023 |
| 675.8 | -0.023 |
| 675.9 | -0.023 |
| 676.0 | -0.023 |
| 676.1 | -0.023 |
| 676.2 | -0.023 |
| 676.3 | -0.023 |
| 676.4 | -0.023 |
| 676.5 | -0.023 |
| 676.6 | -0.023 |
| 676.7 | -0.023 |
| 676.8 | -0.023 |
| 676.9 | -0.023 |
| 677.0 | -0.023 |
| 677.1 | -0.023 |
| 677.2 | -0.023 |
| 677.3 | -0.023 |
| 677.4 | -0.023 |
| 677.5 | -0.023 |
| 677.6 | -0.023 |
| 677.7 | -0.023 |
| 677.8 | -0.023 |
| 677.9 | -0.023 |
| 678.0 | -0.023 |
| 678.1 | -0.023 |
| 678.2 | -0.023 |
| 678.3 | -0.023 |
| 678.4 | -0.023 |
| 678.5 | -0.023 |
| 678.6 | -0.023 |
| 678.7 | -0.023 |
| 678.8 | -0.023 |
| 678.9 | -0.023 |
| 679.0 | -0.023 |
| 679.1 | -0.023 |
| 679.2 | -0.023 |
| 679.3 | -0.023 |
| 679.4 | -0.023 |
| 679.5 | -0.023 |
| 679.6 | -0.023 |
| 679.7 | -0.023 |
| 679.8 | -0.023 |
| 679.9 | -0.023 |
| 680.0 | -0.023 |
| 680.1 | -0.023 |
| 680.2 | -0.023 |
| 680.3 | -0.023 |
| 680.4 | -0.023 |
| 680.5 | -0.023 |
| 680.6 | -0.023 |
| 680.7 | -0.023 |
| 680.8 | -0.023 |
| 680.9 | -0.023 |
| 681.0 | -0.023 |
| 681.1 | -0.023 |
| 681.2 | -0.023 |
| 681.3 | -0.023 |
| 681.4 | -0.023 |
| 681.5 | -0.023 |
| 681.6 | -0.023 |
| 681.7 | -0.023 |
| 681.8 | -0.023 |
| 681.9 | -0.023 |
| 682.0 | -0.023 |
| 682.1 | -0.023 |
| 682.2 | -0.023 |
| 682.3 | -0.023 |
| 682.4 | -0.023 |
| 682.5 | -0.023 |
| 682.6 | -0.023 |
| 682.7 | -0.023 |
| 682.8 | -0.023 |
| 682.9 | -0.023 |
| 683.0 | -0.023 |
| 683.1 | -0.023 |
| 683.2 | -0.023 |
| 683.3 | -0.023 |
| 683.4 | -0.023 |
| 683.5 | -0.023 |
| 683.6 | -0.023 |
| 683.7 | -0.023 |
| 683.8 | -0.023 |
| 683.9 | -0.023 |
| 684.0 | -0.023 |
| 684.1 | -0.023 |
| 684.2 | -0.023 |
| 684.3 | -0.023 |
| 684.4 | -0.023 |
| 684.5 | -0.023 |
| 684.6 | -0.023 |
| 684.7 | -0.023 |
| 684.8 | -0.023 |
| 684.9 | -0.023 |
| 685.0 | -0.023 |
| 685.1 | -0.023 |
| 685.2 | -0.023 |
| 685.3 | -0.023 |
| 685.4 | -0.023 |
| 685.5 | -0.023 |
| 685.6 | -0.023 |
| 685.7 | -0.023 |
| 685.8 | -0.023 |
| 685.9 | -0.023 |
| 686.0 | -0.023 |
| 686.1 | -0.023 |
| 686.2 | -0.023 |
| 686.3 | -0.023 |
| 686.4 | -0.023 |
| 686.5 | -0.023 |
| 686.6 | -0.023 |
| 686.7 | -0.023 |
| 686.8 | -0.023 |
| 686.9 | -0.023 |
| 687.0 | -0.023 |
| 687.1 | -0.023 |
| 687.2 | -0.023 |
| 687.3 | -0.023 |
| 687.4 | -0.023 |
| 687.5 | -0.023 |
| 687.6 | -0.023 |
| 687.7 | -0.023 |
| 687.8 | -0.023 |
| 687.9 | -0.023 |
| 688.0 | -0.023 |
| 688.1 | -0.023 |
| 688.2 | -0.023 |
| 688.3 | -0.023 |
| 688.4 | -0.023 |
| 688.5 | -0.023 |
| 688.6 | -0.023 |
| 688.7 | -0.023 |
| 688.8 | -0.023 |
| 688.9 | -0.023 |
| 689.0 | -0.023 |
| 689.1 | -0.023 |
| 689.2 | -0.023 |
| 689.3 | -0.023 |
| 689.4 | -0.023 |
| 689.5 | -0.023 |
| 689.6 | -0.023 |
| 689.7 | -0.023 |
| 689.8 | -0.023 |
| 689.9 | -0.023 |
| 690.0 | -0.023 |
| 690.1 | -0.023 |
| 690.2 | -0.023 |
| 690.3 | -0.023 |
| 690.4 | -0.023 |
| 690.5 | -0.023 |
| 690.6 | -0.023 |
| 690.7 | -0.023 |
| 690.8 | -0.023 |
| 690.9 | -0.023 |
| 691.0 | -0.023 |
| 691.1 | -0.023 |
| 691.2 | -0.023 |
| 691.3 | -0.023 |
| 691.4 | -0.023 |
| 691.5 | -0.023 |
| 691.6 | -0.023 |
| 691.7 | -0.023 |
| 691.8 | -0.023 |
| 691.9 | -0.023 |
| 692.0 | -0.023 |
| 692.1 | -0.023 |
| 692.2 | -0.023 |
| 692.3 | -0.023 |
| 692.4 | -0.023 |
| 692.5 | -0.023 |
| 692.6 | -0.023 |
| 692.7 | -0.023 |
| 692.8 | -0.023 |
| 692.9 | -0.023 |
| 693.0 | -0.023 |
| 693.1 | -0.023 |
| 693.2 | -0.023 |
| 693.3 | -0.023 |
| 693.4 | -0.023 |
| 693.5 | -0.023 |
| 693.6 | -0.023 |
| 693.7 | -0.023 |
| 693.8 | -0.023 |
| 693.9 | -0.023 |
| 694.0 | -0.023 |
| 694.1 | -0.023 |
| 694.2 | -0.023 |
| 694.3 | -0.023 |
| 694.4 | -0.023 |
| 694.5 | -0.023 |
| 694.6 | -0.023 |
| 694.7 | -0.023 |
| 694.8 | -0.023 |
| 694.9 | -0.023 |
| 695.0 | -0.023 |
| 695.1 | -0.023 |
| 695.2 | -0.023 |
| 695.3 | -0.023 |
| 695.4 | -0.023 |
| 695.5 | -0.023 |
| 695.6 | -0.023 |
| 695.7 | -0.023 |
| 695.8 | -0.023 |
| 695.9 | -0.023 |
| 696.0 | -0.023 |
| 696.1 | -0.023 |
| 696.2 | -0.023 |
| 696.3 | -0.023 |
| 696.4 | -0.023 |
| 696.5 | -0.023 |
| 696.6 | -0.023 |
| 696.7 | -0.023 |
| 696.8 | -0.023 |
| 696.9 | -0.023 |
| 697.0 | -0.023 |
| 697.1 | -0.023 |
| 697.2 | -0.023 |
| 697.3 | -0.023 |
| 697.4 | -0.023 |
| 697.5 | -0.023 |
| 697.6 | -0.023 |
| 697.7 | -0.023 |
| 697.8 | -0.023 |
| 697.9 | -0.023 |
| 698.0 | -0.023 |
| 698.1 | -0.023 |
| 698.2 | -0.023 |
| 698.3 | -0.023 |
| 698.4 | -0.023 |
| 698.5 | -0.023 |
| 698.6 | -0.023 |
| 698.7 | -0.023 |
| 698.8 | -0.023 |
| 698.9 | -0.023 |
| 699.0 | -0.023 |
| 699.1 | -0.023 |
| 699.2 | -0.023 |
| 699.3 | -0.023 |
| 699.4 | -0.023 |
| 699.5 | -0.023 |
| 699.6 | -0.023 |
| 699.7 | -0.023 |
| 699.8 | -0.023 |
| 699.9 | -0.023 |
| 700.0 | -0.023 |
| 700.1 | -0.023 |
| 700.2 | -0.023 |
| 700.3 | -0.023 |
| 700.4 | -0.023 |
| 700.5 | -0.023 |
| 700.6 | -0.023 |
| 700.7 | -0.023 |
| 700.8 | -0.023 |
| 700.9 | -0.023 |
| 701.0 | -0.023 |
| 701.1 | -0.023 |
| 701.2 | -0.023 |
| 701.3 | -0.023 |
| 701.4 | -0.023 |
| 701.5 | -0.023 |
| 701.6 | -0.023 |
| 701.7 | -0.023 |
| 701.8 | -0.023 |
| 701.9 | -0.023 |
| 702.0 | -0.023 |
| 702.1 | -0.023 |
| 702.2 | -0.023 |
| 702.3 | -0.023 |
| 702.4 | -0.023 |
| 702.5 | -0.023 |
| 702.6 | -0.023 |
| 702.7 | -0.023 |
| 702.8 | -0.023 |
| 702.9 | -0.023 |
| 703.0 | -0.023 |
| 703.1 | -0.023 |
| 703.2 | -0.023 |
| 703.3 | -0.023 |
| 703.4 | -0.023 |
| 703.5 | -0.023 |
| 703.6 | -0.023 |
| 703.7 | -0.023 |
| 703.8 | -0.023 |
| 703.9 | -0.023 |
| 704.0 | -0.023 |
| 704.1 | -0.023 |
| 704.2 | -0.023 |
| 704.3 | -0.023 |
| 704.4 | -0.023 |
| 704.5 | -0.023 |
| 704.6 | -0.023 |
| 704.7 | -0.023 |
| 704.8 | -0.023 |
| 704.9 | -0.023 |
| 705.0 | -0.023 |
| 705.1 | -0.023 |
| 705.2 | -0.023 |
| 705.3 | -0.023 |
| 705.4 | -0.023 |
| 705.5 | -0.023 |
| 705.6 | -0.023 |
| 705.7 | -0.023 |
| 705.8 | -0.023 |
| 705.9 | -0.023 |
| 706.0 | -0.023 |
| 706.1 | -0.023 |
| 706.2 | -0.023 |
| 706.3 | -0.023 |
| 706.4 | -0.023 |
| 706.5 | -0.023 |
| 706.6 | -0.023 |
| 706.7 | -0.023 |
| 706.8 | -0.023 |
| 706.9 | -0.023 |
| 707.0 | -0.023 |
| 707.1 | -0.023 |
| 707.2 | -0.023 |
| 707.3 | -0.023 |
| 707.4 | -0.023 |
| 707.5 | -0.023 |
| 707.6 | -0.023 |
| 707.7 | -0.023 |
| 707.8 | -0.023 |
| 707.9 | -0.023 |
| 708.0 | -0.023 |
| 708.1 | -0.023 |
| 708.2 | -0.023 |
| 708.3 | -0.023 |
| 708.4 | -0.023 |
| 708.5 | -0.023 |
| 708.6 | -0.023 |
| 708.7 | -0.023 |
| 708.8 | -0.023 |
| 708.9 | -0.023 |
| 709.0 | -0.023 |
| 709.1 | -0.023 |
| 709.2 | -0.023 |
| 709.3 | -0.023 |
| 709.4 | -0.023 |
| 709.5 | -0.023 |
| 709.6 | -0.023 |
| 709.7 | -0.023 |
| 709.8 | -0.023 |
| 709.9 | -0.023 |
| 710.0 | -0.023 |
| 710.1 | -0.023 |
| 710.2 | -0.023 |
| 710.3 | -0.023 |
| 710.4 | -0.023 |
| 710.5 | -0.023 |
| 710.6 | -0.023 |
| 710.7 | -0.023 |
| 710.8 | -0.023 |
| 710.9 | -0.023 |
| 711.0 | -0.023 |
| 711.1 | -0.023 |
| 711.2 | -0.023 |
| 711.3 | -0.023 |
| 711.4 | -0.023 |
| 711.5 | -0.023 |
| 711.6 | -0.023 |
| 711.7 | -0.023 |
| 711.8 | -0.023 |
| 711.9 | -0.023 |
| 712.0 | -0.023 |
| 712.1 | -0.023 |
| 712.2 | -0.023 |
| 712.3 | -0.023 |
| 712.4 | -0.023 |
| 712.5 | -0.023 |
| 712.6 | -0.023 |
| 712.7 | -0.023 |
| 712.8 | -0.023 |
| 712.9 | -0.023 |
| 713.0 | -0.023 |
| 713.1 | -0.023 |
| 713.2 | -0.023 |
| 713.3 | -0.023 |
| 713.4 | -0.023 |
| 713.5 | -0.023 |
| 713.6 | -0.023 |
| 713.7 | -0.023 |
| 713.8 | -0.023 |
| 713.9 | -0.023 |
| 714.0 | -0.023 |
| 714.1 | -0.023 |
| 714.2 | -0.023 |
| 714.3 | -0.023 |
| 714.4 | -0.023 |
| 714.5 | -0.023 |
| 714.6 | -0.023 |
| 714.7 | -0.023 |
| 714.8 | -0.023 |
| 714.9 | -0.023 |
| 715.0 | -0.023 |
| 715.1 | -0.023 |
| 715.2 | -0.023 |
| 715.3 | -0.023 |
| 715.4 | -0.023 |
| 715.5 | -0.023 |
| 715.6 | -0.023 |
| 715.7 | -0.023 |
| 715.8 | -0.023 |
| 715.9 | -0.023 |
| 716.0 | -0.023 |
| 716.1 | -0.023 |
| 716.2 | -0.023 |
| 716.3 | -0.023 |
| 716.4 | -0.023 |
| 716.5 | -0.023 |
| 716.6 | -0.023 |
| 716.7 | -0.023 |
| 716.8 | -0.023 |
| 716.9 | -0.023 |
| 717.0 | -0.023 |
| 717.1 | -0.023 |
| 717.2 | -0.023 |
| 717.3 | -0.023 |
| 717.4 | -0.023 |
| 717.5 | -0.023 |
| 717.6 | -0.023 |
| 717.7 | -0.023 |
| 717.8 | -0.023 |
| 717.9 | -0.023 |
| 718.0 | -0.023 |
| 718.1 | -0.023 |
| 718.2 | -0.023 |
| 718.3 | -0.023 |
| 718.4 | -0.023 |
| 718.5 | -0.023 |
| 718.6 | -0.023 |
| 718.7 | -0.023 |
| 718.8 | -0.023 |
| 718.9 | -0.023 |
| 719.0 | -0.023 |
| 719.1 | -0.023 |
| 719.2 | -0.023 |
| 719.3 | -0.023 |
| 719.4 | -0.023 |
| 719.5 | -0.023 |
| 719.6 | -0.023 |
| 719.7 | -0.023 |
| 719.8 | -0.023 |
| 719.9 | -0.023 |
| 720.0 | -0.023 |
| 720.1 | -0.023 |
| 720.2 | -0.023 |
| 720.3 | -0.023 |
| 720.4 | -0.023 |
| 720.5 | -0.023 |
| 720.6 | -0.023 |
| 720.7 | -0.023 |
| 720.8 | -0.023 |
| 720.9 | -0.023 |
| 721.0 | -0.023 |
| 721.1 | -0.023 |
| 721.2 | -0.023 |
| 721.3 | -0.023 |
| 721.4 | -0.023 |
| 721.5 | -0.023 |
| 721.6 | -0.023 |
| 721.7 | -0.023 |
| 721.8 | -0.023 |
| 721.9 | -0.023 |
| 722.0 | -0.023 |
| 722.1 | -0.023 |
| 722.2 | -0.023 |
| 722.3 | -0.023 |
| 722.4 | -0.023 |
| 722.5 | -0.023 |
| 722.6 | -0.023 |
| 722.7 | -0.023 |
| 722.8 | -0.023 |
| 722.9 | -0.023 |
| 723.0 | -0.023 |
| 723.1 | -0.023 |
| 723.2 | -0.023 |
| 723.3 | -0.023 |
| 723.4 | -0.023 |
| 723.5 | -0.023 |
| 723.6 | -0.023 |
| 723.7 | -0.023 |
| 723.8 | -0.023 |
| 723.9 | -0.023 |
| 724.0 | -0.023 |
| 724.1 | -0.023 |
| 724.2 | -0.023 |
| 724.3 | -0.023 |
| 724.4 | -0.023 |
| 724.5 | -0.023 |
| 724.6 | -0.023 |
| 724.7 | -0.023 |
| 724.8 | -0.023 |
| 724.9 | -0.023 |
| 725.0 | -0.023 |
| 725.1 | -0.023 |
| 725.2 | -0.023 |
| 725.3 | -0.023 |
| 725.4 | -0.023 |
| 725.5 | -0.023 |
| 725.6 | -0.023 |
| 725.7 | -0.023 |
| 725.8 | -0.023 |
| 725.9 | -0.023 |
| 726.0 | -0.023 |
| 726.1 | -0.023 |
| 726.2 | -0.023 |
| 726.3 | -0.023 |
| 726.4 | -0.023 |
| 726.5 | -0.023 |
| 726.6 | -0.023 |
| 726.7 | -0.023 |
| 726.8 | -0.023 |
| 726.9 | -0.023 |
| 727.0 | -0.023 |
| 727.1 | -0.023 |
| 727.2 | -0.023 |
| 727.3 | -0.023 |
| 727.4 | -0.023 |
| 727.5 | -0.023 |
| 727.6 | -0.023 |
| 727.7 | -0.023 |
| 727.8 | -0.023 |
| 727.9 | -0.023 |
| 728.0 | -0.023 |
| 728.1 | -0.023 |
| 728.2 | -0.023 |
| 728.3 | -0.023 |
| 728.4 | -0.023 |
| 728.5 | -0.023 |
| 728.6 | -0.023 |
| 728.7 | -0.023 |
| 728.8 | -0.023 |
| 728.9 | -0.023 |
| 729.0 | -0.023 |
| 729.1 | -0.023 |
| 729.2 | -0.023 |
| 729.3 | -0.023 |
| 729.4 | -0.023 |
| 729.5 | -0.023 |
| 729.6 | -0.023 |
| 729.7 | -0.023 |
| 729.8 | -0.023 |
| 729.9 | -0.023 |
| 730.0 | -0.023 |
| 730.1 | -0.023 |
| 730.2 | -0.023 |
| 730.3 | -0.023 |
| 730.4 | -0.023 |
| 730.5 | -0.023 |
| 730.6 | -0.023 |
| 730.7 | -0.023 |
| 730.8 | -0.023 |
| 730.9 | -0.023 |
| 731.0 | -0.023 |
| 731.1 | -0.023 |
| 731.2 | -0.023 |
| 731.3 | -0.023 |
| 731.4 | -0.023 |
| 731.5 | -0.023 |
| 731.6 | -0.023 |
| 731.7 | -0.023 |
| 731.8 | -0.023 |
| 731.9 | -0.023 |
| 732.0 | -0.023 |
| 732.1 | -0.023 |
| 732.2 | -0.023 |
| 732.3 | -0.023 |
| 732.4 | -0.023 |
| 732.5 | -0.023 |
| 732.6 | -0.023 |
| 732.7 | -0.023 |
| 732.8 | -0.023 |
| 732.9 | -0.023 |
| 733.0 | -0.023 |
| 733.1 | -0.023 |
| 733.2 | -0.023 |
| 733.3 | -0.023 |
| 733.4 | -0.023 |
| 733.5 | -0.023 |
| 733.6 | -0.023 |
| 733.7 | -0.023 |
| 733.8 | -0.023 |
| 733.9 | -0.023 |
| 734.0 | -0.023 |
| 734.1 | -0.023 |
| 734.2 | -0.023 |
| 734.3 | -0.023 |
| 734.4 | -0.023 |
| 734.5 | -0.023 |
| 734.6 | -0.023 |
| 734.7 | -0.023 |
| 734.8 | -0.023 |
| 734.9 | -0.023 |
| 735.0 | -0.023 |
| 735.1 | -0.023 |
| 735.2 | -0.023 |
| 735.3 | -0.023 |
| 735.4 | -0.023 |
| 735.5 | -0.023 |
| 735.6 | -0.023 |
| 735.7 | -0.023 |
| 735.8 | -0.023 |
| 735.9 | -0.023 |
| 736.0 | -0.023 |
| 736.1 | -0.023 |
| 736.2 | -0.023 |
| 736.3 | -0.023 |
| 736.4 | -0.023 |
| 736.5 | -0.023 |
| 736.6 | -0.023 |
| 736.7 | -0.023 |
| 736.8 | -0.023 |
| 736.9 | -0.023 |
| 737.0 | -0.023 |
| 737.1 | -0.023 |
| 737.2 | -0.023 |
| 737.3 | -0.023 |
| 737.4 | -0.023 |
| 737.5 | -0.023 |
| 737.6 | -0.023 |
| 737.7 | -0.023 |
| 737.8 | -0.023 |
| 737.9 | -0.023 |
| 738.0 | -0.023 |
| 738.1 | -0.023 |
| 738.2 | -0.023 |
| 738.3 | -0.023 |
| 738.4 | -0.023 |
| 738.5 | -0.023 |
| 738.6 | -0.023 |
| 738.7 | -0.023 |
| 738.8 | -0.023 |
| 738.9 | -0.023 |
| 739.0 | -0.023 |
| 739.1 | -0.023 |
| 739.2 | -0.023 |
| 739.3 | -0.023 |
| 739.4 | -0.023 |
| 739.5 | -0.023 |
| 739.6 | -0.023 |
| 739.7 | -0.023 |
| 739.8 | -0.023 |
| 739.9 | -0.023 |
| 740.0 | -0.023 |
| 740.1 | -0.023 |
| 740.2 | -0.023 |
| 740.3 | -0.023 |
| 740.4 | -0.023 |
| 740.5 | -0.023 |
| 740.6 | -0.023 |
| 740.7 | -0.023 |
| 740.8 | -0.023 |
| 740.9 | -0.023 |
| 741.0 | -0.023 |
| 741.1 | -0.023 |
| 741.2 | -0.023 |
| 741.3 | -0.023 |
| 741.4 | -0.023 |
| 741.5 | -0.023 |
| 741.6 | -0.023 |
| 741.7 | -0.023 |
| 741.8 | -0.023 |
| 741.9 | -0.023 |
| 742.0 | -0.023 |
| 742.1 | -0.023 |
| 742.2 | -0.023 |
| 742.3 | -0.023 |
| 742.4 | -0.023 |
| 742.5 | -0.023 |
| 742.6 | -0.023 |
| 742.7 | -0.023 |
| 742.8 | -0.023 |
| 742.9 | -0.023 |
| 743.0 | -0.023 |
| 743.1 | -0.023 |
| 743.2 | -0.023 |
| 743.3 | -0.023 |
| 743.4 | -0.023 |
| 743.5 | -0.023 |
| 743.6 | -0.023 |
| 743.7 | -0.023 |
| 743.8 | -0.023 |
| 743.9 | -0.023 |
| 744.0 | -0.023 |
| 744.1 | -0.023 |
| 744.2 | -0.023 |
| 744.3 | -0.023 |
| 744.4 | -0.023 |
| 744.5 | -0.023 |
| 744.6 | -0.023 |
| 744.7 | -0.023 |
| 744.8 | -0.023 |
| 744.9 | -0.023 |
| 745.0 | -0.023 |
| 745.1 | -0.023 |
| 745.2 | -0.023 |
| 745.3 | -0.023 |
| 745.4 | -0.023 |
| 745.5 | -0.023 |
| 745.6 | -0.023 |
| 745.7 | -0.023 |
| 745.8 | -0.023 |
| 745.9 | -0.023 |
| 746.0 | -0.023 |
| 746.1 | -0.023 |
| 746.2 | -0.023 |
| 746.3 | -0.023 |
| 746.4 | -0.023 |
| 746.5 | -0.023 |
| 746.6 | -0.023 |
| 746.7 | -0.023 |
| 746.8 | -0.023 |
| 746.9 | -0.023 |
| 747.0 | -0.023 |
| 747.1 | -0.023 |
| 747.2 | -0.023 |
| 747.3 | -0.023 |
| 747.4 | -0.023 |
| 747.5 | -0.023 |
| 747.6 | -0.023 |
| 747.7 | -0.023 |
| 747.8 | -0.023 |
| 747.9 | -0.023 |
| 748.0 | -0.023 |
| 748.1 | -0.023 |
| 748.2 | -0.023 |
| 748.3 | -0.023 |
| 748.4 | -0.023 |
| 748.5 | -0.023 |
| 748.6 | -0.023 |
| 748.7 | -0.023 |
| 748.8 | -0.023 |
| 748.9 | -0.023 |
| 749.0 | -0.023 |
| 749.1 | -0.023 |
| 749.2 | -0.023 |
| 749.3 | -0.023 |
| 749.4 | -0.023 |
| 749.5 | -0.023 |
| 749.6 | -0.023 |
| 749.7 | -0.023 |
| 749.8 | -0.023 |
| 749.9 | -0.023 |
| 750.0 | -0.023 |
| 750.1 | -0.023 |
| 750.2 | -0.023 |
| 750.3 | -0.023 |
| 750.4 | -0.023 |
| 750.5 | -0.023 |
| 750.6 | -0.023 |
| 750.7 | -0.023 |
| 750.8 | -0.023 |
| 750.9 | -0.023 |
| 751.0 | -0.023 |
| 751.1 | -0.023 |
| 751.2 | -0.023 |
| 751.3 | -0.023 |
| 751.4 | -0.023 |
| 751.5 | -0.023 |
| 751.6 | -0.023 |
| 751.7 | -0.023 |
| 751.8 | -0.023 |
| 751.9 | -0.023 |
| 752.0 | -0.023 |
| 752.1 | -0.023 |
| 752.2 | -0.023 |
| 752.3 | -0.023 |
| 752.4 | -0.023 |
| 752.5 | -0.023 |
| 752.6 | -0.023 |
| 752.7 | -0.023 |
| 752.8 | -0.023 |
| 752.9 | -0.023 |
| 753.0 | -0.023 |
| 753.1 | -0.023 |
| 753.2 | -0.023 |
| 753.3 | -0.023 |
| 753.4 | -0.023 |
| 753.5 | -0.023 |
| 753.6 | -0.023 |
| 753.7 | -0.023 |
| 753.8 | -0.023 |
| 753.9 | -0.023 |
| 754.0 | -0.023 |
| 754.1 | -0.023 |
| 754.2 | -0.023 |
| 754.3 | -0.023 |
| 754.4 | -0.023 |
| 754.5 | -0.023 |
| 754.6 | -0.023 |
| 754.7 | -0.023 |
| 754.8 | -0.023 |
| 754.9 | -0.023 |
| 755.0 | -0.023 |
| 755.1 | -0.023 |
| 755.2 | -0.023 |
| 755.3 | -0.023 |
| 755.4 | -0.023 |
| 755.5 | -0.023 |
| 755.6 | -0.023 |
| 755.7 | -0.023 |
| 755.8 | -0.023 |
| 755.9 | -0.023 |
| 756.0 | -0.023 |
| 756.1 | -0.023 |
| 756.2 | -0.023 |
| 756.3 | -0.023 |
| 756.4 | -0.023 |
| 756.5 | -0.023 |
| 756.6 | -0.023 |
| 756.7 | -0.023 |
| 756.8 | -0.023 |
| 756.9 | -0.023 |
| 757.0 | -0.023 |
| 757.1 | -0.023 |
| 757.2 | -0.023 |
| 757.3 | -0.023 |
| 757.4 | -0.023 |
| 757.5 | -0.023 |
| 757.6 | -0.023 |
| 757.7 | -0.023 |
| 757.8 | -0.023 |
| 757.9 | -0.023 |
| 758.0 | -0.023 |
| 758.1 | -0.023 |
| 758.2 | -0.023 |
| 758.3 | -0.023 |
| 758.4 | -0.023 |
| 758.5 | -0.023 |
| 758.6 | -0.023 |
| 758.7 | -0.023 |
| 758.8 | -0.023 |
| 758.9 | -0.023 |
| 759.0 | -0.023 |
| 759.1 | -0.023 |
| 759.2 | -0.023 |
| 759.3 | -0.023 |
| 759.4 | -0.023 |
| 759.5 | -0.023 |
| 759.6 | -0.023 |
| 759.7 | -0.023 |
| 759.8 | -0.023 |
| 759.9 | -0.023 |
| 760.0 | -0.023 |
| 760.1 | -0.023 |
| 760.2 | -0.023 |
| 760.3 | -0.023 |
| 760.4 | -0.023 |
| 760.5 | -0.023 |
| 760.6 | -0.023 |
| 760.7 | -0.023 |
| 760.8 | -0.023 |
| 760.9 | -0.023 |
| 761.0 | -0.023 |
| 761.1 | -0.023 |
| 761.2 | -0.023 |
| 761.3 | -0.023 |
| 761.4 | -0.023 |
| 761.5 | -0.023 |
| 761.6 | -0.023 |
| 761.7 | -0.023 |
| 761.8 | -0.023 |
| 761.9 | -0.023 |
| 762.0 | -0.023 |
| 762.1 | -0.023 |
| 762.2 | -0.023 |
| 762.3 | -0.023 |
| 762.4 | -0.023 |
| 762.5 | -0.023 |
| 762.6 | -0.023 |
| 762.7 | -0.023 |
| 762.8 | -0.023 |
| 762.9 | -0.023 |
| 763.0 | -0.023 |
| 763.1 | -0.023 |
| 763.2 | -0.023 |
| 763.3 | -0.023 |
| 763.4 | -0.023 |
| 763.5 | -0.023 |
| 763.6 | -0.023 |
| 763.7 | -0.023 |
| 763.8 | -0.023 |
| 763.9 | -0.023 |
| 764.0 | -0.023 |
| 764.1 | -0.023 |
| 764.2 | -0.023 |
| 764.3 | -0.023 |
| 764.4 | -0.023 |
| 764.5 | -0.023 |
| 764.6 | -0.023 |
| 764.7 | -0.023 |
| 764.8 | -0.023 |
| 764.9 | -0.023 |
| 765.0 | -0.023 |
| 765.1 | -0.023 |
| 765.2 | -0.023 |
| 765.3 | -0.023 |
| 765.4 | -0.023 |
| 765.5 | -0.023 |
| 765.6 | -0.023 |
| 765.7 | -0.023 |
| 765.8 | -0.023 |
| 765.9 | -0.023 |
| 766.0 | -0.023 |
| 766.1 | -0.023 |
| 766.2 | -0.023 |
| 766.3 | -0.023 |
| 766.4 | -0.023 |
| 766.5 | -0.023 |
| 766.6 | -0.023 |
| 766.7 | -0.023 |
| 766.8 | -0.023 |
| 766.9 | -0.023 |
| 767.0 | -0.023 |
| 767.1 | -0.023 |
| 767.2 | -0.023 |
| 767.3 | -0.023 |
| 767.4 | -0.023 |
| 767.5 | -0.023 |
| 767.6 | -0.023 |
| 767.7 | -0.023 |
| 767.8 | -0.023 |
| 767.9 | -0.023 |
| 768.0 | -0.023 |
| 768.1 | -0.023 |
| 768.2 | -0.023 |
| 768.3 | -0.023 |
| 768.4 | -0.023 |
| 768.5 | -0.023 |
| 768.6 | -0.023 |
| 768.7 | -0.023 |
| 768.8 | -0.023 |
| 768.9 | -0.023 |
| 769.0 | -0.023 |
| 769.1 | -0.023 |
| 769.2 | -0.023 |
| 769.3 | -0.023 |
| 769.4 | -0.023 |
| 769.5 | -0.023 |
| 769.6 | -0.023 |
| 769.7 | -0.023 |
| 769.8 | -0.023 |
| 769.9 | -0.023 |
| 770.0 | -0.023 |
| 770.1 | -0.023 |
| 770.2 | -0.023 |
| 770.3 | -0.023 |
| 770.4 | -0.023 |
| 770.5 | -0.023 |
| 770.6 | -0.023 |
| 770.7 | -0.023 |
| 770.8 | -0.023 |
| 770.9 | -0.023 |
| 771.0 | -0.023 |
| 771.1 | -0.023 |
| 771.2 | -0.023 |
| 771.3 | -0.023 |
| 771.4 | -0.023 |
| 771.5 | -0.023 |
| 771.6 | -0.023 |
| 771.7 | -0.023 |
| 771.8 | -0.023 |
| 771.9 | -0.023 |
| 772.0 | -0.023 |
| 772.1 | -0.023 |
| 772.2 | -0.023 |
| 772.3 | -0.023 |
| 772.4 | -0.023 |
| 772.5 | -0.023 |
| 772.6 | -0.023 |
| 772.7 | -0.023 |
| 772.8 | -0.023 |
| 772.9 | -0.023 |
| 773.0 | -0.023 |
| 773.1 | -0.023 |
| 773.2 | -0.023 |
| 773.3 | -0.023 |
| 773.4 | -0.023 |
| 773.5 | -0.023 |
| 773.6 | -0.023 |
| 773.7 | -0.023 |
| 773.8 | -0.023 |
| 773.9 | -0.023 |
| 774.0 | -0.023 |
| 774.1 | -0.023 |
| 774.2 | -0.023 |
| 774.3 | -0.023 |
| 774.4 | -0.023 |
| 774.5 | -0.023 |
| 774.6 | -0.023 |
| 774.7 | -0.023 |
| 774.8 | -0.023 |
| 774.9 | -0.023 |
| 775.0 | -0.023 |
| 775.1 | -0.023 |
| 775.2 | -0.023 |
| 775.3 | -0.023 |
| 775.4 | -0.023 |
| 775.5 | -0.023 |
| 775.6 | -0.023 |
| 775.7 | -0.023 |
| 775.8 | -0.023 |
| 775.9 | -0.023 |
| 776.0 | -0.023 |
| 776.1 | -0.023 |
| 776.2 | -0.023 |
| 776.3 | -0.023 |
| 776.4 | -0.023 |
| 776.5 | -0.023 |
| 776.6 | -0.023 |
| 776.7 | -0.023 |
| 776.8 | -0.023 |
| 776.9 | -0.023 |
| 777.0 | -0.023 |
| 777.1 | -0.023 |
| 777.2 | -0.023 |
| 777.3 | -0.023 |
| 777.4 | -0.023 |
| 777.5 | -0.023 |
| 777.6 | -0.023 |
| 777.7 | -0.023 |
| 777.8 | -0.023 |
| 777.9 | -0.023 |
| 778.0 | -0.023 |
| 778.1 | -0.023 |
| 778.2 | -0.023 |
| 778.3 | -0.023 |
| 778.4 | -0.023 |
| 778.5 | -0.023 |
| 778.6 | -0.023 |
| 778.7 | -0.023 |
| 778.8 | -0.023 |
| 778.9 | -0.023 |
| 779.0 | -0.023 |
| 779.1 | -0.023 |
| 779.2 | -0.023 |
| 779.3 | -0.023 |
| 779.4 | -0.023 |
| 779.5 | -0.023 |
| 779.6 | -0.023 |
| 779.7 | -0.023 |
| 779.8 | -0.023 |
| 779.9 | -0.023 |
| 780.0 | -0.023 |
| 780.1 | -0.023 |
| 780.2 | -0.023 |
| 780.3 | -0.023 |
| 780.4 | -0.023 |
| 780.5 | -0.023 |
| 780.6 | -0.023 |
| 780.7 | -0.023 |
| 780.8 | -0.023 |
| 780.9 | -0.023 |
| 781.0 | -0.023 |
| 781.1 | -0.023 |
| 781.2 | -0.023 |
| 781.3 | -0.023 |
| 781.4 | -0.023 |
| 781.5 | -0.023 |
| 781.6 | -0.023 |
| 781.7 | -0.023 |
| 781.8 | -0.023 |
| 781.9 | -0.023 |
| 782.0 | -0.023 |
| 782.1 | -0.023 |
| 782.2 | -0.023 |
| 782.3 | -0.023 |
| 782.4 | -0.023 |
| 782.5 | -0.023 |
| 782.6 | -0.023 |
| 782.7 | -0.023 |
| 782.8 | -0.023 |
| 782.9 | -0.023 |
| 783.0 | -0.023 |
| 783.1 | -0.023 |
| 783.2 | -0.023 |
| 783.3 | -0.023 |
| 783.4 | -0.023 |
| 783.5 | -0.023 |
| 783.6 | -0.023 |
| 783.7 | -0.023 |
| 783.8 | -0.023 |
| 783.9 | -0.023 |
| 784.0 | -0.023 |
| 784.1 | -0.023 |
| 784.2 | -0.023 |
| 784.3 | -0.023 |
| 784.4 | -0.023 |
| 784.5 | -0.023 |
| 784.6 | -0.023 |
| 784.7 | -0.023 |
| 784.8 | -0.023 |
| 784.9 | -0.023 |
| 785.0 | -0.023 |
| 785.1 | -0.023 |
| 785.2 | -0.023 |
| 785.3 | -0.023 |
| 785.4 | -0.023 |
| 785.5 | -0.023 |
| 785.6 | -0.023 |
| 785.7 | -0.023 |
| 785.8 | -0.023 |
| 785.9 | -0.023 |
| 786.0 | -0.023 |
| 786.1 | -0.023 |
| 786.2 | -0.023 |
| 786.3 | -0.023 |
| 786.4 | -0.023 |
| 786.5 | -0.023 |
| 786.6 | -0.023 |
| 786.7 | -0.023 |
| 786.8 | -0.023 |
| 786.9 | -0.023 |
| 787.0 | -0.023 |
| 787.1 | -0.023 |
| 787.2 | -0.023 |
| 787.3 | -0.023 |
| 787.4 | -0.023 |
| 787.5 | -0.023 |
| 787.6 | -0.023 |
| 787.7 | -0.023 |
| 787.8 | -0.023 |
| 787.9 | -0.023 |
| 788.0 | -0.023 |
| 788.1 | -0.023 |
| 788.2 | -0.023 |
| 788.3 | -0.023 |
| 788.4 | -0.023 |
| 788.5 | -0.023 |
| 788.6 | -0.023 |
| 788.7 | -0.023 |
| 788.8 | -0.023 |
| 788.9 | -0.023 |
| 789.0 | -0.023 |
| 789.1 | -0.023 |
| 789.2 | -0.023 |
| 789.3 | -0.023 |
| 789.4 | -0.023 |
| 789.5 | -0.023 |
| 789.6 | -0.023 |
| 789.7 | -0.023 |
| 789.8 | -0.023 |
| 789.9 | -0.023 |
| 790.0 | -0.023 |
| 790.1 | -0.023 |
| 790.2 | -0.023 |
| 790.3 | -0.023 |
| 790.4 | -0.023 |
| 790.5 | -0.023 |
| 790.6 | -0.023 |
| 790.7 | -0.023 |
| 790.8 | -0.023 |
| 790.9 | -0.023 |
| 791.0 | -0.023 |
| 791.1 | -0.023 |
| 791.2 | -0.023 |
| 791.3 | -0.023 |
| 791.4 | -0.023 |
| 791.5 | -0.023 |
| 791.6 | -0.023 |
| 791.7 | -0.023 |
| 791.8 | -0.023 |
| 791.9 | -0.023 |
| 792.0 | -0.023 |
| 792.1 | -0.023 |
| 792.2 | -0.023 |
| 792.3 | -0.023 |
| 792.4 | -0.023 |
| 792.5 | -0.023 |
| 792.6 | -0.023 |
| 792.7 | -0.023 |
| 792.8 | -0.023 |
| 792.9 | -0.023 |
| 793.0 | -0.023 |
| 793.1 | -0.023 |
| 793.2 | -0.023 |
| 793.3 | -0.023 |
| 793.4 | -0.023 |
| 793.5 | -0.023 |
| 793.6 | -0.023 |
| 793.7 | -0.023 |
| 793.8 | -0.023 |
| 793.9 | -0.023 |
| 794.0 | -0.023 |
| 794.1 | -0.023 |
| 794.2 | -0.023 |
| 794.3 | -0.023 |
| 794.4 | -0.023 |
| 794.5 | -0.023 |
| 794.6 | -0.023 |
| 794.7 | -0.023 |
| 794.8 | -0.023 |
| 794.9 | -0.023 |
| 795.0 | -0.023 |
| 795.1 | -0.023 |
| 795.2 | -0.023 |
| 795.3 | -0.023 |
| 795.4 | -0.023 |
| 795.5 | -0.023 |
| 795.6 | -0.023 |
| 795.7 | -0.023 |
| 795.8 | -0.023 |
| 795.9 | -0.023 |
| 796.0 | -0.023 |
| 796.1 | -0.023 |
| 796.2 | -0.023 |
| 796.3 | -0.023 |
| 796.4 | -0.023 |
| 796.5 | -0.023 |
| 796.6 | -0.023 |
| 796.7 | -0.023 |
| 796.8 | -0.023 |
| 796.9 | -0.023 |
| 797.0 | -0.023 |
| 797.1 | -0.023 |
| 797.2 | -0.023 |
| 797.3 | -0.023 |
| 797.4 | -0.023 |
| 797.5 | -0.023 |
| 797.6 | -0.023 |
| 797.7 | -0.023 |
| 797.8 | -0.023 |
| 797.9 | -0.023 |
| 798.0 | -0.023 |
| 798.1 | -0.023 |
| 798.2 | -0.023 |
| 798.3 | -0.023 |
| 798.4 | -0.023 |
| 798.5 | -0.023 |
| 798.6 | -0.023 |
| 798.7 | -0.023 |
| 798.8 | -0.023 |
| 798.9 | -0.023 |
| 799.0 | -0.023 |
| 799.1 | -0.023 |
| 799.2 | -0.023 |
| 799.3 | -0.023 |
| 799.4 | -0.023 |
| 799.5 | -0.023 |
| 799.6 | -0.023 |
| 799.7 | -0.023 |
| 799.8 | -0.023 |
| 799.9 | -0.023 |
| 800.0 | -0.023 |
| 800.1 | -0.023 |
| 800.2 | -0.023 |
| 800.3 | -0.023 |
| 800.4 | -0.023 |
| 800.5 | -0.023 |
| 800.6 | -0.023 |
| 800.7 | -0.023 |
| 800.8 | -0.023 |
| 800.9 | -0.023 |
| 801.0 | -0.023 |
| 801.1 | -0.023 |
| 801.2 | -0.023 |
| 801.3 | -0.023 |
| 801.4 | -0.023 |
| 801.5 | -0.023 |
| 801.6 | -0.023 |
| 801.7 | -0.023 |
| 801.8 | -0.023 |
| 801.9 | -0.023 |
| 802.0 | -0.023 |
| 802.1 | -0.023 |
| 802.2 | -0.023 |
| 802.3 | -0.023 |
| 802.4 | -0.023 |
| 802.5 | -0.023 |
| 802.6 | -0.023 |
| 802.7 | -0.023 |
| 802.8 | -0.023 |
| 802.9 | -0.023 |
| 803.0 | -0.023 |
| 803.1 | -0.023 |
| 803.2 | -0.023 |
| 803.3 | -0.023 |
| 803.4 | -0.023 |
| 803.5 | -0.023 |
| 803.6 | -0.023 |
| 803.7 | -0.023 |
| 803.8 | -0.023 |
| 803.9 | -0.023 |
| 804.0 | -0.023 |
| 804.1 | -0.023 |
| 804.2 | -0.023 |
| 804.3 | -0.023 |
| 804.4 | -0.023 |
| 804.5 | -0.023 |
| 804.6 | -0.023 |
| 804.7 | -0.023 |
| 804.8 | -0.023 |
| 804.9 | -0.023 |
| 805.0 | -0.023 |
| 805.1 | -0.023 |
| 805.2 | -0.023 |
| 805.3 | -0.023 |
| 805.4 | -0.023 |
| 805.5 | -0.023 |
| 805.6 | -0.023 |
| 805.7 | -0.023 |
| 805.8 | -0.023 |
| 805.9 | -0.023 |
| 806.0 | -0.023 |
| 806.1 | -0.023 |
| 806.2 | -0.023 |
| 806.3 | -0.023 |
| 806.4 | -0.023 |
| 806.5 | -0.023 |
| 806.6 | -0.023 |
| 806.7 | -0.023 |
| 806.8 | -0.023 |
| 806.9 | -0.023 |
| 807.0 | -0.023 |
| 807.1 | -0.023 |
| 807.2 | -0.023 |
| 807.3 | -0.023 |
| 807.4 | -0.023 |
| 807.5 | -0.023 |
| 807.6 | -0.023 |
| 807.7 | -0.023 |
| 807.8 | -0.023 |
| 807.9 | -0.023 |
| 808.0 | -0.023 |
| 808.1 | -0.023 |
| 808.2 | -0.023 |
| 808.3 | -0.023 |
| 808.4 | -0.023 |
| 808.5 | -0.023 |
| 808.6 | -0.023 |
| 808.7 | -0.023 |
| 808.8 | -0.023 |
| 808.9 | -0.023 |
| 809.0 | -0.023 |
| 809.1 | -0.023 |
| 809.2 | -0.023 |
| 809.3 | -0.023 |
| 809.4 | -0.023 |
| 809.5 | -0.023 |
| 809.6 | -0.023 |
| 809.7 | -0.023 |
| 809.8 | -0.023 |
| 809.9 | -0.023 |
| 810.0 | -0.023 |
| 810.1 | -0.023 |
| 810.2 | -0.023 |
| 810.3 | -0.023 |
| 810.4 | -0.023 |
| 810.5 | -0.023 |
| 810.6 | -0.023 |
| 810.7 | -0.023 |
| 810.8 | -0.023 |
| 810.9 | -0.023 |
| 811.0 | -0.023 |
| 811.1 | -0.023 |
| 811.2 | -0.023 |
| 811.3 | -0.023 |
| 811.4 | -0.023 |
| 811.5 | -0.023 |
| 811.6 | -0.023 |
| 811.7 | -0.023 |
| 811.8 | -0.023 |
| 811.9 | -0.023 |
| 812.0 | -0.023 |
| 812.1 | -0.023 |
| 812.2 | -0.023 |
| 812.3 | -0.023 |
| 812.4 | -0.023 |
| 812.5 | -0.023 |
| 812.6 | -0.023 |
| 812.7 | -0.023 |
| 812.8 | -0.023 |
| 812.9 | -0.023 |
| 813.0 | -0.023 |
| 813.1 | -0.023 |
| 813.2 | -0.023 |
| 813.3 | -0.023 |
| 813.4 | -0.023 |
| 813.5 | -0.023 |
| 813.6 | -0.023 |
| 813.7 | -0.023 |
| 813.8 | -0.023 |
| 813.9 | -0.023 |
| 814.0 | -0.023 |
| 814.1 | -0.023 |
| 814.2 | -0.023 |
| 814.3 | -0.023 |
| 814.4 | -0.023 |
| 814.5 | -0.023 |
| 814.6 | -0.023 |
| 814.7 | -0.023 |
| 814.8 | -0.023 |
| 814.9 | -0.023 |
| 815.0 | -0.023 |
| 815.1 | -0.023 |
| 815.2 | -0.023 |
| 815.3 | -0.023 |
| 815.4 | -0.023 |
| 815.5 | -0.023 |
| 815.6 | -0.023 |
| 815.7 | -0.023 |
| 815.8 | -0.023 |
| 815.9 | -0.023 |
| 816.0 | -0.023 |
| 816.1 | -0.023 |
| 816.2 | -0.023 |
| 816.3 | -0.023 |
| 816.4 | -0.023 |
| 816.5 | -0.023 |
| 816.6 | -0.023 |
| 816.7 | -0.023 |
| 816.8 | -0.023 |
| 816.9 | -0.023 |
| 817.0 | -0.023 |
| 817.1 | -0.023 |
| 817.2 | -0.023 |
| 817.3 | -0.023 |
| 817.4 | -0.023 |
| 817.5 | -0.023 |
| 817.6 | -0.023 |
| 817.7 | -0.023 |
| 817.8 | -0.023 |
| 817.9 | -0.023 |
| 818.0 | -0.023 |
| 818.1 | -0.023 |
| 818.2 | -0.023 |
| 818.3 | -0.023 |
| 818.4 | -0.023 |
| 818.5 | -0.023 |
| 818.6 | -0.023 |
| 818.7 | -0.023 |
| 818.8 | -0.023 |
| 818.9 | -0.023 |
| 819.0 | -0.023 |
| 819.1 | -0.023 |
| 819.2 | -0.023 |
| 819.3 | -0.023 |
| 819.4 | -0.023 |
| 819.5 | -0.023 |
| 819.6 | -0.023 |
| 819.7 | -0.023 |
| 819.8 | -0.023 |
| 819.9 | -0.023 |
| 820.0 | -0.023 |
| 820.1 | -0.023 |
| 820.2 | -0.023 |
| 820.3 | -0.023 |
| 820.4 | -0.023 |
| 820.5 | -0.023 |
| 820.6 | -0.023 |
| 820.7 | -0.023 |
| 820.8 | -0.023 |
| 820.9 | -0.023 |
| 821.0 | -0.023 |
| 821.1 | -0.023 |
| 821.2 | -0.023 |
| 821.3 | -0.023 |
| 821.4 | -0.023 |
| 821.5 | -0.023 |
| 821.6 | -0.023 |
| 821.7 | -0.023 |
| 821.8 | -0.023 |
| 821.9 | -0.023 |
| 822.0 | -0.023 |
| 822.1 | -0.023 |
| 822.2 | -0.023 |
| 822.3 | -0.023 |
| 822.4 | -0.023 |
| 822.5 | -0.023 |
| 822.6 | -0.023 |
| 822.7 | -0.023 |
| 822.8 | -0.023 |
| 822.9 | -0.023 |
| 823.0 | -0.023 |
| 823.1 | -0.023 |
| 823.2 | -0.023 |
| 823.3 | -0.023 |
| 823.4 | -0.023 |
| 823.5 | -0.023 |
| 823.6 | -0.023 |
| 823.7 | -0.023 |
| 823.8 | -0.023 |
| 823.9 | -0.023 |
| 824.0 | -0.023 |
| 824.1 | -0.023 |
| 824.2 | -0.023 |
| 824.3 | -0.023 |
| 824.4 | -0.023 |
| 824.5 | -0.023 |
| 824.6 | -0.023 |
| 824.7 | -0.023 |
| 824.8 | -0.023 |
| 824.9 | -0.023 |
| 825.0 | -0.023 |
| 825.1 | -0.023 |
| 825.2 | -0.023 |
| 825.3 | -0.023 |
| 825.4 | -0.023 |
| 825.5 | -0.023 |
| 825.6 | -0.023 |
| 825.7 | -0.023 |
| 825.8 | -0.023 |
| 825.9 | -0.023 |
| 826.0 | -0.023 |
| 826.1 | -0.023 |
| 826.2 | -0.023 |
| 826.3 | -0.023 |
| 826.4 | -0.023 |
| 826.5 | -0.023 |
| 826.6 | -0.023 |
| 826.7 | -0.023 |
| 826.8 | -0.023 |
| 826.9 | -0.023 |
| 827.0 | -0.023 |
| 827.1 | -0.023 |
| 827.2 | -0.023 |
| 827.3 | -0.023 |
| 827.4 | -0.023 |
| 827.5 | -0.023 |
| 827.6 | -0.023 |
| 827.7 | -0.023 |
| 827.8 | -0.023 |
| 827.9 | -0.023 |
| 828.0 | -0.023 |
| 828.1 | -0.023 |
| 828.2 | -0.023 |
| 828.3 | -0.023 |
| 828.4 | -0.023 |
| 828.5 | -0.023 |
| 828.6 | -0.023 |
| 828.7 | -0.023 |
| 828.8 | -0.023 |
| 828.9 | -0.023 |
| 829.0 | -0.023 |
| 829.1 | -0.023 |
| 829.2 | -0.023 |
| 829.3 | -0.023 |
| 829.4 | -0.023 |
| 829.5 | -0.023 |
| 829.6 | -0.023 |
| 829.7 | -0.023 |
| 829.8 | -0.023 |
| 829.9 | -0.023 |
| 830.0 | -0.023 |
| 830.1 | -0.023 |
| 830.2 | -0.023 |
| 830.3 | -0.023 |
| 830.4 | -0.023 |
| 830.5 | -0.023 |
| 830.6 | -0.023 |
| 830.7 | -0.023 |
| 830.8 | -0.023 |
| 830.9 | -0.023 |
| 831.0 | -0.023 |
| 831.1 | -0.023 |
| 831.2 | -0.023 |
| 831.3 | -0.023 |
| 831.4 | -0.023 |
| 831.5 | -0.023 |
| 831.6 | -0.023 |
| 831.7 | -0.023 |
| 831.8 | -0.023 |
| 831.9 | -0.023 |
| 832.0 | -0.023 |
| 832.1 | -0.023 |
| 832.2 | -0.023 |
| 832.3 | -0.023 |
| 832.4 | -0.023 |
| 832.5 | -0.023 |
| 832.6 | -0.023 |
| 832.7 | -0.023 |
| 832.8 | -0.023 |
| 832.9 | -0.023 |
| 833.0 | -0.023 |
| 833.1 | -0.023 |
| 833.2 | -0.023 |
| 833.3 | -0.023 |
| 833.4 | -0.023 |
| 833.5 | -0.023 |
| 833.6 | -0.023 |
| 833.7 | -0.023 |
| 833.8 | -0.023 |
| 833.9 | -0.023 |
| 834.0 | -0.023 |
| 834.1 | -0.023 |
| 834.2 | -0.023 |
| 834.3 | -0.023 |
| 834.4 | -0.023 |
| 834.5 | -0.023 |
| 834.6 | -0.023 |
| 834.7 | -0.023 |
| 834.8 | -0.023 |
| 834.9 | -0.023 |
| 835.0 | -0.023 |
| 835.1 | -0.023 |
| 835.2 | -0.023 |
| 835.3 | -0.023 |
| 835.4 | -0.023 |
| 835.5 | -0.023 |
| 835.6 | -0.023 |
| 835.7 | -0.023 |
| 835.8 | -0.023 |
| 835.9 | -0.023 |
| 836.0 | -0.023 |
| 836.1 | -0.023 |
| 836.2 | -0.023 |
| 836.3 | -0.023 |
| 836.4 | -0.023 |
| 836.5 | -0.023 |
| 836.6 | -0.023 |
| 836.7 | -0.023 |
| 836.8 | -0.023 |
| 836.9 | -0.023 |
| 837.0 | -0.023 |
| 837.1 | -0.023 |
| 837.2 | -0.023 |
| 837.3 | -0.023 |
| 837.4 | -0.023 |
| 837.5 | -0.023 |
| 837.6 | -0.023 |
| 837.7 | -0.023 |
| 837.8 | -0.023 |
| 837.9 | -0.023 |
| 838.0 | -0.024 |
| 838.1 | -0.024 |
| 838.2 | -0.024 |
| 838.3 | -0.024 |
| 838.4 | -0.024 |
| 838.5 | -0.024 |
| 838.6 | -0.024 |
| 838.7 | -0.024 |
| 838.8 | -0.024 |
| 838.9 | -0.024 |
| 839.0 | -0.024 |
| 839.1 | -0.024 |
| 839.2 | -0.024 |
| 839.3 | -0.024 |
| 839.4 | -0.024 |
| 839.5 | -0.024 |
| 839.6 | -0.024 |
| 839.7 | -0.024 |
| 839.8 | -0.024 |
| 839.9 | -0.024 |
| 840.0 | -0.024 |
| 840.1 | -0.024 |
| 840.2 | -0.024 |
| 840.3 | -0.024 |
| 840.4 | -0.024 |
| 840.5 | -0.024 |
| 840.6 | -0.024 |
| 840.7 | -0.024 |
| 840.8 | -0.024 |
| 840.9 | -0.024 |
| 841.0 | -0.024 |
| 841.1 | -0.024 |
| 841.2 | -0.024 |
| 841.3 | -0.024 |
| 841.4 | -0.024 |
| 841.5 | -0.024 |
| 841.6 | -0.024 |
| 841.7 | -0.024 |
| 841.8 | -0.024 |
| 841.9 | -0.024 |
| 842.0 | -0.024 |
| 842.1 | -0.024 |
| 842.2 | -0.024 |
| 842.3 | -0.024 |
| 842.4 | -0.024 |
| 842.5 | -0.024 |
| 842.6 | -0.024 |
| 842.7 | -0.024 |
| 842.8 | -0.024 |
| 842.9 | -0.024 |
| 843.0 | -0.024 |
| 843.1 | -0.024 |
| 843.2 | -0.024 |
| 843.3 | -0.024 |
| 843.4 | -0.024 |
| 843.5 | -0.024 |
| 843.6 | -0.024 |
| 843.7 | -0.024 |
| 843.8 | -0.024 |
| 843.9 | -0.024 |
| 844.0 | -0.024 |
| 844.1 | -0.024 |
| 844.2 | -0.024 |
| 844.3 | -0.024 |
| 844.4 | -0.024 |
| 844.5 | -0.024 |
| 844.6 | -0.024 |
| 844.7 | -0.024 |
| 844.8 | -0.024 |
| 844.9 | -0.024 |
| 845.0 | -0.024 |
| 845.1 | -0.024 |
| 845.2 | -0.024 |
| 845.3 | -0.024 |
| 845.4 | -0.024 |
| 845.5 | -0.024 |
| 845.6 | -0.024 |
| 845.7 | -0.024 |
| 845.8 | -0.024 |
| 845.9 | -0.024 |
| 846.0 | -0.024 |
| 846.1 | -0.024 |
| 846.2 | -0.024 |
| 846.3 | -0.024 |
| 846.4 | -0.024 |
| 846.5 | -0.024 |
| 846.6 | -0.024 |
| 846.7 | -0.024 |
| 846.8 | -0.024 |
| 846.9 | -0.024 |
| 847.0 | -0.024 |
| 847.1 | -0.024 |
| 847.2 | -0.024 |
| 847.3 | -0.024 |
| 847.4 | -0.024 |
| 847.5 | -0.024 |
| 847.6 | -0.024 |
| 847.7 | -0.024 |
| 847.8 | -0.024 |
| 847.9 | -0.024 |
| 848.0 | -0.024 |
| 848.1 | -0.024 |
| 848.2 | -0.024 |
| 848.3 | -0.024 |
| 848.4 | -0.024 |
| 848.5 | -0.024 |
| 848.6 | -0.024 |
| 848.7 | -0.024 |
| 848.8 | -0.024 |
| 848.9 | -0.024 |
| 849.0 | -0.024 |
| 849.1 | -0.024 |
| 849.2 | -0.024 |
| 849.3 | -0.024 |
| 849.4 | -0.024 |
| 849.5 | -0.024 |
| 849.6 | -0.024 |
| 849.7 | -0.024 |
| 849.8 | -0.024 |
| 849.9 | -0.024 |
| 850.0 | -0.024 |
| 850.1 | -0.024 |
| 850.2 | -0.024 |
| 850.3 | -0.024 |
| 850.4 | -0.024 |
| 850.5 | -0.024 |
| 850.6 | -0.024 |
| 850.7 | -0.024 |
| 850.8 | -0.024 |
| 850.9 | -0.024 |
| 851.0 | -0.024 |
| 851.1 | -0.024 |
| 851.2 | -0.024 |
| 851.3 | -0.024 |
| 851.4 | -0.024 |
| 851.5 | -0.024 |
| 851.6 | -0.024 |
| 851.7 | -0.024 |
| 851.8 | -0.024 |
| 851.9 | -0.024 |
| 852.0 | -0.024 |
| 852.1 | -0.024 |
| 852.2 | -0.024 |
| 852.3 | -0.024 |
| 852.4 | -0.024 |
| 852.5 | -0.024 |
| 852.6 | -0.024 |
| 852.7 | -0.024 |
| 852.8 | -0.024 |
| 852.9 | -0.024 |
| 853.0 | -0.024 |
| 853.1 | -0.024 |
| 853.2 | -0.024 |
| 853.3 | -0.024 |
| 853.4 | -0.024 |
| 853.5 | -0.024 |
| 853.6 | -0.024 |
| 853.7 | -0.024 |
| 853.8 | -0.024 |
| 853.9 | -0.024 |
| 854.0 | -0.024 |
| 854.1 | -0.024 |
| 854.2 | -0.024 |
| 854.3 | -0.024 |
| 854.4 | -0.024 |
| 854.5 | -0.024 |
| 854.6 | -0.024 |
| 854.7 | -0.024 |
| 854.8 | -0.024 |
| 854.9 | -0.024 |
| 855.0 | -0.024 |
| 855.1 | -0.024 |
| 855.2 | -0.024 |
| 855.3 | -0.024 |
| 855.4 | -0.024 |
| 855.5 | -0.024 |
| 855.6 | -0.024 |
| 855.7 | -0.024 |
| 855.8 | -0.024 |
| 855.9 | -0.024 |
| 856.0 | -0.024 |
| 856.1 | -0.024 |
| 856.2 | -0.024 |
| 856.3 | -0.024 |
| 856.4 | -0.024 |
| 856.5 | -0.024 |
| 856.6 | -0.024 |
| 856.7 | -0.024 |
| 856.8 | -0.024 |
| 856.9 | -0.024 |
| 857.0 | -0.024 |
| 857.1 | -0.024 |
| 857.2 | -0.024 |
| 857.3 | -0.024 |
| 857.4 | -0.024 |
| 857.5 | -0.024 |
| 857.6 | -0.024 |
| 857.7 | -0.024 |
| 857.8 | -0.024 |
| 857.9 | -0.024 |
| 858.0 | -0.024 |
| 858.1 | -0.024 |
| 858.2 | -0.024 |
| 858.3 | -0.024 |
| 858.4 | -0.024 |
| 858.5 | -0.024 |
| 858.6 | -0.024 |
| 858.7 | -0.024 |
| 858.8 | -0.024 |
| 858.9 | -0.024 |
| 859.0 | -0.024 |
| 859.1 | -0.024 |
| 859.2 | -0.024 |
| 859.3 | -0.024 |
| 859.4 | -0.024 |
| 859.5 | -0.024 |
| 859.6 | -0.024 |
| 859.7 | -0.024 |
| 859.8 | -0.024 |
| 859.9 | -0.024 |
| 860.0 | -0.024 |
| 860.1 | -0.024 |
| 860.2 | -0.024 |
| 860.3 | -0.024 |
| 860.4 | -0.024 |
| 860.5 | -0.024 |
| 860.6 | -0.024 |
| 860.7 | -0.024 |
| 860.8 | -0.024 |
| 860.9 | -0.024 |
| 861.0 | -0.024 |
| 861.1 | -0.024 |
| 861.2 | -0.024 |
| 861.3 | -0.024 |
| 861.4 | -0.024 |
| 861.5 | -0.024 |
| 861.6 | -0.024 |
| 861.7 | -0.024 |
| 861.8 | -0.024 |
| 861.9 | -0.024 |
| 862.0 | -0.024 |
| 862.1 | -0.024 |
| 862.2 | -0.024 |
| 862.3 | -0.024 |
| 862.4 | -0.024 |
| 862.5 | -0.024 |
| 862.6 | -0.024 |
| 862.7 | -0.024 |
| 862.8 | -0.024 |
| 862.9 | -0.024 |
| 863.0 | -0.024 |
| 863.1 | -0.024 |
| 863.2 | -0.024 |
| 863.3 | -0.024 |
| 863.4 | -0.024 |
| 863.5 | -0.024 |
| 863.6 | -0.024 |
| 863.7 | -0.024 |
| 863.8 | -0.024 |
| 863.9 | -0.024 |
| 864.0 | -0.024 |
| 864.1 | -0.024 |
| 864.2 | -0.024 |
| 864.3 | -0.024 |
| 864.4 | -0.024 |
| 864.5 | -0.024 |
| 864.6 | -0.024 |
| 864.7 | -0.024 |
| 864.8 | -0.024 |
| 864.9 | -0.024 |
| 865.0 | -0.024 |
| 865.1 | -0.024 |
| 865.2 | -0.024 |
| 865.3 | -0.024 |
| 865.4 | -0.024 |
| 865.5 | -0.024 |
| 865.6 | -0.024 |
| 865.7 | -0.024 |
| 865.8 | -0.024 |
| 865.9 | -0.024 |
| 866.0 | -0.024 |
| 866.1 | -0.024 |
| 866.2 | -0.024 |
| 866.3 | -0.024 |
| 866.4 | -0.024 |
| 866.5 | -0.024 |
| 866.6 | -0.024 |
| 866.7 | -0.024 |
| 866.8 | -0.024 |
| 866.9 | -0.024 |
| 867.0 | -0.024 |
| 867.1 | -0.024 |
| 867.2 | -0.024 |
| 867.3 | -0.024 |
| 867.4 | -0.024 |
| 867.5 | -0.024 |
| 867.6 | -0.024 |
| 867.7 | -0.024 |
| 867.8 | -0.024 |
| 867.9 | -0.024 |
| 868.0 | -0.024 |
| 868.1 | -0.024 |
| 868.2 | -0.024 |
| 868.3 | -0.024 |
| 868.4 | -0.024 |
| 868.5 | -0.024 |
| 868.6 | -0.024 |
| 868.7 | -0.024 |
| 868.8 | -0.024 |
| 868.9 | -0.024 |
| 869.0 | -0.024 |
| 869.1 | -0.024 |
| 869.2 | -0.024 |
| 869.3 | -0.024 |
| 869.4 | -0.024 |
| 869.5 | -0.024 |
| 869.6 | -0.024 |
| 869.7 | -0.024 |
| 869.8 | -0.024 |
| 869.9 | -0.024 |
| 870.0 | -0.024 |
| 870.1 | -0.024 |
| 870.2 | -0.024 |
| 870.3 | -0.024 |
| 870.4 | -0.024 |
| 870.5 | -0.024 |
| 870.6 | -0.024 |
| 870.7 | -0.024 |
| 870.8 | -0.024 |
| 870.9 | -0.024 |
| 871.0 | -0.024 |
| 871.1 | -0.024 |
| 871.2 | -0.024 |
| 871.3 | -0.024 |
| 871.4 | -0.024 |
| 871.5 | -0.024 |
| 871.6 | -0.024 |
| 871.7 | -0.024 |
| 871.8 | -0.024 |
| 871.9 | -0.024 |
| 872.0 | -0.024 |
| 872.1 | -0.024 |
| 872.2 | -0.024 |
| 872.3 | -0.024 |
| 872.4 | -0.024 |
| 872.5 | -0.024 |
| 872.6 | -0.024 |
| 872.7 | -0.024 |
| 872.8 | -0.024 |
| 872.9 | -0.024 |
| 873.0 | -0.024 |
| 873.1 | -0.024 |
| 873.2 | -0.024 |
| 873.3 | -0.024 |
| 873.4 | -0.024 |
| 873.5 | -0.024 |
| 873.6 | -0.024 |
| 873.7 | -0.024 |
| 873.8 | -0.024 |
| 873.9 | -0.024 |
| 874.0 | -0.024 |
| 874.1 | -0.024 |
| 874.2 | -0.024 |
| 874.3 | -0.024 |
| 874.4 | -0.024 |
| 874.5 | -0.024 |
| 874.6 | -0.024 |
| 874.7 | -0.024 |
| 874.8 | -0.024 |
| 874.9 | -0.024 |
| 875.0 | -0.024 |
| 875.1 | -0.024 |
| 875.2 | -0.024 |
| 875.3 | -0.024 |
| 875.4 | -0.024 |
| 875.5 | -0.024 |
| 875.6 | -0.024 |
| 875.7 | -0.024 |
| 875.8 | -0.024 |
| 875.9 | -0.024 |
| 876.0 | -0.024 |
| 876.1 | -0.024 |
| 876.2 | -0.024 |
| 876.3 | -0.024 |
| 876.4 | -0.024 |
| 876.5 | -0.024 |
| 876.6 | -0.024 |
| 876.7 | -0.024 |
| 876.8 | -0.024 |
| 876.9 | -0.024 |
| 877.0 | -0.024 |
| 877.1 | -0.024 |
| 877.2 | -0.024 |
| 877.3 | -0.024 |
| 877.4 | -0.024 |
| 877.5 | -0.024 |
| 877.6 | -0.024 |
| 877.7 | -0.024 |
| 877.8 | -0.024 |
| 877.9 | -0.024 |
| 878.0 | -0.024 |
| 878.1 | -0.024 |
| 878.2 | -0.024 |
| 878.3 | -0.024 |
| 878.4 | -0.024 |
| 878.5 | -0.024 |
| 878.6 | -0.024 |
| 878.7 | -0.024 |
| 878.8 | -0.024 |
| 878.9 | -0.024 |
| 879.0 | -0.024 |
| 879.1 | -0.024 |
| 879.2 | -0.024 |
| 879.3 | -0.024 |
| 879.4 | -0.024 |
| 879.5 | -0.024 |
| 879.6 | -0.024 |
| 879.7 | -0.024 |
| 879.8 | -0.024 |
| 879.9 | -0.024 |
| 880.0 | -0.024 |
| 880.1 | -0.024 |
| 880.2 | -0.024 |
| 880.3 | -0.024 |
| 880.4 | -0.024 |
| 880.5 | -0.024 |
| 880.6 | -0.024 |
| 880.7 | -0.024 |
| 880.8 | -0.024 |
| 880.9 | -0.024 |
| 881.0 | -0.024 |
| 881.1 | -0.024 |
| 881.2 | -0.024 |
| 881.3 | -0.024 |
| 881.4 | -0.024 |
| 881.5 | -0.024 |
| 881.6 | -0.024 |
| 881.7 | -0.024 |
| 881.8 | -0.024 |
| 881.9 | -0.024 |
| 882.0 | -0.024 |
| 882.1 | -0.024 |
| 882.2 | -0.024 |
| 882.3 | -0.024 |
| 882.4 | -0.024 |
| 882.5 | -0.024 |
| 882.6 | -0.024 |
| 882.7 | -0.024 |
| 882.8 | -0.024 |
| 882.9 | -0.024 |
| 883.0 | -0.024 |
| 883.1 | -0.024 |
| 883.2 | -0.024 |
| 883.3 | -0.024 |
| 883.4 | -0.024 |
| 883.5 | -0.024 |
| 883.6 | -0.024 |
| 883.7 | -0.024 |
| 883.8 | -0.024 |
| 883.9 | -0.024 |
| 884.0 | -0.024 |
| 884.1 | -0.025 |
| 884.2 | -0.025 |
| 884.3 | -0.025 |
| 884.4 | -0.025 |
| 884.5 | -0.025 |
| 884.6 | -0.025 |
| 884.7 | -0.025 |
| 884.8 | -0.025 |
| 884.9 | -0.025 |
| 885.0 | -0.025 |
| 885.1 | -0.025 |
| 885.2 | -0.025 |
| 885.3 | -0.025 |
| 885.4 | -0.025 |
| 885.5 | -0.025 |
| 885.6 | -0.025 |
| 885.7 | -0.025 |
| 885.8 | -0.025 |
| 885.9 | -0.025 |
| 886.0 | -0.025 |
| 886.1 | -0.025 |
| 886.2 | -0.025 |
| 886.3 | -0.025 |
| 886.4 | -0.025 |
| 886.5 | -0.025 |
| 886.6 | -0.025 |
| 886.7 | -0.025 |
| 886.8 | -0.025 |
| 886.9 | -0.025 |
| 887.0 | -0.025 |
| 887.1 | -0.025 |
| 887.2 | -0.025 |
| 887.3 | -0.025 |
| 887.4 | -0.025 |
| 887.5 | -0.025 |
| 887.6 | -0.025 |
| 887.7 | -0.025 |
| 887.8 | -0.025 |
| 887.9 | -0.025 |
| 888.0 | -0.025 |
| 888.1 | -0.025 |
| 888.2 | -0.025 |
| 888.3 | -0.025 |
| 888.4 | -0.025 |
| 888.5 | -0.025 |
| 888.6 | -0.025 |
| 888.7 | -0.025 |
| 888.8 | -0.025 |
| 888.9 | -0.025 |
| 889.0 | -0.025 |
| 889.1 | -0.025 |
| 889.2 | -0.025 |
| 889.3 | -0.025 |
| 889.4 | -0.025 |
| 889.5 | -0.025 |
| 889.6 | -0.025 |
| 889.7 | -0.025 |
| 889.8 | -0.025 |
| 889.9 | -0.025 |
| 890.0 | -0.025 |
| 890.1 | -0.025 |
| 890.2 | -0.025 |
| 890.3 | -0.025 |
| 890.4 | -0.025 |
| 890.5 | -0.025 |
| 890.6 | -0.025 |
| 890.7 | -0.025 |
| 890.8 | -0.025 |
| 890.9 | -0.025 |
| 891.0 | -0.025 |
| 891.1 | -0.025 |
| 891.2 | -0.025 |
| 891.3 | -0.025 |
| 891.4 | -0.025 |
| 891.5 | -0.025 |
| 891.6 | -0.025 |
| 891.7 | -0.025 |
| 891.8 | -0.025 |
| 891.9 | -0.025 |
| 892.0 | -0.025 |
| 892.1 | -0.025 |
| 892.2 | -0.025 |
| 892.3 | -0.025 |
| 892.4 | -0.025 |
| 892.5 | -0.025 |
| 892.6 | -0.025 |
| 892.7 | -0.025 |
| 892.8 | -0.025 |
| 892.9 | -0.025 |
| 893.0 | -0.025 |
| 893.1 | -0.025 |
| 893.2 | -0.025 |
| 893.3 | -0.025 |
| 893.4 | -0.025 |
| 893.5 | -0.025 |
| 893.6 | -0.025 |
| 893.7 | -0.025 |
| 893.8 | -0.025 |
| 893.9 | -0.025 |
| 894.0 | -0.025 |
| 894.1 | -0.025 |
| 894.2 | -0.025 |
| 894.3 | -0.025 |
| 894.4 | -0.025 |
| 894.5 | -0.025 |
| 894.6 | -0.025 |
| 894.7 | -0.025 |
| 894.8 | -0.025 |
| 894.9 | -0.025 |
| 895.0 | -0.025 |
| 895.1 | -0.025 |
| 895.2 | -0.025 |
| 895.3 | -0.025 |
| 895.4 | -0.025 |
| 895.5 | -0.025 |
| 895.6 | -0.025 |
| 895.7 | -0.025 |
| 895.8 | -0.025 |
| 895.9 | -0.025 |
| 896.0 | -0.025 |
| 896.1 | -0.025 |
| 896.2 | -0.025 |
| 896.3 | -0.025 |
| 896.4 | -0.025 |
| 896.5 | -0.025 |
| 896.6 | -0.025 |
| 896.7 | -0.025 |
| 896.8 | -0.025 |
| 896.9 | -0.025 |
| 897.0 | -0.025 |
| 897.1 | -0.025 |
| 897.2 | -0.025 |
| 897.3 | -0.025 |
| 897.4 | -0.025 |
| 897.5 | -0.025 |
| 897.6 | -0.025 |
| 897.7 | -0.025 |
| 897.8 | -0.025 |
| 897.9 | -0.025 |
| 898.0 | -0.025 |
| 898.1 | -0.025 |
| 898.2 | -0.025 |
| 898.3 | -0.025 |
| 898.4 | -0.025 |
| 898.5 | -0.025 |
| 898.6 | -0.025 |
| 898.7 | -0.025 |
| 898.8 | -0.025 |
| 898.9 | -0.025 |
| 899.0 | -0.025 |
| 899.1 | -0.025 |
| 899.2 | -0.025 |
| 899.3 | -0.025 |
| 899.4 | -0.025 |
| 899.5 | -0.025 |
| 899.6 | -0.025 |
| 899.7 | -0.025 |
| 899.8 | -0.025 |
| 899.9 | -0.025 |
| 900.0 | -0.025 |
| 900.1 | -0.025 |
| 900.2 | -0.025 |
| 900.3 | -0.025 |
| 900.4 | -0.025 |
| 900.5 | -0.025 |
| 900.6 | -0.025 |
| 900.7 | -0.025 |
| 900.8 | -0.025 |
| 900.9 | -0.025 |
| 901.0 | -0.025 |
| 901.1 | -0.025 |
| 901.2 | -0.025 |
| 901.3 | -0.025 |
| 901.4 | -0.025 |
| 901.5 | -0.025 |
| 901.6 | -0.025 |
| 901.7 | -0.025 |
| 901.8 | -0.025 |
| 901.9 | -0.025 |
| 902.0 | -0.025 |
| 902.1 | -0.025 |
| 902.2 | -0.025 |
| 902.3 | -0.025 |
| 902.4 | -0.025 |
| 902.5 | -0.025 |
| 902.6 | -0.025 |
| 902.7 | -0.025 |
| 902.8 | -0.025 |
| 902.9 | -0.025 |
| 903.0 | -0.025 |
| 903.1 | -0.025 |
| 903.2 | -0.025 |
| 903.3 | -0.025 |
| 903.4 | -0.025 |
| 903.5 | -0.025 |
| 903.6 | -0.025 |
| 903.7 | -0.025 |
| 903.8 | -0.025 |
| 903.9 | -0.025 |
| 904.0 | -0.025 |
| 904.1 | -0.025 |
| 904.2 | -0.025 |
| 904.3 | -0.025 |
| 904.4 | -0.025 |
| 904.5 | -0.025 |
| 904.6 | -0.025 |
| 904.7 | -0.025 |
| 904.8 | -0.025 |
| 904.9 | -0.025 |
| 905.0 | -0.025 |
| 905.1 | -0.025 |
| 905.2 | -0.025 |
| 905.3 | -0.025 |
| 905.4 | -0.025 |
| 905.5 | -0.025 |
| 905.6 | -0.025 |
| 905.7 | -0.025 |
| 905.8 | -0.025 |
| 905.9 | -0.025 |
| 906.0 | -0.025 |
| 906.1 | -0.025 |
| 906.2 | -0.025 |
| 906.3 | -0.025 |
| 906.4 | -0.025 |
| 906.5 | -0.025 |
| 906.6 | -0.025 |
| 906.7 | -0.025 |
| 906.8 | -0.025 |
| 906.9 | -0.025 |
| 907.0 | -0.025 |
| 907.1 | -0.025 |
| 907.2 | -0.025 |
| 907.3 | -0.025 |
| 907.4 | -0.025 |
| 907.5 | -0.025 |
| 907.6 | -0.025 |
| 907.7 | -0.025 |
| 907.8 | -0.025 |
| 907.9 | -0.025 |
| 908.0 | -0.025 |
| 908.1 | -0.025 |
| 908.2 | -0.025 |
| 908.3 | -0.025 |
| 908.4 | -0.025 |
| 908.5 | -0.025 |
| 908.6 | -0.025 |
| 908.7 | -0.025 |
| 908.8 | -0.025 |
| 908.9 | -0.025 |
| 909.0 | -0.025 |
| 909.1 | -0.025 |
| 909.2 | -0.025 |
| 909.3 | -0.025 |
| 909.4 | -0.025 |
| 909.5 | -0.025 |
| 909.6 | -0.025 |
| 909.7 | -0.025 |
| 909.8 | -0.025 |
| 909.9 | -0.025 |
| 910.0 | -0.025 |
| 910.1 | -0.025 |
| 910.2 | -0.025 |
| 910.3 | -0.025 |
| 910.4 | -0.025 |
| 910.5 | -0.025 |
| 910.6 | -0.025 |
| 910.7 | -0.025 |
| 910.8 | -0.025 |
| 910.9 | -0.025 |
| 911.0 | -0.025 |
| 911.1 | -0.025 |
| 911.2 | -0.025 |
| 911.3 | -0.025 |
| 911.4 | -0.025 |
| 911.5 | -0.025 |
| 911.6 | -0.025 |
| 911.7 | -0.025 |
| 911.8 | -0.025 |
| 911.9 | -0.025 |
| 912.0 | -0.025 |
| 912.1 | -0.025 |
| 912.2 | -0.025 |
| 912.3 | -0.025 |
| 912.4 | -0.025 |
| 912.5 | -0.025 |
| 912.6 | -0.025 |
| 912.7 | -0.025 |
| 912.8 | -0.025 |
| 912.9 | -0.025 |
| 913.0 | -0.025 |
| 913.1 | -0.025 |
| 913.2 | -0.025 |
| 913.3 | -0.025 |
| 913.4 | -0.025 |
| 913.5 | -0.025 |
| 913.6 | -0.025 |
| 913.7 | -0.025 |
| 913.8 | -0.025 |
| 913.9 | -0.025 |
| 914.0 | -0.025 |
| 914.1 | -0.025 |
| 914.2 | -0.025 |
| 914.3 | -0.025 |
| 914.4 | -0.025 |
| 914.5 | -0.025 |
| 914.6 | -0.025 |
| 914.7 | -0.025 |
| 914.8 | -0.025 |
| 914.9 | -0.025 |
| 915.0 | -0.025 |
| 915.1 | -0.025 |
| 915.2 | -0.025 |
| 915.3 | -0.025 |
| 915.4 | -0.025 |
| 915.5 | -0.025 |
| 915.6 | -0.025 |
| 915.7 | -0.025 |
| 915.8 | -0.025 |
| 915.9 | -0.025 |
| 916.0 | -0.025 |
| 916.1 | -0.025 |
| 916.2 | -0.025 |
| 916.3 | -0.025 |
| 916.4 | -0.025 |
| 916.5 | -0.025 |
| 916.6 | -0.025 |
| 916.7 | -0.025 |
| 916.8 | -0.025 |
| 916.9 | -0.025 |
| 917.0 | -0.025 |
| 917.1 | -0.025 |
| 917.2 | -0.025 |
| 917.3 | -0.025 |
| 917.4 | -0.025 |
| 917.5 | -0.025 |
| 917.6 | -0.025 |
| 917.7 | -0.025 |
| 917.8 | -0.025 |
| 917.9 | -0.025 |
| 918.0 | -0.025 |
| 918.1 | -0.025 |
| 918.2 | -0.025 |
| 918.3 | -0.025 |
| 918.4 | -0.025 |
| 918.5 | -0.025 |
| 918.6 | -0.025 |
| 918.7 | -0.025 |
| 918.8 | -0.025 |
| 918.9 | -0.025 |
| 919.0 | -0.025 |
| 919.1 | -0.025 |
| 919.2 | -0.025 |
| 919.3 | -0.025 |
| 919.4 | -0.025 |
| 919.5 | -0.025 |
| 919.6 | -0.025 |
| 919.7 | -0.025 |
| 919.8 | -0.025 |
| 919.9 | -0.025 |
| 920.0 | -0.025 |
| 920.1 | -0.025 |
| 920.2 | -0.025 |
| 920.3 | -0.025 |
| 920.4 | -0.025 |
| 920.5 | -0.025 |
| 920.6 | -0.025 |
| 920.7 | -0.025 |
| 920.8 | -0.025 |
| 920.9 | -0.025 |
| 921.0 | -0.025 |
| 921.1 | -0.025 |
| 921.2 | -0.025 |
| 921.3 | -0.025 |
| 921.4 | -0.025 |
| 921.5 | -0.025 |
| 921.6 | -0.025 |
| 921.7 | -0.025 |
| 921.8 | -0.025 |
| 921.9 | -0.025 |
| 922.0 | -0.025 |
| 922.1 | -0.025 |
| 922.2 | -0.025 |
| 922.3 | -0.025 |
| 922.4 | -0.025 |
| 922.5 | -0.025 |
| 922.6 | -0.025 |
| 922.7 | -0.025 |
| 922.8 | -0.025 |
| 922.9 | -0.025 |
| 923.0 | -0.025 |
| 923.1 | -0.025 |
| 923.2 | -0.025 |
| 923.3 | -0.025 |
| 923.4 | -0.025 |
| 923.5 | -0.025 |
| 923.6 | -0.025 |
| 923.7 | -0.025 |
| 923.8 | -0.025 |
| 923.9 | -0.025 |
| 924.0 | -0.025 |
| 924.1 | -0.025 |
| 924.2 | -0.025 |
| 924.3 | -0.025 |
| 924.4 | -0.025 |
| 924.5 | -0.025 |
| 924.6 | -0.025 |
| 924.7 | -0.025 |
| 924.8 | -0.025 |
| 924.9 | -0.025 |
| 925.0 | -0.025 |
| 925.1 | -0.025 |
| 925.2 | -0.025 |
| 925.3 | -0.025 |
| 925.4 | -0.025 |
| 925.5 | -0.025 |
| 925.6 | -0.025 |
| 925.7 | -0.025 |
| 925.8 | -0.025 |
| 925.9 | -0.025 |
| 926.0 | -0.025 |
| 926.1 | -0.025 |
| 926.2 | -0.025 |
| 926.3 | -0.025 |
| 926.4 | -0.025 |
| 926.5 | -0.025 |
| 926.6 | -0.025 |
| 926.7 | -0.025 |
| 926.8 | -0.025 |
| 926.9 | -0.025 |
| 927.0 | -0.025 |
| 927.1 | -0.025 |
| 927.2 | -0.025 |
| 927.3 | -0.025 |
| 927.4 | -0.025 |
| 927.5 | -0.025 |
| 927.6 | -0.025 |
| 927.7 | -0.025 |
| 927.8 | -0.025 |
| 927.9 | -0.025 |
| 928.0 | -0.025 |
| 928.1 | -0.025 |
| 928.2 | -0.025 |
| 928.3 | -0.025 |
| 928.4 | -0.025 |
| 928.5 | -0.025 |
| 928.6 | -0.025 |
| 928.7 | -0.025 |
| 928.8 | -0.025 |
| 928.9 | -0.025 |
| 929.0 | -0.025 |
| 929.1 | -0.025 |
| 929.2 | -0.025 |
| 929.3 | -0.025 |
| 929.4 | -0.025 |
| 929.5 | -0.025 |
| 929.6 | -0.025 |
| 929.7 | -0.025 |
| 929.8 | -0.025 |
| 929.9 | -0.025 |
| 930.0 | -0.025 |
| 930.1 | -0.025 |
| 930.2 | -0.025 |
| 930.3 | -0.025 |
| 930.4 | -0.025 |
| 930.5 | -0.025 |
| 930.6 | -0.025 |
| 930.7 | -0.025 |
| 930.8 | -0.025 |
| 930.9 | -0.025 |
| 931.0 | -0.025 |
| 931.1 | -0.025 |
| 931.2 | -0.025 |
| 931.3 | -0.025 |
| 931.4 | -0.025 |
| 931.5 | -0.025 |
| 931.6 | -0.025 |
| 931.7 | -0.025 |
| 931.8 | -0.025 |
| 931.9 | -0.025 |
| 932.0 | -0.025 |
| 932.1 | -0.025 |
| 932.2 | -0.025 |
| 932.3 | -0.025 |
| 932.4 | -0.025 |
| 932.5 | -0.025 |
| 932.6 | -0.025 |
| 932.7 | -0.025 |
| 932.8 | -0.025 |
| 932.9 | -0.025 |
| 933.0 | -0.025 |
| 933.1 | -0.025 |
| 933.2 | -0.025 |
| 933.3 | -0.025 |
| 933.4 | -0.025 |
| 933.5 | -0.025 |
| 933.6 | -0.025 |
| 933.7 | -0.025 |
| 933.8 | -0.025 |
| 933.9 | -0.025 |
| 934.0 | -0.025 |
| 934.1 | -0.025 |
| 934.2 | -0.025 |
| 934.3 | -0.025 |
| 934.4 | -0.025 |
| 934.5 | -0.025 |
| 934.6 | -0.025 |
| 934.7 | -0.025 |
| 934.8 | -0.025 |
| 934.9 | -0.025 |
| 935.0 | -0.025 |
| 935.1 | -0.025 |
| 935.2 | -0.025 |
| 935.3 | -0.025 |
| 935.4 | -0.025 |
| 935.5 | -0.025 |
| 935.6 | -0.025 |
| 935.7 | -0.025 |
| 935.8 | -0.025 |
| 935.9 | -0.025 |
| 936.0 | -0.025 |
| 936.1 | -0.025 |
| 936.2 | -0.025 |
| 936.3 | -0.025 |
| 936.4 | -0.025 |
| 936.5 | -0.025 |
| 936.6 | -0.025 |
| 936.7 | -0.025 |
| 936.8 | -0.025 |
| 936.9 | -0.025 |
| 937.0 | -0.025 |
| 937.1 | -0.025 |
| 937.2 | -0.025 |
| 937.3 | -0.025 |
| 937.4 | -0.025 |
| 937.5 | -0.025 |
| 937.6 | -0.025 |
| 937.7 | -0.025 |
| 937.8 | -0.025 |
| 937.9 | -0.025 |
| 938.0 | -0.025 |
| 938.1 | -0.025 |
| 938.2 | -0.025 |
| 938.3 | -0.025 |
| 938.4 | -0.025 |
| 938.5 | -0.025 |
| 938.6 | -0.025 |
| 938.7 | -0.025 |
| 938.8 | -0.025 |
| 938.9 | -0.025 |
| 939.0 | -0.025 |
| 939.1 | -0.025 |
| 939.2 | -0.025 |
| 939.3 | -0.025 |
| 939.4 | -0.025 |
| 939.5 | -0.025 |
| 939.6 | -0.025 |
| 939.7 | -0.025 |
| 939.8 | -0.025 |
| 939.9 | -0.025 |
| 940.0 | -0.025 |
| 940.1 | -0.025 |
| 940.2 | -0.025 |
| 940.3 | -0.025 |
| 940.4 | -0.025 |
| 940.5 | -0.025 |
| 940.6 | -0.025 |
| 940.7 | -0.025 |
| 940.8 | -0.025 |
| 940.9 | -0.025 |
| 941.0 | -0.025 |
| 941.1 | -0.025 |
| 941.2 | -0.025 |
| 941.3 | -0.025 |
| 941.4 | -0.025 |
| 941.5 | -0.025 |
| 941.6 | -0.025 |
| 941.7 | -0.025 |
| 941.8 | -0.025 |
| 941.9 | -0.025 |
| 942.0 | -0.025 |
| 942.1 | -0.025 |
| 942.2 | -0.025 |
| 942.3 | -0.025 |
| 942.4 | -0.025 |
| 942.5 | -0.025 |
| 942.6 | -0.025 |
| 942.7 | -0.025 |
| 942.8 | -0.025 |
| 942.9 | -0.025 |
| 943.0 | -0.025 |
| 943.1 | -0.025 |
| 943.2 | -0.025 |
| 943.3 | -0.025 |
| 943.4 | -0.025 |
| 943.5 | -0.025 |
| 943.6 | -0.025 |
| 943.7 | -0.025 |
| 943.8 | -0.025 |
| 943.9 | -0.025 |
| 944.0 | -0.025 |
| 944.1 | -0.025 |
| 944.2 | -0.025 |
| 944.3 | -0.025 |
| 944.4 | -0.025 |
| 944.5 | -0.025 |
| 944.6 | -0.025 |
| 944.7 | -0.025 |
| 944.8 | -0.025 |
| 944.9 | -0.025 |
| 945.0 | -0.025 |
| 945.1 | -0.025 |
| 945.2 | -0.025 |
| 945.3 | -0.025 |
| 945.4 | -0.025 |
| 945.5 | -0.025 |
| 945.6 | -0.025 |
| 945.7 | -0.025 |
| 945.8 | -0.025 |
| 945.9 | -0.025 |
| 946.0 | -0.025 |
| 946.1 | -0.025 |
| 946.2 | -0.025 |
| 946.3 | -0.025 |
| 946.4 | -0.025 |
| 946.5 | -0.025 |
| 946.6 | -0.025 |
| 946.7 | -0.025 |
| 946.8 | -0.025 |
| 946.9 | -0.025 |
| 947.0 | -0.025 |
| 947.1 | -0.025 |
| 947.2 | -0.025 |
| 947.3 | -0.025 |
| 947.4 | -0.025 |
| 947.5 | -0.025 |
| 947.6 | -0.025 |
| 947.7 | -0.025 |
| 947.8 | -0.025 |
| 947.9 | -0.025 |
| 948.0 | -0.025 |
| 948.1 | -0.025 |
| 948.2 | -0.025 |
| 948.3 | -0.025 |
| 948.4 | -0.025 |
| 948.5 | -0.025 |
| 948.6 | -0.025 |
| 948.7 | -0.025 |
| 948.8 | -0.025 |
| 948.9 | -0.025 |
| 949.0 | -0.025 |
| 949.1 | -0.025 |
| 949.2 | -0.025 |
| 949.3 | -0.025 |
| 949.4 | -0.025 |
| 949.5 | -0.025 |
| 949.6 | -0.025 |
| 949.7 | -0.025 |
| 949.8 | -0.025 |
| 949.9 | -0.025 |
| 950.0 | -0.025 |
| 950.1 | -0.025 |
| 950.2 | -0.025 |
| 950.3 | -0.025 |
| 950.4 | -0.025 |
| 950.5 | -0.025 |
| 950.6 | -0.025 |
| 950.7 | -0.025 |
| 950.8 | -0.025 |
| 950.9 | -0.025 |
| 951.0 | -0.025 |
| 951.1 | -0.025 |
| 951.2 | -0.025 |
| 951.3 | -0.025 |
| 951.4 | -0.025 |
| 951.5 | -0.025 |
| 951.6 | -0.025 |
| 951.7 | -0.025 |
| 951.8 | -0.025 |
| 951.9 | -0.025 |
| 952.0 | -0.025 |
| 952.1 | -0.025 |
| 952.2 | -0.025 |
| 952.3 | -0.025 |
| 952.4 | -0.025 |
| 952.5 | -0.025 |
| 952.6 | -0.025 |
| 952.7 | -0.025 |
| 952.8 | -0.025 |
| 952.9 | -0.025 |
| 953.0 | -0.025 |
| 953.1 | -0.025 |
| 953.2 | -0.025 |
| 953.3 | -0.025 |
| 953.4 | -0.025 |
| 953.5 | -0.025 |
| 953.6 | -0.025 |
| 953.7 | -0.025 |
| 953.8 | -0.025 |
| 953.9 | -0.025 |
| 954.0 | -0.025 |
| 954.1 | -0.025 |
| 954.2 | -0.025 |
| 954.3 | -0.025 |
| 954.4 | -0.025 |
| 954.5 | -0.025 |
| 954.6 | -0.025 |
| 954.7 | -0.025 |
| 954.8 | -0.025 |
| 954.9 | -0.025 |
| 955.0 | -0.025 |
| 955.1 | -0.025 |
| 955.2 | -0.025 |
| 955.3 | -0.025 |
| 955.4 | -0.025 |
| 955.5 | -0.025 |
| 955.6 | -0.025 |
| 955.7 | -0.025 |
| 955.8 | -0.025 |
| 955.9 | -0.025 |
| 956.0 | -0.025 |
| 956.1 | -0.025 |
| 956.2 | -0.025 |
| 956.3 | -0.025 |
| 956.4 | -0.025 |
| 956.5 | -0.025 |
| 956.6 | -0.025 |
| 956.7 | -0.025 |
| 956.8 | -0.025 |
| 956.9 | -0.025 |
| 957.0 | -0.025 |
| 957.1 | -0.025 |
| 957.2 | -0.025 |
| 957.3 | -0.025 |
| 957.4 | -0.025 |
| 957.5 | -0.025 |
| 957.6 | -0.025 |
| 957.7 | -0.025 |
| 957.8 | -0.025 |
| 957.9 | -0.025 |
| 958.0 | -0.025 |
| 958.1 | -0.025 |
| 958.2 | -0.025 |
| 958.3 | -0.025 |
| 958.4 | -0.025 |
| 958.5 | -0.025 |
| 958.6 | -0.025 |
| 958.7 | -0.025 |
| 958.8 | -0.025 |
| 958.9 | -0.025 |
| 959.0 | -0.025 |
| 959.1 | -0.025 |
| 959.2 | -0.025 |
| 959.3 | -0.025 |
| 959.4 | -0.025 |
| 959.5 | -0.025 |
| 959.6 | -0.025 |
| 959.7 | -0.025 |
| 959.8 | -0.025 |
| 959.9 | -0.025 |
| 960.0 | -0.025 |
| 960.1 | -0.025 |
| 960.2 | -0.025 |
| 960.3 | -0.025 |
| 960.4 | -0.025 |
| 960.5 | -0.025 |
| 960.6 | -0.025 |
| 960.7 | -0.025 |
| 960.8 | -0.025 |
| 960.9 | -0.025 |
| 961.0 | -0.025 |
| 961.1 | -0.025 |
| 961.2 | -0.025 |
| 961.3 | -0.025 |
| 961.4 | -0.025 |
| 961.5 | -0.025 |
| 961.6 | -0.025 |
| 961.7 | -0.025 |
| 961.8 | -0.025 |
| 961.9 | -0.025 |
| 962.0 | -0.025 |
| 962.1 | -0.025 |
| 962.2 | -0.025 |
| 962.3 | -0.025 |
| 962.4 | -0.025 |
| 962.5 | -0.025 |
| 962.6 | -0.025 |
| 962.7 | -0.025 |
| 962.8 | -0.025 |
| 962.9 | -0.025 |
| 963.0 | -0.025 |
| 963.1 | -0.025 |
| 963.2 | -0.025 |
| 963.3 | -0.025 |
| 963.4 | -0.025 |
| 963.5 | -0.025 |
| 963.6 | -0.025 |
| 963.7 | -0.025 |
| 963.8 | -0.025 |
| 963.9 | -0.025 |
| 964.0 | -0.025 |
| 964.1 | -0.025 |
| 964.2 | -0.025 |
| 964.3 | -0.025 |
| 964.4 | -0.025 |
| 964.5 | -0.025 |
| 964.6 | -0.025 |
| 964.7 | -0.025 |
| 964.8 | -0.025 |
| 964.9 | -0.025 |
| 965.0 | -0.025 |
| 965.1 | -0.025 |
| 965.2 | -0.025 |
| 965.3 | -0.025 |
| 965.4 | -0.025 |
| 965.5 | -0.025 |
| 965.6 | -0.025 |
| 965.7 | -0.025 |
| 965.8 | -0.025 |
| 965.9 | -0.025 |
| 966.0 | -0.025 |
| 966.1 | -0.025 |
| 966.2 | -0.025 |
| 966.3 | -0.025 |
| 966.4 | -0.025 |
| 966.5 | -0.025 |
| 966.6 | -0.025 |
| 966.7 | -0.025 |
| 966.8 | -0.025 |
| 966.9 | -0.025 |
| 967.0 | -0.025 |
| 967.1 | -0.025 |
| 967.2 | -0.025 |
| 967.3 | -0.025 |
| 967.4 | -0.025 |
| 967.5 | -0.025 |
| 967.6 | -0.025 |
| 967.7 | -0.025 |
| 967.8 | -0.025 |
| 967.9 | -0.025 |
| 968.0 | -0.025 |
| 968.1 | -0.025 |
| 968.2 | -0.025 |
| 968.3 | -0.025 |
| 968.4 | -0.025 |
| 968.5 | -0.025 |
| 968.6 | -0.025 |
| 968.7 | -0.025 |
| 968.8 | -0.025 |
| 968.9 | -0.025 |
| 969.0 | -0.025 |
| 969.1 | -0.025 |
| 969.2 | -0.025 |
| 969.3 | -0.025 |
| 969.4 | -0.025 |
| 969.5 | -0.025 |
| 969.6 | -0.025 |
| 969.7 | -0.025 |
| 969.8 | -0.025 |
| 969.9 | -0.025 |
| 970.0 | -0.025 |
| 970.1 | -0.025 |
| 970.2 | -0.025 |
| 970.3 | -0.025 |
| 970.4 | -0.025 |
| 970.5 | -0.025 |
| 970.6 | -0.025 |
| 970.7 | -0.025 |
| 970.8 | -0.025 |
| 970.9 | -0.025 |
| 971.0 | -0.025 |
| 971.1 | -0.025 |
| 971.2 | -0.025 |
| 971.3 | -0.025 |
| 971.4 | -0.025 |
| 971.5 | -0.025 |
| 971.6 | -0.025 |
| 971.7 | -0.025 |
| 971.8 | -0.025 |
| 971.9 | -0.025 |
| 972.0 | -0.025 |
| 972.1 | -0.025 |
| 972.2 | -0.025 |
| 972.3 | -0.025 |
| 972.4 | -0.025 |
| 972.5 | -0.025 |
| 972.6 | -0.025 |
| 972.7 | -0.025 |
| 972.8 | -0.025 |
| 972.9 | -0.025 |
| 973.0 | -0.025 |
| 973.1 | -0.025 |
| 973.2 | -0.025 |
| 973.3 | -0.025 |
| 973.4 | -0.025 |
| 973.5 | -0.025 |
| 973.6 | -0.025 |
| 973.7 | -0.025 |
| 973.8 | -0.025 |
| 973.9 | -0.025 |
| 974.0 | -0.025 |
| 974.1 | -0.025 |
| 974.2 | -0.025 |
| 974.3 | -0.025 |
| 974.4 | -0.025 |
| 974.5 | -0.025 |
| 974.6 | -0.025 |
| 974.7 | -0.025 |
| 974.8 | -0.025 |
| 974.9 | -0.025 |
| 975.0 | -0.025 |
| 975.1 | -0.025 |
| 975.2 | -0.025 |
| 975.3 | -0.025 |
| 975.4 | -0.025 |
| 975.5 | -0.025 |
| 975.6 | -0.025 |
| 975.7 | -0.025 |
| 975.8 | -0.025 |
| 975.9 | -0.025 |
| 976.0 | -0.025 |
| 976.1 | -0.025 |
| 976.2 | -0.025 |
| 976.3 | -0.025 |
| 976.4 | -0.025 |
| 976.5 | -0.025 |
| 976.6 | -0.025 |
| 976.7 | -0.025 |
| 976.8 | -0.025 |
| 976.9 | -0.025 |
| 977.0 | -0.025 |
| 977.1 | -0.025 |
| 977.2 | -0.025 |
| 977.3 | -0.025 |
| 977.4 | -0.025 |
| 977.5 | -0.025 |
| 977.6 | -0.025 |
| 977.7 | -0.025 |
| 977.8 | -0.025 |
| 977.9 | -0.025 |
| 978.0 | -0.025 |
| 978.1 | -0.025 |
| 978.2 | -0.025 |
| 978.3 | -0.025 |
| 978.4 | -0.025 |
| 978.5 | -0.025 |
| 978.6 | -0.025 |
| 978.7 | -0.025 |
| 978.8 | -0.025 |
| 978.9 | -0.025 |
| 979.0 | -0.025 |
| 979.1 | -0.025 |
| 979.2 | -0.025 |
| 979.3 | -0.025 |
| 979.4 | -0.025 |
| 979.5 | -0.025 |
| 979.6 | -0.025 |
| 979.7 | -0.025 |
| 979.8 | -0.025 |
| 979.9 | -0.025 |
| 980.0 | -0.025 |
| 980.1 | -0.025 |
| 980.2 | -0.025 |
| 980.3 | -0.025 |
| 980.4 | -0.025 |
| 980.5 | -0.025 |
| 980.6 | -0.025 |
| 980.7 | -0.025 |
| 980.8 | -0.025 |
| 980.9 | -0.025 |
| 981.0 | -0.025 |
| 981.1 | -0.025 |
| 981.2 | -0.025 |
| 981.3 | -0.025 |
| 981.4 | -0.025 |
| 981.5 | -0.025 |
| 981.6 | -0.025 |
| 981.7 | -0.025 |
| 981.8 | -0.025 |
| 981.9 | -0.025 |
| 982.0 | -0.025 |
| 982.1 | -0.025 |
| 982.2 | -0.025 |
| 982.3 | -0.025 |
| 982.4 | -0.025 |
| 982.5 | -0.025 |
| 982.6 | -0.025 |
| 982.7 | -0.025 |
| 982.8 | -0.025 |
| 982.9 | -0.025 |
| 983.0 | -0.025 |
| 983.1 | -0.025 |
| 983.2 | -0.025 |
| 983.3 | -0.025 |
| 983.4 | -0.025 |
| 983.5 | -0.025 |
| 983.6 | -0.025 |
| 983.7 | -0.025 |
| 983.8 | -0.025 |
| 983.9 | -0.025 |
| 984.0 | -0.025 |
| 984.1 | -0.025 |
| 984.2 | -0.025 |
| 984.3 | -0.025 |
| 984.4 | -0.025 |
| 984.5 | -0.025 |
| 984.6 | -0.025 |
| 984.7 | -0.025 |
| 984.8 | -0.025 |
| 984.9 | -0.025 |
| 985.0 | -0.025 |
| 985.1 | -0.025 |
| 985.2 | -0.025 |
| 985.3 | -0.025 |
| 985.4 | -0.025 |
| 985.5 | -0.025 |
| 985.6 | -0.025 |
| 985.7 | -0.025 |
| 985.8 | -0.025 |
| 985.9 | -0.025 |
| 986.0 | -0.025 |
| 986.1 | -0.025 |
| 986.2 | -0.025 |
| 986.3 | -0.025 |
| 986.4 | -0.025 |
| 986.5 | -0.025 |
| 986.6 | -0.025 |
| 986.7 | -0.025 |
| 986.8 | -0.025 |
| 986.9 | -0.025 |
| 987.0 | -0.025 |
| 987.1 | -0.025 |
| 987.2 | -0.025 |
| 987.3 | -0.025 |
| 987.4 | -0.025 |
| 987.5 | -0.025 |
| 987.6 | -0.025 |
| 987.7 | -0.025 |
| 987.8 | -0.025 |
| 987.9 | -0.025 |
| 988.0 | -0.025 |
| 988.1 | -0.025 |
| 988.2 | -0.025 |
| 988.3 | -0.025 |
| 988.4 | -0.025 |
| 988.5 | -0.025 |
| 988.6 | -0.025 |
| 988.7 | -0.025 |
| 988.8 | -0.025 |
| 988.9 | -0.025 |
| 989.0 | -0.025 |
| 989.1 | -0.025 |
| 989.2 | -0.025 |
| 989.3 | -0.025 |
| 989.4 | -0.025 |
| 989.5 | -0.025 |
| 989.6 | -0.025 |
| 989.7 | -0.025 |
| 989.8 | -0.025 |
| 989.9 | -0.025 |
| 990.0 | -0.025 |
| 990.1 | -0.025 |
| 990.2 | -0.025 |
| 990.3 | -0.025 |
| 990.4 | -0.025 |
| 990.5 | -0.025 |
| 990.6 | -0.025 |
| 990.7 | -0.025 |
| 990.8 | -0.025 |
| 990.9 | -0.025 |
| 991.0 | -0.025 |
| 991.1 | -0.025 |
| 991.2 | -0.025 |
| 991.3 | -0.025 |
| 991.4 | -0.025 |
| 991.5 | -0.025 |
| 991.6 | -0.025 |
| 991.7 | -0.025 |
| 991.8 | -0.025 |
| 991.9 | -0.025 |
| 992.0 | -0.025 |
| 992.1 | -0.025 |
| 992.2 | -0.025 |
| 992.3 | -0.025 |
| 992.4 | -0.025 |
| 992.5 | -0.025 |
| 992.6 | -0.025 |
| 992.7 | -0.025 |
| 992.8 | -0.025 |
| 992.9 | -0.025 |
| 993.0 | -0.025 |
| 993.1 | -0.025 |
| 993.2 | -0.025 |
| 993.3 | -0.025 |
| 993.4 | -0.025 |
| 993.5 | -0.025 |
| 993.6 | -0.025 |
| 993.7 | -0.025 |
| 993.8 | -0.025 |
| 993.9 | -0.025 |
| 994.0 | -0.025 |
| 994.1 | -0.025 |
| 994.2 | -0.025 |
| 994.3 | -0.025 |
| 994.4 | -0.025 |
| 994.5 | -0.025 |
| 994.6 | -0.025 |
| 994.7 | -0.025 |
| 994.8 | -0.025 |
| 994.9 | -0.025 |
| 995.0 | -0.025 |
| 995.1 | -0.025 |
| 995.2 | -0.025 |
| 995.3 | -0.025 |
| 995.4 | -0.025 |
| 995.5 | -0.025 |
| 995.6 | -0.025 |
| 995.7 | -0.025 |
| 995.8 | -0.025 |
| 995.9 | -0.025 |
| 996.0 | -0.025 |
| 996.1 | -0.025 |
| 996.2 | -0.025 |
| 996.3 | -0.025 |
| 996.4 | -0.025 |
| 996.5 | -0.025 |
| 996.6 | -0.025 |
| 996.7 | -0.025 |
| 996.8 | -0.025 |
| 996.9 | -0.025 |
| 997.0 | -0.025 |
| 997.1 | -0.025 |
| 997.2 | -0.025 |
| 997.3 | -0.025 |
| 997.4 | -0.025 |
| 997.5 | -0.025 |
| 997.6 | -0.025 |
| 997.7 | -0.025 |
| 997.8 | -0.025 |
| 997.9 | -0.025 |
| 998.0 | -0.025 |
| 998.1 | -0.025 |
| 998.2 | -0.025 |
| 998.3 | -0.025 |
| 998.4 | -0.025 |
| 998.5 | -0.025 |
| 998.6 | -0.025 |
| 998.7 | -0.025 |
| 998.8 | -0.025 |
| 998.9 | -0.025 |
| 999.0 | -0.025 |
| 999.1 | -0.025 |
| 999.2 | -0.025 |
| 999.3 | -0.025 |
| 999.4 | -0.025 |
| 999.5 | -0.025 |
| 999.6 | -0.025 |
| 999.7 | -0.025 |
| 999.8 | -0.025 |
| 999.9 | -0.025 |
| 1000.0 | -0.025 |
| 1000.1 | -0.025 |
| 1000.2 | -0.025 |
| 1000.3 | -0.025 |
| 1000.4 | -0.025 |
| 1000.5 | -0.025 |
| 1000.6 | -0.025 |
| 1000.7 | -0.025 |
| 1000.8 | -0.025 |
| 1000.9 | -0.025 |
| 1001.0 | -0.025 |
| 1001.1 | -0.025 |
| 1001.2 | -0.025 |
| 1001.3 | -0.025 |
| 1001.4 | -0.025 |
| 1001.5 | -0.025 |
| 1001.6 | -0.025 |
| 1001.7 | -0.025 |
| 1001.8 | -0.025 |
| 1001.9 | -0.025 |
| 1002.0 | -0.025 |
| 1002.1 | -0.025 |
| 1002.2 | -0.025 |
| 1002.3 | -0.025 |
| 1002.4 | -0.025 |
| 1002.5 | -0.025 |
| 1002.6 | -0.025 |
| 1002.7 | -0.025 |
| 1002.8 | -0.025 |
| 1002.9 | -0.025 |
| 1003.0 | -0.025 |
| 1003.1 | -0.025 |
| 1003.2 | -0.025 |
| 1003.3 | -0.025 |
| 1003.4 | -0.025 |
| 1003.5 | -0.025 |
| 1003.6 | -0.025 |
| 1003.7 | -0.025 |
| 1003.8 | -0.025 |
| 1003.9 | -0.025 |
| 1004.0 | -0.025 |
| 1004.1 | -0.025 |
| 1004.2 | -0.025 |
| 1004.3 | -0.025 |
| 1004.4 | -0.025 |
| 1004.5 | -0.025 |
| 1004.6 | -0.025 |
| 1004.7 | -0.025 |
| 1004.8 | -0.025 |
| 1004.9 | -0.025 |
| 1005.0 | -0.025 |
| 1005.1 | -0.025 |
| 1005.2 | -0.025 |
| 1005.3 | -0.025 |
| 1005.4 | -0.025 |
| 1005.5 | -0.025 |
| 1005.6 | -0.025 |
| 1005.7 | -0.025 |
| 1005.8 | -0.025 |
| 1005.9 | -0.025 |
| 1006.0 | -0.025 |
| 1006.1 | -0.025 |
| 1006.2 | -0.025 |
| 1006.3 | -0.025 |
| 1006.4 | -0.025 |
| 1006.5 | -0.025 |
| 1006.6 | -0.025 |
| 1006.7 | -0.025 |
| 1006.8 | -0.025 |
| 1006.9 | -0.025 |
| 1007.0 | -0.025 |
| 1007.1 | -0.025 |
| 1007.2 | -0.025 |
| 1007.3 | -0.025 |
| 1007.4 | -0.025 |
| 1007.5 | -0.025 |
| 1007.6 | -0.025 |
| 1007.7 | -0.025 |
| 1007.8 | -0.025 |
| 1007.9 | -0.025 |
| 1008.0 | -0.025 |
| 1008.1 | -0.025 |
| 1008.2 | -0.025 |
| 1008.3 | -0.025 |
| 1008.4 | -0.025 |
| 1008.5 | -0.025 |
| 1008.6 | -0.025 |
| 1008.7 | -0.025 |
| 1008.8 | -0.025 |
| 1008.9 | -0.025 |
| 1009.0 | -0.025 |
| 1009.1 | -0.025 |
| 1009.2 | -0.025 |
| 1009.3 | -0.025 |
| 1009.4 | -0.025 |
| 1009.5 | -0.025 |
| 1009.6 | -0.025 |
| 1009.7 | -0.025 |
| 1009.8 | -0.025 |
| 1009.9 | -0.025 |
| 1010.0 | -0.025 |
| 1010.1 | -0.025 |
| 1010.2 | -0.025 |
| 1010.3 | -0.025 |
| 1010.4 | -0.025 |
| 1010.5 | -0.025 |
| 1010.6 | -0.025 |
| 1010.7 | -0.025 |
| 1010.8 | -0.025 |
| 1010.9 | -0.025 |
| 1011.0 | -0.025 |
| 1011.1 | -0.025 |
| 1011.2 | -0.025 |
| 1011.3 | -0.025 |
| 1011.4 | -0.025 |
| 1011.5 | -0.025 |
| 1011.6 | -0.025 |
| 1011.7 | -0.025 |
| 1011.8 | -0.025 |
| 1011.9 | -0.025 |
| 1012.0 | -0.025 |
| 1012.1 | -0.025 |
| 1012.2 | -0.025 |
| 1012.3 | -0.025 |
| 1012.4 | -0.025 |
| 1012.5 | -0.025 |
| 1012.6 | -0.025 |
| 1012.7 | -0.025 |
| 1012.8 | -0.025 |
| 1012.9 | -0.025 |
| 1013.0 | -0.025 |
| 1013.1 | -0.025 |
| 1013.2 | -0.025 |
| 1013.3 | -0.025 |
| 1013.4 | -0.025 |
| 1013.5 | -0.025 |
| 1013.6 | -0.025 |
| 1013.7 | -0.025 |
| 1013.8 | -0.025 |
| 1013.9 | -0.025 |
| 1014.0 | -0.025 |
| 1014.1 | -0.025 |
| 1014.2 | -0.025 |
| 1014.3 | -0.025 |
| 1014.4 | -0.025 |
| 1014.5 | -0.025 |
| 1014.6 | -0.025 |
| 1014.7 | -0.025 |
| 1014.8 | -0.025 |
| 1014.9 | -0.025 |
| 1015.0 | -0.025 |
| 1015.1 | -0.025 |
| 1015.2 | -0.025 |
| 1015.3 | -0.025 |
| 1015.4 | -0.025 |
| 1015.5 | -0.025 |
| 1015.6 | -0.025 |
| 1015.7 | -0.025 |
| 1015.8 | -0.025 |
| 1015.9 | -0.025 |
| 1016.0 | -0.025 |
| 1016.1 | -0.025 |
| 1016.2 | -0.025 |
| 1016.3 | -0.025 |
| 1016.4 | -0.025 |
| 1016.5 | -0.025 |
| 1016.6 | -0.025 |
| 1016.7 | -0.025 |
| 1016.8 | -0.025 |
| 1016.9 | -0.025 |
| 1017.0 | -0.025 |
| 1017.1 | -0.025 |
| 1017.2 | -0.025 |
| 1017.3 | -0.025 |
| 1017.4 | -0.025 |
| 1017.5 | -0.025 |
| 1017.6 | -0.025 |
| 1017.7 | -0.025 |
| 1017.8 | -0.025 |
| 1017.9 | -0.025 |
| 1018.0 | -0.025 |
| 1018.1 | -0.025 |
| 1018.2 | -0.025 |
| 1018.3 | -0.025 |
| 1018.4 | -0.025 |
| 1018.5 | -0.025 |
| 1018.6 | -0.025 |
| 1018.7 | -0.025 |
| 1018.8 | -0.025 |
| 1018.9 | -0.025 |
| 1019.0 | -0.025 |
| 1019.1 | -0.025 |
| 1019.2 | -0.025 |
| 1019.3 | -0.025 |
| 1019.4 | -0.025 |
| 1019.5 | -0.025 |
| 1019.6 | -0.025 |
| 1019.7 | -0.025 |
| 1019.8 | -0.025 |
| 1019.9 | -0.025 |
| 1020.0 | -0.025 |
| 1020.1 | -0.025 |
| 1020.2 | -0.025 |
| 1020.3 | -0.025 |
| 1020.4 | -0.025 |
| 1020.5 | -0.025 |
| 1020.6 | -0.025 |
| 1020.7 | -0.025 |
| 1020.8 | -0.025 |
| 1020.9 | -0.025 |
| 1021.0 | -0.025 |
| 1021.1 | -0.025 |
| 1021.2 | -0.025 |
| 1021.3 | -0.025 |
| 1021.4 | -0.025 |
| 1021.5 | -0.025 |
| 1021.6 | -0.025 |
| 1021.7 | -0.025 |
| 1021.8 | -0.025 |
| 1021.9 | -0.025 |
| 1022.0 | -0.025 |
| 1022.1 | -0.025 |
| 1022.2 | -0.025 |
| 1022.3 | -0.025 |
| 1022.4 | -0.025 |
| 1022.5 | -0.025 |
| 1022.6 | -0.025 |
| 1022.7 | -0.025 |
| 1022.8 | -0.025 |
| 1022.9 | -0.025 |
| 1023.0 | -0.025 |
| 1023.1 | -0.025 |
| 1023.2 | -0.025 |
| 1023.3 | -0.025 |
| 1023.4 | -0.025 |
| 1023.5 | -0.025 |
| 1023.6 | -0.025 |
| 1023.7 | -0.025 |
| 1023.8 | -0.025 |
| 1023.9 | -0.025 |
| 1024.0 | -0.025 |
| 1024.1 | -0.025 |
| 1024.2 | -0.025 |
| 1024.3 | -0.025 |
| 1024.4 | -0.025 |
| 1024.5 | -0.025 |
| 1024.6 | -0.025 |
| 1024.7 | -0.025 |
| 1024.8 | -0.025 |
| 1024.9 | -0.025 |
| 1025.0 | -0.025 |
| 1025.1 | -0.025 |
| 1025.2 | -0.025 |
| 1025.3 | -0.025 |
| 1025.4 | -0.025 |
| 1025.5 | -0.025 |
| 1025.6 | -0.025 |
| 1025.7 | -0.025 |
| 1025.8 | -0.025 |
| 1025.9 | -0.025 |
| 1026.0 | -0.025 |
| 1026.1 | -0.025 |
| 1026.2 | -0.025 |
| 1026.3 | -0.025 |
| 1026.4 | -0.025 |
| 1026.5 | -0.025 |
| 1026.6 | -0.025 |
| 1026.7 | -0.025 |
| 1026.8 | -0.025 |
| 1026.9 | -0.025 |
| 1027.0 | -0.025 |
| 1027.1 | -0.025 |
| 1027.2 | -0.025 |
| 1027.3 | -0.025 |
| 1027.4 | -0.025 |
| 1027.5 | -0.025 |
| 1027.6 | -0.025 |
| 1027.7 | -0.025 |
| 1027.8 | -0.025 |
| 1027.9 | -0.025 |
| 1028.0 | -0.025 |
| 1028.1 | -0.025 |
| 1028.2 | -0.025 |
| 1028.3 | -0.025 |
| 1028.4 | -0.025 |
| 1028.5 | -0.025 |
| 1028.6 | -0.025 |
| 1028.7 | -0.025 |
| 1028.8 | -0.025 |
| 1028.9 | -0.025 |
| 1029.0 | -0.025 |
| 1029.1 | -0.025 |
| 1029.2 | -0.025 |
| 1029.3 | -0.025 |
| 1029.4 | -0.025 |
| 1029.5 | -0.025 |
| 1029.6 | -0.025 |
| 1029.7 | -0.025 |
| 1029.8 | -0.025 |
| 1029.9 | -0.025 |
| 1030.0 | -0.025 |
| 1030.1 | -0.025 |
| 1030.2 | -0.025 |
| 1030.3 | -0.025 |
| 1030.4 | -0.025 |
| 1030.5 | -0.025 |
| 1030.6 | -0.025 |
| 1030.7 | -0.025 |
| 1030.8 | -0.025 |
| 1030.9 | -0.025 |
| 1031.0 | -0.025 |
| 1031.1 | -0.025 |
| 1031.2 | -0.025 |
| 1031.3 | -0.025 |
| 1031.4 | -0.025 |
| 1031.5 | -0.025 |
| 1031.6 | -0.025 |
| 1031.7 | -0.025 |
| 1031.8 | -0.025 |
| 1031.9 | -0.025 |
| 1032.0 | -0.025 |
| 1032.1 | -0.025 |
| 1032.2 | -0.025 |
| 1032.3 | -0.025 |
| 1032.4 | -0.025 |
| 1032.5 | -0.025 |
| 1032.6 | -0.025 |
| 1032.7 | -0.025 |
| 1032.8 | -0.025 |
| 1032.9 | -0.025 |
| 1033.0 | -0.025 |
| 1033.1 | -0.025 |
| 1033.2 | -0.025 |
| 1033.3 | -0.025 |
| 1033.4 | -0.025 |
| 1033.5 | -0.025 |
| 1033.6 | -0.025 |
| 1033.7 | -0.025 |
| 1033.8 | -0.025 |
| 1033.9 | -0.025 |
| 1034.0 | -0.025 |
| 1034.1 | -0.025 |
| 1034.2 | -0.025 |
| 1034.3 | -0.025 |
| 1034.4 | -0.025 |
| 1034.5 | -0.025 |
| 1034.6 | -0.025 |
| 1034.7 | -0.025 |
| 1034.8 | -0.025 |
| 1034.9 | -0.025 |
| 1035.0 | -0.025 |
| 1035.1 | -0.025 |
| 1035.2 | -0.025 |
| 1035.3 | -0.025 |
| 1035.4 | -0.025 |
| 1035.5 | -0.025 |
| 1035.6 | -0.025 |
| 1035.7 | -0.025 |
| 1035.8 | -0.025 |
| 1035.9 | -0.025 |
| 1036.0 | -0.025 |
| 1036.1 | -0.025 |
| 1036.2 | -0.025 |
| 1036.3 | -0.025 |
| 1036.4 | -0.025 |
| 1036.5 | -0.025 |
| 1036.6 | -0.025 |
| 1036.7 | -0.025 |
| 1036.8 | -0.025 |
| 1036.9 | -0.025 |
| 1037.0 | -0.025 |
| 1037.1 | -0.025 |
| 1037.2 | -0.025 |
| 1037.3 | -0.025 |
| 1037.4 | -0.025 |
| 1037.5 | -0.025 |
| 1037.6 | -0.025 |
| 1037.7 | -0.025 |
| 1037.8 | -0.025 |
| 1037.9 | -0.025 |
| 1038.0 | -0.025 |
| 1038.1 | -0.025 |
| 1038.2 | -0.025 |
| 1038.3 | -0.025 |
| 1038.4 | -0.025 |
| 1038.5 | -0.025 |
| 1038.6 | -0.025 |
| 1038.7 | -0.025 |
| 1038.8 | -0.025 |
| 1038.9 | -0.025 |
| 1039.0 | -0.025 |
| 1039.1 | -0.025 |
| 1039.2 | -0.025 |
| 1039.3 | -0.025 |
| 1039.4 | -0.025 |
| 1039.5 | -0.025 |
| 1039.6 | -0.025 |
| 1039.7 | -0.025 |
| 1039.8 | -0.025 |
| 1039.9 | -0.025 |
| 1040.0 | -0.025 |
| 1040.1 | -0.025 |
| 1040.2 | -0.025 |
| 1040.3 | -0.025 |
| 1040.4 | -0.025 |
| 1040.5 | -0.025 |
| 1040.6 | -0.025 |
| 1040.7 | -0.025 |
| 1040.8 | -0.025 |
| 1040.9 | -0.025 |
| 1041.0 | -0.025 |
| 1041.1 | -0.025 |
| 1041.2 | -0.025 |
| 1041.3 | -0.025 |
| 1041.4 | -0.025 |
| 1041.5 | -0.025 |
| 1041.6 | -0.025 |
| 1041.7 | -0.025 |
| 1041.8 | -0.025 |
| 1041.9 | -0.025 |
| 1042.0 | -0.025 |
| 1042.1 | -0.025 |
| 1042.2 | -0.025 |
| 1042.3 | -0.025 |
| 1042.4 | -0.025 |
| 1042.5 | -0.025 |
| 1042.6 | -0.025 |
| 1042.7 | -0.025 |
| 1042.8 | -0.025 |
| 1042.9 | -0.025 |
| 1043.0 | -0.025 |
| 1043.1 | -0.025 |
| 1043.2 | -0.025 |
| 1043.3 | -0.025 |
| 1043.4 | -0.025 |
| 1043.5 | -0.025 |
| 1043.6 | -0.025 |
| 1043.7 | -0.025 |
| 1043.8 | -0.025 |
| 1043.9 | -0.025 |
| 1044.0 | -0.025 |
| 1044.1 | -0.025 |
| 1044.2 | -0.025 |
| 1044.3 | -0.025 |
| 1044.4 | -0.025 |
| 1044.5 | -0.025 |
| 1044.6 | -0.025 |
| 1044.7 | -0.025 |
| 1044.8 | -0.025 |
| 1044.9 | -0.025 |
| 1045.0 | -0.025 |
| 1045.1 | -0.025 |
| 1045.2 | -0.025 |
| 1045.3 | -0.025 |
| 1045.4 | -0.025 |
| 1045.5 | -0.025 |
| 1045.6 | -0.025 |
| 1045.7 | -0.025 |
| 1045.8 | -0.025 |
| 1045.9 | -0.025 |
| 1046.0 | -0.025 |
| 1046.1 | -0.025 |
| 1046.2 | -0.025 |
| 1046.3 | -0.025 |
| 1046.4 | -0.025 |
| 1046.5 | -0.025 |
| 1046.6 | -0.025 |
| 1046.7 | -0.025 |
| 1046.8 | -0.025 |
| 1046.9 | -0.025 |
| 1047.0 | -0.025 |
| 1047.1 | -0.025 |
| 1047.2 | -0.025 |
| 1047.3 | -0.025 |
| 1047.4 | -0.025 |
| 1047.5 | -0.025 |
| 1047.6 | -0.025 |
| 1047.7 | -0.025 |
| 1047.8 | -0.025 |
| 1047.9 | -0.025 |
| 1048.0 | -0.025 |
| 1048.1 | -0.025 |
| 1048.2 | -0.025 |
| 1048.3 | -0.025 |
| 1048.4 | -0.025 |
| 1048.5 | -0.025 |
| 1048.6 | -0.025 |
| 1048.7 | -0.025 |
| 1048.8 | -0.025 |
| 1048.9 | -0.025 |
| 1049.0 | -0.025 |
| 1049.1 | -0.025 |
| 1049.2 | -0.025 |
| 1049.3 | -0.025 |
| 1049.4 | -0.025 |
| 1049.5 | -0.025 |
| 1049.6 | -0.025 |
| 1049.7 | -0.025 |
| 1049.8 | -0.025 |
| 1049.9 | -0.025 |
| 1050.0 | -0.025 |
| 1050.1 | -0.025 |
| 1050.2 | -0.025 |
| 1050.3 | -0.025 |
| 1050.4 | -0.025 |
| 1050.5 | -0.025 |
| 1050.6 | -0.025 |
| 1050.7 | -0.025 |
| 1050.8 | -0.025 |
| 1050.9 | -0.025 |
| 1051.0 | -0.025 |
| 1051.1 | -0.025 |
| 1051.2 | -0.025 |
| 1051.3 | -0.025 |
| 1051.4 | -0.025 |
| 1051.5 | -0.025 |
| 1051.6 | -0.025 |
| 1051.7 | -0.025 |
| 1051.8 | -0.025 |
| 1051.9 | -0.025 |
| 1052.0 | -0.025 |
| 1052.1 | -0.025 |
| 1052.2 | -0.025 |
| 1052.3 | -0.025 |
| 1052.4 | -0.025 |
| 1052.5 | -0.025 |
| 1052.6 | -0.025 |
| 1052.7 | -0.025 |
| 1052.8 | -0.025 |
| 1052.9 | -0.025 |
| 1053.0 | -0.025 |
| 1053.1 | -0.025 |
| 1053.2 | -0.025 |
| 1053.3 | -0.025 |
| 1053.4 | -0.025 |
| 1053.5 | -0.025 |
| 1053.6 | -0.025 |
| 1053.7 | -0.025 |
| 1053.8 | -0.025 |
| 1053.9 | -0.025 |
| 1054.0 | -0.025 |
| 1054.1 | -0.025 |
| 1054.2 | -0.025 |
| 1054.3 | -0.025 |
| 1054.4 | -0.025 |
| 1054.5 | -0.025 |
| 1054.6 | -0.025 |
| 1054.7 | -0.025 |
| 1054.8 | -0.025 |
| 1054.9 | -0.025 |
| 1055.0 | -0.025 |
| 1055.1 | -0.025 |
| 1055.2 | -0.025 |
| 1055.3 | -0.025 |
| 1055.4 | -0.025 |
| 1055.5 | -0.025 |
| 1055.6 | -0.025 |
| 1055.7 | -0.025 |
| 1055.8 | -0.025 |
| 1055.9 | -0.025 |
| 1056.0 | -0.025 |
| 1056.1 | -0.025 |
| 1056.2 | -0.025 |
| 1056.3 | -0.025 |
| 1056.4 | -0.025 |
| 1056.5 | -0.025 |
| 1056.6 | -0.025 |
| 1056.7 | -0.025 |
| 1056.8 | -0.025 |
| 1056.9 | -0.025 |
| 1057.0 | -0.025 |
| 1057.1 | -0.025 |
| 1057.2 | -0.025 |
| 1057.3 | -0.025 |
| 1057.4 | -0.025 |
| 1057.5 | -0.025 |
| 1057.6 | -0.025 |
| 1057.7 | -0.025 |
| 1057.8 | -0.025 |
| 1057.9 | -0.025 |
| 1058.0 | -0.025 |
| 1058.1 | -0.025 |
| 1058.2 | -0.025 |
| 1058.3 | -0.025 |
| 1058.4 | -0.025 |
| 1058.5 | -0.025 |
| 1058.6 | -0.025 |
| 1058.7 | -0.025 |
| 1058.8 | -0.025 |
| 1058.9 | -0.025 |
| 1059.0 | -0.025 |
| 1059.1 | -0.025 |
| 1059.2 | -0.025 |
| 1059.3 | -0.025 |
| 1059.4 | -0.025 |
| 1059.5 | -0.025 |
| 1059.6 | -0.025 |
| 1059.7 | -0.025 |
| 1059.8 | -0.025 |
| 1059.9 | -0.025 |
| 1060.0 | -0.025 |
| 1060.1 | -0.025 |
| 1060.2 | -0.025 |
| 1060.3 | -0.025 |
| 1060.4 | -0.025 |
| 1060.5 | -0.025 |
| 1060.6 | -0.025 |
| 1060.7 | -0.025 |
| 1060.8 | -0.025 |
| 1060.9 | -0.025 |
| 1061.0 | -0.025 |
| 1061.1 | -0.025 |
| 1061.2 | -0.025 |
| 1061.3 | -0.025 |
| 1061.4 | -0.025 |
| 1061.5 | -0.025 |
| 1061.6 | -0.025 |
| 1061.7 | -0.025 |
| 1061.8 | -0.025 |
| 1061.9 | -0.025 |
| 1062.0 | -0.025 |
| 1062.1 | -0.025 |
| 1062.2 | -0.025 |
| 1062.3 | -0.025 |
| 1062.4 | -0.025 |
| 1062.5 | -0.025 |
| 1062.6 | -0.025 |
| 1062.7 | -0.025 |
| 1062.8 | -0.025 |
| 1062.9 | -0.025 |
| 1063.0 | -0.025 |
| 1063.1 | -0.025 |
| 1063.2 | -0.025 |
| 1063.3 | -0.025 |
| 1063.4 | -0.025 |
| 1063.5 | -0.025 |
| 1063.6 | -0.025 |
| 1063.7 | -0.025 |
| 1063.8 | -0.025 |
| 1063.9 | -0.025 |
| 1064.0 | -0.025 |
| 1064.1 | -0.025 |
| 1064.2 | -0.025 |
| 1064.3 | -0.025 |
| 1064.4 | -0.025 |
| 1064.5 | -0.025 |
| 1064.6 | -0.025 |
| 1064.7 | -0.025 |
| 1064.8 | -0.025 |
| 1064.9 | -0.025 |
| 1065.0 | -0.025 |
| 1065.1 | -0.025 |
| 1065.2 | -0.025 |
| 1065.3 | -0.025 |
| 1065.4 | -0.025 |
| 1065.5 | -0.025 |
| 1065.6 | -0.025 |
| 1065.7 | -0.025 |
| 1065.8 | -0.025 |
| 1065.9 | -0.025 |
| 1066.0 | -0.025 |
| 1066.1 | -0.025 |
| 1066.2 | -0.025 |
| 1066.3 | -0.025 |
| 1066.4 | -0.025 |
| 1066.5 | -0.025 |
| 1066.6 | -0.025 |
| 1066.7 | -0.025 |
| 1066.8 | -0.025 |
| 1066.9 | -0.025 |
| 1067.0 | -0.025 |
| 1067.1 | -0.025 |
| 1067.2 | -0.025 |
| 1067.3 | -0.025 |
| 1067.4 | -0.025 |
| 1067.5 | -0.025 |
| 1067.6 | -0.025 |
| 1067.7 | -0.025 |
| 1067.8 | -0.025 |
| 1067.9 | -0.025 |
| 1068.0 | -0.025 |
| 1068.1 | -0.025 |
| 1068.2 | -0.025 |
| 1068.3 | -0.025 |
| 1068.4 | -0.025 |
| 1068.5 | -0.025 |
| 1068.6 | -0.025 |
| 1068.7 | -0.025 |
| 1068.8 | -0.025 |
| 1068.9 | -0.025 |
| 1069.0 | -0.025 |
| 1069.1 | -0.025 |
| 1069.2 | -0.025 |
| 1069.3 | -0.025 |
| 1069.4 | -0.025 |
| 1069.5 | -0.025 |
| 1069.6 | -0.025 |
| 1069.7 | -0.025 |
| 1069.8 | -0.025 |
| 1069.9 | -0.025 |
| 1070.0 | -0.025 |
| 1070.1 | -0.025 |
| 1070.2 | -0.025 |
| 1070.3 | -0.025 |
| 1070.4 | -0.025 |
| 1070.5 | -0.025 |
| 1070.6 | -0.025 |
| 1070.7 | -0.025 |
| 1070.8 | -0.025 |
| 1070.9 | -0.025 |
| 1071.0 | -0.025 |
| 1071.1 | -0.025 |
| 1071.2 | -0.025 |
| 1071.3 | -0.025 |
| 1071.4 | -0.025 |
| 1071.5 | -0.025 |
| 1071.6 | -0.025 |
| 1071.7 | -0.025 |
| 1071.8 | -0.025 |
| 1071.9 | -0.025 |
| 1072.0 | -0.025 |
| 1072.1 | -0.025 |
| 1072.2 | -0.025 |
| 1072.3 | -0.025 |
| 1072.4 | -0.025 |
| 1072.5 | -0.025 |
| 1072.6 | -0.025 |
| 1072.7 | -0.025 |
| 1072.8 | -0.025 |
| 1072.9 | -0.025 |
| 1073.0 | -0.025 |
| 1073.1 | -0.025 |
| 1073.2 | -0.025 |
| 1073.3 | -0.025 |
| 1073.4 | -0.025 |
| 1073.5 | -0.025 |
| 1073.6 | -0.025 |
| 1073.7 | -0.025 |
| 1073.8 | -0.025 |
| 1073.9 | -0.025 |
| 1074.0 | -0.025 |
| 1074.1 | -0.025 |
| 1074.2 | -0.025 |
| 1074.3 | -0.025 |
| 1074.4 | -0.025 |
| 1074.5 | -0.025 |
| 1074.6 | -0.025 |
| 1074.7 | -0.025 |
| 1074.8 | -0.025 |
| 1074.9 | -0.025 |
| 1075.0 | -0.025 |
| 1075.1 | -0.025 |
| 1075.2 | -0.025 |
| 1075.3 | -0.025 |
| 1075.4 | -0.025 |
| 1075.5 | -0.025 |
| 1075.6 | -0.025 |
| 1075.7 | -0.025 |
| 1075.8 | -0.025 |
| 1075.9 | -0.025 |
| 1076.0 | -0.025 |
| 1076.1 | -0.025 |
| 1076.2 | -0.025 |
| 1076.3 | -0.025 |
| 1076.4 | -0.025 |
| 1076.5 | -0.025 |
| 1076.6 | -0.025 |
| 1076.7 | -0.025 |
| 1076.8 | -0.025 |
| 1076.9 | -0.025 |
| 1077.0 | -0.025 |
| 1077.1 | -0.025 |
| 1077.2 | -0.025 |
| 1077.3 | -0.025 |
| 1077.4 | -0.025 |
| 1077.5 | -0.025 |
| 1077.6 | -0.025 |
| 1077.7 | -0.025 |
| 1077.8 | -0.025 |
| 1077.9 | -0.025 |
| 1078.0 | -0.025 |
| 1078.1 | -0.025 |
| 1078.2 | -0.025 |
| 1078.3 | -0.025 |
| 1078.4 | -0.025 |
| 1078.5 | -0.025 |
| 1078.6 | -0.025 |
| 1078.7 | -0.025 |
| 1078.8 | -0.025 |
| 1078.9 | -0.025 |
| 1079.0 | -0.025 |
| 1079.1 | -0.025 |
| 1079.2 | -0.025 |
| 1079.3 | -0.025 |
| 1079.4 | -0.025 |
| 1079.5 | -0.025 |
| 1079.6 | -0.025 |
| 1079.7 | -0.025 |
| 1079.8 | -0.025 |
| 1079.9 | -0.025 |
| 1080.0 | -0.025 |
| 1080.1 | -0.025 |
| 1080.2 | -0.025 |
| 1080.3 | -0.025 |
| 1080.4 | -0.025 |
| 1080.5 | -0.025 |
| 1080.6 | -0.025 |
| 1080.7 | -0.025 |
| 1080.8 | -0.025 |
| 1080.9 | -0.025 |
| 1081.0 | -0.025 |
| 1081.1 | -0.025 |
| 1081.2 | -0.025 |
| 1081.3 | -0.025 |
| 1081.4 | -0.025 |
| 1081.5 | -0.025 |
| 1081.6 | -0.025 |
| 1081.7 | -0.025 |
| 1081.8 | -0.025 |
| 1081.9 | -0.025 |
| 1082.0 | -0.025 |
| 1082.1 | -0.025 |
| 1082.2 | -0.025 |
| 1082.3 | -0.025 |
| 1082.4 | -0.025 |
| 1082.5 | -0.025 |
| 1082.6 | -0.025 |
| 1082.7 | -0.025 |
| 1082.8 | -0.025 |
| 1082.9 | -0.025 |
| 1083.0 | -0.025 |
| 1083.1 | -0.025 |
| 1083.2 | -0.025 |
| 1083.3 | -0.025 |
| 1083.4 | -0.025 |
| 1083.5 | -0.025 |
| 1083.6 | -0.025 |
| 1083.7 | -0.025 |
| 1083.8 | -0.025 |
| 1083.9 | -0.025 |
| 1084.0 | -0.025 |
| 1084.1 | -0.025 |
| 1084.2 | -0.025 |
| 1084.3 | -0.025 |
| 1084.4 | -0.025 |
| 1084.5 | -0.025 |
| 1084.6 | -0.025 |
| 1084.7 | -0.025 |
| 1084.8 | -0.025 |
| 1084.9 | -0.025 |
| 1085.0 | -0.025 |
| 1085.1 | -0.025 |
| 1085.2 | -0.025 |
| 1085.3 | -0.025 |
| 1085.4 | -0.025 |
| 1085.5 | -0.025 |
| 1085.6 | -0.025 |
| 1085.7 | -0.025 |
| 1085.8 | -0.025 |
| 1085.9 | -0.025 |
| 1086.0 | -0.025 |
| 1086.1 | -0.025 |
| 1086.2 | -0.025 |
| 1086.3 | -0.025 |
| 1086.4 | -0.025 |
| 1086.5 | -0.025 |
| 1086.6 | -0.025 |
| 1086.7 | -0.025 |
| 1086.8 | -0.025 |
| 1086.9 | -0.025 |
| 1087.0 | -0.025 |
| 1087.1 | -0.025 |
| 1087.2 | -0.025 |
| 1087.3 | -0.025 |
| 1087.4 | -0.025 |
| 1087.5 | -0.025 |
| 1087.6 | -0.025 |
| 1087.7 | -0.025 |
| 1087.8 | -0.025 |
| 1087.9 | -0.025 |
| 1088.0 | -0.025 |
| 1088.1 | -0.025 |
| 1088.2 | -0.025 |
| 1088.3 | -0.025 |
| 1088.4 | -0.025 |
| 1088.5 | -0.025 |
| 1088.6 | -0.025 |
| 1088.7 | -0.025 |
| 1088.8 | -0.025 |
| 1088.9 | -0.025 |
| 1089.0 | -0.025 |
| 1089.1 | -0.025 |
| 1089.2 | -0.025 |
| 1089.3 | -0.025 |
| 1089.4 | -0.025 |
| 1089.5 | -0.025 |
| 1089.6 | -0.025 |
| 1089.7 | -0.025 |
| 1089.8 | -0.025 |
| 1089.9 | -0.025 |
| 1090.0 | -0.025 |
| 1090.1 | -0.025 |
| 1090.2 | -0.025 |
| 1090.3 | -0.025 |
| 1090.4 | -0.025 |
| 1090.5 | -0.025 |
| 1090.6 | -0.025 |
| 1090.7 | -0.025 |
| 1090.8 | -0.025 |
| 1090.9 | -0.025 |
| 1091.0 | -0.025 |
| 1091.1 | -0.025 |
| 1091.2 | -0.025 |
| 1091.3 | -0.025 |
| 1091.4 | -0.025 |
| 1091.5 | -0.025 |
| 1091.6 | -0.025 |
| 1091.7 | -0.025 |
| 1091.8 | -0.025 |
| 1091.9 | -0.025 |
| 1092.0 | -0.025 |
| 1092.1 | -0.025 |
| 1092.2 | -0.025 |
| 1092.3 | -0.025 |
| 1092.4 | -0.025 |
| 1092.5 | -0.025 |
| 1092.6 | -0.025 |
| 1092.7 | -0.025 |
| 1092.8 | -0.025 |
| 1092.9 | -0.025 |
| 1093.0 | -0.025 |
| 1093.1 | -0.025 |
| 1093.2 | -0.025 |
| 1093.3 | -0.025 |
| 1093.4 | -0.025 |
| 1093.5 | -0.025 |
| 1093.6 | -0.025 |
| 1093.7 | -0.025 |
| 1093.8 | -0.025 |
| 1093.9 | -0.025 |
| 1094.0 | -0.025 |
| 1094.1 | -0.025 |
| 1094.2 | -0.025 |
| 1094.3 | -0.025 |
| 1094.4 | -0.025 |
| 1094.5 | -0.025 |
| 1094.6 | -0.025 |
| 1094.7 | -0.025 |
| 1094.8 | -0.025 |
| 1094.9 | -0.025 |
| 1095.0 | -0.025 |
| 1095.1 | -0.025 |
| 1095.2 | -0.025 |
| 1095.3 | -0.025 |
| 1095.4 | -0.025 |
| 1095.5 | -0.025 |
| 1095.6 | -0.025 |
| 1095.7 | -0.025 |
| 1095.8 | -0.025 |
| 1095.9 | -0.025 |
| 1096.0 | -0.025 |
| 1096.1 | -0.025 |
| 1096.2 | -0.025 |
| 1096.3 | -0.025 |
| 1096.4 | -0.025 |
| 1096.5 | -0.025 |
| 1096.6 | -0.025 |
| 1096.7 | -0.025 |
| 1096.8 | -0.025 |
| 1096.9 | -0.025 |
| 1097.0 | -0.025 |
| 1097.1 | -0.025 |
| 1097.2 | -0.025 |
| 1097.3 | -0.025 |
| 1097.4 | -0.025 |
| 1097.5 | -0.025 |
| 1097.6 | -0.025 |
| 1097.7 | -0.025 |
| 1097.8 | -0.025 |
| 1097.9 | -0.025 |
| 1098.0 | -0.025 |
| 1098.1 | -0.025 |
| 1098.2 | -0.025 |
| 1098.3 | -0.025 |
| 1098.4 | -0.025 |
| 1098.5 | -0.025 |
| 1098.6 | -0.025 |
| 1098.7 | -0.025 |
| 1098.8 | -0.025 |
| 1098.9 | -0.025 |
| 1099.0 | -0.025 |
| 1099.1 | -0.025 |
| 1099.2 | -0.025 |
| 1099.3 | -0.025 |
| 1099.4 | -0.025 |
| 1099.5 | -0.025 |
| 1099.6 | -0.025 |
| 1099.7 | -0.025 |
| 1099.8 | -0.025 |
| 1099.9 | -0.025 |
| 1100.0 | -0.025 |
| 1100.1 | -0.025 |
| 1100.2 | -0.025 |
| 1100.3 | -0.025 |
| 1100.4 | -0.025 |
| 1100.5 | -0.025 |
| 1100.6 | -0.025 |
| 1100.7 | -0.025 |
| 1100.8 | -0.025 |
| 1100.9 | -0.025 |
| 1101.0 | -0.025 |
| 1101.1 | -0.025 |
| 1101.2 | -0.025 |
| 1101.3 | -0.025 |
| 1101.4 | -0.025 |
| 1101.5 | -0.025 |
| 1101.6 | -0.025 |
| 1101.7 | -0.025 |
| 1101.8 | -0.025 |
| 1101.9 | -0.025 |
| 1102.0 | -0.025 |
| 1102.1 | -0.025 |
| 1102.2 | -0.025 |
| 1102.3 | -0.025 |
| 1102.4 | -0.025 |
| 1102.5 | -0.025 |
| 1102.6 | -0.025 |
| 1102.7 | -0.025 |
| 1102.8 | -0.025 |
| 1102.9 | -0.025 |
| 1103.0 | -0.025 |
| 1103.1 | -0.025 |
| 1103.2 | -0.025 |
| 1103.3 | -0.025 |
| 1103.4 | -0.025 |
| 1103.5 | -0.025 |
| 1103.6 | -0.025 |
| 1103.7 | -0.025 |
| 1103.8 | -0.025 |
| 1103.9 | -0.025 |
| 1104.0 | -0.025 |
| 1104.1 | -0.025 |
| 1104.2 | -0.025 |
| 1104.3 | -0.025 |
| 1104.4 | -0.025 |
| 1104.5 | -0.025 |
| 1104.6 | -0.025 |
| 1104.7 | -0.025 |
| 1104.8 | -0.025 |
| 1104.9 | -0.025 |
| 1105.0 | -0.025 |
| 1105.1 | -0.025 |
| 1105.2 | -0.025 |
| 1105.3 | -0.025 |
| 1105.4 | -0.025 |
| 1105.5 | -0.025 |
| 1105.6 | -0.025 |
| 1105.7 | -0.025 |
| 1105.8 | -0.025 |
| 1105.9 | -0.025 |
| 1106.0 | -0.025 |
| 1106.1 | -0.025 |
| 1106.2 | -0.025 |
| 1106.3 | -0.025 |
| 1106.4 | -0.025 |
| 1106.5 | -0.025 |
| 1106.6 | -0.025 |
| 1106.7 | -0.025 |
| 1106.8 | -0.025 |
| 1106.9 | -0.025 |
| 1107.0 | -0.025 |
| 1107.1 | -0.025 |
| 1107.2 | -0.025 |
| 1107.3 | -0.025 |
| 1107.4 | -0.025 |
| 1107.5 | -0.025 |
| 1107.6 | -0.025 |
| 1107.7 | -0.025 |
| 1107.8 | -0.025 |
| 1107.9 | -0.025 |
| 1108.0 | -0.025 |
| 1108.1 | -0.025 |
| 1108.2 | -0.025 |
| 1108.3 | -0.025 |
| 1108.4 | -0.025 |
| 1108.5 | -0.025 |
| 1108.6 | -0.025 |
| 1108.7 | -0.025 |
| 1108.8 | -0.025 |
| 1108.9 | -0.025 |
| 1109.0 | -0.025 |
| 1109.1 | -0.025 |
| 1109.2 | -0.025 |
| 1109.3 | -0.025 |
| 1109.4 | -0.025 |
| 1109.5 | -0.025 |
| 1109.6 | -0.025 |
| 1109.7 | -0.025 |
| 1109.8 | -0.025 |
| 1109.9 | -0.025 |
| 1110.0 | -0.025 |
| 1110.1 | -0.025 |
| 1110.2 | -0.025 |
| 1110.3 | -0.025 |
| 1110.4 | -0.025 |
| 1110.5 | -0.025 |
| 1110.6 | -0.025 |
| 1110.7 | -0.025 |
| 1110.8 | -0.025 |
| 1110.9 | -0.025 |
| 1111.0 | -0.025 |
| 1111.1 | -0.025 |
| 1111.2 | -0.025 |
| 1111.3 | -0.025 |
| 1111.4 | -0.025 |
| 1111.5 | -0.025 |
| 1111.6 | -0.025 |
| 1111.7 | -0.025 |
| 1111.8 | -0.025 |
| 1111.9 | -0.025 |
| 1112.0 | -0.025 |
| 1112.1 | -0.025 |
| 1112.2 | -0.025 |
| 1112.3 | -0.025 |
| 1112.4 | -0.025 |
| 1112.5 | -0.025 |
| 1112.6 | -0.025 |
| 1112.7 | -0.025 |
| 1112.8 | -0.025 |
| 1112.9 | -0.025 |
| 1113.0 | -0.025 |
| 1113.1 | -0.025 |
| 1113.2 | -0.025 |
| 1113.3 | -0.025 |
| 1113.4 | -0.025 |
| 1113.5 | -0.025 |
| 1113.6 | -0.025 |
| 1113.7 | -0.025 |
| 1113.8 | -0.025 |
| 1113.9 | -0.025 |
| 1114.0 | -0.025 |
| 1114.1 | -0.025 |
| 1114.2 | -0.025 |
| 1114.3 | -0.025 |
| 1114.4 | -0.025 |
| 1114.5 | -0.025 |
| 1114.6 | -0.025 |
| 1114.7 | -0.025 |
| 1114.8 | -0.025 |
| 1114.9 | -0.025 |
| 1115.0 | -0.025 |
| 1115.1 | -0.025 |
| 1115.2 | -0.025 |
| 1115.3 | -0.025 |
| 1115.4 | -0.025 |
| 1115.5 | -0.025 |
| 1115.6 | -0.025 |
| 1115.7 | -0.025 |
| 1115.8 | -0.025 |
| 1115.9 | -0.025 |
| 1116.0 | -0.025 |
| 1116.1 | -0.025 |
| 1116.2 | -0.025 |
| 1116.3 | -0.025 |
| 1116.4 | -0.025 |
| 1116.5 | -0.025 |
| 1116.6 | -0.025 |
| 1116.7 | -0.025 |
| 1116.8 | -0.025 |
| 1116.9 | -0.025 |
| 1117.0 | -0.025 |
| 1117.1 | -0.025 |
| 1117.2 | -0.025 |
| 1117.3 | -0.025 |
| 1117.4 | -0.025 |
| 1117.5 | -0.025 |
| 1117.6 | -0.025 |
| 1117.7 | -0.025 |
| 1117.8 | -0.025 |
| 1117.9 | -0.025 |
| 1118.0 | -0.025 |
| 1118.1 | -0.025 |
| 1118.2 | -0.025 |
| 1118.3 | -0.025 |
| 1118.4 | -0.025 |
| 1118.5 | -0.025 |
| 1118.6 | -0.025 |
| 1118.7 | -0.025 |
| 1118.8 | -0.025 |
| 1118.9 | -0.025 |
| 1119.0 | -0.025 |
| 1119.1 | -0.025 |
| 1119.2 | -0.025 |
| 1119.3 | -0.025 |
| 1119.4 | -0.025 |
| 1119.5 | -0.025 |
| 1119.6 | -0.025 |
| 1119.7 | -0.025 |
| 1119.8 | -0.025 |
| 1119.9 | -0.025 |
| 1120.0 | -0.025 |
| 1120.1 | -0.025 |
| 1120.2 | -0.025 |
| 1120.3 | -0.025 |
| 1120.4 | -0.025 |
| 1120.5 | -0.025 |
| 1120.6 | -0.025 |
| 1120.7 | -0.025 |
| 1120.8 | -0.025 |
| 1120.9 | -0.025 |
| 1121.0 | -0.025 |
| 1121.1 | -0.025 |
| 1121.2 | -0.025 |
| 1121.3 | -0.025 |
| 1121.4 | -0.025 |
| 1121.5 | -0.025 |
| 1121.6 | -0.025 |
| 1121.7 | -0.025 |
| 1121.8 | -0.025 |
| 1121.9 | -0.025 |
| 1122.0 | -0.025 |
| 1122.1 | -0.025 |
| 1122.2 | -0.025 |
| 1122.3 | -0.025 |
| 1122.4 | -0.025 |
| 1122.5 | -0.025 |
| 1122.6 | -0.025 |
| 1122.7 | -0.025 |
| 1122.8 | -0.025 |
| 1122.9 | -0.025 |
| 1123.0 | -0.025 |
| 1123.1 | -0.025 |
| 1123.2 | -0.025 |
| 1123.3 | -0.025 |
| 1123.4 | -0.025 |
| 1123.5 | -0.025 |
| 1123.6 | -0.025 |
| 1123.7 | -0.025 |
| 1123.8 | -0.025 |
| 1123.9 | -0.025 |
| 1124.0 | -0.025 |
| 1124.1 | -0.025 |
| 1124.2 | -0.025 |
| 1124.3 | -0.025 |
| 1124.4 | -0.025 |
| 1124.5 | -0.025 |
| 1124.6 | -0.025 |
| 1124.7 | -0.025 |
| 1124.8 | -0.025 |
| 1124.9 | -0.025 |
| 1125.0 | -0.025 |
| 1125.1 | -0.025 |
| 1125.2 | -0.025 |
| 1125.3 | -0.025 |
| 1125.4 | -0.025 |
| 1125.5 | -0.025 |
| 1125.6 | -0.025 |
| 1125.7 | -0.025 |
| 1125.8 | -0.025 |
| 1125.9 | -0.025 |
| 1126.0 | -0.025 |
| 1126.1 | -0.025 |
| 1126.2 | -0.025 |
| 1126.3 | -0.025 |
| 1126.4 | -0.025 |
| 1126.5 | -0.025 |
| 1126.6 | -0.025 |
| 1126.7 | -0.025 |
| 1126.8 | -0.025 |
| 1126.9 | -0.025 |
| 1127.0 | -0.025 |
| 1127.1 | -0.025 |
| 1127.2 | -0.025 |
| 1127.3 | -0.025 |
| 1127.4 | -0.025 |
| 1127.5 | -0.025 |
| 1127.6 | -0.025 |
| 1127.7 | -0.025 |
| 1127.8 | -0.025 |
| 1127.9 | -0.025 |
| 1128.0 | -0.025 |
| 1128.1 | -0.025 |
| 1128.2 | -0.025 |
| 1128.3 | -0.025 |
| 1128.4 | -0.025 |
| 1128.5 | -0.025 |
| 1128.6 | -0.025 |
| 1128.7 | -0.025 |
| 1128.8 | -0.025 |
| 1128.9 | -0.025 |
| 1129.0 | -0.025 |
| 1129.1 | -0.025 |
| 1129.2 | -0.025 |
| 1129.3 | -0.025 |
| 1129.4 | -0.025 |
| 1129.5 | -0.025 |
| 1129.6 | -0.025 |
| 1129.7 | -0.025 |
| 1129.8 | -0.025 |
| 1129.9 | -0.025 |
| 1130.0 | -0.025 |
| 1130.1 | -0.025 |
| 1130.2 | -0.025 |
| 1130.3 | -0.025 |
| 1130.4 | -0.025 |
| 1130.5 | -0.025 |
| 1130.6 | -0.025 |
| 1130.7 | -0.025 |
| 1130.8 | -0.025 |
| 1130.9 | -0.025 |
| 1131.0 | -0.025 |
| 1131.1 | -0.025 |
| 1131.2 | -0.025 |
| 1131.3 | -0.025 |
| 1131.4 | -0.025 |
| 1131.5 | -0.025 |
| 1131.6 | -0.025 |
| 1131.7 | -0.025 |
| 1131.8 | -0.025 |
| 1131.9 | -0.025 |
| 1132.0 | -0.025 |
| 1132.1 | -0.025 |
| 1132.2 | -0.025 |
| 1132.3 | -0.025 |
| 1132.4 | -0.025 |
| 1132.5 | -0.025 |
| 1132.6 | -0.025 |
| 1132.7 | -0.025 |
| 1132.8 | -0.025 |
| 1132.9 | -0.025 |
| 1133.0 | -0.025 |
| 1133.1 | -0.025 |
| 1133.2 | -0.025 |
| 1133.3 | -0.025 |
| 1133.4 | -0.025 |
| 1133.5 | -0.025 |
| 1133.6 | -0.025 |
| 1133.7 | -0.025 |
| 1133.8 | -0.025 |
| 1133.9 | -0.025 |
| 1134.0 | -0.025 |
| 1134.1 | -0.025 |
| 1134.2 | -0.025 |
| 1134.3 | -0.025 |
| 1134.4 | -0.025 |
| 1134.5 | -0.025 |
| 1134.6 | -0.025 |
| 1134.7 | -0.025 |
| 1134.8 | -0.025 |
| 1134.9 | -0.025 |
| 1135.0 | -0.025 |
| 1135.1 | -0.025 |
| 1135.2 | -0.025 |
| 1135.3 | -0.025 |
| 1135.4 | -0.025 |
| 1135.5 | -0.025 |
| 1135.6 | -0.025 |
| 1135.7 | -0.025 |
| 1135.8 | -0.025 |
| 1135.9 | -0.025 |
| 1136.0 | -0.025 |
| 1136.1 | -0.025 |
| 1136.2 | -0.025 |
| 1136.3 | -0.025 |
| 1136.4 | -0.025 |
| 1136.5 | -0.025 |
| 1136.6 | -0.025 |
| 1136.7 | -0.025 |
| 1136.8 | -0.025 |
| 1136.9 | -0.025 |
| 1137.0 | -0.025 |
| 1137.1 | -0.025 |
| 1137.2 | -0.025 |
| 1137.3 | -0.025 |
| 1137.4 | -0.025 |
| 1137.5 | -0.025 |
| 1137.6 | -0.025 |
| 1137.7 | -0.025 |
| 1137.8 | -0.025 |
| 1137.9 | -0.025 |
| 1138.0 | -0.025 |
| 1138.1 | -0.025 |
| 1138.2 | -0.025 |
| 1138.3 | -0.025 |
| 1138.4 | -0.025 |
| 1138.5 | -0.025 |
| 1138.6 | -0.025 |
| 1138.7 | -0.025 |
| 1138.8 | -0.025 |
| 1138.9 | -0.025 |
| 1139.0 | -0.025 |
| 1139.1 | -0.025 |
| 1139.2 | -0.025 |
| 1139.3 | -0.025 |
| 1139.4 | -0.025 |
| 1139.5 | -0.025 |
| 1139.6 | -0.025 |
| 1139.7 | -0.025 |
| 1139.8 | -0.025 |
| 1139.9 | -0.025 |
| 1140.0 | -0.025 |
| 1140.1 | -0.025 |
| 1140.2 | -0.025 |
| 1140.3 | -0.025 |
| 1140.4 | -0.025 |
| 1140.5 | -0.025 |
| 1140.6 | -0.025 |
| 1140.7 | -0.025 |
| 1140.8 | -0.025 |
| 1140.9 | -0.025 |
| 1141.0 | -0.025 |
| 1141.1 | -0.025 |
| 1141.2 | -0.025 |
| 1141.3 | -0.025 |
| 1141.4 | -0.025 |
| 1141.5 | -0.025 |
| 1141.6 | -0.025 |
| 1141.7 | -0.025 |
| 1141.8 | -0.025 |
| 1141.9 | -0.025 |
| 1142.0 | -0.025 |
| 1142.1 | -0.025 |
| 1142.2 | -0.025 |
| 1142.3 | -0.025 |
| 1142.4 | -0.025 |
| 1142.5 | -0.025 |
| 1142.6 | -0.025 |
| 1142.7 | -0.025 |
| 1142.8 | -0.025 |
| 1142.9 | -0.025 |
| 1143.0 | -0.025 |
| 1143.1 | -0.025 |
| 1143.2 | -0.025 |
| 1143.3 | -0.025 |
| 1143.4 | -0.025 |
| 1143.5 | -0.025 |
| 1143.6 | -0.025 |
| 1143.7 | -0.025 |
| 1143.8 | -0.025 |
| 1143.9 | -0.025 |
| 1144.0 | -0.025 |
| 1144.1 | -0.025 |
| 1144.2 | -0.025 |
| 1144.3 | -0.025 |
| 1144.4 | -0.025 |
| 1144.5 | -0.025 |
| 1144.6 | -0.025 |
| 1144.7 | -0.025 |
| 1144.8 | -0.025 |
| 1144.9 | -0.025 |
| 1145.0 | -0.025 |
| 1145.1 | -0.025 |
| 1145.2 | -0.025 |
| 1145.3 | -0.025 |
| 1145.4 | -0.025 |
| 1145.5 | -0.025 |
| 1145.6 | -0.025 |
| 1145.7 | -0.025 |
| 1145.8 | -0.025 |
| 1145.9 | -0.025 |
| 1146.0 | -0.025 |
| 1146.1 | -0.025 |
| 1146.2 | -0.025 |
| 1146.3 | -0.025 |
| 1146.4 | -0.025 |
| 1146.5 | -0.025 |
| 1146.6 | -0.025 |
| 1146.7 | -0.025 |
| 1146.8 | -0.025 |
| 1146.9 | -0.025 |
| 1147.0 | -0.025 |
| 1147.1 | -0.025 |
| 1147.2 | -0.025 |
| 1147.3 | -0.025 |
| 1147.4 | -0.025 |
| 1147.5 | -0.025 |
| 1147.6 | -0.025 |
| 1147.7 | -0.025 |
| 1147.8 | -0.025 |
| 1147.9 | -0.025 |
| 1148.0 | -0.025 |
| 1148.1 | -0.025 |
| 1148.2 | -0.025 |
| 1148.3 | -0.025 |
| 1148.4 | -0.025 |
| 1148.5 | -0.025 |
| 1148.6 | -0.025 |
| 1148.7 | -0.025 |
| 1148.8 | -0.025 |
| 1148.9 | -0.025 |
| 1149.0 | -0.025 |
| 1149.1 | -0.025 |
| 1149.2 | -0.025 |
| 1149.3 | -0.025 |
| 1149.4 | -0.025 |
| 1149.5 | -0.025 |
| 1149.6 | -0.025 |
| 1149.7 | -0.025 |
| 1149.8 | -0.025 |
| 1149.9 | -0.025 |
| 1150.0 | -0.025 |
| 1150.1 | -0.025 |
| 1150.2 | -0.025 |
| 1150.3 | -0.025 |
| 1150.4 | -0.025 |
| 1150.5 | -0.025 |
| 1150.6 | -0.025 |
| 1150.7 | -0.025 |
| 1150.8 | -0.025 |
| 1150.9 | -0.025 |
| 1151.0 | -0.025 |
| 1151.1 | -0.025 |
| 1151.2 | -0.025 |
| 1151.3 | -0.025 |
| 1151.4 | -0.025 |
| 1151.5 | -0.025 |
| 1151.6 | -0.025 |
| 1151.7 | -0.025 |
| 1151.8 | -0.025 |
| 1151.9 | -0.025 |
| 1152.0 | -0.025 |
| 1152.1 | -0.025 |
| 1152.2 | -0.025 |
| 1152.3 | -0.025 |
| 1152.4 | -0.025 |
| 1152.5 | -0.025 |
| 1152.6 | -0.025 |
| 1152.7 | -0.025 |
| 1152.8 | -0.025 |
| 1152.9 | -0.025 |
| 1153.0 | -0.025 |
| 1153.1 | -0.025 |
| 1153.2 | -0.025 |
| 1153.3 | -0.025 |
| 1153.4 | -0.025 |
| 1153.5 | -0.025 |
| 1153.6 | -0.025 |
| 1153.7 | -0.025 |
| 1153.8 | -0.025 |
| 1153.9 | -0.025 |
| 1154.0 | -0.025 |
| 1154.1 | -0.025 |
| 1154.2 | -0.025 |
| 1154.3 | -0.025 |
| 1154.4 | -0.025 |
| 1154.5 | -0.025 |
| 1154.6 | -0.025 |
| 1154.7 | -0.025 |
| 1154.8 | -0.025 |
| 1154.9 | -0.025 |
| 1155.0 | -0.025 |
| 1155.1 | -0.025 |
| 1155.2 | -0.025 |
| 1155.3 | -0.025 |
| 1155.4 | -0.025 |
| 1155.5 | -0.025 |
| 1155.6 | -0.025 |
| 1155.7 | -0.025 |
| 1155.8 | -0.025 |
| 1155.9 | -0.025 |
| 1156.0 | -0.025 |
| 1156.1 | -0.026 |
| 1156.2 | -0.026 |
| 1156.3 | -0.026 |
| 1156.4 | -0.026 |
| 1156.5 | -0.026 |
| 1156.6 | -0.026 |
| 1156.7 | -0.026 |
| 1156.8 | -0.026 |
| 1156.9 | -0.026 |
| 1157.0 | -0.026 |
| 1157.1 | -0.026 |
| 1157.2 | -0.026 |
| 1157.3 | -0.026 |
| 1157.4 | -0.026 |
| 1157.5 | -0.026 |
| 1157.6 | -0.026 |
| 1157.7 | -0.026 |
| 1157.8 | -0.026 |
| 1157.9 | -0.026 |
| 1158.0 | -0.026 |
| 1158.1 | -0.026 |
| 1158.2 | -0.026 |
| 1158.3 | -0.026 |
| 1158.4 | -0.026 |
| 1158.5 | -0.026 |
| 1158.6 | -0.026 |
| 1158.7 | -0.026 |
| 1158.8 | -0.026 |
| 1158.9 | -0.026 |
| 1159.0 | -0.026 |
| 1159.1 | -0.026 |
| 1159.2 | -0.026 |
| 1159.3 | -0.026 |
| 1159.4 | -0.026 |
| 1159.5 | -0.026 |
| 1159.6 | -0.026 |
| 1159.7 | -0.026 |
| 1159.8 | -0.026 |
| 1159.9 | -0.026 |
| 1160.0 | -0.026 |
| 1160.1 | -0.026 |
| 1160.2 | -0.026 |
| 1160.3 | -0.026 |
| 1160.4 | -0.026 |
| 1160.5 | -0.026 |
| 1160.6 | -0.026 |
| 1160.7 | -0.026 |
| 1160.8 | -0.026 |
| 1160.9 | -0.026 |
| 1161.0 | -0.026 |
| 1161.1 | -0.026 |
| 1161.2 | -0.026 |
| 1161.3 | -0.026 |
| 1161.4 | -0.026 |
| 1161.5 | -0.026 |
| 1161.6 | -0.026 |
| 1161.7 | -0.026 |
| 1161.8 | -0.026 |
| 1161.9 | -0.026 |
| 1162.0 | -0.026 |
| 1162.1 | -0.026 |
| 1162.2 | -0.026 |
| 1162.3 | -0.026 |
| 1162.4 | -0.026 |
| 1162.5 | -0.026 |
| 1162.6 | -0.026 |
| 1162.7 | -0.026 |
| 1162.8 | -0.026 |
| 1162.9 | -0.026 |
| 1163.0 | -0.026 |
| 1163.1 | -0.026 |
| 1163.2 | -0.026 |
| 1163.3 | -0.026 |
| 1163.4 | -0.026 |
| 1163.5 | -0.026 |
| 1163.6 | -0.026 |
| 1163.7 | -0.026 |
| 1163.8 | -0.026 |
| 1163.9 | -0.026 |
| 1164.0 | -0.026 |
| 1164.1 | -0.026 |
| 1164.2 | -0.026 |
| 1164.3 | -0.026 |
| 1164.4 | -0.026 |
| 1164.5 | -0.026 |
| 1164.6 | -0.026 |
| 1164.7 | -0.026 |
| 1164.8 | -0.026 |
| 1164.9 | -0.026 |
| 1165.0 | -0.026 |
| 1165.1 | -0.026 |
| 1165.2 | -0.026 |
| 1165.3 | -0.026 |
| 1165.4 | -0.026 |
| 1165.5 | -0.026 |
| 1165.6 | -0.026 |
| 1165.7 | -0.026 |
| 1165.8 | -0.026 |
| 1165.9 | -0.026 |
| 1166.0 | -0.026 |
| 1166.1 | -0.026 |
| 1166.2 | -0.026 |
| 1166.3 | -0.026 |
| 1166.4 | -0.026 |
| 1166.5 | -0.026 |
| 1166.6 | -0.026 |
| 1166.7 | -0.026 |
| 1166.8 | -0.026 |
| 1166.9 | -0.026 |
| 1167.0 | -0.026 |
| 1167.1 | -0.026 |
| 1167.2 | -0.026 |
| 1167.3 | -0.026 |
| 1167.4 | -0.026 |
| 1167.5 | -0.026 |
| 1167.6 | -0.026 |
| 1167.7 | -0.026 |
| 1167.8 | -0.026 |
| 1167.9 | -0.026 |
| 1168.0 | -0.026 |
| 1168.1 | -0.026 |
| 1168.2 | -0.026 |
| 1168.3 | -0.026 |
| 1168.4 | -0.026 |
| 1168.5 | -0.026 |
| 1168.6 | -0.026 |
| 1168.7 | -0.026 |
| 1168.8 | -0.026 |
| 1168.9 | -0.026 |
| 1169.0 | -0.026 |
| 1169.1 | -0.026 |
| 1169.2 | -0.026 |
| 1169.3 | -0.026 |
| 1169.4 | -0.026 |
| 1169.5 | -0.026 |
| 1169.6 | -0.026 |
| 1169.7 | -0.026 |
| 1169.8 | -0.026 |
| 1169.9 | -0.026 |
| 1170.0 | -0.026 |
| 1170.1 | -0.026 |
| 1170.2 | -0.026 |
| 1170.3 | -0.026 |
| 1170.4 | -0.026 |
| 1170.5 | -0.026 |
| 1170.6 | -0.026 |
| 1170.7 | -0.026 |
| 1170.8 | -0.026 |
| 1170.9 | -0.026 |
| 1171.0 | -0.026 |
| 1171.1 | -0.026 |
| 1171.2 | -0.026 |
| 1171.3 | -0.026 |
| 1171.4 | -0.026 |
| 1171.5 | -0.026 |
| 1171.6 | -0.026 |
| 1171.7 | -0.026 |
| 1171.8 | -0.026 |
| 1171.9 | -0.026 |
| 1172.0 | -0.026 |
| 1172.1 | -0.026 |
| 1172.2 | -0.026 |
| 1172.3 | -0.026 |
| 1172.4 | -0.026 |
| 1172.5 | -0.026 |
| 1172.6 | -0.026 |
| 1172.7 | -0.026 |
| 1172.8 | -0.026 |
| 1172.9 | -0.026 |
| 1173.0 | -0.026 |
| 1173.1 | -0.026 |
| 1173.2 | -0.026 |
| 1173.3 | -0.026 |
| 1173.4 | -0.026 |
| 1173.5 | -0.026 |
| 1173.6 | -0.026 |
| 1173.7 | -0.026 |
| 1173.8 | -0.026 |
| 1173.9 | -0.026 |
| 1174.0 | -0.026 |
| 1174.1 | -0.026 |
| 1174.2 | -0.026 |
| 1174.3 | -0.026 |
| 1174.4 | -0.026 |
| 1174.5 | -0.026 |
| 1174.6 | -0.026 |
| 1174.7 | -0.026 |
| 1174.8 | -0.026 |
| 1174.9 | -0.026 |
| 1175.0 | -0.026 |
| 1175.1 | -0.026 |
| 1175.2 | -0.026 |
| 1175.3 | -0.026 |
| 1175.4 | -0.026 |
| 1175.5 | -0.026 |
| 1175.6 | -0.026 |
| 1175.7 | -0.026 |
| 1175.8 | -0.026 |
| 1175.9 | -0.026 |
| 1176.0 | -0.026 |
| 1176.1 | -0.026 |
| 1176.2 | -0.026 |
| 1176.3 | -0.026 |
| 1176.4 | -0.026 |
| 1176.5 | -0.026 |
| 1176.6 | -0.026 |
| 1176.7 | -0.026 |
| 1176.8 | -0.026 |
| 1176.9 | -0.026 |
| 1177.0 | -0.026 |
| 1177.1 | -0.026 |
| 1177.2 | -0.026 |
| 1177.3 | -0.026 |
| 1177.4 | -0.026 |
| 1177.5 | -0.026 |
| 1177.6 | -0.026 |
| 1177.7 | -0.026 |
| 1177.8 | -0.026 |
| 1177.9 | -0.026 |
| 1178.0 | -0.026 |
| 1178.1 | -0.026 |
| 1178.2 | -0.026 |
| 1178.3 | -0.026 |
| 1178.4 | -0.026 |
| 1178.5 | -0.026 |
| 1178.6 | -0.026 |
| 1178.7 | -0.026 |
| 1178.8 | -0.026 |
| 1178.9 | -0.026 |
| 1179.0 | -0.026 |
| 1179.1 | -0.026 |
| 1179.2 | -0.026 |
| 1179.3 | -0.026 |
| 1179.4 | -0.026 |
| 1179.5 | -0.026 |
| 1179.6 | -0.026 |
| 1179.7 | -0.026 |
| 1179.8 | -0.026 |
| 1179.9 | -0.026 |
| 1180.0 | -0.026 |
| 1180.1 | -0.026 |
| 1180.2 | -0.026 |
| 1180.3 | -0.026 |
| 1180.4 | -0.026 |
| 1180.5 | -0.026 |
| 1180.6 | -0.026 |
| 1180.7 | -0.026 |
| 1180.8 | -0.026 |
| 1180.9 | -0.026 |
| 1181.0 | -0.026 |
| 1181.1 | -0.026 |
| 1181.2 | -0.026 |
| 1181.3 | -0.026 |
| 1181.4 | -0.026 |
| 1181.5 | -0.026 |
| 1181.6 | -0.026 |
| 1181.7 | -0.026 |
| 1181.8 | -0.026 |
| 1181.9 | -0.026 |
| 1182.0 | -0.026 |
| 1182.1 | -0.026 |
| 1182.2 | -0.026 |
| 1182.3 | -0.026 |
| 1182.4 | -0.026 |
| 1182.5 | -0.026 |
| 1182.6 | -0.026 |
| 1182.7 | -0.026 |
| 1182.8 | -0.026 |
| 1182.9 | -0.026 |
| 1183.0 | -0.026 |
| 1183.1 | -0.026 |
| 1183.2 | -0.026 |
| 1183.3 | -0.026 |
| 1183.4 | -0.026 |
| 1183.5 | -0.026 |
| 1183.6 | -0.026 |
| 1183.7 | -0.026 |
| 1183.8 | -0.026 |
| 1183.9 | -0.026 |
| 1184.0 | -0.026 |
| 1184.1 | -0.026 |
| 1184.2 | -0.026 |
| 1184.3 | -0.026 |
| 1184.4 | -0.026 |
| 1184.5 | -0.026 |
| 1184.6 | -0.026 |
| 1184.7 | -0.026 |
| 1184.8 | -0.026 |
| 1184.9 | -0.026 |
| 1185.0 | -0.026 |
| 1185.1 | -0.026 |
| 1185.2 | -0.026 |
| 1185.3 | -0.026 |
| 1185.4 | -0.026 |
| 1185.5 | -0.026 |
| 1185.6 | -0.026 |
| 1185.7 | -0.026 |
| 1185.8 | -0.026 |
| 1185.9 | -0.026 |
| 1186.0 | -0.026 |
| 1186.1 | -0.026 |
| 1186.2 | -0.026 |
| 1186.3 | -0.026 |
| 1186.4 | -0.026 |
| 1186.5 | -0.026 |
| 1186.6 | -0.026 |
| 1186.7 | -0.026 |
| 1186.8 | -0.026 |
| 1186.9 | -0.026 |
| 1187.0 | -0.026 |
| 1187.1 | -0.026 |
| 1187.2 | -0.026 |
| 1187.3 | -0.026 |
| 1187.4 | -0.026 |
| 1187.5 | -0.026 |
| 1187.6 | -0.026 |
| 1187.7 | -0.026 |
| 1187.8 | -0.026 |
| 1187.9 | -0.026 |
| 1188.0 | -0.026 |
| 1188.1 | -0.026 |
| 1188.2 | -0.026 |
| 1188.3 | -0.026 |
| 1188.4 | -0.026 |
| 1188.5 | -0.026 |
| 1188.6 | -0.026 |
| 1188.7 | -0.026 |
| 1188.8 | -0.026 |
| 1188.9 | -0.026 |
| 1189.0 | -0.026 |
| 1189.1 | -0.026 |
| 1189.2 | -0.026 |
| 1189.3 | -0.026 |
| 1189.4 | -0.026 |
| 1189.5 | -0.026 |
| 1189.6 | -0.026 |
| 1189.7 | -0.026 |
| 1189.8 | -0.026 |
| 1189.9 | -0.026 |
| 1190.0 | -0.026 |
| 1190.1 | -0.026 |
| 1190.2 | -0.026 |
| 1190.3 | -0.026 |
| 1190.4 | -0.026 |
| 1190.5 | -0.026 |
| 1190.6 | -0.026 |
| 1190.7 | -0.026 |
| 1190.8 | -0.026 |
| 1190.9 | -0.026 |
| 1191.0 | -0.026 |
| 1191.1 | -0.026 |
| 1191.2 | -0.026 |
| 1191.3 | -0.026 |
| 1191.4 | -0.026 |
| 1191.5 | -0.026 |
| 1191.6 | -0.026 |
| 1191.7 | -0.026 |
| 1191.8 | -0.026 |
| 1191.9 | -0.026 |
| 1192.0 | -0.026 |
| 1192.1 | -0.026 |
| 1192.2 | -0.026 |
| 1192.3 | -0.026 |
| 1192.4 | -0.026 |
| 1192.5 | -0.026 |
| 1192.6 | -0.026 |
| 1192.7 | -0.026 |
| 1192.8 | -0.026 |
| 1192.9 | -0.026 |
| 1193.0 | -0.026 |
| 1193.1 | -0.026 |
| 1193.2 | -0.026 |
| 1193.3 | -0.026 |
| 1193.4 | -0.026 |
| 1193.5 | -0.026 |
| 1193.6 | -0.026 |
| 1193.7 | -0.026 |
| 1193.8 | -0.026 |
| 1193.9 | -0.026 |
| 1194.0 | -0.026 |
| 1194.1 | -0.026 |
| 1194.2 | -0.026 |
| 1194.3 | -0.026 |
| 1194.4 | -0.026 |
| 1194.5 | -0.026 |
| 1194.6 | -0.026 |
| 1194.7 | -0.026 |
| 1194.8 | -0.026 |
| 1194.9 | -0.026 |
| 1195.0 | -0.026 |
| 1195.1 | -0.026 |
| 1195.2 | -0.026 |
| 1195.3 | -0.026 |
| 1195.4 | -0.026 |
| 1195.5 | -0.026 |
| 1195.6 | -0.026 |
| 1195.7 | -0.026 |
| 1195.8 | -0.026 |
| 1195.9 | -0.026 |
| 1196.0 | -0.026 |
| 1196.1 | -0.026 |
| 1196.2 | -0.026 |
| 1196.3 | -0.026 |
| 1196.4 | -0.026 |
| 1196.5 | -0.026 |
| 1196.6 | -0.026 |
| 1196.7 | -0.026 |
| 1196.8 | -0.026 |
| 1196.9 | -0.026 |
| 1197.0 | -0.026 |
| 1197.1 | -0.026 |
| 1197.2 | -0.026 |
| 1197.3 | -0.026 |
| 1197.4 | -0.026 |
| 1197.5 | -0.026 |
| 1197.6 | -0.026 |
| 1197.7 | -0.026 |
| 1197.8 | -0.026 |
| 1197.9 | -0.026 |
| 1198.0 | -0.026 |
| 1198.1 | -0.026 |
| 1198.2 | -0.026 |
| 1198.3 | -0.026 |
| 1198.4 | -0.026 |
| 1198.5 | -0.026 |
| 1198.6 | -0.026 |
| 1198.7 | -0.026 |
| 1198.8 | -0.026 |
| 1198.9 | -0.026 |
| 1199.0 | -0.026 |
| 1199.1 | -0.026 |
| 1199.2 | -0.026 |
| 1199.3 | -0.026 |
| 1199.4 | -0.026 |
| 1199.5 | -0.026 |
| 1199.6 | -0.026 |
| 1199.7 | -0.026 |
| 1199.8 | -0.026 |
| 1199.9 | -0.026 |
| 1200.0 | -0.026 |
| 1200.1 | -0.026 |
| 1200.2 | -0.026 |
| 1200.3 | -0.026 |
| 1200.4 | -0.026 |
| 1200.5 | -0.026 |
| 1200.6 | -0.026 |
| 1200.7 | -0.026 |
| 1200.8 | -0.026 |
| 1200.9 | -0.026 |
| 1201.0 | -0.026 |
| 1201.1 | -0.026 |
| 1201.2 | -0.026 |
| 1201.3 | -0.026 |
| 1201.4 | -0.026 |
| 1201.5 | -0.026 |
| 1201.6 | -0.026 |
| 1201.7 | -0.026 |
| 1201.8 | -0.026 |
| 1201.9 | -0.026 |
| 1202.0 | -0.026 |
| 1202.1 | -0.026 |
| 1202.2 | -0.026 |
| 1202.3 | -0.026 |
| 1202.4 | -0.026 |
| 1202.5 | -0.026 |
| 1202.6 | -0.026 |
| 1202.7 | -0.026 |
| 1202.8 | -0.026 |
| 1202.9 | -0.026 |
| 1203.0 | -0.026 |
| 1203.1 | -0.026 |
| 1203.2 | -0.026 |
| 1203.3 | -0.026 |
| 1203.4 | -0.026 |
| 1203.5 | -0.026 |
| 1203.6 | -0.026 |
| 1203.7 | -0.026 |
| 1203.8 | -0.026 |
| 1203.9 | -0.026 |
| 1204.0 | -0.026 |
| 1204.1 | -0.026 |
| 1204.2 | -0.026 |
| 1204.3 | -0.026 |
| 1204.4 | -0.026 |
| 1204.5 | -0.026 |
| 1204.6 | -0.026 |
| 1204.7 | -0.026 |
| 1204.8 | -0.026 |
| 1204.9 | -0.026 |
| 1205.0 | -0.026 |
| 1205.1 | -0.026 |
| 1205.2 | -0.026 |
| 1205.3 | -0.026 |
| 1205.4 | -0.026 |
| 1205.5 | -0.026 |
| 1205.6 | -0.026 |
| 1205.7 | -0.026 |
| 1205.8 | -0.026 |
| 1205.9 | -0.026 |
| 1206.0 | -0.026 |
| 1206.1 | -0.026 |
| 1206.2 | -0.026 |
| 1206.3 | -0.026 |
| 1206.4 | -0.026 |
| 1206.5 | -0.026 |
| 1206.6 | -0.026 |
| 1206.7 | -0.026 |
| 1206.8 | -0.026 |
| 1206.9 | -0.026 |
| 1207.0 | -0.026 |
| 1207.1 | -0.026 |
| 1207.2 | -0.026 |
| 1207.3 | -0.026 |
| 1207.4 | -0.026 |
| 1207.5 | -0.026 |
| 1207.6 | -0.026 |
| 1207.7 | -0.026 |
| 1207.8 | -0.026 |
| 1207.9 | -0.026 |
| 1208.0 | -0.026 |
| 1208.1 | -0.026 |
| 1208.2 | -0.026 |
| 1208.3 | -0.026 |
| 1208.4 | -0.026 |
| 1208.5 | -0.026 |
| 1208.6 | -0.026 |
| 1208.7 | -0.026 |
| 1208.8 | -0.026 |
| 1208.9 | -0.026 |
| 1209.0 | -0.026 |
| 1209.1 | -0.026 |
| 1209.2 | -0.026 |
| 1209.3 | -0.026 |
| 1209.4 | -0.026 |
| 1209.5 | -0.026 |
| 1209.6 | -0.026 |
| 1209.7 | -0.026 |
| 1209.8 | -0.026 |
| 1209.9 | -0.026 |
| 1210.0 | -0.026 |
| 1210.1 | -0.026 |
| 1210.2 | -0.026 |
| 1210.3 | -0.026 |
| 1210.4 | -0.026 |
| 1210.5 | -0.026 |
| 1210.6 | -0.026 |
| 1210.7 | -0.026 |
| 1210.8 | -0.026 |
| 1210.9 | -0.026 |
| 1211.0 | -0.026 |
| 1211.1 | -0.026 |
| 1211.2 | -0.026 |
| 1211.3 | -0.026 |
| 1211.4 | -0.026 |
| 1211.5 | -0.026 |
| 1211.6 | -0.026 |
| 1211.7 | -0.026 |
| 1211.8 | -0.026 |
| 1211.9 | -0.026 |
| 1212.0 | -0.026 |
| 1212.1 | -0.026 |
| 1212.2 | -0.026 |
| 1212.3 | -0.026 |
| 1212.4 | -0.026 |
| 1212.5 | -0.026 |
| 1212.6 | -0.026 |
| 1212.7 | -0.026 |
| 1212.8 | -0.026 |
| 1212.9 | -0.026 |
| 1213.0 | -0.026 |
| 1213.1 | -0.026 |
| 1213.2 | -0.026 |
| 1213.3 | -0.026 |
| 1213.4 | -0.026 |
| 1213.5 | -0.026 |
| 1213.6 | -0.026 |
| 1213.7 | -0.026 |
| 1213.8 | -0.026 |
| 1213.9 | -0.026 |
| 1214.0 | -0.026 |
| 1214.1 | -0.026 |
| 1214.2 | -0.026 |
| 1214.3 | -0.026 |
| 1214.4 | -0.026 |
| 1214.5 | -0.026 |
| 1214.6 | -0.026 |
| 1214.7 | -0.026 |
| 1214.8 | -0.026 |
| 1214.9 | -0.026 |
| 1215.0 | -0.026 |
| 1215.1 | -0.026 |
| 1215.2 | -0.026 |
| 1215.3 | -0.026 |
| 1215.4 | -0.026 |
| 1215.5 | -0.026 |
| 1215.6 | -0.026 |
| 1215.7 | -0.026 |
| 1215.8 | -0.026 |
| 1215.9 | -0.026 |
| 1216.0 | -0.026 |
| 1216.1 | -0.026 |
| 1216.2 | -0.026 |
| 1216.3 | -0.026 |
| 1216.4 | -0.026 |
| 1216.5 | -0.026 |
| 1216.6 | -0.026 |
| 1216.7 | -0.026 |
| 1216.8 | -0.026 |
| 1216.9 | -0.026 |
| 1217.0 | -0.026 |
| 1217.1 | -0.026 |
| 1217.2 | -0.026 |
| 1217.3 | -0.026 |
| 1217.4 | -0.026 |
| 1217.5 | -0.026 |
| 1217.6 | -0.026 |
| 1217.7 | -0.026 |
| 1217.8 | -0.026 |
| 1217.9 | -0.026 |
| 1218.0 | -0.026 |
| 1218.1 | -0.026 |
| 1218.2 | -0.026 |
| 1218.3 | -0.026 |
| 1218.4 | -0.026 |
| 1218.5 | -0.026 |
| 1218.6 | -0.026 |
| 1218.7 | -0.026 |
| 1218.8 | -0.026 |
| 1218.9 | -0.026 |
| 1219.0 | -0.026 |
| 1219.1 | -0.026 |
| 1219.2 | -0.026 |
| 1219.3 | -0.026 |
| 1219.4 | -0.026 |
| 1219.5 | -0.026 |
| 1219.6 | -0.026 |
| 1219.7 | -0.026 |
| 1219.8 | -0.026 |
| 1219.9 | -0.026 |
| 1220.0 | -0.026 |
| 1220.1 | -0.026 |
| 1220.2 | -0.026 |
| 1220.3 | -0.026 |
| 1220.4 | -0.026 |
| 1220.5 | -0.026 |
| 1220.6 | -0.026 |
| 1220.7 | -0.026 |
| 1220.8 | -0.026 |
| 1220.9 | -0.026 |
| 1221.0 | -0.026 |
| 1221.1 | -0.026 |
| 1221.2 | -0.026 |
| 1221.3 | -0.026 |
| 1221.4 | -0.026 |
| 1221.5 | -0.026 |
| 1221.6 | -0.026 |
| 1221.7 | -0.026 |
| 1221.8 | -0.026 |
| 1221.9 | -0.026 |
| 1222.0 | -0.026 |
| 1222.1 | -0.026 |
| 1222.2 | -0.026 |
| 1222.3 | -0.026 |
| 1222.4 | -0.026 |
| 1222.5 | -0.026 |
| 1222.6 | -0.026 |
| 1222.7 | -0.026 |
| 1222.8 | -0.026 |
| 1222.9 | -0.026 |
| 1223.0 | -0.026 |
| 1223.1 | -0.026 |
| 1223.2 | -0.026 |
| 1223.3 | -0.026 |
| 1223.4 | -0.026 |
| 1223.5 | -0.026 |
| 1223.6 | -0.026 |
| 1223.7 | -0.026 |
| 1223.8 | -0.026 |
| 1223.9 | -0.026 |
| 1224.0 | -0.026 |
| 1224.1 | -0.026 |
| 1224.2 | -0.026 |
| 1224.3 | -0.026 |
| 1224.4 | -0.026 |
| 1224.5 | -0.026 |
| 1224.6 | -0.026 |
| 1224.7 | -0.026 |
| 1224.8 | -0.026 |
| 1224.9 | -0.026 |
| 1225.0 | -0.026 |
| 1225.1 | -0.026 |
| 1225.2 | -0.026 |
| 1225.3 | -0.026 |
| 1225.4 | -0.026 |
| 1225.5 | -0.026 |
| 1225.6 | -0.026 |
| 1225.7 | -0.026 |
| 1225.8 | -0.026 |
| 1225.9 | -0.026 |
| 1226.0 | -0.026 |
| 1226.1 | -0.026 |
| 1226.2 | -0.026 |
| 1226.3 | -0.026 |
| 1226.4 | -0.026 |
| 1226.5 | -0.026 |
| 1226.6 | -0.026 |
| 1226.7 | -0.026 |
| 1226.8 | -0.026 |
| 1226.9 | -0.026 |
| 1227.0 | -0.026 |
| 1227.1 | -0.026 |
| 1227.2 | -0.026 |
| 1227.3 | -0.026 |
| 1227.4 | -0.026 |
| 1227.5 | -0.026 |
| 1227.6 | -0.026 |
| 1227.7 | -0.026 |
| 1227.8 | -0.026 |
| 1227.9 | -0.026 |
| 1228.0 | -0.026 |
| 1228.1 | -0.026 |
| 1228.2 | -0.026 |
| 1228.3 | -0.026 |
| 1228.4 | -0.026 |
| 1228.5 | -0.026 |
| 1228.6 | -0.026 |
| 1228.7 | -0.026 |
| 1228.8 | -0.026 |
| 1228.9 | -0.026 |
| 1229.0 | -0.026 |
| 1229.1 | -0.026 |
| 1229.2 | -0.026 |
| 1229.3 | -0.026 |
| 1229.4 | -0.026 |
| 1229.5 | -0.026 |
| 1229.6 | -0.026 |
| 1229.7 | -0.026 |
| 1229.8 | -0.026 |
| 1229.9 | -0.026 |
| 1230.0 | -0.026 |
| 1230.1 | -0.026 |
| 1230.2 | -0.026 |
| 1230.3 | -0.026 |
| 1230.4 | -0.026 |
| 1230.5 | -0.026 |
| 1230.6 | -0.026 |
| 1230.7 | -0.026 |
| 1230.8 | -0.026 |
| 1230.9 | -0.026 |
| 1231.0 | -0.026 |
| 1231.1 | -0.026 |
| 1231.2 | -0.026 |
| 1231.3 | -0.026 |
| 1231.4 | -0.026 |
| 1231.5 | -0.026 |
| 1231.6 | -0.026 |
| 1231.7 | -0.026 |
| 1231.8 | -0.026 |
| 1231.9 | -0.026 |
| 1232.0 | -0.026 |
| 1232.1 | -0.026 |
| 1232.2 | -0.026 |
| 1232.3 | -0.026 |
| 1232.4 | -0.026 |
| 1232.5 | -0.026 |
| 1232.6 | -0.026 |
| 1232.7 | -0.026 |
| 1232.8 | -0.026 |
| 1232.9 | -0.026 |
| 1233.0 | -0.026 |
| 1233.1 | -0.026 |
| 1233.2 | -0.026 |
| 1233.3 | -0.026 |
| 1233.4 | -0.026 |
| 1233.5 | -0.026 |
| 1233.6 | -0.026 |
| 1233.7 | -0.026 |
| 1233.8 | -0.026 |
| 1233.9 | -0.026 |
| 1234.0 | -0.026 |
| 1234.1 | -0.026 |
| 1234.2 | -0.026 |
| 1234.3 | -0.026 |
| 1234.4 | -0.026 |
| 1234.5 | -0.026 |
| 1234.6 | -0.026 |
| 1234.7 | -0.026 |
| 1234.8 | -0.026 |
| 1234.9 | -0.026 |
| 1235.0 | -0.026 |
| 1235.1 | -0.026 |
| 1235.2 | -0.026 |
| 1235.3 | -0.026 |
| 1235.4 | -0.026 |
| 1235.5 | -0.026 |
| 1235.6 | -0.026 |
| 1235.7 | -0.026 |
| 1235.8 | -0.026 |
| 1235.9 | -0.026 |
| 1236.0 | -0.026 |
| 1236.1 | -0.026 |
| 1236.2 | -0.026 |
| 1236.3 | -0.026 |
| 1236.4 | -0.026 |
| 1236.5 | -0.026 |
| 1236.6 | -0.026 |
| 1236.7 | -0.026 |
| 1236.8 | -0.026 |
| 1236.9 | -0.026 |
| 1237.0 | -0.026 |
| 1237.1 | -0.026 |
| 1237.2 | -0.026 |
| 1237.3 | -0.026 |
| 1237.4 | -0.026 |
| 1237.5 | -0.026 |
| 1237.6 | -0.026 |
| 1237.7 | -0.026 |
| 1237.8 | -0.026 |
| 1237.9 | -0.026 |
| 1238.0 | -0.026 |
| 1238.1 | -0.026 |
| 1238.2 | -0.026 |
| 1238.3 | -0.026 |
| 1238.4 | -0.026 |
| 1238.5 | -0.026 |
| 1238.6 | -0.026 |
| 1238.7 | -0.026 |
| 1238.8 | -0.026 |
| 1238.9 | -0.026 |
| 1239.0 | -0.026 |
| 1239.1 | -0.026 |
| 1239.2 | -0.026 |
| 1239.3 | -0.026 |
| 1239.4 | -0.026 |
| 1239.5 | -0.026 |
| 1239.6 | -0.026 |
| 1239.7 | -0.026 |
| 1239.8 | -0.026 |
| 1239.9 | -0.026 |
| 1240.0 | -0.026 |
| 1240.1 | -0.026 |
| 1240.2 | -0.026 |
| 1240.3 | -0.026 |
| 1240.4 | -0.026 |
| 1240.5 | -0.026 |
| 1240.6 | -0.026 |
| 1240.7 | -0.026 |
| 1240.8 | -0.026 |
| 1240.9 | -0.026 |
| 1241.0 | -0.026 |
| 1241.1 | -0.026 |
| 1241.2 | -0.026 |
| 1241.3 | -0.026 |
| 1241.4 | -0.026 |
| 1241.5 | -0.026 |
| 1241.6 | -0.026 |
| 1241.7 | -0.026 |
| 1241.8 | -0.026 |
| 1241.9 | -0.026 |
| 1242.0 | -0.026 |
| 1242.1 | -0.026 |
| 1242.2 | -0.026 |
| 1242.3 | -0.026 |
| 1242.4 | -0.026 |
| 1242.5 | -0.026 |
| 1242.6 | -0.026 |
| 1242.7 | -0.026 |
| 1242.8 | -0.026 |
| 1242.9 | -0.026 |
| 1243.0 | -0.026 |
| 1243.1 | -0.026 |
| 1243.2 | -0.026 |
| 1243.3 | -0.026 |
| 1243.4 | -0.026 |
| 1243.5 | -0.026 |
| 1243.6 | -0.026 |
| 1243.7 | -0.026 |
| 1243.8 | -0.026 |
| 1243.9 | -0.026 |
| 1244.0 | -0.026 |
| 1244.1 | -0.026 |
| 1244.2 | -0.026 |
| 1244.3 | -0.026 |
| 1244.4 | -0.026 |
| 1244.5 | -0.026 |
| 1244.6 | -0.026 |
| 1244.7 | -0.026 |
| 1244.8 | -0.026 |
| 1244.9 | -0.026 |
| 1245.0 | -0.026 |
| 1245.1 | -0.026 |
| 1245.2 | -0.026 |
| 1245.3 | -0.026 |
| 1245.4 | -0.026 |
| 1245.5 | -0.026 |
| 1245.6 | -0.026 |
| 1245.7 | -0.026 |
| 1245.8 | -0.026 |
| 1245.9 | -0.026 |
| 1246.0 | -0.026 |
| 1246.1 | -0.026 |
| 1246.2 | -0.026 |
| 1246.3 | -0.026 |
| 1246.4 | -0.026 |
| 1246.5 | -0.026 |
| 1246.6 | -0.026 |
| 1246.7 | -0.026 |
| 1246.8 | -0.026 |
| 1246.9 | -0.026 |
| 1247.0 | -0.026 |
| 1247.1 | -0.026 |
| 1247.2 | -0.026 |
| 1247.3 | -0.026 |
| 1247.4 | -0.026 |
| 1247.5 | -0.026 |
| 1247.6 | -0.026 |
| 1247.7 | -0.026 |
| 1247.8 | -0.026 |
| 1247.9 | -0.026 |
| 1248.0 | -0.026 |
| 1248.1 | -0.026 |
| 1248.2 | -0.026 |
| 1248.3 | -0.026 |
| 1248.4 | -0.026 |
| 1248.5 | -0.026 |
| 1248.6 | -0.026 |
| 1248.7 | -0.026 |
| 1248.8 | -0.026 |
| 1248.9 | -0.026 |
| 1249.0 | -0.026 |
| 1249.1 | -0.026 |
| 1249.2 | -0.026 |
| 1249.3 | -0.026 |
| 1249.4 | -0.026 |
| 1249.5 | -0.026 |
| 1249.6 | -0.026 |
| 1249.7 | -0.026 |
| 1249.8 | -0.026 |
| 1249.9 | -0.026 |
| 1250.0 | -0.026 |
| 1250.1 | -0.026 |
| 1250.2 | -0.026 |
| 1250.3 | -0.026 |
| 1250.4 | -0.026 |
| 1250.5 | -0.026 |
| 1250.6 | -0.026 |
| 1250.7 | -0.026 |
| 1250.8 | -0.026 |
| 1250.9 | -0.026 |
| 1251.0 | -0.026 |
| 1251.1 | -0.026 |
| 1251.2 | -0.026 |
| 1251.3 | -0.026 |
| 1251.4 | -0.026 |
| 1251.5 | -0.026 |
| 1251.6 | -0.026 |
| 1251.7 | -0.026 |
| 1251.8 | -0.026 |
| 1251.9 | -0.026 |
| 1252.0 | -0.026 |
| 1252.1 | -0.026 |
| 1252.2 | -0.026 |
| 1252.3 | -0.026 |
| 1252.4 | -0.026 |
| 1252.5 | -0.026 |
| 1252.6 | -0.026 |
| 1252.7 | -0.026 |
| 1252.8 | -0.026 |
| 1252.9 | -0.026 |
| 1253.0 | -0.026 |
| 1253.1 | -0.026 |
| 1253.2 | -0.026 |
| 1253.3 | -0.026 |
| 1253.4 | -0.026 |
| 1253.5 | -0.026 |
| 1253.6 | -0.026 |
| 1253.7 | -0.026 |
| 1253.8 | -0.026 |
| 1253.9 | -0.026 |
| 1254.0 | -0.026 |
| 1254.1 | -0.026 |
| 1254.2 | -0.026 |
| 1254.3 | -0.026 |
| 1254.4 | -0.026 |
| 1254.5 | -0.026 |
| 1254.6 | -0.026 |
| 1254.7 | -0.026 |
| 1254.8 | -0.026 |
| 1254.9 | -0.026 |
| 1255.0 | -0.026 |
| 1255.1 | -0.026 |
| 1255.2 | -0.026 |
| 1255.3 | -0.026 |
| 1255.4 | -0.026 |
| 1255.5 | -0.026 |
| 1255.6 | -0.026 |
| 1255.7 | -0.026 |
| 1255.8 | -0.026 |
| 1255.9 | -0.026 |
| 1256.0 | -0.026 |
| 1256.1 | -0.026 |
| 1256.2 | -0.026 |
| 1256.3 | -0.026 |
| 1256.4 | -0.026 |
| 1256.5 | -0.026 |
| 1256.6 | -0.026 |
| 1256.7 | -0.026 |
| 1256.8 | -0.026 |
| 1256.9 | -0.026 |
| 1257.0 | -0.026 |
| 1257.1 | -0.026 |
| 1257.2 | -0.026 |
| 1257.3 | -0.026 |
| 1257.4 | -0.026 |
| 1257.5 | -0.026 |
| 1257.6 | -0.026 |
| 1257.7 | -0.026 |
| 1257.8 | -0.026 |
| 1257.9 | -0.026 |
| 1258.0 | -0.026 |
| 1258.1 | -0.026 |
| 1258.2 | -0.026 |
| 1258.3 | -0.026 |
| 1258.4 | -0.026 |
| 1258.5 | -0.026 |
| 1258.6 | -0.026 |
| 1258.7 | -0.026 |
| 1258.8 | -0.026 |
| 1258.9 | -0.026 |
| 1259.0 | -0.026 |
| 1259.1 | -0.026 |
| 1259.2 | -0.026 |
| 1259.3 | -0.026 |
| 1259.4 | -0.026 |
| 1259.5 | -0.026 |
| 1259.6 | -0.026 |
| 1259.7 | -0.026 |
| 1259.8 | -0.026 |
| 1259.9 | -0.026 |
| 1260.0 | -0.026 |
| 1260.1 | -0.026 |
| 1260.2 | -0.026 |
| 1260.3 | -0.026 |
| 1260.4 | -0.026 |
| 1260.5 | -0.026 |
| 1260.6 | -0.026 |
| 1260.7 | -0.026 |
| 1260.8 | -0.026 |
| 1260.9 | -0.026 |
| 1261.0 | -0.026 |
| 1261.1 | -0.026 |
| 1261.2 | -0.026 |
| 1261.3 | -0.026 |
| 1261.4 | -0.026 |
| 1261.5 | -0.026 |
| 1261.6 | -0.026 |
| 1261.7 | -0.026 |
| 1261.8 | -0.026 |
| 1261.9 | -0.026 |
| 1262.0 | -0.026 |
| 1262.1 | -0.026 |
| 1262.2 | -0.026 |
| 1262.3 | -0.026 |
| 1262.4 | -0.026 |
| 1262.5 | -0.026 |
| 1262.6 | -0.026 |
| 1262.7 | -0.026 |
| 1262.8 | -0.026 |
| 1262.9 | -0.026 |
| 1263.0 | -0.026 |
| 1263.1 | -0.026 |
| 1263.2 | -0.026 |
| 1263.3 | -0.026 |
| 1263.4 | -0.026 |
| 1263.5 | -0.026 |
| 1263.6 | -0.026 |
| 1263.7 | -0.026 |
| 1263.8 | -0.026 |
| 1263.9 | -0.026 |
| 1264.0 | -0.026 |
| 1264.1 | -0.026 |
| 1264.2 | -0.026 |
| 1264.3 | -0.026 |
| 1264.4 | -0.026 |
| 1264.5 | -0.026 |
| 1264.6 | -0.026 |
| 1264.7 | -0.026 |
| 1264.8 | -0.026 |
| 1264.9 | -0.026 |
| 1265.0 | -0.026 |
| 1265.1 | -0.026 |
| 1265.2 | -0.026 |
| 1265.3 | -0.026 |
| 1265.4 | -0.026 |
| 1265.5 | -0.026 |
| 1265.6 | -0.026 |
| 1265.7 | -0.026 |
| 1265.8 | -0.026 |
| 1265.9 | -0.026 |
| 1266.0 | -0.026 |
| 1266.1 | -0.026 |
| 1266.2 | -0.026 |
| 1266.3 | -0.026 |
| 1266.4 | -0.026 |
| 1266.5 | -0.026 |
| 1266.6 | -0.026 |
| 1266.7 | -0.026 |
| 1266.8 | -0.026 |
| 1266.9 | -0.026 |
| 1267.0 | -0.026 |
| 1267.1 | -0.026 |
| 1267.2 | -0.026 |
| 1267.3 | -0.026 |
| 1267.4 | -0.026 |
| 1267.5 | -0.026 |
| 1267.6 | -0.026 |
| 1267.7 | -0.026 |
| 1267.8 | -0.026 |
| 1267.9 | -0.026 |
| 1268.0 | -0.026 |
| 1268.1 | -0.026 |
| 1268.2 | -0.026 |
| 1268.3 | -0.026 |
| 1268.4 | -0.026 |
| 1268.5 | -0.026 |
| 1268.6 | -0.026 |
| 1268.7 | -0.026 |
| 1268.8 | -0.026 |
| 1268.9 | -0.026 |
| 1269.0 | -0.026 |
| 1269.1 | -0.026 |
| 1269.2 | -0.026 |
| 1269.3 | -0.026 |
| 1269.4 | -0.026 |
| 1269.5 | -0.026 |
| 1269.6 | -0.026 |
| 1269.7 | -0.026 |
| 1269.8 | -0.026 |
| 1269.9 | -0.026 |
| 1270.0 | -0.026 |
| 1270.1 | -0.026 |
| 1270.2 | -0.026 |
| 1270.3 | -0.026 |
| 1270.4 | -0.026 |
| 1270.5 | -0.026 |
| 1270.6 | -0.026 |
| 1270.7 | -0.026 |
| 1270.8 | -0.026 |
| 1270.9 | -0.026 |
| 1271.0 | -0.026 |
| 1271.1 | -0.026 |
| 1271.2 | -0.026 |
| 1271.3 | -0.026 |
| 1271.4 | -0.026 |
| 1271.5 | -0.026 |
| 1271.6 | -0.026 |
| 1271.7 | -0.026 |
| 1271.8 | -0.026 |
| 1271.9 | -0.026 |
| 1272.0 | -0.026 |
| 1272.1 | -0.026 |
| 1272.2 | -0.026 |
| 1272.3 | -0.026 |
| 1272.4 | -0.026 |
| 1272.5 | -0.026 |
| 1272.6 | -0.026 |
| 1272.7 | -0.026 |
| 1272.8 | -0.026 |
| 1272.9 | -0.026 |
| 1273.0 | -0.026 |
| 1273.1 | -0.026 |
| 1273.2 | -0.026 |
| 1273.3 | -0.026 |
| 1273.4 | -0.026 |
| 1273.5 | -0.026 |
| 1273.6 | -0.026 |
| 1273.7 | -0.026 |
| 1273.8 | -0.026 |
| 1273.9 | -0.026 |
| 1274.0 | -0.026 |
| 1274.1 | -0.026 |
| 1274.2 | -0.026 |
| 1274.3 | -0.026 |
| 1274.4 | -0.026 |
| 1274.5 | -0.026 |
| 1274.6 | -0.026 |
| 1274.7 | -0.026 |
| 1274.8 | -0.026 |
| 1274.9 | -0.026 |
| 1275.0 | -0.026 |
| 1275.1 | -0.026 |
| 1275.2 | -0.026 |
| 1275.3 | -0.026 |
| 1275.4 | -0.026 |
| 1275.5 | -0.026 |
| 1275.6 | -0.026 |
| 1275.7 | -0.026 |
| 1275.8 | -0.026 |
| 1275.9 | -0.026 |
| 1276.0 | -0.026 |
| 1276.1 | -0.026 |
| 1276.2 | -0.026 |
| 1276.3 | -0.026 |
| 1276.4 | -0.026 |
| 1276.5 | -0.026 |
| 1276.6 | -0.026 |
| 1276.7 | -0.026 |
| 1276.8 | -0.026 |
| 1276.9 | -0.026 |
| 1277.0 | -0.026 |
| 1277.1 | -0.026 |
| 1277.2 | -0.026 |
| 1277.3 | -0.026 |
| 1277.4 | -0.026 |
| 1277.5 | -0.026 |
| 1277.6 | -0.026 |
| 1277.7 | -0.026 |
| 1277.8 | -0.026 |
| 1277.9 | -0.026 |
| 1278.0 | -0.026 |
| 1278.1 | -0.026 |
| 1278.2 | -0.026 |
| 1278.3 | -0.026 |
| 1278.4 | -0.026 |
| 1278.5 | -0.026 |
| 1278.6 | -0.026 |
| 1278.7 | -0.026 |
| 1278.8 | -0.026 |
| 1278.9 | -0.026 |
| 1279.0 | -0.026 |
| 1279.1 | -0.026 |
| 1279.2 | -0.026 |
| 1279.3 | -0.026 |
| 1279.4 | -0.026 |
| 1279.5 | -0.026 |
| 1279.6 | -0.026 |
| 1279.7 | -0.026 |
| 1279.8 | -0.026 |
| 1279.9 | -0.026 |
| 1280.0 | -0.026 |
| 1280.1 | -0.026 |
| 1280.2 | -0.026 |
| 1280.3 | -0.026 |
| 1280.4 | -0.026 |
| 1280.5 | -0.026 |
| 1280.6 | -0.026 |
| 1280.7 | -0.026 |
| 1280.8 | -0.026 |
| 1280.9 | -0.026 |
| 1281.0 | -0.026 |
| 1281.1 | -0.026 |
| 1281.2 | -0.026 |
| 1281.3 | -0.026 |
| 1281.4 | -0.026 |
| 1281.5 | -0.026 |
| 1281.6 | -0.026 |
| 1281.7 | -0.026 |
| 1281.8 | -0.026 |
| 1281.9 | -0.026 |
| 1282.0 | -0.026 |
| 1282.1 | -0.026 |
| 1282.2 | -0.026 |
| 1282.3 | -0.026 |
| 1282.4 | -0.026 |
| 1282.5 | -0.026 |
| 1282.6 | -0.026 |
| 1282.7 | -0.026 |
| 1282.8 | -0.026 |
| 1282.9 | -0.026 |
| 1283.0 | -0.026 |
| 1283.1 | -0.026 |
| 1283.2 | -0.026 |
| 1283.3 | -0.026 |
| 1283.4 | -0.026 |
| 1283.5 | -0.026 |
| 1283.6 | -0.026 |
| 1283.7 | -0.026 |
| 1283.8 | -0.026 |
| 1283.9 | -0.026 |
| 1284.0 | -0.026 |
| 1284.1 | -0.026 |
| 1284.2 | -0.026 |
| 1284.3 | -0.026 |
| 1284.4 | -0.026 |
| 1284.5 | -0.026 |
| 1284.6 | -0.026 |
| 1284.7 | -0.026 |
| 1284.8 | -0.026 |
| 1284.9 | -0.026 |
| 1285.0 | -0.026 |
| 1285.1 | -0.026 |
| 1285.2 | -0.026 |
| 1285.3 | -0.026 |
| 1285.4 | -0.026 |
| 1285.5 | -0.026 |
| 1285.6 | -0.026 |
| 1285.7 | -0.026 |
| 1285.8 | -0.026 |
| 1285.9 | -0.026 |
| 1286.0 | -0.026 |
| 1286.1 | -0.026 |
| 1286.2 | -0.026 |
| 1286.3 | -0.026 |
| 1286.4 | -0.026 |
| 1286.5 | -0.026 |
| 1286.6 | -0.026 |
| 1286.7 | -0.026 |
| 1286.8 | -0.026 |
| 1286.9 | -0.026 |
| 1287.0 | -0.026 |
| 1287.1 | -0.026 |
| 1287.2 | -0.026 |
| 1287.3 | -0.026 |
| 1287.4 | -0.026 |
| 1287.5 | -0.026 |
| 1287.6 | -0.026 |
| 1287.7 | -0.026 |
| 1287.8 | -0.026 |
| 1287.9 | -0.026 |
| 1288.0 | -0.026 |
| 1288.1 | -0.026 |
| 1288.2 | -0.026 |
| 1288.3 | -0.026 |
| 1288.4 | -0.026 |
| 1288.5 | -0.026 |
| 1288.6 | -0.026 |
| 1288.7 | -0.026 |
| 1288.8 | -0.026 |
| 1288.9 | -0.026 |
| 1289.0 | -0.026 |
| 1289.1 | -0.026 |
| 1289.2 | -0.026 |
| 1289.3 | -0.026 |
| 1289.4 | -0.026 |
| 1289.5 | -0.026 |
| 1289.6 | -0.026 |
| 1289.7 | -0.026 |
| 1289.8 | -0.026 |
| 1289.9 | -0.026 |
| 1290.0 | -0.026 |
| 1290.1 | -0.026 |
| 1290.2 | -0.026 |
| 1290.3 | -0.026 |
| 1290.4 | -0.026 |
| 1290.5 | -0.026 |
| 1290.6 | -0.026 |
| 1290.7 | -0.026 |
| 1290.8 | -0.026 |
| 1290.9 | -0.026 |
| 1291.0 | -0.026 |
| 1291.1 | -0.026 |
| 1291.2 | -0.026 |
| 1291.3 | -0.026 |
| 1291.4 | -0.026 |
| 1291.5 | -0.026 |
| 1291.6 | -0.026 |
| 1291.7 | -0.026 |
| 1291.8 | -0.026 |
| 1291.9 | -0.026 |
| 1292.0 | -0.026 |
| 1292.1 | -0.026 |
| 1292.2 | -0.026 |
| 1292.3 | -0.026 |
| 1292.4 | -0.026 |
| 1292.5 | -0.026 |
| 1292.6 | -0.026 |
| 1292.7 | -0.026 |
| 1292.8 | -0.026 |
| 1292.9 | -0.026 |
| 1293.0 | -0.026 |
| 1293.1 | -0.026 |
| 1293.2 | -0.026 |
| 1293.3 | -0.026 |
| 1293.4 | -0.026 |
| 1293.5 | -0.026 |
| 1293.6 | -0.026 |
| 1293.7 | -0.026 |
| 1293.8 | -0.026 |
| 1293.9 | -0.026 |
| 1294.0 | -0.026 |
| 1294.1 | -0.026 |
| 1294.2 | -0.026 |
| 1294.3 | -0.026 |
| 1294.4 | -0.026 |
| 1294.5 | -0.026 |
| 1294.6 | -0.026 |
| 1294.7 | -0.026 |
| 1294.8 | -0.026 |
| 1294.9 | -0.026 |
| 1295.0 | -0.026 |
| 1295.1 | -0.026 |
| 1295.2 | -0.026 |
| 1295.3 | -0.026 |
| 1295.4 | -0.026 |
| 1295.5 | -0.026 |
| 1295.6 | -0.026 |
| 1295.7 | -0.026 |
| 1295.8 | -0.026 |
| 1295.9 | -0.026 |
| 1296.0 | -0.026 |
| 1296.1 | -0.026 |
| 1296.2 | -0.026 |
| 1296.3 | -0.026 |
| 1296.4 | -0.026 |
| 1296.5 | -0.026 |
| 1296.6 | -0.026 |
| 1296.7 | -0.026 |
| 1296.8 | -0.026 |
| 1296.9 | -0.026 |
| 1297.0 | -0.026 |
| 1297.1 | -0.026 |
| 1297.2 | -0.026 |
| 1297.3 | -0.026 |
| 1297.4 | -0.026 |
| 1297.5 | -0.026 |
| 1297.6 | -0.026 |
| 1297.7 | -0.026 |
| 1297.8 | -0.026 |
| 1297.9 | -0.026 |
| 1298.0 | -0.026 |
| 1298.1 | -0.026 |
| 1298.2 | -0.026 |
| 1298.3 | -0.026 |
| 1298.4 | -0.026 |
| 1298.5 | -0.026 |
| 1298.6 | -0.026 |
| 1298.7 | -0.026 |
| 1298.8 | -0.026 |
| 1298.9 | -0.026 |
| 1299.0 | -0.026 |
| 1299.1 | -0.026 |
| 1299.2 | -0.026 |
| 1299.3 | -0.026 |
| 1299.4 | -0.026 |
| 1299.5 | -0.026 |
| 1299.6 | -0.026 |
| 1299.7 | -0.026 |
| 1299.8 | -0.026 |
| 1299.9 | -0.026 |
| 1300.0 | -0.026 |
| 1300.1 | -0.026 |
| 1300.2 | -0.026 |
| 1300.3 | -0.026 |
| 1300.4 | -0.026 |
| 1300.5 | -0.026 |
| 1300.6 | -0.026 |
| 1300.7 | -0.026 |
| 1300.8 | -0.026 |
| 1300.9 | -0.026 |
| 1301.0 | -0.026 |
| 1301.1 | -0.026 |
| 1301.2 | -0.026 |
| 1301.3 | -0.026 |
| 1301.4 | -0.026 |
| 1301.5 | -0.026 |
| 1301.6 | -0.026 |
| 1301.7 | -0.026 |
| 1301.8 | -0.026 |
| 1301.9 | -0.026 |
| 1302.0 | -0.026 |
| 1302.1 | -0.026 |
| 1302.2 | -0.026 |
| 1302.3 | -0.026 |
| 1302.4 | -0.026 |
| 1302.5 | -0.026 |
| 1302.6 | -0.026 |
| 1302.7 | -0.026 |
| 1302.8 | -0.026 |
| 1302.9 | -0.026 |
| 1303.0 | -0.026 |
| 1303.1 | -0.026 |
| 1303.2 | -0.026 |
| 1303.3 | -0.026 |
| 1303.4 | -0.026 |
| 1303.5 | -0.026 |
| 1303.6 | -0.026 |
| 1303.7 | -0.026 |
| 1303.8 | -0.026 |
| 1303.9 | -0.026 |
| 1304.0 | -0.026 |
| 1304.1 | -0.026 |
| 1304.2 | -0.026 |
| 1304.3 | -0.026 |
| 1304.4 | -0.026 |
| 1304.5 | -0.026 |
| 1304.6 | -0.026 |
| 1304.7 | -0.026 |
| 1304.8 | -0.026 |
| 1304.9 | -0.026 |
| 1305.0 | -0.026 |
| 1305.1 | -0.026 |
| 1305.2 | -0.026 |
| 1305.3 | -0.026 |
| 1305.4 | -0.026 |
| 1305.5 | -0.026 |
| 1305.6 | -0.026 |
| 1305.7 | -0.026 |
| 1305.8 | -0.026 |
| 1305.9 | -0.026 |
| 1306.0 | -0.026 |
| 1306.1 | -0.026 |
| 1306.2 | -0.026 |
| 1306.3 | -0.026 |
| 1306.4 | -0.026 |
| 1306.5 | -0.026 |
| 1306.6 | -0.026 |
| 1306.7 | -0.026 |
| 1306.8 | -0.026 |
| 1306.9 | -0.026 |
| 1307.0 | -0.026 |
| 1307.1 | -0.026 |
| 1307.2 | -0.026 |
| 1307.3 | -0.026 |
| 1307.4 | -0.026 |
| 1307.5 | -0.026 |
| 1307.6 | -0.026 |
| 1307.7 | -0.026 |
| 1307.8 | -0.026 |
| 1307.9 | -0.026 |
| 1308.0 | -0.026 |
| 1308.1 | -0.026 |
| 1308.2 | -0.026 |
| 1308.3 | -0.026 |
| 1308.4 | -0.026 |
| 1308.5 | -0.026 |
| 1308.6 | -0.026 |
| 1308.7 | -0.026 |
| 1308.8 | -0.026 |
| 1308.9 | -0.026 |
| 1309.0 | -0.026 |
| 1309.1 | -0.026 |
| 1309.2 | -0.026 |
| 1309.3 | -0.026 |
| 1309.4 | -0.026 |
| 1309.5 | -0.026 |
| 1309.6 | -0.026 |
| 1309.7 | -0.026 |
| 1309.8 | -0.026 |
| 1309.9 | -0.026 |
| 1310.0 | -0.026 |
| 1310.1 | -0.026 |
| 1310.2 | -0.026 |
| 1310.3 | -0.026 |
| 1310.4 | -0.026 |
| 1310.5 | -0.026 |
| 1310.6 | -0.026 |
| 1310.7 | -0.026 |
| 1310.8 | -0.026 |
| 1310.9 | -0.026 |
| 1311.0 | -0.026 |
| 1311.1 | -0.026 |
| 1311.2 | -0.026 |
| 1311.3 | -0.026 |
| 1311.4 | -0.026 |
| 1311.5 | -0.026 |
| 1311.6 | -0.026 |
| 1311.7 | -0.026 |
| 1311.8 | -0.026 |
| 1311.9 | -0.026 |
| 1312.0 | -0.026 |
| 1312.1 | -0.026 |
| 1312.2 | -0.026 |
| 1312.3 | -0.026 |
| 1312.4 | -0.026 |
| 1312.5 | -0.026 |
| 1312.6 | -0.026 |
| 1312.7 | -0.026 |
| 1312.8 | -0.026 |
| 1312.9 | -0.026 |
| 1313.0 | -0.026 |
| 1313.1 | -0.026 |
| 1313.2 | -0.026 |
| 1313.3 | -0.026 |
| 1313.4 | -0.026 |
| 1313.5 | -0.026 |
| 1313.6 | -0.026 |
| 1313.7 | -0.026 |
| 1313.8 | -0.026 |
| 1313.9 | -0.026 |
| 1314.0 | -0.026 |
| 1314.1 | -0.026 |
| 1314.2 | -0.026 |
| 1314.3 | -0.026 |
| 1314.4 | -0.026 |
| 1314.5 | -0.026 |
| 1314.6 | -0.026 |
| 1314.7 | -0.026 |
| 1314.8 | -0.026 |
| 1314.9 | -0.026 |
| 1315.0 | -0.026 |
| 1315.1 | -0.026 |
| 1315.2 | -0.026 |
| 1315.3 | -0.026 |
| 1315.4 | -0.026 |
| 1315.5 | -0.026 |
| 1315.6 | -0.026 |
| 1315.7 | -0.026 |
| 1315.8 | -0.026 |
| 1315.9 | -0.026 |
| 1316.0 | -0.026 |
| 1316.1 | -0.026 |
| 1316.2 | -0.026 |
| 1316.3 | -0.026 |
| 1316.4 | -0.026 |
| 1316.5 | -0.026 |
| 1316.6 | -0.026 |
| 1316.7 | -0.026 |
| 1316.8 | -0.026 |
| 1316.9 | -0.026 |
| 1317.0 | -0.026 |
| 1317.1 | -0.026 |
| 1317.2 | -0.026 |
| 1317.3 | -0.026 |
| 1317.4 | -0.026 |
| 1317.5 | -0.026 |
| 1317.6 | -0.026 |
| 1317.7 | -0.026 |
| 1317.8 | -0.026 |
| 1317.9 | -0.026 |
| 1318.0 | -0.026 |
| 1318.1 | -0.026 |
| 1318.2 | -0.026 |
| 1318.3 | -0.026 |
| 1318.4 | -0.026 |
| 1318.5 | -0.026 |
| 1318.6 | -0.026 |
| 1318.7 | -0.026 |
| 1318.8 | -0.026 |
| 1318.9 | -0.026 |
| 1319.0 | -0.026 |
| 1319.1 | -0.026 |
| 1319.2 | -0.026 |
| 1319.3 | -0.026 |
| 1319.4 | -0.026 |
| 1319.5 | -0.026 |
| 1319.6 | -0.026 |
| 1319.7 | -0.026 |
| 1319.8 | -0.026 |
| 1319.9 | -0.026 |
| 1320.0 | -0.026 |
| 1320.1 | -0.026 |
| 1320.2 | -0.026 |
| 1320.3 | -0.026 |
| 1320.4 | -0.026 |
| 1320.5 | -0.026 |
| 1320.6 | -0.026 |
| 1320.7 | -0.026 |
| 1320.8 | -0.026 |
| 1320.9 | -0.026 |
| 1321.0 | -0.026 |
| 1321.1 | -0.026 |
| 1321.2 | -0.026 |
| 1321.3 | -0.026 |
| 1321.4 | -0.026 |
| 1321.5 | -0.026 |
| 1321.6 | -0.026 |
| 1321.7 | -0.026 |
| 1321.8 | -0.026 |
| 1321.9 | -0.026 |
| 1322.0 | -0.026 |
| 1322.1 | -0.026 |
| 1322.2 | -0.026 |
| 1322.3 | -0.026 |
| 1322.4 | -0.026 |
| 1322.5 | -0.026 |
| 1322.6 | -0.026 |
| 1322.7 | -0.026 |
| 1322.8 | -0.026 |
| 1322.9 | -0.026 |
| 1323.0 | -0.026 |
| 1323.1 | -0.026 |
| 1323.2 | -0.026 |
| 1323.3 | -0.026 |
| 1323.4 | -0.026 |
| 1323.5 | -0.026 |
| 1323.6 | -0.026 |
| 1323.7 | -0.026 |
| 1323.8 | -0.026 |
| 1323.9 | -0.026 |
| 1324.0 | -0.026 |
| 1324.1 | -0.026 |
| 1324.2 | -0.026 |
| 1324.3 | -0.026 |
| 1324.4 | -0.026 |
| 1324.5 | -0.026 |
| 1324.6 | -0.026 |
| 1324.7 | -0.026 |
| 1324.8 | -0.026 |
| 1324.9 | -0.026 |
| 1325.0 | -0.026 |
| 1325.1 | -0.026 |
| 1325.2 | -0.026 |
| 1325.3 | -0.026 |
| 1325.4 | -0.026 |
| 1325.5 | -0.026 |
| 1325.6 | -0.026 |
| 1325.7 | -0.026 |
| 1325.8 | -0.026 |
| 1325.9 | -0.026 |
| 1326.0 | -0.026 |
| 1326.1 | -0.026 |
| 1326.2 | -0.026 |
| 1326.3 | -0.026 |
| 1326.4 | -0.026 |
| 1326.5 | -0.026 |
| 1326.6 | -0.026 |
| 1326.7 | -0.026 |
| 1326.8 | -0.026 |
| 1326.9 | -0.026 |
| 1327.0 | -0.026 |
| 1327.1 | -0.026 |
| 1327.2 | -0.026 |
| 1327.3 | -0.026 |
| 1327.4 | -0.026 |
| 1327.5 | -0.026 |
| 1327.6 | -0.026 |
| 1327.7 | -0.026 |
| 1327.8 | -0.026 |
| 1327.9 | -0.026 |
| 1328.0 | -0.026 |
| 1328.1 | -0.026 |
| 1328.2 | -0.026 |
| 1328.3 | -0.026 |
| 1328.4 | -0.026 |
| 1328.5 | -0.026 |
| 1328.6 | -0.026 |
| 1328.7 | -0.026 |
| 1328.8 | -0.026 |
| 1328.9 | -0.026 |
| 1329.0 | -0.026 |
| 1329.1 | -0.026 |
| 1329.2 | -0.026 |
| 1329.3 | -0.026 |
| 1329.4 | -0.026 |
| 1329.5 | -0.026 |
| 1329.6 | -0.026 |
| 1329.7 | -0.026 |
| 1329.8 | -0.026 |
| 1329.9 | -0.026 |
| 1330.0 | -0.026 |
| 1330.1 | -0.026 |
| 1330.2 | -0.026 |
| 1330.3 | -0.026 |
| 1330.4 | -0.026 |
| 1330.5 | -0.026 |
| 1330.6 | -0.026 |
| 1330.7 | -0.026 |
| 1330.8 | -0.026 |
| 1330.9 | -0.026 |
| 1331.0 | -0.026 |
| 1331.1 | -0.026 |
| 1331.2 | -0.026 |
| 1331.3 | -0.026 |
| 1331.4 | -0.026 |
| 1331.5 | -0.026 |
| 1331.6 | -0.026 |
| 1331.7 | -0.026 |
| 1331.8 | -0.026 |
| 1331.9 | -0.026 |
| 1332.0 | -0.026 |
| 1332.1 | -0.026 |
| 1332.2 | -0.026 |
| 1332.3 | -0.026 |
| 1332.4 | -0.026 |
| 1332.5 | -0.026 |
| 1332.6 | -0.026 |
| 1332.7 | -0.026 |
| 1332.8 | -0.026 |
| 1332.9 | -0.026 |
| 1333.0 | -0.026 |
| 1333.1 | -0.026 |
| 1333.2 | -0.026 |
| 1333.3 | -0.026 |
| 1333.4 | -0.026 |
| 1333.5 | -0.026 |
| 1333.6 | -0.026 |
| 1333.7 | -0.026 |
| 1333.8 | -0.026 |
| 1333.9 | -0.026 |
| 1334.0 | -0.026 |
| 1334.1 | -0.026 |
| 1334.2 | -0.026 |
| 1334.3 | -0.026 |
| 1334.4 | -0.026 |
| 1334.5 | -0.026 |
| 1334.6 | -0.026 |
| 1334.7 | -0.026 |
| 1334.8 | -0.026 |
| 1334.9 | -0.026 |
| 1335.0 | -0.026 |
| 1335.1 | -0.026 |
| 1335.2 | -0.026 |
| 1335.3 | -0.026 |
| 1335.4 | -0.026 |
| 1335.5 | -0.026 |
| 1335.6 | -0.026 |
| 1335.7 | -0.026 |
| 1335.8 | -0.026 |
| 1335.9 | -0.026 |
| 1336.0 | -0.026 |
| 1336.1 | -0.026 |
| 1336.2 | -0.026 |
| 1336.3 | -0.026 |
| 1336.4 | -0.026 |
| 1336.5 | -0.026 |
| 1336.6 | -0.026 |
| 1336.7 | -0.026 |
| 1336.8 | -0.026 |
| 1336.9 | -0.026 |
| 1337.0 | -0.026 |
| 1337.1 | -0.026 |
| 1337.2 | -0.026 |
| 1337.3 | -0.026 |
| 1337.4 | -0.026 |
| 1337.5 | -0.026 |
| 1337.6 | -0.026 |
| 1337.7 | -0.026 |
| 1337.8 | -0.026 |
| 1337.9 | -0.026 |
| 1338.0 | -0.026 |
| 1338.1 | -0.026 |
| 1338.2 | -0.026 |
| 1338.3 | -0.026 |
| 1338.4 | -0.026 |
| 1338.5 | -0.026 |
| 1338.6 | -0.026 |
| 1338.7 | -0.026 |
| 1338.8 | -0.026 |
| 1338.9 | -0.026 |
| 1339.0 | -0.026 |
| 1339.1 | -0.026 |
| 1339.2 | -0.026 |
| 1339.3 | -0.026 |
| 1339.4 | -0.026 |
| 1339.5 | -0.026 |
| 1339.6 | -0.026 |
| 1339.7 | -0.026 |
| 1339.8 | -0.026 |
| 1339.9 | -0.026 |
| 1340.0 | -0.026 |
| 1340.1 | -0.026 |
| 1340.2 | -0.026 |
| 1340.3 | -0.026 |
| 1340.4 | -0.026 |
| 1340.5 | -0.026 |
| 1340.6 | -0.026 |
| 1340.7 | -0.026 |
| 1340.8 | -0.026 |
| 1340.9 | -0.026 |
| 1341.0 | -0.026 |
| 1341.1 | -0.026 |
| 1341.2 | -0.026 |
| 1341.3 | -0.026 |
| 1341.4 | -0.026 |
| 1341.5 | -0.026 |
| 1341.6 | -0.026 |
| 1341.7 | -0.026 |
| 1341.8 | -0.026 |
| 1341.9 | -0.026 |
| 1342.0 | -0.026 |
| 1342.1 | -0.026 |
| 1342.2 | -0.026 |
| 1342.3 | -0.026 |
| 1342.4 | -0.026 |
| 1342.5 | -0.026 |
| 1342.6 | -0.026 |
| 1342.7 | -0.026 |
| 1342.8 | -0.026 |
| 1342.9 | -0.026 |
| 1343.0 | -0.026 |
| 1343.1 | -0.026 |
| 1343.2 | -0.026 |
| 1343.3 | -0.026 |
| 1343.4 | -0.026 |
| 1343.5 | -0.026 |
| 1343.6 | -0.026 |
| 1343.7 | -0.026 |
| 1343.8 | -0.026 |
| 1343.9 | -0.026 |
| 1344.0 | -0.026 |
| 1344.1 | -0.026 |
| 1344.2 | -0.026 |
| 1344.3 | -0.026 |
| 1344.4 | -0.026 |
| 1344.5 | -0.026 |
| 1344.6 | -0.026 |
| 1344.7 | -0.026 |
| 1344.8 | -0.026 |
| 1344.9 | -0.026 |
| 1345.0 | -0.026 |
| 1345.1 | -0.026 |
| 1345.2 | -0.026 |
| 1345.3 | -0.026 |
| 1345.4 | -0.026 |
| 1345.5 | -0.026 |
| 1345.6 | -0.026 |
| 1345.7 | -0.026 |
| 1345.8 | -0.026 |
| 1345.9 | -0.026 |
| 1346.0 | -0.026 |
| 1346.1 | -0.026 |
| 1346.2 | -0.026 |
| 1346.3 | -0.026 |
| 1346.4 | -0.026 |
| 1346.5 | -0.026 |
| 1346.6 | -0.026 |
| 1346.7 | -0.026 |
| 1346.8 | -0.026 |
| 1346.9 | -0.026 |
| 1347.0 | -0.026 |
| 1347.1 | -0.026 |
| 1347.2 | -0.026 |
| 1347.3 | -0.026 |
| 1347.4 | -0.026 |
| 1347.5 | -0.026 |
| 1347.6 | -0.026 |
| 1347.7 | -0.026 |
| 1347.8 | -0.026 |
| 1347.9 | -0.026 |
| 1348.0 | -0.026 |
| 1348.1 | -0.026 |
| 1348.2 | -0.026 |
| 1348.3 | -0.026 |
| 1348.4 | -0.026 |
| 1348.5 | -0.026 |
| 1348.6 | -0.026 |
| 1348.7 | -0.026 |
| 1348.8 | -0.026 |
| 1348.9 | -0.026 |
| 1349.0 | -0.026 |
| 1349.1 | -0.026 |
| 1349.2 | -0.026 |
| 1349.3 | -0.026 |
| 1349.4 | -0.026 |
| 1349.5 | -0.026 |
| 1349.6 | -0.026 |
| 1349.7 | -0.026 |
| 1349.8 | -0.026 |
| 1349.9 | -0.026 |
| 1350.0 | -0.026 |
| 1350.1 | -0.026 |
| 1350.2 | -0.026 |
| 1350.3 | -0.026 |
| 1350.4 | -0.026 |
| 1350.5 | -0.026 |
| 1350.6 | -0.026 |
| 1350.7 | -0.026 |
| 1350.8 | -0.026 |
| 1350.9 | -0.026 |
| 1351.0 | -0.026 |
| 1351.1 | -0.026 |
| 1351.2 | -0.026 |
| 1351.3 | -0.026 |
| 1351.4 | -0.026 |
| 1351.5 | -0.026 |
| 1351.6 | -0.026 |
| 1351.7 | -0.026 |
| 1351.8 | -0.026 |
| 1351.9 | -0.026 |
| 1352.0 | -0.026 |
| 1352.1 | -0.026 |
| 1352.2 | -0.026 |
| 1352.3 | -0.026 |
| 1352.4 | -0.026 |
| 1352.5 | -0.026 |
| 1352.6 | -0.026 |
| 1352.7 | -0.026 |
| 1352.8 | -0.026 |
| 1352.9 | -0.026 |
| 1353.0 | -0.026 |
| 1353.1 | -0.026 |
| 1353.2 | -0.026 |
| 1353.3 | -0.026 |
| 1353.4 | -0.026 |
| 1353.5 | -0.026 |
| 1353.6 | -0.026 |
| 1353.7 | -0.026 |
| 1353.8 | -0.026 |
| 1353.9 | -0.026 |
| 1354.0 | -0.026 |
| 1354.1 | -0.026 |
| 1354.2 | -0.026 |
| 1354.3 | -0.026 |
| 1354.4 | -0.026 |
| 1354.5 | -0.026 |
| 1354.6 | -0.026 |
| 1354.7 | -0.026 |
| 1354.8 | -0.026 |
| 1354.9 | -0.026 |
| 1355.0 | -0.026 |
| 1355.1 | -0.026 |
| 1355.2 | -0.026 |
| 1355.3 | -0.026 |
| 1355.4 | -0.026 |
| 1355.5 | -0.026 |
| 1355.6 | -0.026 |
| 1355.7 | -0.026 |
| 1355.8 | -0.026 |
| 1355.9 | -0.026 |
| 1356.0 | -0.026 |
| 1356.1 | -0.026 |
| 1356.2 | -0.026 |
| 1356.3 | -0.026 |
| 1356.4 | -0.026 |
| 1356.5 | -0.026 |
| 1356.6 | -0.026 |
| 1356.7 | -0.026 |
| 1356.8 | -0.026 |
| 1356.9 | -0.026 |
| 1357.0 | -0.026 |
| 1357.1 | -0.026 |
| 1357.2 | -0.026 |
| 1357.3 | -0.026 |
| 1357.4 | -0.026 |
| 1357.5 | -0.026 |
| 1357.6 | -0.026 |
| 1357.7 | -0.026 |
| 1357.8 | -0.026 |
| 1357.9 | -0.026 |
| 1358.0 | -0.026 |
| 1358.1 | -0.026 |
| 1358.2 | -0.026 |
| 1358.3 | -0.026 |
| 1358.4 | -0.026 |
| 1358.5 | -0.026 |
| 1358.6 | -0.026 |
| 1358.7 | -0.026 |
| 1358.8 | -0.026 |
| 1358.9 | -0.026 |
| 1359.0 | -0.026 |
| 1359.1 | -0.026 |
| 1359.2 | -0.026 |
| 1359.3 | -0.026 |
| 1359.4 | -0.026 |
| 1359.5 | -0.026 |
| 1359.6 | -0.026 |
| 1359.7 | -0.026 |
| 1359.8 | -0.026 |
| 1359.9 | -0.026 |
| 1360.0 | -0.026 |
| 1360.1 | -0.026 |
| 1360.2 | -0.026 |
| 1360.3 | -0.026 |
| 1360.4 | -0.026 |
| 1360.5 | -0.026 |
| 1360.6 | -0.026 |
| 1360.7 | -0.026 |
| 1360.8 | -0.026 |
| 1360.9 | -0.026 |
| 1361.0 | -0.026 |
| 1361.1 | -0.026 |
| 1361.2 | -0.026 |
| 1361.3 | -0.026 |
| 1361.4 | -0.026 |
| 1361.5 | -0.026 |
| 1361.6 | -0.026 |
| 1361.7 | -0.026 |
| 1361.8 | -0.026 |
| 1361.9 | -0.026 |
| 1362.0 | -0.026 |
| 1362.1 | -0.026 |
| 1362.2 | -0.026 |
| 1362.3 | -0.026 |
| 1362.4 | -0.026 |
| 1362.5 | -0.026 |
| 1362.6 | -0.026 |
| 1362.7 | -0.026 |
| 1362.8 | -0.026 |
| 1362.9 | -0.026 |
| 1363.0 | -0.026 |
| 1363.1 | -0.026 |
| 1363.2 | -0.026 |
| 1363.3 | -0.026 |
| 1363.4 | -0.026 |
| 1363.5 | -0.026 |
| 1363.6 | -0.026 |
| 1363.7 | -0.026 |
| 1363.8 | -0.026 |
| 1363.9 | -0.026 |
| 1364.0 | -0.026 |
| 1364.1 | -0.026 |
| 1364.2 | -0.026 |
| 1364.3 | -0.026 |
| 1364.4 | -0.026 |
| 1364.5 | -0.026 |
| 1364.6 | -0.026 |
| 1364.7 | -0.026 |
| 1364.8 | -0.026 |
| 1364.9 | -0.026 |
| 1365.0 | -0.026 |
| 1365.1 | -0.026 |
| 1365.2 | -0.026 |
| 1365.3 | -0.026 |
| 1365.4 | -0.026 |
| 1365.5 | -0.026 |
| 1365.6 | -0.026 |
| 1365.7 | -0.026 |
| 1365.8 | -0.026 |
| 1365.9 | -0.026 |
| 1366.0 | -0.026 |
| 1366.1 | -0.026 |
| 1366.2 | -0.026 |
| 1366.3 | -0.026 |
| 1366.4 | -0.026 |
| 1366.5 | -0.026 |
| 1366.6 | -0.026 |
| 1366.7 | -0.026 |
| 1366.8 | -0.026 |
| 1366.9 | -0.026 |
| 1367.0 | -0.026 |
| 1367.1 | -0.026 |
| 1367.2 | -0.026 |
| 1367.3 | -0.026 |
| 1367.4 | -0.026 |
| 1367.5 | -0.026 |
| 1367.6 | -0.026 |
| 1367.7 | -0.026 |
| 1367.8 | -0.026 |
| 1367.9 | -0.026 |
| 1368.0 | -0.026 |
| 1368.1 | -0.026 |
| 1368.2 | -0.026 |
| 1368.3 | -0.026 |
| 1368.4 | -0.026 |
| 1368.5 | -0.026 |
| 1368.6 | -0.026 |
| 1368.7 | -0.026 |
| 1368.8 | -0.026 |
| 1368.9 | -0.026 |
| 1369.0 | -0.026 |
| 1369.1 | -0.026 |
| 1369.2 | -0.026 |
| 1369.3 | -0.026 |
| 1369.4 | -0.026 |
| 1369.5 | -0.026 |
| 1369.6 | -0.026 |
| 1369.7 | -0.026 |
| 1369.8 | -0.026 |
| 1369.9 | -0.026 |
| 1370.0 | -0.026 |
| 1370.1 | -0.026 |
| 1370.2 | -0.026 |
| 1370.3 | -0.026 |
| 1370.4 | -0.026 |
| 1370.5 | -0.026 |
| 1370.6 | -0.026 |
| 1370.7 | -0.026 |
| 1370.8 | -0.026 |
| 1370.9 | -0.026 |
| 1371.0 | -0.026 |
| 1371.1 | -0.026 |
| 1371.2 | -0.026 |
| 1371.3 | -0.026 |
| 1371.4 | -0.026 |
| 1371.5 | -0.026 |
| 1371.6 | -0.026 |
| 1371.7 | -0.026 |
| 1371.8 | -0.026 |
| 1371.9 | -0.026 |
| 1372.0 | -0.026 |
| 1372.1 | -0.026 |
| 1372.2 | -0.026 |
| 1372.3 | -0.026 |
| 1372.4 | -0.026 |
| 1372.5 | -0.026 |
| 1372.6 | -0.026 |
| 1372.7 | -0.026 |
| 1372.8 | -0.026 |
| 1372.9 | -0.026 |
| 1373.0 | -0.026 |
| 1373.1 | -0.026 |
| 1373.2 | -0.026 |
| 1373.3 | -0.026 |
| 1373.4 | -0.026 |
| 1373.5 | -0.026 |
| 1373.6 | -0.026 |
| 1373.7 | -0.026 |
| 1373.8 | -0.026 |
| 1373.9 | -0.026 |
| 1374.0 | -0.026 |
| 1374.1 | -0.026 |
| 1374.2 | -0.026 |
| 1374.3 | -0.026 |
| 1374.4 | -0.026 |
| 1374.5 | -0.026 |
| 1374.6 | -0.026 |
| 1374.7 | -0.026 |
| 1374.8 | -0.026 |
| 1374.9 | -0.026 |
| 1375.0 | -0.026 |
| 1375.1 | -0.026 |
| 1375.2 | -0.026 |
| 1375.3 | -0.026 |
| 1375.4 | -0.026 |
| 1375.5 | -0.026 |
| 1375.6 | -0.026 |
| 1375.7 | -0.026 |
| 1375.8 | -0.026 |
| 1375.9 | -0.026 |
| 1376.0 | -0.026 |
| 1376.1 | -0.026 |
| 1376.2 | -0.026 |
| 1376.3 | -0.026 |
| 1376.4 | -0.026 |
| 1376.5 | -0.026 |
| 1376.6 | -0.026 |
| 1376.7 | -0.026 |
| 1376.8 | -0.026 |
| 1376.9 | -0.026 |
| 1377.0 | -0.026 |
| 1377.1 | -0.026 |
| 1377.2 | -0.026 |
| 1377.3 | -0.026 |
| 1377.4 | -0.026 |
| 1377.5 | -0.026 |
| 1377.6 | -0.026 |
| 1377.7 | -0.026 |
| 1377.8 | -0.026 |
| 1377.9 | -0.026 |
| 1378.0 | -0.026 |
| 1378.1 | -0.026 |
| 1378.2 | -0.026 |
| 1378.3 | -0.026 |
| 1378.4 | -0.026 |
| 1378.5 | -0.026 |
| 1378.6 | -0.026 |
| 1378.7 | -0.026 |
| 1378.8 | -0.026 |
| 1378.9 | -0.026 |
| 1379.0 | -0.026 |
| 1379.1 | -0.026 |
| 1379.2 | -0.026 |
| 1379.3 | -0.026 |
| 1379.4 | -0.026 |
| 1379.5 | -0.026 |
| 1379.6 | -0.026 |
| 1379.7 | -0.026 |
| 1379.8 | -0.026 |
| 1379.9 | -0.026 |
| 1380.0 | -0.026 |
| 1380.1 | -0.026 |
| 1380.2 | -0.026 |
| 1380.3 | -0.026 |
| 1380.4 | -0.026 |
| 1380.5 | -0.026 |
| 1380.6 | -0.026 |
| 1380.7 | -0.026 |
| 1380.8 | -0.026 |
| 1380.9 | -0.026 |
| 1381.0 | -0.026 |
| 1381.1 | -0.026 |
| 1381.2 | -0.026 |
| 1381.3 | -0.026 |
| 1381.4 | -0.026 |
| 1381.5 | -0.026 |
| 1381.6 | -0.026 |
| 1381.7 | -0.026 |
| 1381.8 | -0.026 |
| 1381.9 | -0.026 |
| 1382.0 | -0.026 |
| 1382.1 | -0.026 |
| 1382.2 | -0.026 |
| 1382.3 | -0.026 |
| 1382.4 | -0.026 |
| 1382.5 | -0.026 |
| 1382.6 | -0.026 |
| 1382.7 | -0.026 |
| 1382.8 | -0.026 |
| 1382.9 | -0.026 |
| 1383.0 | -0.026 |
| 1383.1 | -0.026 |
| 1383.2 | -0.026 |
| 1383.3 | -0.026 |
| 1383.4 | -0.026 |
| 1383.5 | -0.026 |
| 1383.6 | -0.026 |
| 1383.7 | -0.026 |
| 1383.8 | -0.026 |
| 1383.9 | -0.026 |
| 1384.0 | -0.026 |
| 1384.1 | -0.026 |
| 1384.2 | -0.026 |
| 1384.3 | -0.026 |
| 1384.4 | -0.026 |
| 1384.5 | -0.026 |
| 1384.6 | -0.026 |
| 1384.7 | -0.026 |
| 1384.8 | -0.026 |
| 1384.9 | -0.026 |
| 1385.0 | -0.026 |
| 1385.1 | -0.026 |
| 1385.2 | -0.026 |
| 1385.3 | -0.026 |
| 1385.4 | -0.026 |
| 1385.5 | -0.026 |
| 1385.6 | -0.026 |
| 1385.7 | -0.026 |
| 1385.8 | -0.026 |
| 1385.9 | -0.026 |
| 1386.0 | -0.026 |
| 1386.1 | -0.026 |
| 1386.2 | -0.026 |
| 1386.3 | -0.026 |
| 1386.4 | -0.026 |
| 1386.5 | -0.026 |
| 1386.6 | -0.026 |
| 1386.7 | -0.026 |
| 1386.8 | -0.026 |
| 1386.9 | -0.026 |
| 1387.0 | -0.026 |
| 1387.1 | -0.026 |
| 1387.2 | -0.026 |
| 1387.3 | -0.026 |
| 1387.4 | -0.026 |
| 1387.5 | -0.026 |
| 1387.6 | -0.026 |
| 1387.7 | -0.026 |
| 1387.8 | -0.026 |
| 1387.9 | -0.026 |
| 1388.0 | -0.026 |
| 1388.1 | -0.026 |
| 1388.2 | -0.026 |
| 1388.3 | -0.026 |
| 1388.4 | -0.026 |
| 1388.5 | -0.026 |
| 1388.6 | -0.026 |
| 1388.7 | -0.026 |
| 1388.8 | -0.026 |
| 1388.9 | -0.026 |
| 1389.0 | -0.026 |
| 1389.1 | -0.026 |
| 1389.2 | -0.026 |
| 1389.3 | -0.026 |
| 1389.4 | -0.026 |
| 1389.5 | -0.026 |
| 1389.6 | -0.026 |
| 1389.7 | -0.026 |
| 1389.8 | -0.026 |
| 1389.9 | -0.026 |
| 1390.0 | -0.026 |
| 1390.1 | -0.026 |
| 1390.2 | -0.026 |
| 1390.3 | -0.026 |
| 1390.4 | -0.026 |
| 1390.5 | -0.026 |
| 1390.6 | -0.026 |
| 1390.7 | -0.026 |
| 1390.8 | -0.026 |
| 1390.9 | -0.026 |
| 1391.0 | -0.026 |
| 1391.1 | -0.026 |
| 1391.2 | -0.026 |
| 1391.3 | -0.026 |
| 1391.4 | -0.026 |
| 1391.5 | -0.026 |
| 1391.6 | -0.026 |
| 1391.7 | -0.026 |
| 1391.8 | -0.026 |
| 1391.9 | -0.026 |
| 1392.0 | -0.026 |
| 1392.1 | -0.026 |
| 1392.2 | -0.026 |
| 1392.3 | -0.026 |
| 1392.4 | -0.026 |
| 1392.5 | -0.026 |
| 1392.6 | -0.026 |
| 1392.7 | -0.026 |
| 1392.8 | -0.026 |
| 1392.9 | -0.026 |
| 1393.0 | -0.026 |
| 1393.1 | -0.026 |
| 1393.2 | -0.026 |
| 1393.3 | -0.026 |
| 1393.4 | -0.026 |
| 1393.5 | -0.026 |
| 1393.6 | -0.026 |
| 1393.7 | -0.026 |
| 1393.8 | -0.026 |
| 1393.9 | -0.026 |
| 1394.0 | -0.026 |
| 1394.1 | -0.026 |
| 1394.2 | -0.026 |
| 1394.3 | -0.026 |
| 1394.4 | -0.026 |
| 1394.5 | -0.026 |
| 1394.6 | -0.026 |
| 1394.7 | -0.026 |
| 1394.8 | -0.026 |
| 1394.9 | -0.026 |
| 1395.0 | -0.026 |
| 1395.1 | -0.026 |
| 1395.2 | -0.026 |
| 1395.3 | -0.026 |
| 1395.4 | -0.026 |
| 1395.5 | -0.026 |
| 1395.6 | -0.026 |
| 1395.7 | -0.026 |
| 1395.8 | -0.026 |
| 1395.9 | -0.026 |
| 1396.0 | -0.026 |
| 1396.1 | -0.026 |
| 1396.2 | -0.026 |
| 1396.3 | -0.026 |
| 1396.4 | -0.026 |
| 1396.5 | -0.026 |
| 1396.6 | -0.026 |
| 1396.7 | -0.026 |
| 1396.8 | -0.026 |
| 1396.9 | -0.026 |
| 1397.0 | -0.026 |
| 1397.1 | -0.026 |
| 1397.2 | -0.026 |
| 1397.3 | -0.026 |
| 1397.4 | -0.026 |
| 1397.5 | -0.026 |
| 1397.6 | -0.026 |
| 1397.7 | -0.026 |
| 1397.8 | -0.026 |
| 1397.9 | -0.026 |
| 1398.0 | -0.026 |
| 1398.1 | -0.026 |
| 1398.2 | -0.026 |
| 1398.3 | -0.026 |
| 1398.4 | -0.026 |
| 1398.5 | -0.026 |
| 1398.6 | -0.026 |
| 1398.7 | -0.026 |
| 1398.8 | -0.026 |
| 1398.9 | -0.026 |
| 1399.0 | -0.026 |
| 1399.1 | -0.026 |
| 1399.2 | -0.026 |
| 1399.3 | -0.026 |
| 1399.4 | -0.026 |
| 1399.5 | -0.026 |
| 1399.6 | -0.026 |
| 1399.7 | -0.026 |
| 1399.8 | -0.026 |
| 1399.9 | -0.026 |
| 1400.0 | -0.026 |
| 1400.1 | -0.026 |
| 1400.2 | -0.026 |
| 1400.3 | -0.026 |
| 1400.4 | -0.026 |
| 1400.5 | -0.026 |
| 1400.6 | -0.026 |
| 1400.7 | -0.026 |
| 1400.8 | -0.026 |
| 1400.9 | -0.026 |
| 1401.0 | -0.026 |
| 1401.1 | -0.026 |
| 1401.2 | -0.026 |
| 1401.3 | -0.026 |
| 1401.4 | -0.026 |
| 1401.5 | -0.026 |
| 1401.6 | -0.026 |
| 1401.7 | -0.026 |
| 1401.8 | -0.026 |
| 1401.9 | -0.026 |
| 1402.0 | -0.026 |
| 1402.1 | -0.026 |
| 1402.2 | -0.026 |
| 1402.3 | -0.026 |
| 1402.4 | -0.026 |
| 1402.5 | -0.026 |
| 1402.6 | -0.026 |
| 1402.7 | -0.026 |
| 1402.8 | -0.026 |
| 1402.9 | -0.026 |
| 1403.0 | -0.026 |
| 1403.1 | -0.026 |
| 1403.2 | -0.026 |
| 1403.3 | -0.026 |
| 1403.4 | -0.026 |
| 1403.5 | -0.026 |
| 1403.6 | -0.026 |
| 1403.7 | -0.026 |
| 1403.8 | -0.026 |
| 1403.9 | -0.026 |
| 1404.0 | -0.026 |
| 1404.1 | -0.026 |
| 1404.2 | -0.026 |
| 1404.3 | -0.026 |
| 1404.4 | -0.026 |
| 1404.5 | -0.026 |
| 1404.6 | -0.026 |
| 1404.7 | -0.026 |
| 1404.8 | -0.026 |
| 1404.9 | -0.026 |
| 1405.0 | -0.026 |
| 1405.1 | -0.026 |
| 1405.2 | -0.026 |
| 1405.3 | -0.026 |
| 1405.4 | -0.026 |
| 1405.5 | -0.026 |
| 1405.6 | -0.026 |
| 1405.7 | -0.026 |
| 1405.8 | -0.026 |
| 1405.9 | -0.026 |
| 1406.0 | -0.026 |
| 1406.1 | -0.026 |
| 1406.2 | -0.026 |
| 1406.3 | -0.026 |
| 1406.4 | -0.026 |
| 1406.5 | -0.026 |
| 1406.6 | -0.026 |
| 1406.7 | -0.026 |
| 1406.8 | -0.026 |
| 1406.9 | -0.026 |
| 1407.0 | -0.026 |
| 1407.1 | -0.026 |
| 1407.2 | -0.026 |
| 1407.3 | -0.026 |
| 1407.4 | -0.026 |
| 1407.5 | -0.026 |
| 1407.6 | -0.026 |
| 1407.7 | -0.026 |
| 1407.8 | -0.026 |
| 1407.9 | -0.026 |
| 1408.0 | -0.026 |
| 1408.1 | -0.026 |
| 1408.2 | -0.026 |
| 1408.3 | -0.026 |
| 1408.4 | -0.026 |
| 1408.5 | -0.026 |
| 1408.6 | -0.026 |
| 1408.7 | -0.026 |
| 1408.8 | -0.026 |
| 1408.9 | -0.026 |
| 1409.0 | -0.026 |
| 1409.1 | -0.026 |
| 1409.2 | -0.026 |
| 1409.3 | -0.026 |
| 1409.4 | -0.026 |
| 1409.5 | -0.026 |
| 1409.6 | -0.026 |
| 1409.7 | -0.026 |
| 1409.8 | -0.026 |
| 1409.9 | -0.026 |
| 1410.0 | -0.026 |
| 1410.1 | -0.026 |
| 1410.2 | -0.026 |
| 1410.3 | -0.026 |
| 1410.4 | -0.026 |
| 1410.5 | -0.026 |
| 1410.6 | -0.026 |
| 1410.7 | -0.026 |
| 1410.8 | -0.026 |
| 1410.9 | -0.026 |
| 1411.0 | -0.026 |
| 1411.1 | -0.026 |
| 1411.2 | -0.026 |
| 1411.3 | -0.026 |
| 1411.4 | -0.026 |
| 1411.5 | -0.026 |
| 1411.6 | -0.026 |
| 1411.7 | -0.026 |
| 1411.8 | -0.026 |
| 1411.9 | -0.026 |
| 1412.0 | -0.026 |
| 1412.1 | -0.026 |
| 1412.2 | -0.026 |
| 1412.3 | -0.026 |
| 1412.4 | -0.026 |
| 1412.5 | -0.026 |
| 1412.6 | -0.026 |
| 1412.7 | -0.026 |
| 1412.8 | -0.026 |
| 1412.9 | -0.026 |
| 1413.0 | -0.026 |
| 1413.1 | -0.026 |
| 1413.2 | -0.026 |
| 1413.3 | -0.026 |
| 1413.4 | -0.026 |
| 1413.5 | -0.026 |
| 1413.6 | -0.026 |
| 1413.7 | -0.026 |
| 1413.8 | -0.026 |
| 1413.9 | -0.026 |
| 1414.0 | -0.026 |
| 1414.1 | -0.026 |
| 1414.2 | -0.026 |
| 1414.3 | -0.026 |
| 1414.4 | -0.026 |
| 1414.5 | -0.026 |
| 1414.6 | -0.026 |
| 1414.7 | -0.026 |
| 1414.8 | -0.026 |
| 1414.9 | -0.026 |
| 1415.0 | -0.026 |
| 1415.1 | -0.026 |
| 1415.2 | -0.026 |
| 1415.3 | -0.026 |
| 1415.4 | -0.026 |
| 1415.5 | -0.026 |
| 1415.6 | -0.026 |
| 1415.7 | -0.026 |
| 1415.8 | -0.026 |
| 1415.9 | -0.026 |
| 1416.0 | -0.026 |
| 1416.1 | -0.026 |
| 1416.2 | -0.026 |
| 1416.3 | -0.026 |
| 1416.4 | -0.026 |
| 1416.5 | -0.026 |
| 1416.6 | -0.026 |
| 1416.7 | -0.026 |
| 1416.8 | -0.026 |
| 1416.9 | -0.026 |
| 1417.0 | -0.026 |
| 1417.1 | -0.026 |
| 1417.2 | -0.026 |
| 1417.3 | -0.026 |
| 1417.4 | -0.026 |
| 1417.5 | -0.026 |
| 1417.6 | -0.026 |
| 1417.7 | -0.026 |
| 1417.8 | -0.026 |
| 1417.9 | -0.026 |
| 1418.0 | -0.026 |
| 1418.1 | -0.026 |
| 1418.2 | -0.026 |
| 1418.3 | -0.026 |
| 1418.4 | -0.026 |
| 1418.5 | -0.026 |
| 1418.6 | -0.026 |
| 1418.7 | -0.026 |
| 1418.8 | -0.026 |
| 1418.9 | -0.026 |
| 1419.0 | -0.026 |
| 1419.1 | -0.026 |
| 1419.2 | -0.026 |
| 1419.3 | -0.026 |
| 1419.4 | -0.026 |
| 1419.5 | -0.026 |
| 1419.6 | -0.026 |
| 1419.7 | -0.026 |
| 1419.8 | -0.026 |
| 1419.9 | -0.026 |
| 1420.0 | -0.026 |
| 1420.1 | -0.026 |
| 1420.2 | -0.026 |
| 1420.3 | -0.026 |
| 1420.4 | -0.026 |
| 1420.5 | -0.026 |
| 1420.6 | -0.026 |
| 1420.7 | -0.026 |
| 1420.8 | -0.026 |
| 1420.9 | -0.026 |
| 1421.0 | -0.026 |
| 1421.1 | -0.026 |
| 1421.2 | -0.026 |
| 1421.3 | -0.026 |
| 1421.4 | -0.026 |
| 1421.5 | -0.026 |
| 1421.6 | -0.026 |
| 1421.7 | -0.026 |
| 1421.8 | -0.026 |
| 1421.9 | -0.026 |
| 1422.0 | -0.026 |
| 1422.1 | -0.026 |
| 1422.2 | -0.026 |
| 1422.3 | -0.026 |
| 1422.4 | -0.026 |
| 1422.5 | -0.026 |
| 1422.6 | -0.026 |
| 1422.7 | -0.026 |
| 1422.8 | -0.026 |
| 1422.9 | -0.026 |
| 1423.0 | -0.026 |
| 1423.1 | -0.026 |
| 1423.2 | -0.026 |
| 1423.3 | -0.026 |
| 1423.4 | -0.026 |
| 1423.5 | -0.026 |
| 1423.6 | -0.026 |
| 1423.7 | -0.026 |
| 1423.8 | -0.026 |
| 1423.9 | -0.026 |
| 1424.0 | -0.026 |
| 1424.1 | -0.026 |
| 1424.2 | -0.026 |
| 1424.3 | -0.026 |
| 1424.4 | -0.026 |
| 1424.5 | -0.026 |
| 1424.6 | -0.026 |
| 1424.7 | -0.026 |
| 1424.8 | -0.026 |
| 1424.9 | -0.026 |
| 1425.0 | -0.026 |
| 1425.1 | -0.026 |
| 1425.2 | -0.026 |
| 1425.3 | -0.026 |
| 1425.4 | -0.026 |
| 1425.5 | -0.026 |
| 1425.6 | -0.026 |
| 1425.7 | -0.026 |
| 1425.8 | -0.026 |
| 1425.9 | -0.026 |
| 1426.0 | -0.026 |
| 1426.1 | -0.026 |
| 1426.2 | -0.026 |
| 1426.3 | -0.026 |
| 1426.4 | -0.026 |
| 1426.5 | -0.026 |
| 1426.6 | -0.026 |
| 1426.7 | -0.026 |
| 1426.8 | -0.026 |
| 1426.9 | -0.026 |
| 1427.0 | -0.026 |
| 1427.1 | -0.026 |
| 1427.2 | -0.026 |
| 1427.3 | -0.026 |
| 1427.4 | -0.026 |
| 1427.5 | -0.026 |
| 1427.6 | -0.026 |
| 1427.7 | -0.026 |
| 1427.8 | -0.026 |
| 1427.9 | -0.026 |
| 1428.0 | -0.026 |
| 1428.1 | -0.026 |
| 1428.2 | -0.026 |
| 1428.3 | -0.026 |
| 1428.4 | -0.026 |
| 1428.5 | -0.026 |
| 1428.6 | -0.026 |
| 1428.7 | -0.026 |
| 1428.8 | -0.026 |
| 1428.9 | -0.026 |
| 1429.0 | -0.026 |
| 1429.1 | -0.026 |
| 1429.2 | -0.026 |
| 1429.3 | -0.026 |
| 1429.4 | -0.026 |
| 1429.5 | -0.026 |
| 1429.6 | -0.026 |
| 1429.7 | -0.026 |
| 1429.8 | -0.026 |
| 1429.9 | -0.026 |
| 1430.0 | -0.026 |
| 1430.1 | -0.026 |
| 1430.2 | -0.026 |
| 1430.3 | -0.026 |
| 1430.4 | -0.026 |
| 1430.5 | -0.026 |
| 1430.6 | -0.026 |
| 1430.7 | -0.026 |
| 1430.8 | -0.026 |
| 1430.9 | -0.026 |
| 1431.0 | -0.026 |
| 1431.1 | -0.026 |
| 1431.2 | -0.026 |
| 1431.3 | -0.026 |
| 1431.4 | -0.026 |
| 1431.5 | -0.026 |
| 1431.6 | -0.026 |
| 1431.7 | -0.026 |
| 1431.8 | -0.026 |
| 1431.9 | -0.026 |
| 1432.0 | -0.026 |
| 1432.1 | -0.026 |
| 1432.2 | -0.026 |
| 1432.3 | -0.026 |
| 1432.4 | -0.026 |
| 1432.5 | -0.026 |
| 1432.6 | -0.026 |
| 1432.7 | -0.026 |
| 1432.8 | -0.026 |
| 1432.9 | -0.026 |
| 1433.0 | -0.026 |
| 1433.1 | -0.026 |
| 1433.2 | -0.026 |
| 1433.3 | -0.026 |
| 1433.4 | -0.026 |
| 1433.5 | -0.026 |
| 1433.6 | -0.026 |
| 1433.7 | -0.026 |
| 1433.8 | -0.026 |
| 1433.9 | -0.026 |
| 1434.0 | -0.026 |
| 1434.1 | -0.026 |
| 1434.2 | -0.026 |
| 1434.3 | -0.026 |
| 1434.4 | -0.026 |
| 1434.5 | -0.026 |
| 1434.6 | -0.026 |
| 1434.7 | -0.026 |
| 1434.8 | -0.026 |
| 1434.9 | -0.026 |
| 1435.0 | -0.026 |
| 1435.1 | -0.026 |
| 1435.2 | -0.026 |
| 1435.3 | -0.026 |
| 1435.4 | -0.026 |
| 1435.5 | -0.026 |
| 1435.6 | -0.026 |
| 1435.7 | -0.026 |
| 1435.8 | -0.026 |
| 1435.9 | -0.026 |
| 1436.0 | -0.026 |
| 1436.1 | -0.026 |
| 1436.2 | -0.026 |
| 1436.3 | -0.026 |
| 1436.4 | -0.026 |
| 1436.5 | -0.026 |
| 1436.6 | -0.026 |
| 1436.7 | -0.026 |
| 1436.8 | -0.026 |
| 1436.9 | -0.026 |
| 1437.0 | -0.026 |
| 1437.1 | -0.026 |
| 1437.2 | -0.026 |
| 1437.3 | -0.026 |
| 1437.4 | -0.026 |
| 1437.5 | -0.026 |
| 1437.6 | -0.026 |
| 1437.7 | -0.026 |
| 1437.8 | -0.026 |
| 1437.9 | -0.026 |
| 1438.0 | -0.026 |
| 1438.1 | -0.026 |
| 1438.2 | -0.026 |
| 1438.3 | -0.026 |
| 1438.4 | -0.026 |
| 1438.5 | -0.026 |
| 1438.6 | -0.026 |
| 1438.7 | -0.026 |
| 1438.8 | -0.026 |
| 1438.9 | -0.026 |
| 1439.0 | -0.026 |
| 1439.1 | -0.026 |
| 1439.2 | -0.026 |
| 1439.3 | -0.026 |
| 1439.4 | -0.026 |
| 1439.5 | -0.026 |
| 1439.6 | -0.026 |
| 1439.7 | -0.026 |
| 1439.8 | -0.026 |
| 1439.9 | -0.026 |
| 1440.0 | -0.026 |
| 1440.1 | -0.026 |
| 1440.2 | -0.026 |
| 1440.3 | -0.026 |
| 1440.4 | -0.026 |
| 1440.5 | -0.026 |
| 1440.6 | -0.026 |
| 1440.7 | -0.026 |
| 1440.8 | -0.026 |
| 1440.9 | -0.026 |
| 1441.0 | -0.026 |
| 1441.1 | -0.026 |
| 1441.2 | -0.026 |
| 1441.3 | -0.026 |
| 1441.4 | -0.026 |
| 1441.5 | -0.026 |
| 1441.6 | -0.026 |
| 1441.7 | -0.026 |
| 1441.8 | -0.026 |
| 1441.9 | -0.026 |
| 1442.0 | -0.026 |
| 1442.1 | -0.026 |
| 1442.2 | -0.026 |
| 1442.3 | -0.026 |
| 1442.4 | -0.026 |
| 1442.5 | -0.026 |
| 1442.6 | -0.026 |
| 1442.7 | -0.026 |
| 1442.8 | -0.026 |
| 1442.9 | -0.026 |
| 1443.0 | -0.026 |
| 1443.1 | -0.026 |
| 1443.2 | -0.026 |
| 1443.3 | -0.026 |
| 1443.4 | -0.026 |
| 1443.5 | -0.026 |
| 1443.6 | -0.026 |
| 1443.7 | -0.026 |
| 1443.8 | -0.026 |
| 1443.9 | -0.026 |
| 1444.0 | -0.026 |
| 1444.1 | -0.026 |
| 1444.2 | -0.026 |
| 1444.3 | -0.026 |
| 1444.4 | -0.026 |
| 1444.5 | -0.026 |
| 1444.6 | -0.026 |
| 1444.7 | -0.026 |
| 1444.8 | -0.026 |
| 1444.9 | -0.026 |
| 1445.0 | -0.026 |
| 1445.1 | -0.026 |
| 1445.2 | -0.026 |
| 1445.3 | -0.026 |
| 1445.4 | -0.026 |
| 1445.5 | -0.026 |
| 1445.6 | -0.026 |
| 1445.7 | -0.026 |
| 1445.8 | -0.026 |
| 1445.9 | -0.026 |
| 1446.0 | -0.026 |
| 1446.1 | -0.026 |
| 1446.2 | -0.026 |
| 1446.3 | -0.026 |
| 1446.4 | -0.026 |
| 1446.5 | -0.026 |
| 1446.6 | -0.026 |
| 1446.7 | -0.026 |
| 1446.8 | -0.026 |
| 1446.9 | -0.026 |
| 1447.0 | -0.026 |
| 1447.1 | -0.026 |
| 1447.2 | -0.026 |
| 1447.3 | -0.026 |
| 1447.4 | -0.026 |
| 1447.5 | -0.026 |
| 1447.6 | -0.026 |
| 1447.7 | -0.026 |
| 1447.8 | -0.026 |
| 1447.9 | -0.026 |
| 1448.0 | -0.026 |
| 1448.1 | -0.026 |
| 1448.2 | -0.026 |
| 1448.3 | -0.026 |
| 1448.4 | -0.026 |
| 1448.5 | -0.026 |
| 1448.6 | -0.026 |
| 1448.7 | -0.026 |
| 1448.8 | -0.026 |
| 1448.9 | -0.026 |
| 1449.0 | -0.026 |
| 1449.1 | -0.026 |
| 1449.2 | -0.026 |
| 1449.3 | -0.026 |
| 1449.4 | -0.026 |
| 1449.5 | -0.026 |
| 1449.6 | -0.026 |
| 1449.7 | -0.026 |
| 1449.8 | -0.026 |
| 1449.9 | -0.026 |
| 1450.0 | -0.026 |
| 1450.1 | -0.026 |
| 1450.2 | -0.026 |
| 1450.3 | -0.026 |
| 1450.4 | -0.026 |
| 1450.5 | -0.026 |
| 1450.6 | -0.026 |
| 1450.7 | -0.026 |
| 1450.8 | -0.026 |
| 1450.9 | -0.026 |
| 1451.0 | -0.026 |
| 1451.1 | -0.026 |
| 1451.2 | -0.026 |
| 1451.3 | -0.026 |
| 1451.4 | -0.026 |
| 1451.5 | -0.026 |
| 1451.6 | -0.026 |
| 1451.7 | -0.026 |
| 1451.8 | -0.026 |
| 1451.9 | -0.026 |
| 1452.0 | -0.026 |
| 1452.1 | -0.026 |
| 1452.2 | -0.026 |
| 1452.3 | -0.026 |
| 1452.4 | -0.026 |
| 1452.5 | -0.026 |
| 1452.6 | -0.026 |
| 1452.7 | -0.026 |
| 1452.8 | -0.026 |
| 1452.9 | -0.026 |
| 1453.0 | -0.026 |
| 1453.1 | -0.026 |
| 1453.2 | -0.026 |
| 1453.3 | -0.026 |
| 1453.4 | -0.026 |
| 1453.5 | -0.026 |
| 1453.6 | -0.026 |
| 1453.7 | -0.026 |
| 1453.8 | -0.026 |
| 1453.9 | -0.026 |
| 1454.0 | -0.026 |
| 1454.1 | -0.026 |
| 1454.2 | -0.026 |
| 1454.3 | -0.026 |
| 1454.4 | -0.026 |
| 1454.5 | -0.026 |
| 1454.6 | -0.026 |
| 1454.7 | -0.026 |
| 1454.8 | -0.026 |
| 1454.9 | -0.026 |
| 1455.0 | -0.026 |
| 1455.1 | -0.026 |
| 1455.2 | -0.026 |
| 1455.3 | -0.026 |
| 1455.4 | -0.026 |
| 1455.5 | -0.026 |
| 1455.6 | -0.026 |
| 1455.7 | -0.026 |
| 1455.8 | -0.026 |
| 1455.9 | -0.026 |
| 1456.0 | -0.026 |
| 1456.1 | -0.026 |
| 1456.2 | -0.026 |
| 1456.3 | -0.026 |
| 1456.4 | -0.026 |
| 1456.5 | -0.026 |
| 1456.6 | -0.026 |
| 1456.7 | -0.026 |
| 1456.8 | -0.026 |
| 1456.9 | -0.026 |
| 1457.0 | -0.026 |
| 1457.1 | -0.026 |
| 1457.2 | -0.026 |
| 1457.3 | -0.026 |
| 1457.4 | -0.026 |
| 1457.5 | -0.026 |
| 1457.6 | -0.026 |
| 1457.7 | -0.026 |
| 1457.8 | -0.026 |
| 1457.9 | -0.026 |
| 1458.0 | -0.026 |
| 1458.1 | -0.026 |
| 1458.2 | -0.026 |
| 1458.3 | -0.026 |
| 1458.4 | -0.026 |
| 1458.5 | -0.026 |
| 1458.6 | -0.026 |
| 1458.7 | -0.026 |
| 1458.8 | -0.026 |
| 1458.9 | -0.026 |
| 1459.0 | -0.026 |
| 1459.1 | -0.026 |
| 1459.2 | -0.026 |
| 1459.3 | -0.026 |
| 1459.4 | -0.026 |
| 1459.5 | -0.026 |
| 1459.6 | -0.026 |
| 1459.7 | -0.026 |
| 1459.8 | -0.026 |
| 1459.9 | -0.026 |
| 1460.0 | -0.026 |
| 1460.1 | -0.026 |
| 1460.2 | -0.026 |
| 1460.3 | -0.026 |
| 1460.4 | -0.026 |
| 1460.5 | -0.026 |
| 1460.6 | -0.026 |
| 1460.7 | -0.026 |
| 1460.8 | -0.026 |
| 1460.9 | -0.026 |
| 1461.0 | -0.026 |
| 1461.1 | -0.026 |
| 1461.2 | -0.026 |
| 1461.3 | -0.026 |
| 1461.4 | -0.026 |
| 1461.5 | -0.026 |
| 1461.6 | -0.026 |
| 1461.7 | -0.026 |
| 1461.8 | -0.026 |
| 1461.9 | -0.026 |
| 1462.0 | -0.026 |
| 1462.1 | -0.026 |
| 1462.2 | -0.026 |
| 1462.3 | -0.026 |
| 1462.4 | -0.026 |
| 1462.5 | -0.026 |
| 1462.6 | -0.026 |
| 1462.7 | -0.026 |
| 1462.8 | -0.026 |
| 1462.9 | -0.026 |
| 1463.0 | -0.026 |
| 1463.1 | -0.026 |
| 1463.2 | -0.026 |
| 1463.3 | -0.026 |
| 1463.4 | -0.026 |
| 1463.5 | -0.026 |
| 1463.6 | -0.026 |
| 1463.7 | -0.026 |
| 1463.8 | -0.026 |
| 1463.9 | -0.026 |
| 1464.0 | -0.026 |
| 1464.1 | -0.026 |
| 1464.2 | -0.026 |
| 1464.3 | -0.026 |
| 1464.4 | -0.026 |
| 1464.5 | -0.026 |
| 1464.6 | -0.026 |
| 1464.7 | -0.026 |
| 1464.8 | -0.026 |
| 1464.9 | -0.026 |
| 1465.0 | -0.026 |
| 1465.1 | -0.026 |
| 1465.2 | -0.026 |
| 1465.3 | -0.026 |
| 1465.4 | -0.026 |
| 1465.5 | -0.026 |
| 1465.6 | -0.026 |
| 1465.7 | -0.026 |
| 1465.8 | -0.026 |
| 1465.9 | -0.026 |
| 1466.0 | -0.026 |
| 1466.1 | -0.026 |
| 1466.2 | -0.026 |
| 1466.3 | -0.026 |
| 1466.4 | -0.026 |
| 1466.5 | -0.026 |
| 1466.6 | -0.026 |
| 1466.7 | -0.026 |
| 1466.8 | -0.026 |
| 1466.9 | -0.026 |
| 1467.0 | -0.026 |
| 1467.1 | -0.026 |
| 1467.2 | -0.026 |
| 1467.3 | -0.026 |
| 1467.4 | -0.026 |
| 1467.5 | -0.026 |
| 1467.6 | -0.026 |
| 1467.7 | -0.026 |
| 1467.8 | -0.026 |
| 1467.9 | -0.026 |
| 1468.0 | -0.026 |
| 1468.1 | -0.026 |
| 1468.2 | -0.026 |
| 1468.3 | -0.026 |
| 1468.4 | -0.026 |
| 1468.5 | -0.026 |
| 1468.6 | -0.026 |
| 1468.7 | -0.026 |
| 1468.8 | -0.026 |
| 1468.9 | -0.026 |
| 1469.0 | -0.026 |
| 1469.1 | -0.026 |
| 1469.2 | -0.026 |
| 1469.3 | -0.026 |
| 1469.4 | -0.026 |
| 1469.5 | -0.026 |
| 1469.6 | -0.026 |
| 1469.7 | -0.026 |
| 1469.8 | -0.026 |
| 1469.9 | -0.026 |
| 1470.0 | -0.026 |
| 1470.1 | -0.026 |
| 1470.2 | -0.026 |
| 1470.3 | -0.026 |
| 1470.4 | -0.026 |
| 1470.5 | -0.026 |
| 1470.6 | -0.026 |
| 1470.7 | -0.026 |
| 1470.8 | -0.026 |
| 1470.9 | -0.026 |
| 1471.0 | -0.026 |
| 1471.1 | -0.026 |
| 1471.2 | -0.026 |
| 1471.3 | -0.026 |
| 1471.4 | -0.026 |
| 1471.5 | -0.026 |
| 1471.6 | -0.026 |
| 1471.7 | -0.026 |
| 1471.8 | -0.026 |
| 1471.9 | -0.026 |
| 1472.0 | -0.026 |
| 1472.1 | -0.026 |
| 1472.2 | -0.026 |
| 1472.3 | -0.026 |
| 1472.4 | -0.026 |
| 1472.5 | -0.026 |
| 1472.6 | -0.026 |
| 1472.7 | -0.026 |
| 1472.8 | -0.026 |
| 1472.9 | -0.026 |
| 1473.0 | -0.026 |
| 1473.1 | -0.026 |
| 1473.2 | -0.026 |
| 1473.3 | -0.026 |
| 1473.4 | -0.026 |
| 1473.5 | -0.026 |
| 1473.6 | -0.026 |
| 1473.7 | -0.026 |
| 1473.8 | -0.026 |
| 1473.9 | -0.026 |
| 1474.0 | -0.026 |
| 1474.1 | -0.026 |
| 1474.2 | -0.026 |
| 1474.3 | -0.026 |
| 1474.4 | -0.026 |
| 1474.5 | -0.026 |
| 1474.6 | -0.026 |
| 1474.7 | -0.026 |
| 1474.8 | -0.026 |
| 1474.9 | -0.026 |
| 1475.0 | -0.026 |
| 1475.1 | -0.026 |
| 1475.2 | -0.026 |
| 1475.3 | -0.026 |
| 1475.4 | -0.026 |
| 1475.5 | -0.026 |
| 1475.6 | -0.026 |
| 1475.7 | -0.026 |
| 1475.8 | -0.026 |
| 1475.9 | -0.026 |
| 1476.0 | -0.026 |
| 1476.1 | -0.026 |
| 1476.2 | -0.026 |
| 1476.3 | -0.026 |
| 1476.4 | -0.026 |
| 1476.5 | -0.026 |
| 1476.6 | -0.026 |
| 1476.7 | -0.026 |
| 1476.8 | -0.026 |
| 1476.9 | -0.026 |
| 1477.0 | -0.026 |
| 1477.1 | -0.026 |
| 1477.2 | -0.026 |
| 1477.3 | -0.026 |
| 1477.4 | -0.026 |
| 1477.5 | -0.026 |
| 1477.6 | -0.026 |
| 1477.7 | -0.026 |
| 1477.8 | -0.026 |
| 1477.9 | -0.026 |
| 1478.0 | -0.026 |
| 1478.1 | -0.026 |
| 1478.2 | -0.026 |
| 1478.3 | -0.026 |
| 1478.4 | -0.026 |
| 1478.5 | -0.026 |
| 1478.6 | -0.026 |
| 1478.7 | -0.026 |
| 1478.8 | -0.026 |
| 1478.9 | -0.026 |
| 1479.0 | -0.026 |
| 1479.1 | -0.026 |
| 1479.2 | -0.026 |
| 1479.3 | -0.026 |
| 1479.4 | -0.026 |
| 1479.5 | -0.026 |
| 1479.6 | -0.026 |
| 1479.7 | -0.026 |
| 1479.8 | -0.026 |
| 1479.9 | -0.026 |
| 1480.0 | -0.026 |
| 1480.1 | -0.026 |
| 1480.2 | -0.026 |
| 1480.3 | -0.026 |
| 1480.4 | -0.026 |
| 1480.5 | -0.026 |
| 1480.6 | -0.026 |
| 1480.7 | -0.026 |
| 1480.8 | -0.026 |
| 1480.9 | -0.026 |
| 1481.0 | -0.026 |
| 1481.1 | -0.026 |
| 1481.2 | -0.026 |
| 1481.3 | -0.026 |
| 1481.4 | -0.026 |
| 1481.5 | -0.026 |
| 1481.6 | -0.026 |
| 1481.7 | -0.026 |
| 1481.8 | -0.026 |
| 1481.9 | -0.026 |
| 1482.0 | -0.026 |
| 1482.1 | -0.026 |
| 1482.2 | -0.026 |
| 1482.3 | -0.026 |
| 1482.4 | -0.026 |
| 1482.5 | -0.026 |
| 1482.6 | -0.026 |
| 1482.7 | -0.026 |
| 1482.8 | -0.026 |
| 1482.9 | -0.026 |
| 1483.0 | -0.026 |
| 1483.1 | -0.026 |
| 1483.2 | -0.026 |
| 1483.3 | -0.026 |
| 1483.4 | -0.026 |
| 1483.5 | -0.026 |
| 1483.6 | -0.026 |
| 1483.7 | -0.026 |
| 1483.8 | -0.026 |
| 1483.9 | -0.026 |
| 1484.0 | -0.026 |
| 1484.1 | -0.026 |
| 1484.2 | -0.026 |
| 1484.3 | -0.026 |
| 1484.4 | -0.026 |
| 1484.5 | -0.026 |
| 1484.6 | -0.026 |
| 1484.7 | -0.026 |
| 1484.8 | -0.026 |
| 1484.9 | -0.026 |
| 1485.0 | -0.026 |
| 1485.1 | -0.026 |
| 1485.2 | -0.026 |
| 1485.3 | -0.026 |
| 1485.4 | -0.026 |
| 1485.5 | -0.026 |
| 1485.6 | -0.026 |
| 1485.7 | -0.026 |
| 1485.8 | -0.026 |
| 1485.9 | -0.026 |
| 1486.0 | -0.026 |
| 1486.1 | -0.026 |
| 1486.2 | -0.026 |
| 1486.3 | -0.026 |
| 1486.4 | -0.026 |
| 1486.5 | -0.026 |
| 1486.6 | -0.026 |
| 1486.7 | -0.026 |
| 1486.8 | -0.026 |
| 1486.9 | -0.026 |
| 1487.0 | -0.026 |
| 1487.1 | -0.026 |
| 1487.2 | -0.026 |
| 1487.3 | -0.026 |
| 1487.4 | -0.026 |
| 1487.5 | -0.026 |
| 1487.6 | -0.026 |
| 1487.7 | -0.026 |
| 1487.8 | -0.026 |
| 1487.9 | -0.026 |
| 1488.0 | -0.026 |
| 1488.1 | -0.026 |
| 1488.2 | -0.026 |
| 1488.3 | -0.026 |
| 1488.4 | -0.026 |
| 1488.5 | -0.026 |
| 1488.6 | -0.026 |
| 1488.7 | -0.026 |
| 1488.8 | -0.026 |
| 1488.9 | -0.026 |
| 1489.0 | -0.026 |
| 1489.1 | -0.026 |
| 1489.2 | -0.026 |
| 1489.3 | -0.026 |
| 1489.4 | -0.026 |
| 1489.5 | -0.026 |
| 1489.6 | -0.026 |
| 1489.7 | -0.026 |
| 1489.8 | -0.026 |
| 1489.9 | -0.026 |
| 1490.0 | -0.026 |
| 1490.1 | -0.026 |
| 1490.2 | -0.026 |
| 1490.3 | -0.026 |
| 1490.4 | -0.026 |
| 1490.5 | -0.026 |
| 1490.6 | -0.026 |
| 1490.7 | -0.026 |
| 1490.8 | -0.026 |
| 1490.9 | -0.026 |
| 1491.0 | -0.026 |
| 1491.1 | -0.026 |
| 1491.2 | -0.026 |
| 1491.3 | -0.026 |
| 1491.4 | -0.026 |
| 1491.5 | -0.026 |
| 1491.6 | -0.026 |
| 1491.7 | -0.026 |
| 1491.8 | -0.026 |
| 1491.9 | -0.026 |
| 1492.0 | -0.026 |
| 1492.1 | -0.026 |
| 1492.2 | -0.026 |
| 1492.3 | -0.026 |
| 1492.4 | -0.026 |
| 1492.5 | -0.026 |
| 1492.6 | -0.026 |
| 1492.7 | -0.026 |
| 1492.8 | -0.026 |
| 1492.9 | -0.026 |
| 1493.0 | -0.026 |
| 1493.1 | -0.026 |
| 1493.2 | -0.026 |
| 1493.3 | -0.026 |
| 1493.4 | -0.026 |
| 1493.5 | -0.026 |
| 1493.6 | -0.026 |
| 1493.7 | -0.026 |
| 1493.8 | -0.026 |
| 1493.9 | -0.026 |
| 1494.0 | -0.026 |
| 1494.1 | -0.026 |
| 1494.2 | -0.026 |
| 1494.3 | -0.026 |
| 1494.4 | -0.026 |
| 1494.5 | -0.026 |
| 1494.6 | -0.026 |
| 1494.7 | -0.026 |
| 1494.8 | -0.026 |
| 1494.9 | -0.026 |
| 1495.0 | -0.026 |
| 1495.1 | -0.026 |
| 1495.2 | -0.026 |
| 1495.3 | -0.026 |
| 1495.4 | -0.026 |
| 1495.5 | -0.026 |
| 1495.6 | -0.026 |
| 1495.7 | -0.026 |
| 1495.8 | -0.026 |
| 1495.9 | -0.026 |
| 1496.0 | -0.026 |
| 1496.1 | -0.026 |
| 1496.2 | -0.026 |
| 1496.3 | -0.026 |
| 1496.4 | -0.026 |
| 1496.5 | -0.026 |
| 1496.6 | -0.026 |
| 1496.7 | -0.026 |
| 1496.8 | -0.026 |
| 1496.9 | -0.026 |
| 1497.0 | -0.026 |
| 1497.1 | -0.026 |
| 1497.2 | -0.026 |
| 1497.3 | -0.026 |
| 1497.4 | -0.026 |
| 1497.5 | -0.026 |
| 1497.6 | -0.026 |
| 1497.7 | -0.026 |
| 1497.8 | -0.026 |
| 1497.9 | -0.026 |
| 1498.0 | -0.026 |
| 1498.1 | -0.026 |
| 1498.2 | -0.026 |
| 1498.3 | -0.026 |
| 1498.4 | -0.026 |
| 1498.5 | -0.026 |
| 1498.6 | -0.026 |
| 1498.7 | -0.026 |
| 1498.8 | -0.026 |
| 1498.9 | -0.026 |
| 1499.0 | -0.026 |
| 1499.1 | -0.026 |
| 1499.2 | -0.026 |
| 1499.3 | -0.026 |
| 1499.4 | -0.026 |
| 1499.5 | -0.026 |
| 1499.6 | -0.026 |
| 1499.7 | -0.026 |
| 1499.8 | -0.026 |
| 1499.9 | -0.026 |
| 1500.0 | -0.026 |
| 1500.1 | -0.026 |
| 1500.2 | -0.026 |
| 1500.3 | -0.026 |
| 1500.4 | -0.026 |
| 1500.5 | -0.026 |
| 1500.6 | -0.026 |
| 1500.7 | -0.026 |
| 1500.8 | -0.026 |
| 1500.9 | -0.026 |
| 1501.0 | -0.026 |
| 1501.1 | -0.026 |
| 1501.2 | -0.026 |
| 1501.3 | -0.026 |
| 1501.4 | -0.026 |
| 1501.5 | -0.026 |
| 1501.6 | -0.026 |
| 1501.7 | -0.026 |
| 1501.8 | -0.026 |
| 1501.9 | -0.026 |
| 1502.0 | -0.026 |
| 1502.1 | -0.026 |
| 1502.2 | -0.026 |
| 1502.3 | -0.026 |
| 1502.4 | -0.026 |
| 1502.5 | -0.026 |
| 1502.6 | -0.026 |
| 1502.7 | -0.026 |
| 1502.8 | -0.026 |
| 1502.9 | -0.026 |
| 1503.0 | -0.026 |
| 1503.1 | -0.026 |
| 1503.2 | -0.026 |
| 1503.3 | -0.026 |
| 1503.4 | -0.026 |
| 1503.5 | -0.026 |
| 1503.6 | -0.026 |
| 1503.7 | -0.026 |
| 1503.8 | -0.026 |
| 1503.9 | -0.026 |
| 1504.0 | -0.026 |
| 1504.1 | -0.026 |
| 1504.2 | -0.026 |
| 1504.3 | -0.026 |
| 1504.4 | -0.026 |
| 1504.5 | -0.026 |
| 1504.6 | -0.026 |
| 1504.7 | -0.026 |
| 1504.8 | -0.026 |
| 1504.9 | -0.026 |
| 1505.0 | -0.026 |
| 1505.1 | -0.026 |
| 1505.2 | -0.026 |
| 1505.3 | -0.026 |
| 1505.4 | -0.026 |
| 1505.5 | -0.026 |
| 1505.6 | -0.026 |
| 1505.7 | -0.026 |
| 1505.8 | -0.026 |
| 1505.9 | -0.026 |
| 1506.0 | -0.026 |
| 1506.1 | -0.026 |
| 1506.2 | -0.026 |
| 1506.3 | -0.026 |
| 1506.4 | -0.026 |
| 1506.5 | -0.026 |
| 1506.6 | -0.026 |
| 1506.7 | -0.026 |
| 1506.8 | -0.026 |
| 1506.9 | -0.026 |
| 1507.0 | -0.026 |
| 1507.1 | -0.026 |
| 1507.2 | -0.026 |
| 1507.3 | -0.026 |
| 1507.4 | -0.026 |
| 1507.5 | -0.026 |
| 1507.6 | -0.026 |
| 1507.7 | -0.026 |
| 1507.8 | -0.026 |
| 1507.9 | -0.026 |
| 1508.0 | -0.026 |
| 1508.1 | -0.026 |
| 1508.2 | -0.026 |
| 1508.3 | -0.026 |
| 1508.4 | -0.026 |
| 1508.5 | -0.026 |
| 1508.6 | -0.026 |
| 1508.7 | -0.026 |
| 1508.8 | -0.026 |
| 1508.9 | -0.026 |
| 1509.0 | -0.026 |
| 1509.1 | -0.026 |
| 1509.2 | -0.026 |
| 1509.3 | -0.026 |
| 1509.4 | -0.026 |
| 1509.5 | -0.026 |
| 1509.6 | -0.026 |
| 1509.7 | -0.026 |
| 1509.8 | -0.026 |
| 1509.9 | -0.026 |
| 1510.0 | -0.026 |
| 1510.1 | -0.026 |
| 1510.2 | -0.026 |
| 1510.3 | -0.026 |
| 1510.4 | -0.026 |
| 1510.5 | -0.026 |
| 1510.6 | -0.026 |
| 1510.7 | -0.026 |
| 1510.8 | -0.026 |
| 1510.9 | -0.026 |
| 1511.0 | -0.026 |
| 1511.1 | -0.026 |
| 1511.2 | -0.026 |
| 1511.3 | -0.026 |
| 1511.4 | -0.026 |
| 1511.5 | -0.026 |
| 1511.6 | -0.026 |
| 1511.7 | -0.026 |
| 1511.8 | -0.026 |
| 1511.9 | -0.026 |
| 1512.0 | -0.026 |
| 1512.1 | -0.026 |
| 1512.2 | -0.026 |
| 1512.3 | -0.026 |
| 1512.4 | -0.026 |
| 1512.5 | -0.026 |
| 1512.6 | -0.026 |
| 1512.7 | -0.026 |
| 1512.8 | -0.026 |
| 1512.9 | -0.026 |
| 1513.0 | -0.026 |
| 1513.1 | -0.026 |
| 1513.2 | -0.026 |
| 1513.3 | -0.026 |
| 1513.4 | -0.026 |
| 1513.5 | -0.026 |
| 1513.6 | -0.026 |
| 1513.7 | -0.026 |
| 1513.8 | -0.026 |
| 1513.9 | -0.026 |
| 1514.0 | -0.026 |
| 1514.1 | -0.026 |
| 1514.2 | -0.026 |
| 1514.3 | -0.026 |
| 1514.4 | -0.026 |
| 1514.5 | -0.026 |
| 1514.6 | -0.026 |
| 1514.7 | -0.026 |
| 1514.8 | -0.026 |
| 1514.9 | -0.026 |
| 1515.0 | -0.026 |
| 1515.1 | -0.026 |
| 1515.2 | -0.026 |
| 1515.3 | -0.026 |
| 1515.4 | -0.026 |
| 1515.5 | -0.026 |
| 1515.6 | -0.026 |
| 1515.7 | -0.026 |
| 1515.8 | -0.026 |
| 1515.9 | -0.026 |
| 1516.0 | -0.026 |
| 1516.1 | -0.026 |
| 1516.2 | -0.026 |
| 1516.3 | -0.026 |
| 1516.4 | -0.026 |
| 1516.5 | -0.026 |
| 1516.6 | -0.026 |
| 1516.7 | -0.026 |
| 1516.8 | -0.026 |
| 1516.9 | -0.026 |
| 1517.0 | -0.026 |
| 1517.1 | -0.026 |
| 1517.2 | -0.026 |
| 1517.3 | -0.026 |
| 1517.4 | -0.026 |
| 1517.5 | -0.026 |
| 1517.6 | -0.026 |
| 1517.7 | -0.026 |
| 1517.8 | -0.026 |
| 1517.9 | -0.026 |
| 1518.0 | -0.026 |
| 1518.1 | -0.026 |
| 1518.2 | -0.026 |
| 1518.3 | -0.026 |
| 1518.4 | -0.026 |
| 1518.5 | -0.026 |
| 1518.6 | -0.026 |
| 1518.7 | -0.026 |
| 1518.8 | -0.026 |
| 1518.9 | -0.026 |
| 1519.0 | -0.026 |
| 1519.1 | -0.026 |
| 1519.2 | -0.026 |
| 1519.3 | -0.026 |
| 1519.4 | -0.026 |
| 1519.5 | -0.026 |
| 1519.6 | -0.026 |
| 1519.7 | -0.026 |
| 1519.8 | -0.026 |
| 1519.9 | -0.026 |
| 1520.0 | -0.026 |
| 1520.1 | -0.026 |
| 1520.2 | -0.026 |
| 1520.3 | -0.026 |
| 1520.4 | -0.026 |
| 1520.5 | -0.026 |
| 1520.6 | -0.026 |
| 1520.7 | -0.026 |
| 1520.8 | -0.026 |
| 1520.9 | -0.026 |
| 1521.0 | -0.026 |
| 1521.1 | -0.026 |
| 1521.2 | -0.026 |
| 1521.3 | -0.026 |
| 1521.4 | -0.026 |
| 1521.5 | -0.026 |
| 1521.6 | -0.026 |
| 1521.7 | -0.026 |
| 1521.8 | -0.026 |
| 1521.9 | -0.026 |
| 1522.0 | -0.026 |
| 1522.1 | -0.026 |
| 1522.2 | -0.026 |
| 1522.3 | -0.026 |
| 1522.4 | -0.026 |
| 1522.5 | -0.026 |
| 1522.6 | -0.026 |
| 1522.7 | -0.026 |
| 1522.8 | -0.026 |
| 1522.9 | -0.026 |
| 1523.0 | -0.026 |
| 1523.1 | -0.026 |
| 1523.2 | -0.026 |
| 1523.3 | -0.026 |
| 1523.4 | -0.026 |
| 1523.5 | -0.026 |
| 1523.6 | -0.026 |
| 1523.7 | -0.026 |
| 1523.8 | -0.026 |
| 1523.9 | -0.026 |
| 1524.0 | -0.026 |
| 1524.1 | -0.026 |
| 1524.2 | -0.026 |
| 1524.3 | -0.026 |
| 1524.4 | -0.026 |
| 1524.5 | -0.026 |
| 1524.6 | -0.026 |
| 1524.7 | -0.026 |
| 1524.8 | -0.026 |
| 1524.9 | -0.026 |
| 1525.0 | -0.026 |
| 1525.1 | -0.026 |
| 1525.2 | -0.026 |
| 1525.3 | -0.026 |
| 1525.4 | -0.026 |
| 1525.5 | -0.026 |
| 1525.6 | -0.026 |
| 1525.7 | -0.026 |
| 1525.8 | -0.026 |
| 1525.9 | -0.026 |
| 1526.0 | -0.026 |
| 1526.1 | -0.026 |
| 1526.2 | -0.026 |
| 1526.3 | -0.026 |
| 1526.4 | -0.026 |
| 1526.5 | -0.026 |
| 1526.6 | -0.026 |
| 1526.7 | -0.026 |
| 1526.8 | -0.026 |
| 1526.9 | -0.026 |
| 1527.0 | -0.026 |
| 1527.1 | -0.026 |
| 1527.2 | -0.026 |
| 1527.3 | -0.026 |
| 1527.4 | -0.026 |
| 1527.5 | -0.026 |
| 1527.6 | -0.026 |
| 1527.7 | -0.026 |
| 1527.8 | -0.026 |
| 1527.9 | -0.026 |
| 1528.0 | -0.026 |
| 1528.1 | -0.026 |
| 1528.2 | -0.026 |
| 1528.3 | -0.026 |
| 1528.4 | -0.026 |
| 1528.5 | -0.026 |
| 1528.6 | -0.026 |
| 1528.7 | -0.026 |
| 1528.8 | -0.026 |
| 1528.9 | -0.026 |
| 1529.0 | -0.026 |
| 1529.1 | -0.026 |
| 1529.2 | -0.026 |
| 1529.3 | -0.026 |
| 1529.4 | -0.026 |
| 1529.5 | -0.026 |
| 1529.6 | -0.026 |
| 1529.7 | -0.026 |
| 1529.8 | -0.026 |
| 1529.9 | -0.026 |
| 1530.0 | -0.026 |
| 1530.1 | -0.026 |
| 1530.2 | -0.026 |
| 1530.3 | -0.026 |
| 1530.4 | -0.026 |
| 1530.5 | -0.026 |
| 1530.6 | -0.026 |
| 1530.7 | -0.026 |
| 1530.8 | -0.026 |
| 1530.9 | -0.026 |
| 1531.0 | -0.026 |
| 1531.1 | -0.026 |
| 1531.2 | -0.026 |
| 1531.3 | -0.026 |
| 1531.4 | -0.026 |
| 1531.5 | -0.026 |
| 1531.6 | -0.026 |
| 1531.7 | -0.026 |
| 1531.8 | -0.026 |
| 1531.9 | -0.026 |
| 1532.0 | -0.026 |
| 1532.1 | -0.026 |
| 1532.2 | -0.026 |
| 1532.3 | -0.026 |
| 1532.4 | -0.026 |
| 1532.5 | -0.026 |
| 1532.6 | -0.026 |
| 1532.7 | -0.026 |
| 1532.8 | -0.026 |
| 1532.9 | -0.026 |
| 1533.0 | -0.026 |
| 1533.1 | -0.026 |
| 1533.2 | -0.026 |
| 1533.3 | -0.026 |
| 1533.4 | -0.026 |
| 1533.5 | -0.026 |
| 1533.6 | -0.026 |
| 1533.7 | -0.026 |
| 1533.8 | -0.026 |
| 1533.9 | -0.026 |
| 1534.0 | -0.026 |
| 1534.1 | -0.026 |
| 1534.2 | -0.026 |
| 1534.3 | -0.026 |
| 1534.4 | -0.026 |
| 1534.5 | -0.026 |
| 1534.6 | -0.026 |
| 1534.7 | -0.026 |
| 1534.8 | -0.026 |
| 1534.9 | -0.026 |
| 1535.0 | -0.026 |
| 1535.1 | -0.026 |
| 1535.2 | -0.026 |
| 1535.3 | -0.026 |
| 1535.4 | -0.026 |
| 1535.5 | -0.026 |
| 1535.6 | -0.026 |
| 1535.7 | -0.026 |
| 1535.8 | -0.026 |
| 1535.9 | -0.026 |
| 1536.0 | -0.026 |
| 1536.1 | -0.026 |
| 1536.2 | -0.026 |
| 1536.3 | -0.026 |
| 1536.4 | -0.026 |
| 1536.5 | -0.026 |
| 1536.6 | -0.026 |
| 1536.7 | -0.026 |
| 1536.8 | -0.026 |
| 1536.9 | -0.026 |
| 1537.0 | -0.026 |
| 1537.1 | -0.026 |
| 1537.2 | -0.026 |
| 1537.3 | -0.026 |
| 1537.4 | -0.026 |
| 1537.5 | -0.026 |
| 1537.6 | -0.026 |
| 1537.7 | -0.026 |
| 1537.8 | -0.026 |
| 1537.9 | -0.026 |
| 1538.0 | -0.026 |
| 1538.1 | -0.026 |
| 1538.2 | -0.026 |
| 1538.3 | -0.026 |
| 1538.4 | -0.026 |
| 1538.5 | -0.026 |
| 1538.6 | -0.026 |
| 1538.7 | -0.026 |
| 1538.8 | -0.026 |
| 1538.9 | -0.026 |
| 1539.0 | -0.026 |
| 1539.1 | -0.026 |
| 1539.2 | -0.026 |
| 1539.3 | -0.026 |
| 1539.4 | -0.026 |
| 1539.5 | -0.026 |
| 1539.6 | -0.026 |
| 1539.7 | -0.026 |
| 1539.8 | -0.026 |
| 1539.9 | -0.026 |
| 1540.0 | -0.026 |
| 1540.1 | -0.026 |
| 1540.2 | -0.026 |
| 1540.3 | -0.026 |
| 1540.4 | -0.026 |
| 1540.5 | -0.026 |
| 1540.6 | -0.026 |
| 1540.7 | -0.026 |
| 1540.8 | -0.026 |
| 1540.9 | -0.026 |
| 1541.0 | -0.026 |
| 1541.1 | -0.026 |
| 1541.2 | -0.026 |
| 1541.3 | -0.026 |
| 1541.4 | -0.026 |
| 1541.5 | -0.026 |
| 1541.6 | -0.026 |
| 1541.7 | -0.026 |
| 1541.8 | -0.026 |
| 1541.9 | -0.026 |
| 1542.0 | -0.026 |
| 1542.1 | -0.026 |
| 1542.2 | -0.026 |
| 1542.3 | -0.026 |
| 1542.4 | -0.026 |
| 1542.5 | -0.026 |
| 1542.6 | -0.026 |
| 1542.7 | -0.026 |
| 1542.8 | -0.026 |
| 1542.9 | -0.026 |
| 1543.0 | -0.026 |
| 1543.1 | -0.026 |
| 1543.2 | -0.026 |
| 1543.3 | -0.026 |
| 1543.4 | -0.026 |
| 1543.5 | -0.026 |
| 1543.6 | -0.026 |
| 1543.7 | -0.026 |
| 1543.8 | -0.026 |
| 1543.9 | -0.026 |
| 1544.0 | -0.026 |
| 1544.1 | -0.026 |
| 1544.2 | -0.026 |
| 1544.3 | -0.026 |
| 1544.4 | -0.026 |
| 1544.5 | -0.026 |
| 1544.6 | -0.026 |
| 1544.7 | -0.026 |
| 1544.8 | -0.026 |
| 1544.9 | -0.026 |
| 1545.0 | -0.026 |
| 1545.1 | -0.026 |
| 1545.2 | -0.026 |
| 1545.3 | -0.026 |
| 1545.4 | -0.026 |
| 1545.5 | -0.026 |
| 1545.6 | -0.026 |
| 1545.7 | -0.026 |
| 1545.8 | -0.026 |
| 1545.9 | -0.026 |
| 1546.0 | -0.026 |
| 1546.1 | -0.026 |
| 1546.2 | -0.026 |
| 1546.3 | -0.026 |
| 1546.4 | -0.026 |
| 1546.5 | -0.026 |
| 1546.6 | -0.026 |
| 1546.7 | -0.026 |
| 1546.8 | -0.026 |
| 1546.9 | -0.026 |
| 1547.0 | -0.026 |
| 1547.1 | -0.026 |
| 1547.2 | -0.026 |
| 1547.3 | -0.026 |
| 1547.4 | -0.026 |
| 1547.5 | -0.026 |
| 1547.6 | -0.026 |
| 1547.7 | -0.026 |
| 1547.8 | -0.026 |
| 1547.9 | -0.026 |
| 1548.0 | -0.026 |
| 1548.1 | -0.026 |
| 1548.2 | -0.026 |
| 1548.3 | -0.026 |
| 1548.4 | -0.026 |
| 1548.5 | -0.026 |
| 1548.6 | -0.026 |
| 1548.7 | -0.026 |
| 1548.8 | -0.026 |
| 1548.9 | -0.026 |
| 1549.0 | -0.026 |
| 1549.1 | -0.026 |
| 1549.2 | -0.026 |
| 1549.3 | -0.026 |
| 1549.4 | -0.026 |
| 1549.5 | -0.026 |
| 1549.6 | -0.026 |
| 1549.7 | -0.026 |
| 1549.8 | -0.026 |
| 1549.9 | -0.026 |
| 1550.0 | -0.026 |
| 1550.1 | -0.026 |
| 1550.2 | -0.026 |
| 1550.3 | -0.026 |
| 1550.4 | -0.026 |
| 1550.5 | -0.026 |
| 1550.6 | -0.026 |
| 1550.7 | -0.026 |
| 1550.8 | -0.026 |
| 1550.9 | -0.026 |
| 1551.0 | -0.026 |
| 1551.1 | -0.026 |
| 1551.2 | -0.026 |
| 1551.3 | -0.026 |
| 1551.4 | -0.026 |
| 1551.5 | -0.026 |
| 1551.6 | -0.026 |
| 1551.7 | -0.026 |
| 1551.8 | -0.026 |
| 1551.9 | -0.026 |
| 1552.0 | -0.026 |
| 1552.1 | -0.026 |
| 1552.2 | -0.026 |
| 1552.3 | -0.026 |
| 1552.4 | -0.026 |
| 1552.5 | -0.026 |
| 1552.6 | -0.026 |
| 1552.7 | -0.026 |
| 1552.8 | -0.026 |
| 1552.9 | -0.026 |
| 1553.0 | -0.026 |
| 1553.1 | -0.026 |
| 1553.2 | -0.026 |
| 1553.3 | -0.026 |
| 1553.4 | -0.026 |
| 1553.5 | -0.026 |
| 1553.6 | -0.026 |
| 1553.7 | -0.026 |
| 1553.8 | -0.026 |
| 1553.9 | -0.026 |
| 1554.0 | -0.026 |
| 1554.1 | -0.026 |
| 1554.2 | -0.026 |
| 1554.3 | -0.026 |
| 1554.4 | -0.026 |
| 1554.5 | -0.026 |
| 1554.6 | -0.026 |
| 1554.7 | -0.026 |
| 1554.8 | -0.026 |
| 1554.9 | -0.026 |
| 1555.0 | -0.026 |
| 1555.1 | -0.026 |
| 1555.2 | -0.026 |
| 1555.3 | -0.026 |
| 1555.4 | -0.026 |
| 1555.5 | -0.026 |
| 1555.6 | -0.026 |
| 1555.7 | -0.026 |
| 1555.8 | -0.026 |
| 1555.9 | -0.026 |
| 1556.0 | -0.026 |
| 1556.1 | -0.026 |
| 1556.2 | -0.026 |
| 1556.3 | -0.026 |
| 1556.4 | -0.026 |
| 1556.5 | -0.026 |
| 1556.6 | -0.026 |
| 1556.7 | -0.026 |
| 1556.8 | -0.026 |
| 1556.9 | -0.026 |
| 1557.0 | -0.026 |
| 1557.1 | -0.026 |
| 1557.2 | -0.026 |
| 1557.3 | -0.026 |
| 1557.4 | -0.026 |
| 1557.5 | -0.026 |
| 1557.6 | -0.026 |
| 1557.7 | -0.026 |
| 1557.8 | -0.026 |
| 1557.9 | -0.026 |
| 1558.0 | -0.026 |
| 1558.1 | -0.026 |
| 1558.2 | -0.026 |
| 1558.3 | -0.026 |
| 1558.4 | -0.026 |
| 1558.5 | -0.026 |
| 1558.6 | -0.026 |
| 1558.7 | -0.026 |
| 1558.8 | -0.026 |
| 1558.9 | -0.026 |
| 1559.0 | -0.026 |
| 1559.1 | -0.026 |
| 1559.2 | -0.026 |
| 1559.3 | -0.026 |
| 1559.4 | -0.026 |
| 1559.5 | -0.026 |
| 1559.6 | -0.026 |
| 1559.7 | -0.026 |
| 1559.8 | -0.026 |
| 1559.9 | -0.026 |
| 1560.0 | -0.026 |
| 1560.1 | -0.026 |
| 1560.2 | -0.026 |
| 1560.3 | -0.026 |
| 1560.4 | -0.026 |
| 1560.5 | -0.026 |
| 1560.6 | -0.026 |
| 1560.7 | -0.026 |
| 1560.8 | -0.026 |
| 1560.9 | -0.026 |
| 1561.0 | -0.026 |
| 1561.1 | -0.026 |
| 1561.2 | -0.026 |
| 1561.3 | -0.026 |
| 1561.4 | -0.026 |
| 1561.5 | -0.026 |
| 1561.6 | -0.026 |
| 1561.7 | -0.026 |
| 1561.8 | -0.026 |
| 1561.9 | -0.026 |
| 1562.0 | -0.026 |
| 1562.1 | -0.026 |
| 1562.2 | -0.026 |
| 1562.3 | -0.026 |
| 1562.4 | -0.026 |
| 1562.5 | -0.026 |
| 1562.6 | -0.026 |
| 1562.7 | -0.026 |
| 1562.8 | -0.026 |
| 1562.9 | -0.026 |
| 1563.0 | -0.026 |
| 1563.1 | -0.026 |
| 1563.2 | -0.026 |
| 1563.3 | -0.026 |
| 1563.4 | -0.026 |
| 1563.5 | -0.026 |
| 1563.6 | -0.026 |
| 1563.7 | -0.026 |
| 1563.8 | -0.026 |
| 1563.9 | -0.026 |
| 1564.0 | -0.026 |
| 1564.1 | -0.026 |
| 1564.2 | -0.026 |
| 1564.3 | -0.026 |
| 1564.4 | -0.026 |
| 1564.5 | -0.026 |
| 1564.6 | -0.026 |
| 1564.7 | -0.026 |
| 1564.8 | -0.026 |
| 1564.9 | -0.026 |
| 1565.0 | -0.026 |
| 1565.1 | -0.026 |
| 1565.2 | -0.026 |
| 1565.3 | -0.026 |
| 1565.4 | -0.026 |
| 1565.5 | -0.026 |
| 1565.6 | -0.026 |
| 1565.7 | -0.026 |
| 1565.8 | -0.026 |
| 1565.9 | -0.026 |
| 1566.0 | -0.026 |
| 1566.1 | -0.026 |
| 1566.2 | -0.026 |
| 1566.3 | -0.026 |
| 1566.4 | -0.026 |
| 1566.5 | -0.026 |
| 1566.6 | -0.026 |
| 1566.7 | -0.026 |
| 1566.8 | -0.026 |
| 1566.9 | -0.026 |
| 1567.0 | -0.026 |
| 1567.1 | -0.026 |
| 1567.2 | -0.026 |
| 1567.3 | -0.026 |
| 1567.4 | -0.026 |
| 1567.5 | -0.026 |
| 1567.6 | -0.026 |
| 1567.7 | -0.026 |
| 1567.8 | -0.026 |
| 1567.9 | -0.026 |
| 1568.0 | -0.026 |
| 1568.1 | -0.026 |
| 1568.2 | -0.026 |
| 1568.3 | -0.026 |
| 1568.4 | -0.026 |
| 1568.5 | -0.026 |
| 1568.6 | -0.026 |
| 1568.7 | -0.026 |
| 1568.8 | -0.026 |
| 1568.9 | -0.026 |
| 1569.0 | -0.026 |
| 1569.1 | -0.026 |
| 1569.2 | -0.026 |
| 1569.3 | -0.026 |
| 1569.4 | -0.026 |
| 1569.5 | -0.026 |
| 1569.6 | -0.026 |
| 1569.7 | -0.026 |
| 1569.8 | -0.026 |
| 1569.9 | -0.026 |
| 1570.0 | -0.026 |
| 1570.1 | -0.026 |
| 1570.2 | -0.026 |
| 1570.3 | -0.026 |
| 1570.4 | -0.026 |
| 1570.5 | -0.026 |
| 1570.6 | -0.026 |
| 1570.7 | -0.026 |
| 1570.8 | -0.026 |
| 1570.9 | -0.026 |
| 1571.0 | -0.026 |
| 1571.1 | -0.026 |
| 1571.2 | -0.026 |
| 1571.3 | -0.026 |
| 1571.4 | -0.026 |
| 1571.5 | -0.026 |
| 1571.6 | -0.026 |
| 1571.7 | -0.026 |
| 1571.8 | -0.026 |
| 1571.9 | -0.026 |
| 1572.0 | -0.026 |
| 1572.1 | -0.026 |
| 1572.2 | -0.026 |
| 1572.3 | -0.026 |
| 1572.4 | -0.026 |
| 1572.5 | -0.026 |
| 1572.6 | -0.026 |
| 1572.7 | -0.026 |
| 1572.8 | -0.026 |
| 1572.9 | -0.026 |
| 1573.0 | -0.026 |
| 1573.1 | -0.026 |
| 1573.2 | -0.026 |
| 1573.3 | -0.026 |
| 1573.4 | -0.026 |
| 1573.5 | -0.026 |
| 1573.6 | -0.026 |
| 1573.7 | -0.026 |
| 1573.8 | -0.026 |
| 1573.9 | -0.026 |
| 1574.0 | -0.026 |
| 1574.1 | -0.026 |
| 1574.2 | -0.026 |
| 1574.3 | -0.026 |
| 1574.4 | -0.026 |
| 1574.5 | -0.026 |
| 1574.6 | -0.026 |
| 1574.7 | -0.026 |
| 1574.8 | -0.026 |
| 1574.9 | -0.026 |
| 1575.0 | -0.026 |
| 1575.1 | -0.026 |
| 1575.2 | -0.026 |
| 1575.3 | -0.026 |
| 1575.4 | -0.026 |
| 1575.5 | -0.026 |
| 1575.6 | -0.026 |
| 1575.7 | -0.026 |
| 1575.8 | -0.026 |
| 1575.9 | -0.026 |
| 1576.0 | -0.026 |
| 1576.1 | -0.026 |
| 1576.2 | -0.026 |
| 1576.3 | -0.026 |
| 1576.4 | -0.026 |
| 1576.5 | -0.026 |
| 1576.6 | -0.026 |
| 1576.7 | -0.026 |
| 1576.8 | -0.026 |
| 1576.9 | -0.026 |
| 1577.0 | -0.026 |
| 1577.1 | -0.026 |
| 1577.2 | -0.026 |
| 1577.3 | -0.026 |
| 1577.4 | -0.026 |
| 1577.5 | -0.026 |
| 1577.6 | -0.026 |
| 1577.7 | -0.026 |
| 1577.8 | -0.026 |
| 1577.9 | -0.026 |
| 1578.0 | -0.026 |
| 1578.1 | -0.026 |
| 1578.2 | -0.026 |
| 1578.3 | -0.026 |
| 1578.4 | -0.026 |
| 1578.5 | -0.026 |
| 1578.6 | -0.026 |
| 1578.7 | -0.026 |
| 1578.8 | -0.026 |
| 1578.9 | -0.026 |
| 1579.0 | -0.026 |
| 1579.1 | -0.026 |
| 1579.2 | -0.026 |
| 1579.3 | -0.026 |
| 1579.4 | -0.026 |
| 1579.5 | -0.026 |
| 1579.6 | -0.026 |
| 1579.7 | -0.026 |
| 1579.8 | -0.026 |
| 1579.9 | -0.026 |
| 1580.0 | -0.026 |
| 1580.1 | -0.026 |
| 1580.2 | -0.026 |
| 1580.3 | -0.026 |
| 1580.4 | -0.026 |
| 1580.5 | -0.026 |
| 1580.6 | -0.026 |
| 1580.7 | -0.026 |
| 1580.8 | -0.026 |
| 1580.9 | -0.026 |
| 1581.0 | -0.026 |
| 1581.1 | -0.026 |
| 1581.2 | -0.026 |
| 1581.3 | -0.026 |
| 1581.4 | -0.026 |
| 1581.5 | -0.026 |
| 1581.6 | -0.026 |
| 1581.7 | -0.026 |
| 1581.8 | -0.026 |
| 1581.9 | -0.026 |
| 1582.0 | -0.026 |
| 1582.1 | -0.026 |
| 1582.2 | -0.026 |
| 1582.3 | -0.026 |
| 1582.4 | -0.026 |
| 1582.5 | -0.026 |
| 1582.6 | -0.026 |
| 1582.7 | -0.026 |
| 1582.8 | -0.026 |
| 1582.9 | -0.026 |
| 1583.0 | -0.026 |
| 1583.1 | -0.026 |
| 1583.2 | -0.026 |
| 1583.3 | -0.026 |
| 1583.4 | -0.026 |
| 1583.5 | -0.026 |
| 1583.6 | -0.026 |
| 1583.7 | -0.026 |
| 1583.8 | -0.026 |
| 1583.9 | -0.026 |
| 1584.0 | -0.026 |
| 1584.1 | -0.026 |
| 1584.2 | -0.026 |
| 1584.3 | -0.026 |
| 1584.4 | -0.026 |
| 1584.5 | -0.026 |
| 1584.6 | -0.026 |
| 1584.7 | -0.026 |
| 1584.8 | -0.026 |
| 1584.9 | -0.026 |
| 1585.0 | -0.026 |
| 1585.1 | -0.026 |
| 1585.2 | -0.026 |
| 1585.3 | -0.026 |
| 1585.4 | -0.026 |
| 1585.5 | -0.026 |
| 1585.6 | -0.026 |
| 1585.7 | -0.026 |
| 1585.8 | -0.026 |
| 1585.9 | -0.026 |
| 1586.0 | -0.026 |
| 1586.1 | -0.026 |
| 1586.2 | -0.026 |
| 1586.3 | -0.026 |
| 1586.4 | -0.026 |
| 1586.5 | -0.026 |
| 1586.6 | -0.026 |
| 1586.7 | -0.026 |
| 1586.8 | -0.026 |
| 1586.9 | -0.026 |
| 1587.0 | -0.026 |
| 1587.1 | -0.026 |
| 1587.2 | -0.026 |
| 1587.3 | -0.026 |
| 1587.4 | -0.026 |
| 1587.5 | -0.026 |
| 1587.6 | -0.026 |
| 1587.7 | -0.026 |
| 1587.8 | -0.026 |
| 1587.9 | -0.026 |
| 1588.0 | -0.026 |
| 1588.1 | -0.026 |
| 1588.2 | -0.026 |
| 1588.3 | -0.026 |
| 1588.4 | -0.026 |
| 1588.5 | -0.026 |
| 1588.6 | -0.026 |
| 1588.7 | -0.026 |
| 1588.8 | -0.026 |
| 1588.9 | -0.026 |
| 1589.0 | -0.026 |
| 1589.1 | -0.026 |
| 1589.2 | -0.026 |
| 1589.3 | -0.026 |
| 1589.4 | -0.026 |
| 1589.5 | -0.026 |
| 1589.6 | -0.026 |
| 1589.7 | -0.026 |
| 1589.8 | -0.026 |
| 1589.9 | -0.026 |
| 1590.0 | -0.026 |
| 1590.1 | -0.026 |
| 1590.2 | -0.026 |
| 1590.3 | -0.026 |
| 1590.4 | -0.026 |
| 1590.5 | -0.026 |
| 1590.6 | -0.026 |
| 1590.7 | -0.026 |
| 1590.8 | -0.026 |
| 1590.9 | -0.026 |
| 1591.0 | -0.026 |
| 1591.1 | -0.026 |
| 1591.2 | -0.026 |
| 1591.3 | -0.026 |
| 1591.4 | -0.026 |
| 1591.5 | -0.026 |
| 1591.6 | -0.026 |
| 1591.7 | -0.026 |
| 1591.8 | -0.026 |
| 1591.9 | -0.026 |
| 1592.0 | -0.026 |
| 1592.1 | -0.026 |
| 1592.2 | -0.026 |
| 1592.3 | -0.026 |
| 1592.4 | -0.026 |
| 1592.5 | -0.026 |
| 1592.6 | -0.026 |
| 1592.7 | -0.026 |
| 1592.8 | -0.026 |
| 1592.9 | -0.026 |
| 1593.0 | -0.026 |
| 1593.1 | -0.026 |
| 1593.2 | -0.026 |
| 1593.3 | -0.026 |
| 1593.4 | -0.026 |
| 1593.5 | -0.026 |
| 1593.6 | -0.026 |
| 1593.7 | -0.026 |
| 1593.8 | -0.026 |
| 1593.9 | -0.026 |
| 1594.0 | -0.026 |
| 1594.1 | -0.026 |
| 1594.2 | -0.026 |
| 1594.3 | -0.026 |
| 1594.4 | -0.026 |
| 1594.5 | -0.026 |
| 1594.6 | -0.026 |
| 1594.7 | -0.026 |
| 1594.8 | -0.026 |
| 1594.9 | -0.026 |
| 1595.0 | -0.026 |
| 1595.1 | -0.026 |
| 1595.2 | -0.026 |
| 1595.3 | -0.026 |
| 1595.4 | -0.026 |
| 1595.5 | -0.026 |
| 1595.6 | -0.026 |
| 1595.7 | -0.026 |
| 1595.8 | -0.026 |
| 1595.9 | -0.026 |
| 1596.0 | -0.026 |
| 1596.1 | -0.026 |
| 1596.2 | -0.026 |
| 1596.3 | -0.026 |
| 1596.4 | -0.026 |
| 1596.5 | -0.026 |
| 1596.6 | -0.026 |
| 1596.7 | -0.026 |
| 1596.8 | -0.026 |
| 1596.9 | -0.026 |
| 1597.0 | -0.026 |
| 1597.1 | -0.026 |
| 1597.2 | -0.026 |
| 1597.3 | -0.026 |
| 1597.4 | -0.026 |
| 1597.5 | -0.026 |
| 1597.6 | -0.026 |
| 1597.7 | -0.026 |
| 1597.8 | -0.026 |
| 1597.9 | -0.026 |
| 1598.0 | -0.026 |
| 1598.1 | -0.026 |
| 1598.2 | -0.026 |
| 1598.3 | -0.026 |
| 1598.4 | -0.026 |
| 1598.5 | -0.026 |
| 1598.6 | -0.026 |
| 1598.7 | -0.026 |
| 1598.8 | -0.026 |
| 1598.9 | -0.026 |
| 1599.0 | -0.026 |
| 1599.1 | -0.026 |
| 1599.2 | -0.026 |
| 1599.3 | -0.026 |
| 1599.4 | -0.026 |
| 1599.5 | -0.026 |
| 1599.6 | -0.026 |
| 1599.7 | -0.026 |
| 1599.8 | -0.026 |
| 1599.9 | -0.026 |
| 1600.0 | -0.026 |
| 1600.1 | -0.026 |
| 1600.2 | -0.026 |
| 1600.3 | -0.026 |
| 1600.4 | -0.026 |
| 1600.5 | -0.026 |
| 1600.6 | -0.026 |
| 1600.7 | -0.026 |
| 1600.8 | -0.026 |
| 1600.9 | -0.026 |
| 1601.0 | -0.026 |
| 1601.1 | -0.026 |
| 1601.2 | -0.026 |
| 1601.3 | -0.026 |
| 1601.4 | -0.026 |
| 1601.5 | -0.026 |
| 1601.6 | -0.026 |
| 1601.7 | -0.026 |
| 1601.8 | -0.026 |
| 1601.9 | -0.026 |
| 1602.0 | -0.026 |
| 1602.1 | -0.026 |
| 1602.2 | -0.026 |
| 1602.3 | -0.026 |
| 1602.4 | -0.026 |
| 1602.5 | -0.026 |
| 1602.6 | -0.026 |
| 1602.7 | -0.026 |
| 1602.8 | -0.026 |
| 1602.9 | -0.026 |
| 1603.0 | -0.026 |
| 1603.1 | -0.026 |
| 1603.2 | -0.026 |
| 1603.3 | -0.026 |
| 1603.4 | -0.026 |
| 1603.5 | -0.026 |
| 1603.6 | -0.026 |
| 1603.7 | -0.026 |
| 1603.8 | -0.026 |
| 1603.9 | -0.026 |
| 1604.0 | -0.026 |
| 1604.1 | -0.026 |
| 1604.2 | -0.026 |
| 1604.3 | -0.026 |
| 1604.4 | -0.026 |
| 1604.5 | -0.026 |
| 1604.6 | -0.026 |
| 1604.7 | -0.026 |
| 1604.8 | -0.026 |
| 1604.9 | -0.026 |
| 1605.0 | -0.026 |
| 1605.1 | -0.026 |
| 1605.2 | -0.026 |
| 1605.3 | -0.026 |
| 1605.4 | -0.026 |
| 1605.5 | -0.026 |
| 1605.6 | -0.026 |
| 1605.7 | -0.026 |
| 1605.8 | -0.026 |
| 1605.9 | -0.026 |
| 1606.0 | -0.026 |
| 1606.1 | -0.026 |
| 1606.2 | -0.026 |
| 1606.3 | -0.026 |
| 1606.4 | -0.026 |
| 1606.5 | -0.026 |
| 1606.6 | -0.026 |
| 1606.7 | -0.026 |
| 1606.8 | -0.026 |
| 1606.9 | -0.026 |
| 1607.0 | -0.026 |
| 1607.1 | -0.026 |
| 1607.2 | -0.026 |
| 1607.3 | -0.026 |
| 1607.4 | -0.026 |
| 1607.5 | -0.026 |
| 1607.6 | -0.026 |
| 1607.7 | -0.026 |
| 1607.8 | -0.026 |
| 1607.9 | -0.026 |
| 1608.0 | -0.026 |
| 1608.1 | -0.026 |
| 1608.2 | -0.026 |
| 1608.3 | -0.026 |
| 1608.4 | -0.026 |
| 1608.5 | -0.026 |
| 1608.6 | -0.026 |
| 1608.7 | -0.026 |
| 1608.8 | -0.026 |
| 1608.9 | -0.026 |
| 1609.0 | -0.026 |
| 1609.1 | -0.026 |
| 1609.2 | -0.026 |
| 1609.3 | -0.026 |
| 1609.4 | -0.026 |
| 1609.5 | -0.026 |
| 1609.6 | -0.026 |
| 1609.7 | -0.026 |
| 1609.8 | -0.026 |
| 1609.9 | -0.026 |
| 1610.0 | -0.026 |
| 1610.1 | -0.026 |
| 1610.2 | -0.026 |
| 1610.3 | -0.026 |
| 1610.4 | -0.026 |
| 1610.5 | -0.026 |
| 1610.6 | -0.026 |
| 1610.7 | -0.026 |
| 1610.8 | -0.026 |
| 1610.9 | -0.026 |
| 1611.0 | -0.026 |
| 1611.1 | -0.026 |
| 1611.2 | -0.026 |
| 1611.3 | -0.026 |
| 1611.4 | -0.026 |
| 1611.5 | -0.026 |
| 1611.6 | -0.026 |
| 1611.7 | -0.026 |
| 1611.8 | -0.026 |
| 1611.9 | -0.026 |
| 1612.0 | -0.026 |
| 1612.1 | -0.026 |
| 1612.2 | -0.026 |
| 1612.3 | -0.026 |
| 1612.4 | -0.026 |
| 1612.5 | -0.026 |
| 1612.6 | -0.026 |
| 1612.7 | -0.026 |
| 1612.8 | -0.026 |
| 1612.9 | -0.026 |
| 1613.0 | -0.026 |
| 1613.1 | -0.026 |
| 1613.2 | -0.026 |
| 1613.3 | -0.026 |
| 1613.4 | -0.026 |
| 1613.5 | -0.026 |
| 1613.6 | -0.026 |
| 1613.7 | -0.026 |
| 1613.8 | -0.026 |
| 1613.9 | -0.026 |
| 1614.0 | -0.026 |
| 1614.1 | -0.026 |
| 1614.2 | -0.026 |
| 1614.3 | -0.026 |
| 1614.4 | -0.026 |
| 1614.5 | -0.026 |
| 1614.6 | -0.026 |
| 1614.7 | -0.026 |
| 1614.8 | -0.026 |
| 1614.9 | -0.026 |
| 1615.0 | -0.026 |
| 1615.1 | -0.026 |
| 1615.2 | -0.026 |
| 1615.3 | -0.026 |
| 1615.4 | -0.026 |
| 1615.5 | -0.026 |
| 1615.6 | -0.026 |
| 1615.7 | -0.026 |
| 1615.8 | -0.026 |
| 1615.9 | -0.026 |
| 1616.0 | -0.026 |
| 1616.1 | -0.026 |
| 1616.2 | -0.026 |
| 1616.3 | -0.026 |
| 1616.4 | -0.026 |
| 1616.5 | -0.026 |
| 1616.6 | -0.026 |
| 1616.7 | -0.026 |
| 1616.8 | -0.026 |
| 1616.9 | -0.026 |
| 1617.0 | -0.026 |
| 1617.1 | -0.026 |
| 1617.2 | -0.026 |
| 1617.3 | -0.026 |
| 1617.4 | -0.026 |
| 1617.5 | -0.026 |
| 1617.6 | -0.026 |
| 1617.7 | -0.026 |
| 1617.8 | -0.026 |
| 1617.9 | -0.026 |
| 1618.0 | -0.026 |
| 1618.1 | -0.026 |
| 1618.2 | -0.026 |
| 1618.3 | -0.026 |
| 1618.4 | -0.026 |
| 1618.5 | -0.026 |
| 1618.6 | -0.026 |
| 1618.7 | -0.026 |
| 1618.8 | -0.026 |
| 1618.9 | -0.026 |
| 1619.0 | -0.026 |
| 1619.1 | -0.026 |
| 1619.2 | -0.026 |
| 1619.3 | -0.026 |
| 1619.4 | -0.026 |
| 1619.5 | -0.026 |
| 1619.6 | -0.026 |
| 1619.7 | -0.026 |
| 1619.8 | -0.026 |
| 1619.9 | -0.026 |
| 1620.0 | -0.026 |
| 1620.1 | -0.026 |
| 1620.2 | -0.026 |
| 1620.3 | -0.026 |
| 1620.4 | -0.026 |
| 1620.5 | -0.026 |
| 1620.6 | -0.026 |
| 1620.7 | -0.026 |
| 1620.8 | -0.026 |
| 1620.9 | -0.026 |
| 1621.0 | -0.026 |
| 1621.1 | -0.026 |
| 1621.2 | -0.026 |
| 1621.3 | -0.026 |
| 1621.4 | -0.026 |
| 1621.5 | -0.026 |
| 1621.6 | -0.026 |
| 1621.7 | -0.026 |
| 1621.8 | -0.026 |
| 1621.9 | -0.026 |
| 1622.0 | -0.026 |
| 1622.1 | -0.026 |
| 1622.2 | -0.026 |
| 1622.3 | -0.026 |
| 1622.4 | -0.026 |
| 1622.5 | -0.026 |
| 1622.6 | -0.026 |
| 1622.7 | -0.026 |
| 1622.8 | -0.026 |
| 1622.9 | -0.026 |
| 1623.0 | -0.026 |
| 1623.1 | -0.026 |
| 1623.2 | -0.026 |
| 1623.3 | -0.026 |
| 1623.4 | -0.026 |
| 1623.5 | -0.026 |
| 1623.6 | -0.026 |
| 1623.7 | -0.026 |
| 1623.8 | -0.026 |
| 1623.9 | -0.026 |
| 1624.0 | -0.026 |
| 1624.1 | -0.026 |
| 1624.2 | -0.026 |
| 1624.3 | -0.026 |
| 1624.4 | -0.026 |
| 1624.5 | -0.026 |
| 1624.6 | -0.026 |
| 1624.7 | -0.026 |
| 1624.8 | -0.026 |
| 1624.9 | -0.026 |
| 1625.0 | -0.026 |
| 1625.1 | -0.026 |
| 1625.2 | -0.026 |
| 1625.3 | -0.026 |
| 1625.4 | -0.026 |
| 1625.5 | -0.026 |
| 1625.6 | -0.026 |
| 1625.7 | -0.026 |
| 1625.8 | -0.026 |
| 1625.9 | -0.026 |
| 1626.0 | -0.026 |
| 1626.1 | -0.026 |
| 1626.2 | -0.026 |
| 1626.3 | -0.026 |
| 1626.4 | -0.026 |
| 1626.5 | -0.026 |
| 1626.6 | -0.026 |
| 1626.7 | -0.026 |
| 1626.8 | -0.026 |
| 1626.9 | -0.026 |
| 1627.0 | -0.026 |
| 1627.1 | -0.026 |
| 1627.2 | -0.026 |
| 1627.3 | -0.026 |
| 1627.4 | -0.026 |
| 1627.5 | -0.026 |
| 1627.6 | -0.026 |
| 1627.7 | -0.026 |
| 1627.8 | -0.026 |
| 1627.9 | -0.026 |
| 1628.0 | -0.026 |
| 1628.1 | -0.026 |
| 1628.2 | -0.026 |
| 1628.3 | -0.026 |
| 1628.4 | -0.026 |
| 1628.5 | -0.026 |
| 1628.6 | -0.026 |
| 1628.7 | -0.026 |
| 1628.8 | -0.026 |
| 1628.9 | -0.026 |
| 1629.0 | -0.026 |
| 1629.1 | -0.026 |
| 1629.2 | -0.026 |
| 1629.3 | -0.026 |
| 1629.4 | -0.026 |
| 1629.5 | -0.026 |
| 1629.6 | -0.026 |
| 1629.7 | -0.026 |
| 1629.8 | -0.026 |
| 1629.9 | -0.026 |
| 1630.0 | -0.026 |
| 1630.1 | -0.026 |
| 1630.2 | -0.026 |
| 1630.3 | -0.026 |
| 1630.4 | -0.026 |
| 1630.5 | -0.026 |
| 1630.6 | -0.026 |
| 1630.7 | -0.026 |
| 1630.8 | -0.026 |
| 1630.9 | -0.026 |
| 1631.0 | -0.026 |
| 1631.1 | -0.026 |
| 1631.2 | -0.026 |
| 1631.3 | -0.026 |
| 1631.4 | -0.026 |
| 1631.5 | -0.026 |
| 1631.6 | -0.026 |
| 1631.7 | -0.026 |
| 1631.8 | -0.026 |
| 1631.9 | -0.026 |
| 1632.0 | -0.026 |
| 1632.1 | -0.026 |
| 1632.2 | -0.026 |
| 1632.3 | -0.026 |
| 1632.4 | -0.026 |
| 1632.5 | -0.026 |
| 1632.6 | -0.026 |
| 1632.7 | -0.026 |
| 1632.8 | -0.026 |
| 1632.9 | -0.026 |
| 1633.0 | -0.026 |
| 1633.1 | -0.026 |
| 1633.2 | -0.026 |
| 1633.3 | -0.026 |
| 1633.4 | -0.026 |
| 1633.5 | -0.026 |
| 1633.6 | -0.026 |
| 1633.7 | -0.026 |
| 1633.8 | -0.026 |
| 1633.9 | -0.026 |
| 1634.0 | -0.026 |
| 1634.1 | -0.026 |
| 1634.2 | -0.026 |
| 1634.3 | -0.026 |
| 1634.4 | -0.026 |
| 1634.5 | -0.026 |
| 1634.6 | -0.026 |
| 1634.7 | -0.026 |
| 1634.8 | -0.026 |
| 1634.9 | -0.026 |
| 1635.0 | -0.026 |
| 1635.1 | -0.026 |
| 1635.2 | -0.026 |
| 1635.3 | -0.026 |
| 1635.4 | -0.026 |
| 1635.5 | -0.026 |
| 1635.6 | -0.026 |
| 1635.7 | -0.026 |
| 1635.8 | -0.026 |
| 1635.9 | -0.026 |
| 1636.0 | -0.026 |
| 1636.1 | -0.026 |
| 1636.2 | -0.026 |
| 1636.3 | -0.026 |
| 1636.4 | -0.026 |
| 1636.5 | -0.026 |
| 1636.6 | -0.026 |
| 1636.7 | -0.026 |
| 1636.8 | -0.026 |
| 1636.9 | -0.026 |
| 1637.0 | -0.026 |
| 1637.1 | -0.026 |
| 1637.2 | -0.026 |
| 1637.3 | -0.026 |
| 1637.4 | -0.026 |
| 1637.5 | -0.026 |
| 1637.6 | -0.026 |
| 1637.7 | -0.026 |
| 1637.8 | -0.026 |
| 1637.9 | -0.026 |
| 1638.0 | -0.026 |
| 1638.1 | -0.026 |
| 1638.2 | -0.026 |
| 1638.3 | -0.026 |
| 1638.4 | -0.026 |
| 1638.5 | -0.026 |
| 1638.6 | -0.026 |
| 1638.7 | -0.026 |
| 1638.8 | -0.026 |
| 1638.9 | -0.026 |
| 1639.0 | -0.026 |
| 1639.1 | -0.026 |
| 1639.2 | -0.026 |
| 1639.3 | -0.026 |
| 1639.4 | -0.026 |
| 1639.5 | -0.026 |
| 1639.6 | -0.026 |
| 1639.7 | -0.026 |
| 1639.8 | -0.026 |
| 1639.9 | -0.026 |
| 1640.0 | -0.026 |
| 1640.1 | -0.026 |
| 1640.2 | -0.026 |
| 1640.3 | -0.026 |
| 1640.4 | -0.026 |
| 1640.5 | -0.026 |
| 1640.6 | -0.026 |
| 1640.7 | -0.026 |
| 1640.8 | -0.026 |
| 1640.9 | -0.026 |
| 1641.0 | -0.026 |
| 1641.1 | -0.026 |
| 1641.2 | -0.026 |
| 1641.3 | -0.026 |
| 1641.4 | -0.026 |
| 1641.5 | -0.026 |
| 1641.6 | -0.026 |
| 1641.7 | -0.026 |
| 1641.8 | -0.026 |
| 1641.9 | -0.026 |
| 1642.0 | -0.026 |
| 1642.1 | -0.026 |
| 1642.2 | -0.026 |
| 1642.3 | -0.026 |
| 1642.4 | -0.026 |
| 1642.5 | -0.026 |
| 1642.6 | -0.026 |
| 1642.7 | -0.026 |
| 1642.8 | -0.026 |
| 1642.9 | -0.026 |
| 1643.0 | -0.026 |
| 1643.1 | -0.026 |
| 1643.2 | -0.026 |
| 1643.3 | -0.026 |
| 1643.4 | -0.026 |
| 1643.5 | -0.026 |
| 1643.6 | -0.026 |
| 1643.7 | -0.026 |
| 1643.8 | -0.026 |
| 1643.9 | -0.026 |
| 1644.0 | -0.026 |
| 1644.1 | -0.026 |
| 1644.2 | -0.026 |
| 1644.3 | -0.026 |
| 1644.4 | -0.026 |
| 1644.5 | -0.026 |
| 1644.6 | -0.026 |
| 1644.7 | -0.026 |
| 1644.8 | -0.026 |
| 1644.9 | -0.026 |
| 1645.0 | -0.026 |
| 1645.1 | -0.026 |
| 1645.2 | -0.026 |
| 1645.3 | -0.026 |
| 1645.4 | -0.026 |
| 1645.5 | -0.026 |
| 1645.6 | -0.026 |
| 1645.7 | -0.026 |
| 1645.8 | -0.026 |
| 1645.9 | -0.026 |
| 1646.0 | -0.026 |
| 1646.1 | -0.026 |
| 1646.2 | -0.026 |
| 1646.3 | -0.026 |
| 1646.4 | -0.026 |
| 1646.5 | -0.026 |
| 1646.6 | -0.026 |
| 1646.7 | -0.026 |
| 1646.8 | -0.026 |
| 1646.9 | -0.026 |
| 1647.0 | -0.026 |
| 1647.1 | -0.026 |
| 1647.2 | -0.026 |
| 1647.3 | -0.026 |
| 1647.4 | -0.026 |
| 1647.5 | -0.026 |
| 1647.6 | -0.026 |
| 1647.7 | -0.026 |
| 1647.8 | -0.026 |
| 1647.9 | -0.026 |
| 1648.0 | -0.026 |
| 1648.1 | -0.026 |
| 1648.2 | -0.026 |
| 1648.3 | -0.026 |
| 1648.4 | -0.026 |
| 1648.5 | -0.026 |
| 1648.6 | -0.026 |
| 1648.7 | -0.026 |
| 1648.8 | -0.026 |
| 1648.9 | -0.026 |
| 1649.0 | -0.026 |
| 1649.1 | -0.026 |
| 1649.2 | -0.026 |
| 1649.3 | -0.026 |
| 1649.4 | -0.026 |
| 1649.5 | -0.026 |
| 1649.6 | -0.026 |
| 1649.7 | -0.026 |
| 1649.8 | -0.026 |
| 1649.9 | -0.026 |
| 1650.0 | -0.026 |
| 1650.1 | -0.026 |
| 1650.2 | -0.026 |
| 1650.3 | -0.026 |
| 1650.4 | -0.026 |
| 1650.5 | -0.026 |
| 1650.6 | -0.026 |
| 1650.7 | -0.026 |
| 1650.8 | -0.026 |
| 1650.9 | -0.026 |
| 1651.0 | -0.026 |
| 1651.1 | -0.026 |
| 1651.2 | -0.026 |
| 1651.3 | -0.026 |
| 1651.4 | -0.026 |
| 1651.5 | -0.026 |
| 1651.6 | -0.026 |
| 1651.7 | -0.026 |
| 1651.8 | -0.026 |
| 1651.9 | -0.026 |
| 1652.0 | -0.026 |
| 1652.1 | -0.026 |
| 1652.2 | -0.026 |
| 1652.3 | -0.026 |
| 1652.4 | -0.026 |
| 1652.5 | -0.026 |
| 1652.6 | -0.026 |
| 1652.7 | -0.026 |
| 1652.8 | -0.026 |
| 1652.9 | -0.026 |
| 1653.0 | -0.026 |
| 1653.1 | -0.026 |
| 1653.2 | -0.026 |
| 1653.3 | -0.026 |
| 1653.4 | -0.026 |
| 1653.5 | -0.026 |
| 1653.6 | -0.026 |
| 1653.7 | -0.026 |
| 1653.8 | -0.026 |
| 1653.9 | -0.026 |
| 1654.0 | -0.026 |
| 1654.1 | -0.026 |
| 1654.2 | -0.026 |
| 1654.3 | -0.026 |
| 1654.4 | -0.026 |
| 1654.5 | -0.026 |
| 1654.6 | -0.026 |
| 1654.7 | -0.026 |
| 1654.8 | -0.026 |
| 1654.9 | -0.026 |
| 1655.0 | -0.026 |
| 1655.1 | -0.026 |
| 1655.2 | -0.026 |
| 1655.3 | -0.026 |
| 1655.4 | -0.026 |
| 1655.5 | -0.026 |
| 1655.6 | -0.026 |
| 1655.7 | -0.026 |
| 1655.8 | -0.026 |
| 1655.9 | -0.026 |
| 1656.0 | -0.026 |
| 1656.1 | -0.026 |
| 1656.2 | -0.026 |
| 1656.3 | -0.026 |
| 1656.4 | -0.026 |
| 1656.5 | -0.026 |
| 1656.6 | -0.026 |
| 1656.7 | -0.026 |
| 1656.8 | -0.026 |
| 1656.9 | -0.026 |
| 1657.0 | -0.026 |
| 1657.1 | -0.026 |
| 1657.2 | -0.026 |
| 1657.3 | -0.026 |
| 1657.4 | -0.026 |
| 1657.5 | -0.026 |
| 1657.6 | -0.026 |
| 1657.7 | -0.026 |
| 1657.8 | -0.026 |
| 1657.9 | -0.026 |
| 1658.0 | -0.026 |
| 1658.1 | -0.026 |
| 1658.2 | -0.026 |
| 1658.3 | -0.026 |
| 1658.4 | -0.026 |
| 1658.5 | -0.026 |
| 1658.6 | -0.026 |
| 1658.7 | -0.026 |
| 1658.8 | -0.026 |
| 1658.9 | -0.026 |
| 1659.0 | -0.026 |
| 1659.1 | -0.026 |
| 1659.2 | -0.026 |
| 1659.3 | -0.026 |
| 1659.4 | -0.026 |
| 1659.5 | -0.026 |
| 1659.6 | -0.026 |
| 1659.7 | -0.026 |
| 1659.8 | -0.026 |
| 1659.9 | -0.026 |
| 1660.0 | -0.026 |
| 1660.1 | -0.026 |
| 1660.2 | -0.026 |
| 1660.3 | -0.026 |
| 1660.4 | -0.026 |
| 1660.5 | -0.026 |
| 1660.6 | -0.026 |
| 1660.7 | -0.026 |
| 1660.8 | -0.026 |
| 1660.9 | -0.026 |
| 1661.0 | -0.026 |
| 1661.1 | -0.026 |
| 1661.2 | -0.026 |
| 1661.3 | -0.026 |
| 1661.4 | -0.026 |
| 1661.5 | -0.026 |
| 1661.6 | -0.026 |
| 1661.7 | -0.026 |
| 1661.8 | -0.026 |
| 1661.9 | -0.026 |
| 1662.0 | -0.026 |
| 1662.1 | -0.026 |
| 1662.2 | -0.026 |
| 1662.3 | -0.026 |
| 1662.4 | -0.026 |
| 1662.5 | -0.026 |
| 1662.6 | -0.026 |
| 1662.7 | -0.026 |
| 1662.8 | -0.026 |
| 1662.9 | -0.026 |
| 1663.0 | -0.026 |
| 1663.1 | -0.026 |
| 1663.2 | -0.026 |
| 1663.3 | -0.026 |
| 1663.4 | -0.026 |
| 1663.5 | -0.026 |
| 1663.6 | -0.026 |
| 1663.7 | -0.026 |
| 1663.8 | -0.026 |
| 1663.9 | -0.026 |
| 1664.0 | -0.026 |
| 1664.1 | -0.026 |
| 1664.2 | -0.026 |
| 1664.3 | -0.026 |
| 1664.4 | -0.026 |
| 1664.5 | -0.026 |
| 1664.6 | -0.026 |
| 1664.7 | -0.026 |
| 1664.8 | -0.026 |
| 1664.9 | -0.026 |
| 1665.0 | -0.026 |
| 1665.1 | -0.026 |
| 1665.2 | -0.026 |
| 1665.3 | -0.026 |
| 1665.4 | -0.026 |
| 1665.5 | -0.026 |
| 1665.6 | -0.026 |
| 1665.7 | -0.026 |
| 1665.8 | -0.026 |
| 1665.9 | -0.026 |
| 1666.0 | -0.026 |
| 1666.1 | -0.026 |
| 1666.2 | -0.026 |
| 1666.3 | -0.026 |
| 1666.4 | -0.026 |
| 1666.5 | -0.026 |
| 1666.6 | -0.026 |
| 1666.7 | -0.026 |
| 1666.8 | -0.026 |
| 1666.9 | -0.026 |
| 1667.0 | -0.026 |
| 1667.1 | -0.026 |
| 1667.2 | -0.026 |
| 1667.3 | -0.026 |
| 1667.4 | -0.026 |
| 1667.5 | -0.026 |
| 1667.6 | -0.026 |
| 1667.7 | -0.026 |
| 1667.8 | -0.026 |
| 1667.9 | -0.026 |
| 1668.0 | -0.026 |
| 1668.1 | -0.026 |
| 1668.2 | -0.026 |
| 1668.3 | -0.026 |
| 1668.4 | -0.026 |
| 1668.5 | -0.026 |
| 1668.6 | -0.026 |
| 1668.7 | -0.026 |
| 1668.8 | -0.026 |
| 1668.9 | -0.026 |
| 1669.0 | -0.026 |
| 1669.1 | -0.026 |
| 1669.2 | -0.026 |
| 1669.3 | -0.026 |
| 1669.4 | -0.026 |
| 1669.5 | -0.026 |
| 1669.6 | -0.026 |
| 1669.7 | -0.026 |
| 1669.8 | -0.026 |
| 1669.9 | -0.026 |
| 1670.0 | -0.026 |
| 1670.1 | -0.026 |
| 1670.2 | -0.026 |
| 1670.3 | -0.026 |
| 1670.4 | -0.026 |
| 1670.5 | -0.026 |
| 1670.6 | -0.026 |
| 1670.7 | -0.026 |
| 1670.8 | -0.026 |
| 1670.9 | -0.026 |
| 1671.0 | -0.026 |
| 1671.1 | -0.026 |
| 1671.2 | -0.026 |
| 1671.3 | -0.026 |
| 1671.4 | -0.026 |
| 1671.5 | -0.026 |
| 1671.6 | -0.026 |
| 1671.7 | -0.026 |
| 1671.8 | -0.026 |
| 1671.9 | -0.026 |
| 1672.0 | -0.026 |
| 1672.1 | -0.026 |
| 1672.2 | -0.026 |
| 1672.3 | -0.026 |
| 1672.4 | -0.026 |
| 1672.5 | -0.026 |
| 1672.6 | -0.026 |
| 1672.7 | -0.026 |
| 1672.8 | -0.026 |
| 1672.9 | -0.026 |
| 1673.0 | -0.026 |
| 1673.1 | -0.026 |
| 1673.2 | -0.026 |
| 1673.3 | -0.026 |
| 1673.4 | -0.026 |
| 1673.5 | -0.026 |
| 1673.6 | -0.026 |
| 1673.7 | -0.026 |
| 1673.8 | -0.026 |
| 1673.9 | -0.026 |
| 1674.0 | -0.026 |
| 1674.1 | -0.026 |
| 1674.2 | -0.026 |
| 1674.3 | -0.026 |
| 1674.4 | -0.026 |
| 1674.5 | -0.026 |
| 1674.6 | -0.026 |
| 1674.7 | -0.026 |
| 1674.8 | -0.026 |
| 1674.9 | -0.026 |
| 1675.0 | -0.026 |
| 1675.1 | -0.026 |
| 1675.2 | -0.026 |
| 1675.3 | -0.026 |
| 1675.4 | -0.026 |
| 1675.5 | -0.026 |
| 1675.6 | -0.026 |
| 1675.7 | -0.026 |
| 1675.8 | -0.026 |
| 1675.9 | -0.026 |
| 1676.0 | -0.026 |
| 1676.1 | -0.026 |
| 1676.2 | -0.026 |
| 1676.3 | -0.026 |
| 1676.4 | -0.026 |
| 1676.5 | -0.026 |
| 1676.6 | -0.026 |
| 1676.7 | -0.026 |
| 1676.8 | -0.026 |
| 1676.9 | -0.026 |
| 1677.0 | -0.026 |
| 1677.1 | -0.026 |
| 1677.2 | -0.026 |
| 1677.3 | -0.026 |
| 1677.4 | -0.026 |
| 1677.5 | -0.026 |
| 1677.6 | -0.026 |
| 1677.7 | -0.026 |
| 1677.8 | -0.026 |
| 1677.9 | -0.026 |
| 1678.0 | -0.026 |
| 1678.1 | -0.026 |
| 1678.2 | -0.026 |
| 1678.3 | -0.026 |
| 1678.4 | -0.026 |
| 1678.5 | -0.026 |
| 1678.6 | -0.026 |
| 1678.7 | -0.026 |
| 1678.8 | -0.026 |
| 1678.9 | -0.026 |
| 1679.0 | -0.026 |
| 1679.1 | -0.026 |
| 1679.2 | -0.026 |
| 1679.3 | -0.026 |
| 1679.4 | -0.026 |
| 1679.5 | -0.026 |
| 1679.6 | -0.026 |
| 1679.7 | -0.026 |
| 1679.8 | -0.026 |
| 1679.9 | -0.026 |
| 1680.0 | -0.026 |
| 1680.1 | -0.026 |
| 1680.2 | -0.026 |
| 1680.3 | -0.026 |
| 1680.4 | -0.026 |
| 1680.5 | -0.026 |
| 1680.6 | -0.026 |
| 1680.7 | -0.026 |
| 1680.8 | -0.026 |
| 1680.9 | -0.026 |
| 1681.0 | -0.026 |
| 1681.1 | -0.026 |
| 1681.2 | -0.026 |
| 1681.3 | -0.026 |
| 1681.4 | -0.026 |
| 1681.5 | -0.026 |
| 1681.6 | -0.026 |
| 1681.7 | -0.026 |
| 1681.8 | -0.026 |
| 1681.9 | -0.026 |
| 1682.0 | -0.026 |
| 1682.1 | -0.026 |
| 1682.2 | -0.026 |
| 1682.3 | -0.026 |
| 1682.4 | -0.026 |
| 1682.5 | -0.026 |
| 1682.6 | -0.026 |
| 1682.7 | -0.026 |
| 1682.8 | -0.026 |
| 1682.9 | -0.026 |
| 1683.0 | -0.026 |
| 1683.1 | -0.026 |
| 1683.2 | -0.026 |
| 1683.3 | -0.026 |
| 1683.4 | -0.026 |
| 1683.5 | -0.026 |
| 1683.6 | -0.026 |
| 1683.7 | -0.026 |
| 1683.8 | -0.026 |
| 1683.9 | -0.026 |
| 1684.0 | -0.026 |
| 1684.1 | -0.026 |
| 1684.2 | -0.026 |
| 1684.3 | -0.026 |
| 1684.4 | -0.026 |
| 1684.5 | -0.026 |
| 1684.6 | -0.026 |
| 1684.7 | -0.026 |
| 1684.8 | -0.026 |
| 1684.9 | -0.026 |
| 1685.0 | -0.026 |
| 1685.1 | -0.026 |
| 1685.2 | -0.026 |
| 1685.3 | -0.026 |
| 1685.4 | -0.026 |
| 1685.5 | -0.026 |
| 1685.6 | -0.026 |
| 1685.7 | -0.026 |
| 1685.8 | -0.026 |
| 1685.9 | -0.026 |
| 1686.0 | -0.026 |
| 1686.1 | -0.026 |
| 1686.2 | -0.026 |
| 1686.3 | -0.026 |
| 1686.4 | -0.026 |
| 1686.5 | -0.026 |
| 1686.6 | -0.026 |
| 1686.7 | -0.026 |
| 1686.8 | -0.026 |
| 1686.9 | -0.026 |
| 1687.0 | -0.026 |
| 1687.1 | -0.026 |
| 1687.2 | -0.026 |
| 1687.3 | -0.026 |
| 1687.4 | -0.026 |
| 1687.5 | -0.026 |
| 1687.6 | -0.026 |
| 1687.7 | -0.026 |
| 1687.8 | -0.026 |
| 1687.9 | -0.026 |
| 1688.0 | -0.026 |
| 1688.1 | -0.026 |
| 1688.2 | -0.026 |
| 1688.3 | -0.026 |
| 1688.4 | -0.026 |
| 1688.5 | -0.026 |
| 1688.6 | -0.026 |
| 1688.7 | -0.026 |
| 1688.8 | -0.026 |
| 1688.9 | -0.026 |
| 1689.0 | -0.026 |
| 1689.1 | -0.026 |
| 1689.2 | -0.026 |
| 1689.3 | -0.026 |
| 1689.4 | -0.026 |
| 1689.5 | -0.026 |
| 1689.6 | -0.026 |
| 1689.7 | -0.026 |
| 1689.8 | -0.026 |
| 1689.9 | -0.026 |
| 1690.0 | -0.026 |
| 1690.1 | -0.026 |
| 1690.2 | -0.026 |
| 1690.3 | -0.026 |
| 1690.4 | -0.026 |
| 1690.5 | -0.026 |
| 1690.6 | -0.026 |
| 1690.7 | -0.026 |
| 1690.8 | -0.026 |
| 1690.9 | -0.026 |
| 1691.0 | -0.026 |
| 1691.1 | -0.026 |
| 1691.2 | -0.026 |
| 1691.3 | -0.026 |
| 1691.4 | -0.026 |
| 1691.5 | -0.026 |
| 1691.6 | -0.026 |
| 1691.7 | -0.026 |
| 1691.8 | -0.026 |
| 1691.9 | -0.026 |
| 1692.0 | -0.026 |
| 1692.1 | -0.026 |
| 1692.2 | -0.026 |
| 1692.3 | -0.026 |
| 1692.4 | -0.026 |
| 1692.5 | -0.026 |
| 1692.6 | -0.026 |
| 1692.7 | -0.026 |
| 1692.8 | -0.026 |
| 1692.9 | -0.026 |
| 1693.0 | -0.026 |
| 1693.1 | -0.026 |
| 1693.2 | -0.026 |
| 1693.3 | -0.026 |
| 1693.4 | -0.026 |
| 1693.5 | -0.026 |
| 1693.6 | -0.026 |
| 1693.7 | -0.026 |
| 1693.8 | -0.026 |
| 1693.9 | -0.026 |
| 1694.0 | -0.026 |
| 1694.1 | -0.026 |
| 1694.2 | -0.026 |
| 1694.3 | -0.026 |
| 1694.4 | -0.026 |
| 1694.5 | -0.026 |
| 1694.6 | -0.026 |
| 1694.7 | -0.026 |
| 1694.8 | -0.026 |
| 1694.9 | -0.026 |
| 1695.0 | -0.026 |
| 1695.1 | -0.026 |
| 1695.2 | -0.026 |
| 1695.3 | -0.026 |
| 1695.4 | -0.026 |
| 1695.5 | -0.026 |
| 1695.6 | -0.026 |
| 1695.7 | -0.026 |
| 1695.8 | -0.026 |
| 1695.9 | -0.026 |
| 1696.0 | -0.026 |
| 1696.1 | -0.026 |
| 1696.2 | -0.026 |
| 1696.3 | -0.026 |
| 1696.4 | -0.026 |
| 1696.5 | -0.026 |
| 1696.6 | -0.026 |
| 1696.7 | -0.026 |
| 1696.8 | -0.026 |
| 1696.9 | -0.026 |
| 1697.0 | -0.026 |
| 1697.1 | -0.026 |
| 1697.2 | -0.026 |
| 1697.3 | -0.026 |
| 1697.4 | -0.026 |
| 1697.5 | -0.026 |
| 1697.6 | -0.026 |
| 1697.7 | -0.026 |
| 1697.8 | -0.026 |
| 1697.9 | -0.026 |
| 1698.0 | -0.026 |
| 1698.1 | -0.026 |
| 1698.2 | -0.026 |
| 1698.3 | -0.026 |
| 1698.4 | -0.026 |
| 1698.5 | -0.026 |
| 1698.6 | -0.026 |
| 1698.7 | -0.026 |
| 1698.8 | -0.026 |
| 1698.9 | -0.026 |
| 1699.0 | -0.026 |
| 1699.1 | -0.026 |
| 1699.2 | -0.026 |
| 1699.3 | -0.026 |
| 1699.4 | -0.026 |
| 1699.5 | -0.026 |
| 1699.6 | -0.026 |
| 1699.7 | -0.026 |
| 1699.8 | -0.026 |
| 1699.9 | -0.026 |
| 1700.0 | -0.026 |
| 1700.1 | -0.026 |
| 1700.2 | -0.026 |
| 1700.3 | -0.026 |
| 1700.4 | -0.026 |
| 1700.5 | -0.026 |
| 1700.6 | -0.026 |
| 1700.7 | -0.026 |
| 1700.8 | -0.026 |
| 1700.9 | -0.026 |
| 1701.0 | -0.026 |
| 1701.1 | -0.026 |
| 1701.2 | -0.026 |
| 1701.3 | -0.026 |
| 1701.4 | -0.026 |
| 1701.5 | -0.026 |
| 1701.6 | -0.026 |
| 1701.7 | -0.026 |
| 1701.8 | -0.026 |
| 1701.9 | -0.026 |
| 1702.0 | -0.026 |
| 1702.1 | -0.026 |
| 1702.2 | -0.026 |
| 1702.3 | -0.026 |
| 1702.4 | -0.026 |
| 1702.5 | -0.026 |
| 1702.6 | -0.026 |
| 1702.7 | -0.026 |
| 1702.8 | -0.026 |
| 1702.9 | -0.026 |
| 1703.0 | -0.026 |
| 1703.1 | -0.026 |
| 1703.2 | -0.026 |
| 1703.3 | -0.026 |
| 1703.4 | -0.026 |
| 1703.5 | -0.026 |
| 1703.6 | -0.026 |
| 1703.7 | -0.026 |
| 1703.8 | -0.026 |
| 1703.9 | -0.026 |
| 1704.0 | -0.026 |
| 1704.1 | -0.026 |
| 1704.2 | -0.026 |
| 1704.3 | -0.026 |
| 1704.4 | -0.026 |
| 1704.5 | -0.026 |
| 1704.6 | -0.026 |
| 1704.7 | -0.026 |
| 1704.8 | -0.026 |
| 1704.9 | -0.026 |
| 1705.0 | -0.026 |
| 1705.1 | -0.026 |
| 1705.2 | -0.026 |
| 1705.3 | -0.026 |
| 1705.4 | -0.026 |
| 1705.5 | -0.026 |
| 1705.6 | -0.026 |
| 1705.7 | -0.026 |
| 1705.8 | -0.026 |
| 1705.9 | -0.026 |
| 1706.0 | -0.026 |
| 1706.1 | -0.026 |
| 1706.2 | -0.026 |
| 1706.3 | -0.026 |
| 1706.4 | -0.026 |
| 1706.5 | -0.026 |
| 1706.6 | -0.026 |
| 1706.7 | -0.026 |
| 1706.8 | -0.026 |
| 1706.9 | -0.026 |
| 1707.0 | -0.026 |
| 1707.1 | -0.026 |
| 1707.2 | -0.026 |
| 1707.3 | -0.026 |
| 1707.4 | -0.026 |
| 1707.5 | -0.026 |
| 1707.6 | -0.026 |
| 1707.7 | -0.026 |
| 1707.8 | -0.026 |
| 1707.9 | -0.026 |
| 1708.0 | -0.026 |
| 1708.1 | -0.026 |
| 1708.2 | -0.026 |
| 1708.3 | -0.026 |
| 1708.4 | -0.026 |
| 1708.5 | -0.026 |
| 1708.6 | -0.026 |
| 1708.7 | -0.026 |
| 1708.8 | -0.026 |
| 1708.9 | -0.026 |
| 1709.0 | -0.026 |
| 1709.1 | -0.026 |
| 1709.2 | -0.026 |
| 1709.3 | -0.026 |
| 1709.4 | -0.026 |
| 1709.5 | -0.026 |
| 1709.6 | -0.026 |
| 1709.7 | -0.026 |
| 1709.8 | -0.026 |
| 1709.9 | -0.026 |
| 1710.0 | -0.026 |
| 1710.1 | -0.026 |
| 1710.2 | -0.026 |
| 1710.3 | -0.026 |
| 1710.4 | -0.026 |
| 1710.5 | -0.026 |
| 1710.6 | -0.026 |
| 1710.7 | -0.026 |
| 1710.8 | -0.026 |
| 1710.9 | -0.026 |
| 1711.0 | -0.026 |
| 1711.1 | -0.026 |
| 1711.2 | -0.026 |
| 1711.3 | -0.026 |
| 1711.4 | -0.026 |
| 1711.5 | -0.026 |
| 1711.6 | -0.026 |
| 1711.7 | -0.026 |
| 1711.8 | -0.026 |
| 1711.9 | -0.026 |
| 1712.0 | -0.026 |
| 1712.1 | -0.026 |
| 1712.2 | -0.026 |
| 1712.3 | -0.026 |
| 1712.4 | -0.026 |
| 1712.5 | -0.026 |
| 1712.6 | -0.026 |
| 1712.7 | -0.026 |
| 1712.8 | -0.026 |
| 1712.9 | -0.026 |
| 1713.0 | -0.026 |
| 1713.1 | -0.026 |
| 1713.2 | -0.026 |
| 1713.3 | -0.026 |
| 1713.4 | -0.026 |
| 1713.5 | -0.026 |
| 1713.6 | -0.026 |
| 1713.7 | -0.026 |
| 1713.8 | -0.026 |
| 1713.9 | -0.026 |
| 1714.0 | -0.026 |
| 1714.1 | -0.026 |
| 1714.2 | -0.026 |
| 1714.3 | -0.026 |
| 1714.4 | -0.026 |
| 1714.5 | -0.026 |
| 1714.6 | -0.026 |
| 1714.7 | -0.026 |
| 1714.8 | -0.026 |
| 1714.9 | -0.026 |
| 1715.0 | -0.026 |
| 1715.1 | -0.026 |
| 1715.2 | -0.026 |
| 1715.3 | -0.026 |
| 1715.4 | -0.026 |
| 1715.5 | -0.026 |
| 1715.6 | -0.026 |
| 1715.7 | -0.026 |
| 1715.8 | -0.026 |
| 1715.9 | -0.026 |
| 1716.0 | -0.026 |
| 1716.1 | -0.026 |
| 1716.2 | -0.026 |
| 1716.3 | -0.026 |
| 1716.4 | -0.026 |
| 1716.5 | -0.026 |
| 1716.6 | -0.026 |
| 1716.7 | -0.026 |
| 1716.8 | -0.026 |
| 1716.9 | -0.026 |
| 1717.0 | -0.026 |
| 1717.1 | -0.026 |
| 1717.2 | -0.026 |
| 1717.3 | -0.026 |
| 1717.4 | -0.026 |
| 1717.5 | -0.026 |
| 1717.6 | -0.026 |
| 1717.7 | -0.026 |
| 1717.8 | -0.026 |
| 1717.9 | -0.026 |
| 1718.0 | -0.026 |
| 1718.1 | -0.026 |
| 1718.2 | -0.026 |
| 1718.3 | -0.026 |
| 1718.4 | -0.026 |
| 1718.5 | -0.026 |
| 1718.6 | -0.026 |
| 1718.7 | -0.026 |
| 1718.8 | -0.026 |
| 1718.9 | -0.026 |
| 1719.0 | -0.026 |
| 1719.1 | -0.026 |
| 1719.2 | -0.026 |
| 1719.3 | -0.026 |
| 1719.4 | -0.026 |
| 1719.5 | -0.026 |
| 1719.6 | -0.026 |
| 1719.7 | -0.026 |
| 1719.8 | -0.026 |
| 1719.9 | -0.026 |
| 1720.0 | -0.026 |
| 1720.1 | -0.026 |
| 1720.2 | -0.026 |
| 1720.3 | -0.026 |
| 1720.4 | -0.026 |
| 1720.5 | -0.026 |
| 1720.6 | -0.026 |
| 1720.7 | -0.026 |
| 1720.8 | -0.026 |
| 1720.9 | -0.026 |
| 1721.0 | -0.026 |
| 1721.1 | -0.026 |
| 1721.2 | -0.026 |
| 1721.3 | -0.026 |
| 1721.4 | -0.026 |
| 1721.5 | -0.026 |
| 1721.6 | -0.026 |
| 1721.7 | -0.026 |
| 1721.8 | -0.026 |
| 1721.9 | -0.026 |
| 1722.0 | -0.026 |
| 1722.1 | -0.026 |
| 1722.2 | -0.026 |
| 1722.3 | -0.026 |
| 1722.4 | -0.026 |
| 1722.5 | -0.026 |
| 1722.6 | -0.026 |
| 1722.7 | -0.026 |
| 1722.8 | -0.026 |
| 1722.9 | -0.026 |
| 1723.0 | -0.026 |
| 1723.1 | -0.026 |
| 1723.2 | -0.026 |
| 1723.3 | -0.026 |
| 1723.4 | -0.026 |
| 1723.5 | -0.026 |
| 1723.6 | -0.026 |
| 1723.7 | -0.026 |
| 1723.8 | -0.026 |
| 1723.9 | -0.026 |
| 1724.0 | -0.026 |
| 1724.1 | -0.026 |
| 1724.2 | -0.026 |
| 1724.3 | -0.026 |
| 1724.4 | -0.026 |
| 1724.5 | -0.026 |
| 1724.6 | -0.026 |
| 1724.7 | -0.026 |
| 1724.8 | -0.026 |
| 1724.9 | -0.026 |
| 1725.0 | -0.026 |
| 1725.1 | -0.026 |
| 1725.2 | -0.026 |
| 1725.3 | -0.026 |
| 1725.4 | -0.026 |
| 1725.5 | -0.026 |
| 1725.6 | -0.026 |
| 1725.7 | -0.026 |
| 1725.8 | -0.026 |
| 1725.9 | -0.026 |
| 1726.0 | -0.026 |
| 1726.1 | -0.026 |
| 1726.2 | -0.026 |
| 1726.3 | -0.026 |
| 1726.4 | -0.026 |
| 1726.5 | -0.026 |
| 1726.6 | -0.026 |
| 1726.7 | -0.026 |
| 1726.8 | -0.026 |
| 1726.9 | -0.026 |
| 1727.0 | -0.026 |
| 1727.1 | -0.026 |
| 1727.2 | -0.026 |
| 1727.3 | -0.026 |
| 1727.4 | -0.026 |
| 1727.5 | -0.026 |
| 1727.6 | -0.026 |
| 1727.7 | -0.026 |
| 1727.8 | -0.026 |
| 1727.9 | -0.026 |
| 1728.0 | -0.026 |
| 1728.1 | -0.026 |
| 1728.2 | -0.026 |
| 1728.3 | -0.026 |
| 1728.4 | -0.026 |
| 1728.5 | -0.026 |
| 1728.6 | -0.026 |
| 1728.7 | -0.026 |
| 1728.8 | -0.026 |
| 1728.9 | -0.026 |
| 1729.0 | -0.026 |
| 1729.1 | -0.026 |
| 1729.2 | -0.026 |
| 1729.3 | -0.026 |
| 1729.4 | -0.026 |
| 1729.5 | -0.026 |
| 1729.6 | -0.026 |
| 1729.7 | -0.026 |
| 1729.8 | -0.026 |
| 1729.9 | -0.026 |
| 1730.0 | -0.026 |
| 1730.1 | -0.026 |
| 1730.2 | -0.026 |
| 1730.3 | -0.026 |
| 1730.4 | -0.026 |
| 1730.5 | -0.026 |
| 1730.6 | -0.026 |
| 1730.7 | -0.026 |
| 1730.8 | -0.026 |
| 1730.9 | -0.026 |
| 1731.0 | -0.026 |
| 1731.1 | -0.026 |
| 1731.2 | -0.026 |
| 1731.3 | -0.026 |
| 1731.4 | -0.026 |
| 1731.5 | -0.026 |
| 1731.6 | -0.026 |
| 1731.7 | -0.026 |
| 1731.8 | -0.026 |
| 1731.9 | -0.026 |
| 1732.0 | -0.026 |
| 1732.1 | -0.026 |
| 1732.2 | -0.026 |
| 1732.3 | -0.026 |
| 1732.4 | -0.026 |
| 1732.5 | -0.026 |
| 1732.6 | -0.026 |
| 1732.7 | -0.026 |
| 1732.8 | -0.026 |
| 1732.9 | -0.026 |
| 1733.0 | -0.026 |
| 1733.1 | -0.026 |
| 1733.2 | -0.026 |
| 1733.3 | -0.026 |
| 1733.4 | -0.026 |
| 1733.5 | -0.026 |
| 1733.6 | -0.026 |
| 1733.7 | -0.026 |
| 1733.8 | -0.026 |
| 1733.9 | -0.026 |
| 1734.0 | -0.026 |
| 1734.1 | -0.026 |
| 1734.2 | -0.026 |
| 1734.3 | -0.026 |
| 1734.4 | -0.026 |
| 1734.5 | -0.026 |
| 1734.6 | -0.026 |
| 1734.7 | -0.026 |
| 1734.8 | -0.026 |
| 1734.9 | -0.026 |
| 1735.0 | -0.026 |
| 1735.1 | -0.026 |
| 1735.2 | -0.026 |
| 1735.3 | -0.026 |
| 1735.4 | -0.026 |
| 1735.5 | -0.026 |
| 1735.6 | -0.026 |
| 1735.7 | -0.026 |
| 1735.8 | -0.026 |
| 1735.9 | -0.026 |
| 1736.0 | -0.026 |
| 1736.1 | -0.026 |
| 1736.2 | -0.026 |
| 1736.3 | -0.026 |
| 1736.4 | -0.026 |
| 1736.5 | -0.026 |
| 1736.6 | -0.026 |
| 1736.7 | -0.026 |
| 1736.8 | -0.026 |
| 1736.9 | -0.026 |
| 1737.0 | -0.026 |
| 1737.1 | -0.026 |
| 1737.2 | -0.026 |
| 1737.3 | -0.026 |
| 1737.4 | -0.026 |
| 1737.5 | -0.026 |
| 1737.6 | -0.026 |
| 1737.7 | -0.026 |
| 1737.8 | -0.026 |
| 1737.9 | -0.026 |
| 1738.0 | -0.026 |
| 1738.1 | -0.026 |
| 1738.2 | -0.026 |
| 1738.3 | -0.026 |
| 1738.4 | -0.026 |
| 1738.5 | -0.026 |
| 1738.6 | -0.026 |
| 1738.7 | -0.026 |
| 1738.8 | -0.026 |
| 1738.9 | -0.026 |
| 1739.0 | -0.026 |
| 1739.1 | -0.026 |
| 1739.2 | -0.026 |
| 1739.3 | -0.026 |
| 1739.4 | -0.026 |
| 1739.5 | -0.026 |
| 1739.6 | -0.026 |
| 1739.7 | -0.026 |
| 1739.8 | -0.026 |
| 1739.9 | -0.026 |
| 1740.0 | -0.026 |
| 1740.1 | -0.026 |
| 1740.2 | -0.026 |
| 1740.3 | -0.026 |
| 1740.4 | -0.026 |
| 1740.5 | -0.026 |
| 1740.6 | -0.026 |
| 1740.7 | -0.026 |
| 1740.8 | -0.026 |
| 1740.9 | -0.026 |
| 1741.0 | -0.026 |
| 1741.1 | -0.026 |
| 1741.2 | -0.026 |
| 1741.3 | -0.026 |
| 1741.4 | -0.026 |
| 1741.5 | -0.026 |
| 1741.6 | -0.026 |
| 1741.7 | -0.026 |
| 1741.8 | -0.026 |
| 1741.9 | -0.026 |
| 1742.0 | -0.026 |
| 1742.1 | -0.026 |
| 1742.2 | -0.026 |
| 1742.3 | -0.026 |
| 1742.4 | -0.026 |
| 1742.5 | -0.026 |
| 1742.6 | -0.026 |
| 1742.7 | -0.026 |
| 1742.8 | -0.026 |
| 1742.9 | -0.026 |
| 1743.0 | -0.026 |
| 1743.1 | -0.026 |
| 1743.2 | -0.026 |
| 1743.3 | -0.026 |
| 1743.4 | -0.026 |
| 1743.5 | -0.026 |
| 1743.6 | -0.026 |
| 1743.7 | -0.026 |
| 1743.8 | -0.026 |
| 1743.9 | -0.026 |
| 1744.0 | -0.026 |
| 1744.1 | -0.026 |
| 1744.2 | -0.026 |
| 1744.3 | -0.026 |
| 1744.4 | -0.026 |
| 1744.5 | -0.026 |
| 1744.6 | -0.026 |
| 1744.7 | -0.026 |
| 1744.8 | -0.026 |
| 1744.9 | -0.026 |
| 1745.0 | -0.026 |
| 1745.1 | -0.026 |
| 1745.2 | -0.026 |
| 1745.3 | -0.026 |
| 1745.4 | -0.026 |
| 1745.5 | -0.026 |
| 1745.6 | -0.026 |
| 1745.7 | -0.026 |
| 1745.8 | -0.026 |
| 1745.9 | -0.026 |
| 1746.0 | -0.026 |
| 1746.1 | -0.026 |
| 1746.2 | -0.026 |
| 1746.3 | -0.026 |
| 1746.4 | -0.026 |
| 1746.5 | -0.026 |
| 1746.6 | -0.026 |
| 1746.7 | -0.026 |
| 1746.8 | -0.026 |
| 1746.9 | -0.026 |
| 1747.0 | -0.026 |
| 1747.1 | -0.026 |
| 1747.2 | -0.026 |
| 1747.3 | -0.026 |
| 1747.4 | -0.026 |
| 1747.5 | -0.026 |
| 1747.6 | -0.026 |
| 1747.7 | -0.026 |
| 1747.8 | -0.026 |
| 1747.9 | -0.026 |
| 1748.0 | -0.026 |
| 1748.1 | -0.026 |
| 1748.2 | -0.026 |
| 1748.3 | -0.026 |
| 1748.4 | -0.026 |
| 1748.5 | -0.026 |
| 1748.6 | -0.026 |
| 1748.7 | -0.026 |
| 1748.8 | -0.026 |
| 1748.9 | -0.026 |
| 1749.0 | -0.026 |
| 1749.1 | -0.026 |
| 1749.2 | -0.026 |
| 1749.3 | -0.026 |
| 1749.4 | -0.026 |
| 1749.5 | -0.026 |
| 1749.6 | -0.026 |
| 1749.7 | -0.026 |
| 1749.8 | -0.026 |
| 1749.9 | -0.026 |
| 1750.0 | -0.026 |
| 1750.1 | -0.026 |
| 1750.2 | -0.026 |
| 1750.3 | -0.026 |
| 1750.4 | -0.026 |
| 1750.5 | -0.026 |
| 1750.6 | -0.026 |
| 1750.7 | -0.026 |
| 1750.8 | -0.026 |
| 1750.9 | -0.026 |
| 1751.0 | -0.026 |
| 1751.1 | -0.026 |
| 1751.2 | -0.026 |
| 1751.3 | -0.026 |
| 1751.4 | -0.026 |
| 1751.5 | -0.026 |
| 1751.6 | -0.026 |
| 1751.7 | -0.026 |
| 1751.8 | -0.026 |
| 1751.9 | -0.026 |
| 1752.0 | -0.026 |
| 1752.1 | -0.026 |
| 1752.2 | -0.026 |
| 1752.3 | -0.026 |
| 1752.4 | -0.026 |
| 1752.5 | -0.026 |
| 1752.6 | -0.026 |
| 1752.7 | -0.026 |
| 1752.8 | -0.026 |
| 1752.9 | -0.026 |
| 1753.0 | -0.026 |
| 1753.1 | -0.026 |
| 1753.2 | -0.026 |
| 1753.3 | -0.026 |
| 1753.4 | -0.026 |
| 1753.5 | -0.026 |
| 1753.6 | -0.026 |
| 1753.7 | -0.026 |
| 1753.8 | -0.026 |
| 1753.9 | -0.026 |
| 1754.0 | -0.026 |
| 1754.1 | -0.026 |
| 1754.2 | -0.026 |
| 1754.3 | -0.026 |
| 1754.4 | -0.026 |
| 1754.5 | -0.026 |
| 1754.6 | -0.026 |
| 1754.7 | -0.026 |
| 1754.8 | -0.026 |
| 1754.9 | -0.026 |
| 1755.0 | -0.026 |
| 1755.1 | -0.026 |
| 1755.2 | -0.026 |
| 1755.3 | -0.026 |
| 1755.4 | -0.026 |
| 1755.5 | -0.026 |
| 1755.6 | -0.026 |
| 1755.7 | -0.026 |
| 1755.8 | -0.026 |
| 1755.9 | -0.026 |
| 1756.0 | -0.026 |
| 1756.1 | -0.026 |
| 1756.2 | -0.026 |
| 1756.3 | -0.026 |
| 1756.4 | -0.026 |
| 1756.5 | -0.026 |
| 1756.6 | -0.026 |
| 1756.7 | -0.026 |
| 1756.8 | -0.026 |
| 1756.9 | -0.026 |
| 1757.0 | -0.026 |
| 1757.1 | -0.026 |
| 1757.2 | -0.026 |
| 1757.3 | -0.026 |
| 1757.4 | -0.026 |
| 1757.5 | -0.026 |
| 1757.6 | -0.026 |
| 1757.7 | -0.026 |
| 1757.8 | -0.026 |
| 1757.9 | -0.026 |
| 1758.0 | -0.026 |
| 1758.1 | -0.026 |
| 1758.2 | -0.026 |
| 1758.3 | -0.026 |
| 1758.4 | -0.026 |
| 1758.5 | -0.026 |
| 1758.6 | -0.026 |
| 1758.7 | -0.026 |
| 1758.8 | -0.026 |
| 1758.9 | -0.026 |
| 1759.0 | -0.026 |
| 1759.1 | -0.026 |
| 1759.2 | -0.026 |
| 1759.3 | -0.026 |
| 1759.4 | -0.026 |
| 1759.5 | -0.026 |
| 1759.6 | -0.026 |
| 1759.7 | -0.026 |
| 1759.8 | -0.026 |
| 1759.9 | -0.026 |
| 1760.0 | -0.026 |
| 1760.1 | -0.026 |
| 1760.2 | -0.026 |
| 1760.3 | -0.026 |
| 1760.4 | -0.026 |
| 1760.5 | -0.026 |
| 1760.6 | -0.026 |
| 1760.7 | -0.026 |
| 1760.8 | -0.026 |
| 1760.9 | -0.026 |
| 1761.0 | -0.026 |
| 1761.1 | -0.026 |
| 1761.2 | -0.026 |
| 1761.3 | -0.026 |
| 1761.4 | -0.026 |
| 1761.5 | -0.026 |
| 1761.6 | -0.026 |
| 1761.7 | -0.026 |
| 1761.8 | -0.026 |
| 1761.9 | -0.026 |
| 1762.0 | -0.026 |
| 1762.1 | -0.026 |
| 1762.2 | -0.026 |
| 1762.3 | -0.026 |
| 1762.4 | -0.026 |
| 1762.5 | -0.026 |
| 1762.6 | -0.026 |
| 1762.7 | -0.026 |
| 1762.8 | -0.026 |
| 1762.9 | -0.026 |
| 1763.0 | -0.026 |
| 1763.1 | -0.026 |
| 1763.2 | -0.026 |
| 1763.3 | -0.026 |
| 1763.4 | -0.026 |
| 1763.5 | -0.026 |
| 1763.6 | -0.026 |
| 1763.7 | -0.026 |
| 1763.8 | -0.026 |
| 1763.9 | -0.026 |
| 1764.0 | -0.026 |
| 1764.1 | -0.026 |
| 1764.2 | -0.026 |
| 1764.3 | -0.026 |
| 1764.4 | -0.026 |
| 1764.5 | -0.026 |
| 1764.6 | -0.026 |
| 1764.7 | -0.026 |
| 1764.8 | -0.026 |
| 1764.9 | -0.026 |
| 1765.0 | -0.026 |
| 1765.1 | -0.026 |
| 1765.2 | -0.026 |
| 1765.3 | -0.026 |
| 1765.4 | -0.026 |
| 1765.5 | -0.026 |
| 1765.6 | -0.026 |
| 1765.7 | -0.026 |
| 1765.8 | -0.026 |
| 1765.9 | -0.026 |
| 1766.0 | -0.026 |
| 1766.1 | -0.026 |
| 1766.2 | -0.026 |
| 1766.3 | -0.026 |
| 1766.4 | -0.026 |
| 1766.5 | -0.026 |
| 1766.6 | -0.026 |
| 1766.7 | -0.026 |
| 1766.8 | -0.026 |
| 1766.9 | -0.026 |
| 1767.0 | -0.026 |
| 1767.1 | -0.026 |
| 1767.2 | -0.026 |
| 1767.3 | -0.026 |
| 1767.4 | -0.026 |
| 1767.5 | -0.026 |
| 1767.6 | -0.026 |
| 1767.7 | -0.026 |
| 1767.8 | -0.026 |
| 1767.9 | -0.026 |
| 1768.0 | -0.026 |
| 1768.1 | -0.026 |
| 1768.2 | -0.026 |
| 1768.3 | -0.026 |
| 1768.4 | -0.026 |
| 1768.5 | -0.026 |
| 1768.6 | -0.026 |
| 1768.7 | -0.026 |
| 1768.8 | -0.026 |
| 1768.9 | -0.026 |
| 1769.0 | -0.026 |
| 1769.1 | -0.026 |
| 1769.2 | -0.026 |
| 1769.3 | -0.026 |
| 1769.4 | -0.026 |
| 1769.5 | -0.026 |
| 1769.6 | -0.026 |
| 1769.7 | -0.026 |
| 1769.8 | -0.026 |
| 1769.9 | -0.026 |
| 1770.0 | -0.026 |
| 1770.1 | -0.026 |
| 1770.2 | -0.026 |
| 1770.3 | -0.026 |
| 1770.4 | -0.026 |
| 1770.5 | -0.026 |
| 1770.6 | -0.026 |
| 1770.7 | -0.026 |
| 1770.8 | -0.026 |
| 1770.9 | -0.026 |
| 1771.0 | -0.026 |
| 1771.1 | -0.026 |
| 1771.2 | -0.026 |
| 1771.3 | -0.026 |
| 1771.4 | -0.026 |
| 1771.5 | -0.026 |
| 1771.6 | -0.026 |
| 1771.7 | -0.026 |
| 1771.8 | -0.026 |
| 1771.9 | -0.026 |
| 1772.0 | -0.026 |
| 1772.1 | -0.026 |
| 1772.2 | -0.026 |
| 1772.3 | -0.026 |
| 1772.4 | -0.026 |
| 1772.5 | -0.026 |
| 1772.6 | -0.026 |
| 1772.7 | -0.026 |
| 1772.8 | -0.026 |
| 1772.9 | -0.026 |
| 1773.0 | -0.026 |
| 1773.1 | -0.026 |
| 1773.2 | -0.026 |
| 1773.3 | -0.026 |
| 1773.4 | -0.026 |
| 1773.5 | -0.026 |
| 1773.6 | -0.026 |
| 1773.7 | -0.026 |
| 1773.8 | -0.026 |
| 1773.9 | -0.026 |
| 1774.0 | -0.026 |
| 1774.1 | -0.026 |
| 1774.2 | -0.026 |
| 1774.3 | -0.026 |
| 1774.4 | -0.026 |
| 1774.5 | -0.026 |
| 1774.6 | -0.026 |
| 1774.7 | -0.026 |
| 1774.8 | -0.026 |
| 1774.9 | -0.026 |
| 1775.0 | -0.026 |
| 1775.1 | -0.026 |
| 1775.2 | -0.026 |
| 1775.3 | -0.026 |
| 1775.4 | -0.026 |
| 1775.5 | -0.026 |
| 1775.6 | -0.026 |
| 1775.7 | -0.026 |
| 1775.8 | -0.026 |
| 1775.9 | -0.026 |
| 1776.0 | -0.026 |
| 1776.1 | -0.026 |
| 1776.2 | -0.026 |
| 1776.3 | -0.026 |
| 1776.4 | -0.026 |
| 1776.5 | -0.026 |
| 1776.6 | -0.026 |
| 1776.7 | -0.026 |
| 1776.8 | -0.026 |
| 1776.9 | -0.026 |
| 1777.0 | -0.026 |
| 1777.1 | -0.026 |
| 1777.2 | -0.026 |
| 1777.3 | -0.026 |
| 1777.4 | -0.026 |
| 1777.5 | -0.026 |
| 1777.6 | -0.026 |
| 1777.7 | -0.026 |
| 1777.8 | -0.026 |
| 1777.9 | -0.026 |
| 1778.0 | -0.026 |
| 1778.1 | -0.026 |
| 1778.2 | -0.026 |
| 1778.3 | -0.026 |
| 1778.4 | -0.026 |
| 1778.5 | -0.026 |
| 1778.6 | -0.026 |
| 1778.7 | -0.026 |
| 1778.8 | -0.026 |
| 1778.9 | -0.026 |
| 1779.0 | -0.026 |
| 1779.1 | -0.026 |
| 1779.2 | -0.026 |
| 1779.3 | -0.026 |
| 1779.4 | -0.026 |
| 1779.5 | -0.026 |
| 1779.6 | -0.026 |
| 1779.7 | -0.026 |
| 1779.8 | -0.026 |
| 1779.9 | -0.026 |
| 1780.0 | -0.026 |
| 1780.1 | -0.026 |
| 1780.2 | -0.026 |
| 1780.3 | -0.026 |
| 1780.4 | -0.026 |
| 1780.5 | -0.026 |
| 1780.6 | -0.026 |
| 1780.7 | -0.026 |
| 1780.8 | -0.026 |
| 1780.9 | -0.026 |
| 1781.0 | -0.026 |
| 1781.1 | -0.026 |
| 1781.2 | -0.026 |
| 1781.3 | -0.026 |
| 1781.4 | -0.026 |
| 1781.5 | -0.026 |
| 1781.6 | -0.026 |
| 1781.7 | -0.026 |
| 1781.8 | -0.026 |
| 1781.9 | -0.026 |
| 1782.0 | -0.026 |
| 1782.1 | -0.026 |
| 1782.2 | -0.026 |
| 1782.3 | -0.026 |
| 1782.4 | -0.026 |
| 1782.5 | -0.026 |
| 1782.6 | -0.026 |
| 1782.7 | -0.026 |
| 1782.8 | -0.026 |
| 1782.9 | -0.026 |
| 1783.0 | -0.026 |
| 1783.1 | -0.026 |
| 1783.2 | -0.026 |
| 1783.3 | -0.026 |
| 1783.4 | -0.026 |
| 1783.5 | -0.026 |
| 1783.6 | -0.026 |
| 1783.7 | -0.026 |
| 1783.8 | -0.026 |
| 1783.9 | -0.026 |
| 1784.0 | -0.026 |
| 1784.1 | -0.026 |
| 1784.2 | -0.026 |
| 1784.3 | -0.026 |
| 1784.4 | -0.026 |
| 1784.5 | -0.026 |
| 1784.6 | -0.026 |
| 1784.7 | -0.026 |
| 1784.8 | -0.026 |
| 1784.9 | -0.026 |
| 1785.0 | -0.026 |
| 1785.1 | -0.026 |
| 1785.2 | -0.026 |
| 1785.3 | -0.026 |
| 1785.4 | -0.026 |
| 1785.5 | -0.026 |
| 1785.6 | -0.026 |
| 1785.7 | -0.026 |
| 1785.8 | -0.026 |
| 1785.9 | -0.026 |
| 1786.0 | -0.026 |
| 1786.1 | -0.026 |
| 1786.2 | -0.026 |
| 1786.3 | -0.026 |
| 1786.4 | -0.026 |
| 1786.5 | -0.026 |
| 1786.6 | -0.026 |
| 1786.7 | -0.026 |
| 1786.8 | -0.026 |
| 1786.9 | -0.026 |
| 1787.0 | -0.026 |
| 1787.1 | -0.026 |
| 1787.2 | -0.026 |
| 1787.3 | -0.026 |
| 1787.4 | -0.026 |
| 1787.5 | -0.026 |
| 1787.6 | -0.026 |
| 1787.7 | -0.026 |
| 1787.8 | -0.026 |
| 1787.9 | -0.026 |
| 1788.0 | -0.026 |
| 1788.1 | -0.026 |
| 1788.2 | -0.026 |
| 1788.3 | -0.026 |
| 1788.4 | -0.026 |
| 1788.5 | -0.026 |
| 1788.6 | -0.026 |
| 1788.7 | -0.026 |
| 1788.8 | -0.026 |
| 1788.9 | -0.026 |
| 1789.0 | -0.026 |
| 1789.1 | -0.026 |
| 1789.2 | -0.026 |
| 1789.3 | -0.026 |
| 1789.4 | -0.026 |
| 1789.5 | -0.026 |
| 1789.6 | -0.026 |
| 1789.7 | -0.026 |
| 1789.8 | -0.026 |
| 1789.9 | -0.026 |
| 1790.0 | -0.026 |
| 1790.1 | -0.026 |
| 1790.2 | -0.026 |
| 1790.3 | -0.026 |
| 1790.4 | -0.026 |
| 1790.5 | -0.026 |
| 1790.6 | -0.026 |
| 1790.7 | -0.026 |
| 1790.8 | -0.026 |
| 1790.9 | -0.026 |
| 1791.0 | -0.026 |
| 1791.1 | -0.026 |
| 1791.2 | -0.026 |
| 1791.3 | -0.026 |
| 1791.4 | -0.026 |
| 1791.5 | -0.026 |
| 1791.6 | -0.026 |
| 1791.7 | -0.026 |
| 1791.8 | -0.026 |
| 1791.9 | -0.026 |
| 1792.0 | -0.026 |
| 1792.1 | -0.026 |
| 1792.2 | -0.026 |
| 1792.3 | -0.026 |
| 1792.4 | -0.026 |
| 1792.5 | -0.026 |
| 1792.6 | -0.026 |
| 1792.7 | -0.026 |
| 1792.8 | -0.026 |
| 1792.9 | -0.026 |
| 1793.0 | -0.026 |
| 1793.1 | -0.026 |
| 1793.2 | -0.026 |
| 1793.3 | -0.026 |
| 1793.4 | -0.026 |
| 1793.5 | -0.026 |
| 1793.6 | -0.026 |
| 1793.7 | -0.026 |
| 1793.8 | -0.026 |
| 1793.9 | -0.026 |
| 1794.0 | -0.026 |
| 1794.1 | -0.026 |
| 1794.2 | -0.026 |
| 1794.3 | -0.026 |
| 1794.4 | -0.026 |
| 1794.5 | -0.026 |
| 1794.6 | -0.026 |
| 1794.7 | -0.026 |
| 1794.8 | -0.026 |
| 1794.9 | -0.026 |
| 1795.0 | -0.026 |
| 1795.1 | -0.026 |
| 1795.2 | -0.026 |
| 1795.3 | -0.026 |
| 1795.4 | -0.026 |
| 1795.5 | -0.026 |
| 1795.6 | -0.026 |
| 1795.7 | -0.026 |
| 1795.8 | -0.026 |
| 1795.9 | -0.026 |
| 1796.0 | -0.026 |
| 1796.1 | -0.026 |
| 1796.2 | -0.026 |
| 1796.3 | -0.026 |
| 1796.4 | -0.026 |
| 1796.5 | -0.026 |
| 1796.6 | -0.026 |
| 1796.7 | -0.026 |
| 1796.8 | -0.026 |
| 1796.9 | -0.026 |
| 1797.0 | -0.026 |
| 1797.1 | -0.026 |
| 1797.2 | -0.026 |
| 1797.3 | -0.026 |
| 1797.4 | -0.026 |
| 1797.5 | -0.026 |
| 1797.6 | -0.026 |
| 1797.7 | -0.026 |
| 1797.8 | -0.026 |
| 1797.9 | -0.026 |
| 1798.0 | -0.026 |
| 1798.1 | -0.026 |
| 1798.2 | -0.026 |
| 1798.3 | -0.026 |
| 1798.4 | -0.026 |
| 1798.5 | -0.026 |
| 1798.6 | -0.026 |
| 1798.7 | -0.026 |
| 1798.8 | -0.026 |
| 1798.9 | -0.026 |
| 1799.0 | -0.026 |
| 1799.1 | -0.026 |
| 1799.2 | -0.026 |
| 1799.3 | -0.026 |
| 1799.4 | -0.026 |
| 1799.5 | -0.026 |
| 1799.6 | -0.026 |
| 1799.7 | -0.026 |
| 1799.8 | -0.026 |
| 1799.9 | -0.026 |
| 1800.0 | -0.026 |
| 1800.1 | -0.026 |
| 1800.2 | -0.026 |
| 1800.3 | -0.026 |
| 1800.4 | -0.026 |
| 1800.5 | -0.026 |
| 1800.6 | -0.026 |
| 1800.7 | -0.026 |
| 1800.8 | -0.026 |
| 1800.9 | -0.026 |
| 1801.0 | -0.026 |
| 1801.1 | -0.026 |
| 1801.2 | -0.026 |
| 1801.3 | -0.026 |
| 1801.4 | -0.026 |
| 1801.5 | -0.026 |
| 1801.6 | -0.026 |
| 1801.7 | -0.026 |
| 1801.8 | -0.026 |
| 1801.9 | -0.026 |
| 1802.0 | -0.026 |
| 1802.1 | -0.026 |
| 1802.2 | -0.026 |
| 1802.3 | -0.026 |
| 1802.4 | -0.026 |
| 1802.5 | -0.026 |
| 1802.6 | -0.026 |
| 1802.7 | -0.026 |
| 1802.8 | -0.026 |
| 1802.9 | -0.026 |
| 1803.0 | -0.026 |
| 1803.1 | -0.026 |
| 1803.2 | -0.026 |
| 1803.3 | -0.026 |
| 1803.4 | -0.026 |
| 1803.5 | -0.026 |
| 1803.6 | -0.026 |
| 1803.7 | -0.026 |
| 1803.8 | -0.026 |
| 1803.9 | -0.026 |
| 1804.0 | -0.026 |
| 1804.1 | -0.026 |
| 1804.2 | -0.026 |
| 1804.3 | -0.026 |
| 1804.4 | -0.026 |
| 1804.5 | -0.026 |
| 1804.6 | -0.026 |
| 1804.7 | -0.026 |
| 1804.8 | -0.026 |
| 1804.9 | -0.026 |
| 1805.0 | -0.026 |
| 1805.1 | -0.026 |
| 1805.2 | -0.026 |
| 1805.3 | -0.026 |
| 1805.4 | -0.026 |
| 1805.5 | -0.026 |
| 1805.6 | -0.026 |
| 1805.7 | -0.026 |
| 1805.8 | -0.026 |
| 1805.9 | -0.026 |
| 1806.0 | -0.026 |
| 1806.1 | -0.026 |
| 1806.2 | -0.026 |
| 1806.3 | -0.026 |
| 1806.4 | -0.026 |
| 1806.5 | -0.026 |
| 1806.6 | -0.026 |
| 1806.7 | -0.026 |
| 1806.8 | -0.026 |
| 1806.9 | -0.026 |
| 1807.0 | -0.026 |
| 1807.1 | -0.026 |
| 1807.2 | -0.026 |
| 1807.3 | -0.026 |
| 1807.4 | -0.026 |
| 1807.5 | -0.026 |
| 1807.6 | -0.026 |
| 1807.7 | -0.026 |
| 1807.8 | -0.026 |
| 1807.9 | -0.026 |
| 1808.0 | -0.026 |
| 1808.1 | -0.026 |
| 1808.2 | -0.026 |
| 1808.3 | -0.026 |
| 1808.4 | -0.026 |
| 1808.5 | -0.026 |
| 1808.6 | -0.026 |
| 1808.7 | -0.026 |
| 1808.8 | -0.026 |
| 1808.9 | -0.026 |
| 1809.0 | -0.026 |
| 1809.1 | -0.026 |
| 1809.2 | -0.026 |
| 1809.3 | -0.026 |
| 1809.4 | -0.026 |
| 1809.5 | -0.026 |
| 1809.6 | -0.026 |
| 1809.7 | -0.026 |
| 1809.8 | -0.026 |
| 1809.9 | -0.026 |
| 1810.0 | -0.026 |
| 1810.1 | -0.026 |
| 1810.2 | -0.026 |
| 1810.3 | -0.026 |
| 1810.4 | -0.026 |
| 1810.5 | -0.026 |
| 1810.6 | -0.026 |
| 1810.7 | -0.026 |
| 1810.8 | -0.026 |
| 1810.9 | -0.026 |
| 1811.0 | -0.026 |
| 1811.1 | -0.026 |
| 1811.2 | -0.026 |
| 1811.3 | -0.026 |
| 1811.4 | -0.026 |
| 1811.5 | -0.026 |
| 1811.6 | -0.026 |
| 1811.7 | -0.026 |
| 1811.8 | -0.026 |
| 1811.9 | -0.026 |
| 1812.0 | -0.026 |
| 1812.1 | -0.026 |
| 1812.2 | -0.026 |
| 1812.3 | -0.026 |
| 1812.4 | -0.026 |
| 1812.5 | -0.026 |
| 1812.6 | -0.026 |
| 1812.7 | -0.026 |
| 1812.8 | -0.026 |
| 1812.9 | -0.026 |
| 1813.0 | -0.026 |
| 1813.1 | -0.026 |
| 1813.2 | -0.026 |
| 1813.3 | -0.026 |
| 1813.4 | -0.026 |
| 1813.5 | -0.026 |
| 1813.6 | -0.026 |
| 1813.7 | -0.026 |
| 1813.8 | -0.026 |
| 1813.9 | -0.026 |
| 1814.0 | -0.026 |
| 1814.1 | -0.026 |
| 1814.2 | -0.026 |
| 1814.3 | -0.026 |
| 1814.4 | -0.026 |
| 1814.5 | -0.026 |
| 1814.6 | -0.026 |
| 1814.7 | -0.026 |
| 1814.8 | -0.026 |
| 1814.9 | -0.026 |
| 1815.0 | -0.026 |
| 1815.1 | -0.026 |
| 1815.2 | -0.026 |
| 1815.3 | -0.026 |
| 1815.4 | -0.026 |
| 1815.5 | -0.026 |
| 1815.6 | -0.026 |
| 1815.7 | -0.026 |
| 1815.8 | -0.026 |
| 1815.9 | -0.026 |
| 1816.0 | -0.026 |
| 1816.1 | -0.026 |
| 1816.2 | -0.026 |
| 1816.3 | -0.026 |
| 1816.4 | -0.026 |
| 1816.5 | -0.026 |
| 1816.6 | -0.026 |
| 1816.7 | -0.026 |
| 1816.8 | -0.026 |
| 1816.9 | -0.026 |
| 1817.0 | -0.026 |
| 1817.1 | -0.026 |
| 1817.2 | -0.026 |
| 1817.3 | -0.026 |
| 1817.4 | -0.026 |
| 1817.5 | -0.026 |
| 1817.6 | -0.026 |
| 1817.7 | -0.026 |
| 1817.8 | -0.026 |
| 1817.9 | -0.026 |
| 1818.0 | -0.026 |
| 1818.1 | -0.026 |
| 1818.2 | -0.026 |
| 1818.3 | -0.026 |
| 1818.4 | -0.026 |
| 1818.5 | -0.026 |
| 1818.6 | -0.026 |
| 1818.7 | -0.026 |
| 1818.8 | -0.026 |
| 1818.9 | -0.026 |
| 1819.0 | -0.026 |
| 1819.1 | -0.026 |
| 1819.2 | -0.026 |
| 1819.3 | -0.026 |
| 1819.4 | -0.026 |
| 1819.5 | -0.026 |
| 1819.6 | -0.026 |
| 1819.7 | -0.026 |
| 1819.8 | -0.026 |
| 1819.9 | -0.026 |
| 1820.0 | -0.026 |
| 1820.1 | -0.026 |
| 1820.2 | -0.026 |
| 1820.3 | -0.026 |
| 1820.4 | -0.026 |
| 1820.5 | -0.026 |
| 1820.6 | -0.026 |
| 1820.7 | -0.026 |
| 1820.8 | -0.026 |
| 1820.9 | -0.026 |
| 1821.0 | -0.026 |
| 1821.1 | -0.026 |
| 1821.2 | -0.026 |
| 1821.3 | -0.026 |
| 1821.4 | -0.026 |
| 1821.5 | -0.026 |
| 1821.6 | -0.026 |
| 1821.7 | -0.026 |
| 1821.8 | -0.026 |
| 1821.9 | -0.026 |
| 1822.0 | -0.026 |
| 1822.1 | -0.026 |
| 1822.2 | -0.026 |
| 1822.3 | -0.026 |
| 1822.4 | -0.026 |
| 1822.5 | -0.026 |
| 1822.6 | -0.026 |
| 1822.7 | -0.026 |
| 1822.8 | -0.026 |
| 1822.9 | -0.026 |
| 1823.0 | -0.026 |
| 1823.1 | -0.026 |
| 1823.2 | -0.026 |
| 1823.3 | -0.026 |
| 1823.4 | -0.026 |
| 1823.5 | -0.026 |
| 1823.6 | -0.026 |
| 1823.7 | -0.026 |
| 1823.8 | -0.026 |
| 1823.9 | -0.026 |
| 1824.0 | -0.026 |
| 1824.1 | -0.026 |
| 1824.2 | -0.026 |
| 1824.3 | -0.026 |
| 1824.4 | -0.026 |
| 1824.5 | -0.026 |
| 1824.6 | -0.026 |
| 1824.7 | -0.026 |
| 1824.8 | -0.026 |
| 1824.9 | -0.026 |
| 1825.0 | -0.026 |
| 1825.1 | -0.026 |
| 1825.2 | -0.026 |
| 1825.3 | -0.026 |
| 1825.4 | -0.026 |
| 1825.5 | -0.026 |
| 1825.6 | -0.026 |
| 1825.7 | -0.026 |
| 1825.8 | -0.026 |
| 1825.9 | -0.026 |
| 1826.0 | -0.026 |
| 1826.1 | -0.026 |
| 1826.2 | -0.026 |
| 1826.3 | -0.026 |
| 1826.4 | -0.026 |
| 1826.5 | -0.026 |
| 1826.6 | -0.026 |
| 1826.7 | -0.026 |
| 1826.8 | -0.026 |
| 1826.9 | -0.026 |
| 1827.0 | -0.026 |
| 1827.1 | -0.026 |
| 1827.2 | -0.026 |
| 1827.3 | -0.026 |
| 1827.4 | -0.026 |
| 1827.5 | -0.026 |
| 1827.6 | -0.026 |
| 1827.7 | -0.026 |
| 1827.8 | -0.026 |
| 1827.9 | -0.026 |
| 1828.0 | -0.026 |
| 1828.1 | -0.026 |
| 1828.2 | -0.026 |
| 1828.3 | -0.026 |
| 1828.4 | -0.026 |
| 1828.5 | -0.026 |
| 1828.6 | -0.026 |
| 1828.7 | -0.026 |
| 1828.8 | -0.026 |
| 1828.9 | -0.026 |
| 1829.0 | -0.026 |
| 1829.1 | -0.026 |
| 1829.2 | -0.026 |
| 1829.3 | -0.026 |
| 1829.4 | -0.026 |
| 1829.5 | -0.026 |
| 1829.6 | -0.026 |
| 1829.7 | -0.026 |
| 1829.8 | -0.026 |
| 1829.9 | -0.026 |
| 1830.0 | -0.026 |
| 1830.1 | -0.026 |
| 1830.2 | -0.026 |
| 1830.3 | -0.026 |
| 1830.4 | -0.026 |
| 1830.5 | -0.026 |
| 1830.6 | -0.026 |
| 1830.7 | -0.026 |
| 1830.8 | -0.026 |
| 1830.9 | -0.026 |
| 1831.0 | -0.026 |
| 1831.1 | -0.026 |
| 1831.2 | -0.026 |
| 1831.3 | -0.026 |
| 1831.4 | -0.026 |
| 1831.5 | -0.026 |
| 1831.6 | -0.026 |
| 1831.7 | -0.026 |
| 1831.8 | -0.026 |
| 1831.9 | -0.026 |
| 1832.0 | -0.026 |
| 1832.1 | -0.026 |
| 1832.2 | -0.026 |
| 1832.3 | -0.026 |
| 1832.4 | -0.026 |
| 1832.5 | -0.026 |
| 1832.6 | -0.026 |
| 1832.7 | -0.026 |
| 1832.8 | -0.026 |
| 1832.9 | -0.026 |
| 1833.0 | -0.026 |
| 1833.1 | -0.026 |
| 1833.2 | -0.026 |
| 1833.3 | -0.026 |
| 1833.4 | -0.026 |
| 1833.5 | -0.026 |
| 1833.6 | -0.026 |
| 1833.7 | -0.026 |
| 1833.8 | -0.026 |
| 1833.9 | -0.026 |
| 1834.0 | -0.026 |
| 1834.1 | -0.026 |
| 1834.2 | -0.026 |
| 1834.3 | -0.026 |
| 1834.4 | -0.026 |
| 1834.5 | -0.026 |
| 1834.6 | -0.026 |
| 1834.7 | -0.026 |
| 1834.8 | -0.026 |
| 1834.9 | -0.026 |
| 1835.0 | -0.026 |
| 1835.1 | -0.026 |
| 1835.2 | -0.026 |
| 1835.3 | -0.026 |
| 1835.4 | -0.026 |
| 1835.5 | -0.026 |
| 1835.6 | -0.026 |
| 1835.7 | -0.026 |
| 1835.8 | -0.026 |
| 1835.9 | -0.026 |
| 1836.0 | -0.026 |
| 1836.1 | -0.026 |
| 1836.2 | -0.026 |
| 1836.3 | -0.026 |
| 1836.4 | -0.026 |
| 1836.5 | -0.026 |
| 1836.6 | -0.026 |
| 1836.7 | -0.026 |
| 1836.8 | -0.026 |
| 1836.9 | -0.026 |
| 1837.0 | -0.026 |
| 1837.1 | -0.026 |
| 1837.2 | -0.026 |
| 1837.3 | -0.026 |
| 1837.4 | -0.026 |
| 1837.5 | -0.026 |
| 1837.6 | -0.026 |
| 1837.7 | -0.026 |
| 1837.8 | -0.026 |
| 1837.9 | -0.026 |
| 1838.0 | -0.026 |
| 1838.1 | -0.026 |
| 1838.2 | -0.026 |
| 1838.3 | -0.026 |
| 1838.4 | -0.026 |
| 1838.5 | -0.026 |
| 1838.6 | -0.026 |
| 1838.7 | -0.026 |
| 1838.8 | -0.026 |
| 1838.9 | -0.026 |
| 1839.0 | -0.026 |
| 1839.1 | -0.026 |
| 1839.2 | -0.026 |
| 1839.3 | -0.026 |
| 1839.4 | -0.026 |
| 1839.5 | -0.026 |
| 1839.6 | -0.026 |
| 1839.7 | -0.026 |
| 1839.8 | -0.026 |
| 1839.9 | -0.026 |
| 1840.0 | -0.026 |
| 1840.1 | -0.026 |
| 1840.2 | -0.026 |
| 1840.3 | -0.026 |
| 1840.4 | -0.026 |
| 1840.5 | -0.026 |
| 1840.6 | -0.026 |
| 1840.7 | -0.026 |
| 1840.8 | -0.026 |
| 1840.9 | -0.026 |
| 1841.0 | -0.026 |
| 1841.1 | -0.026 |
| 1841.2 | -0.026 |
| 1841.3 | -0.026 |
| 1841.4 | -0.026 |
| 1841.5 | -0.026 |
| 1841.6 | -0.026 |
| 1841.7 | -0.026 |
| 1841.8 | -0.026 |
| 1841.9 | -0.026 |
| 1842.0 | -0.026 |
| 1842.1 | -0.026 |
| 1842.2 | -0.026 |
| 1842.3 | -0.026 |
| 1842.4 | -0.026 |
| 1842.5 | -0.026 |
| 1842.6 | -0.026 |
| 1842.7 | -0.026 |
| 1842.8 | -0.026 |
| 1842.9 | -0.026 |
| 1843.0 | -0.026 |
| 1843.1 | -0.026 |
| 1843.2 | -0.026 |
| 1843.3 | -0.026 |
| 1843.4 | -0.026 |
| 1843.5 | -0.026 |
| 1843.6 | -0.026 |
| 1843.7 | -0.026 |
| 1843.8 | -0.026 |
| 1843.9 | -0.026 |
| 1844.0 | -0.026 |
| 1844.1 | -0.026 |
| 1844.2 | -0.026 |
| 1844.3 | -0.026 |
| 1844.4 | -0.026 |
| 1844.5 | -0.026 |
| 1844.6 | -0.026 |
| 1844.7 | -0.026 |
| 1844.8 | -0.026 |
| 1844.9 | -0.026 |
| 1845.0 | -0.026 |
| 1845.1 | -0.026 |
| 1845.2 | -0.026 |
| 1845.3 | -0.026 |
| 1845.4 | -0.026 |
| 1845.5 | -0.026 |
| 1845.6 | -0.026 |
| 1845.7 | -0.026 |
| 1845.8 | -0.026 |
| 1845.9 | -0.026 |
| 1846.0 | -0.026 |
| 1846.1 | -0.026 |
| 1846.2 | -0.026 |
| 1846.3 | -0.026 |
| 1846.4 | -0.026 |
| 1846.5 | -0.026 |
| 1846.6 | -0.026 |
| 1846.7 | -0.026 |
| 1846.8 | -0.026 |
| 1846.9 | -0.026 |
| 1847.0 | -0.026 |
| 1847.1 | -0.026 |
| 1847.2 | -0.026 |
| 1847.3 | -0.026 |
| 1847.4 | -0.026 |
| 1847.5 | -0.026 |
| 1847.6 | -0.026 |
| 1847.7 | -0.026 |
| 1847.8 | -0.026 |
| 1847.9 | -0.026 |
| 1848.0 | -0.026 |
| 1848.1 | -0.026 |
| 1848.2 | -0.026 |
| 1848.3 | -0.026 |
| 1848.4 | -0.026 |
| 1848.5 | -0.026 |
| 1848.6 | -0.026 |
| 1848.7 | -0.026 |
| 1848.8 | -0.026 |
| 1848.9 | -0.026 |
| 1849.0 | -0.026 |
| 1849.1 | -0.026 |
| 1849.2 | -0.026 |
| 1849.3 | -0.026 |
| 1849.4 | -0.026 |
| 1849.5 | -0.026 |
| 1849.6 | -0.026 |
| 1849.7 | -0.026 |
| 1849.8 | -0.026 |
| 1849.9 | -0.026 |
| 1850.0 | -0.026 |
| 1850.1 | -0.026 |
| 1850.2 | -0.026 |
| 1850.3 | -0.026 |
| 1850.4 | -0.026 |
| 1850.5 | -0.026 |
| 1850.6 | -0.026 |
| 1850.7 | -0.026 |
| 1850.8 | -0.026 |
| 1850.9 | -0.026 |
| 1851.0 | -0.026 |
| 1851.1 | -0.026 |
| 1851.2 | -0.026 |
| 1851.3 | -0.026 |
| 1851.4 | -0.026 |
| 1851.5 | -0.026 |
| 1851.6 | -0.026 |
| 1851.7 | -0.026 |
| 1851.8 | -0.026 |
| 1851.9 | -0.026 |
| 1852.0 | -0.026 |
| 1852.1 | -0.026 |
| 1852.2 | -0.026 |
| 1852.3 | -0.026 |
| 1852.4 | -0.026 |
| 1852.5 | -0.026 |
| 1852.6 | -0.026 |
| 1852.7 | -0.026 |
| 1852.8 | -0.026 |
| 1852.9 | -0.026 |
| 1853.0 | -0.026 |
| 1853.1 | -0.026 |
| 1853.2 | -0.026 |
| 1853.3 | -0.026 |
| 1853.4 | -0.026 |
| 1853.5 | -0.026 |
| 1853.6 | -0.026 |
| 1853.7 | -0.026 |
| 1853.8 | -0.026 |
| 1853.9 | -0.026 |
| 1854.0 | -0.026 |
| 1854.1 | -0.026 |
| 1854.2 | -0.026 |
| 1854.3 | -0.026 |
| 1854.4 | -0.026 |
| 1854.5 | -0.026 |
| 1854.6 | -0.026 |
| 1854.7 | -0.026 |
| 1854.8 | -0.026 |
| 1854.9 | -0.026 |
| 1855.0 | -0.026 |
| 1855.1 | -0.026 |
| 1855.2 | -0.026 |
| 1855.3 | -0.026 |
| 1855.4 | -0.026 |
| 1855.5 | -0.026 |
| 1855.6 | -0.026 |
| 1855.7 | -0.026 |
| 1855.8 | -0.026 |
| 1855.9 | -0.026 |
| 1856.0 | -0.026 |
| 1856.1 | -0.026 |
| 1856.2 | -0.026 |
| 1856.3 | -0.026 |
| 1856.4 | -0.026 |
| 1856.5 | -0.026 |
| 1856.6 | -0.026 |
| 1856.7 | -0.026 |
| 1856.8 | -0.026 |
| 1856.9 | -0.026 |
| 1857.0 | -0.026 |
| 1857.1 | -0.026 |
| 1857.2 | -0.026 |
| 1857.3 | -0.026 |
| 1857.4 | -0.026 |
| 1857.5 | -0.026 |
| 1857.6 | -0.026 |
| 1857.7 | -0.026 |
| 1857.8 | -0.026 |
| 1857.9 | -0.026 |
| 1858.0 | -0.026 |
| 1858.1 | -0.026 |
| 1858.2 | -0.026 |
| 1858.3 | -0.026 |
| 1858.4 | -0.026 |
| 1858.5 | -0.026 |
| 1858.6 | -0.026 |
| 1858.7 | -0.026 |
| 1858.8 | -0.026 |
| 1858.9 | -0.026 |
| 1859.0 | -0.026 |
| 1859.1 | -0.026 |
| 1859.2 | -0.026 |
| 1859.3 | -0.026 |
| 1859.4 | -0.026 |
| 1859.5 | -0.026 |
| 1859.6 | -0.026 |
| 1859.7 | -0.026 |
| 1859.8 | -0.026 |
| 1859.9 | -0.026 |
| 1860.0 | -0.026 |
| 1860.1 | -0.026 |
| 1860.2 | -0.026 |
| 1860.3 | -0.026 |
| 1860.4 | -0.026 |
| 1860.5 | -0.026 |
| 1860.6 | -0.026 |
| 1860.7 | -0.026 |
| 1860.8 | -0.026 |
| 1860.9 | -0.026 |
| 1861.0 | -0.026 |
| 1861.1 | -0.026 |
| 1861.2 | -0.026 |
| 1861.3 | -0.026 |
| 1861.4 | -0.026 |
| 1861.5 | -0.026 |
| 1861.6 | -0.026 |
| 1861.7 | -0.026 |
| 1861.8 | -0.026 |
| 1861.9 | -0.026 |
| 1862.0 | -0.026 |
| 1862.1 | -0.026 |
| 1862.2 | -0.026 |
| 1862.3 | -0.026 |
| 1862.4 | -0.026 |
| 1862.5 | -0.026 |
| 1862.6 | -0.026 |
| 1862.7 | -0.026 |
| 1862.8 | -0.026 |
| 1862.9 | -0.026 |
| 1863.0 | -0.026 |
| 1863.1 | -0.026 |
| 1863.2 | -0.026 |
| 1863.3 | -0.026 |
| 1863.4 | -0.026 |
| 1863.5 | -0.026 |
| 1863.6 | -0.026 |
| 1863.7 | -0.026 |
| 1863.8 | -0.026 |
| 1863.9 | -0.026 |
| 1864.0 | -0.026 |
| 1864.1 | -0.026 |
| 1864.2 | -0.026 |
| 1864.3 | -0.026 |
| 1864.4 | -0.026 |
| 1864.5 | -0.026 |
| 1864.6 | -0.026 |
| 1864.7 | -0.026 |
| 1864.8 | -0.026 |
| 1864.9 | -0.026 |
| 1865.0 | -0.026 |
| 1865.1 | -0.026 |
| 1865.2 | -0.026 |
| 1865.3 | -0.026 |
| 1865.4 | -0.026 |
| 1865.5 | -0.026 |
| 1865.6 | -0.026 |
| 1865.7 | -0.026 |
| 1865.8 | -0.026 |
| 1865.9 | -0.026 |
| 1866.0 | -0.026 |
| 1866.1 | -0.026 |
| 1866.2 | -0.026 |
| 1866.3 | -0.026 |
| 1866.4 | -0.026 |
| 1866.5 | -0.026 |
| 1866.6 | -0.026 |
| 1866.7 | -0.026 |
| 1866.8 | -0.026 |
| 1866.9 | -0.026 |
| 1867.0 | -0.026 |
| 1867.1 | -0.026 |
| 1867.2 | -0.026 |
| 1867.3 | -0.026 |
| 1867.4 | -0.026 |
| 1867.5 | -0.026 |
| 1867.6 | -0.026 |
| 1867.7 | -0.026 |
| 1867.8 | -0.026 |
| 1867.9 | -0.026 |
| 1868.0 | -0.026 |
| 1868.1 | -0.026 |
| 1868.2 | -0.026 |
| 1868.3 | -0.026 |
| 1868.4 | -0.026 |
| 1868.5 | -0.026 |
| 1868.6 | -0.026 |
| 1868.7 | -0.026 |
| 1868.8 | -0.026 |
| 1868.9 | -0.026 |
| 1869.0 | -0.026 |
| 1869.1 | -0.026 |
| 1869.2 | -0.026 |
| 1869.3 | -0.026 |
| 1869.4 | -0.026 |
| 1869.5 | -0.026 |
| 1869.6 | -0.026 |
| 1869.7 | -0.026 |
| 1869.8 | -0.026 |
| 1869.9 | -0.026 |
| 1870.0 | -0.026 |
| 1870.1 | -0.026 |
| 1870.2 | -0.026 |
| 1870.3 | -0.026 |
| 1870.4 | -0.026 |
| 1870.5 | -0.026 |
| 1870.6 | -0.026 |
| 1870.7 | -0.026 |
| 1870.8 | -0.026 |
| 1870.9 | -0.026 |
| 1871.0 | -0.026 |
| 1871.1 | -0.026 |
| 1871.2 | -0.026 |
| 1871.3 | -0.026 |
| 1871.4 | -0.026 |
| 1871.5 | -0.026 |
| 1871.6 | -0.026 |
| 1871.7 | -0.026 |
| 1871.8 | -0.026 |
| 1871.9 | -0.026 |
| 1872.0 | -0.026 |
| 1872.1 | -0.026 |
| 1872.2 | -0.026 |
| 1872.3 | -0.026 |
| 1872.4 | -0.026 |
| 1872.5 | -0.026 |
| 1872.6 | -0.026 |
| 1872.7 | -0.026 |
| 1872.8 | -0.026 |
| 1872.9 | -0.026 |
| 1873.0 | -0.026 |
| 1873.1 | -0.026 |
| 1873.2 | -0.026 |
| 1873.3 | -0.026 |
| 1873.4 | -0.026 |
| 1873.5 | -0.026 |
| 1873.6 | -0.026 |
| 1873.7 | -0.026 |
| 1873.8 | -0.026 |
| 1873.9 | -0.026 |
| 1874.0 | -0.026 |
| 1874.1 | -0.026 |
| 1874.2 | -0.026 |
| 1874.3 | -0.026 |
| 1874.4 | -0.026 |
| 1874.5 | -0.026 |
| 1874.6 | -0.026 |
| 1874.7 | -0.026 |
| 1874.8 | -0.026 |
| 1874.9 | -0.026 |
| 1875.0 | -0.026 |
| 1875.1 | -0.026 |
| 1875.2 | -0.026 |
| 1875.3 | -0.026 |
| 1875.4 | -0.026 |
| 1875.5 | -0.026 |
| 1875.6 | -0.026 |
| 1875.7 | -0.026 |
| 1875.8 | -0.026 |
| 1875.9 | -0.026 |
| 1876.0 | -0.026 |
| 1876.1 | -0.026 |
| 1876.2 | -0.026 |
| 1876.3 | -0.026 |
| 1876.4 | -0.026 |
| 1876.5 | -0.026 |
| 1876.6 | -0.026 |
| 1876.7 | -0.026 |
| 1876.8 | -0.026 |
| 1876.9 | -0.026 |
| 1877.0 | -0.026 |
| 1877.1 | -0.026 |
| 1877.2 | -0.026 |
| 1877.3 | -0.026 |
| 1877.4 | -0.026 |
| 1877.5 | -0.026 |
| 1877.6 | -0.026 |
| 1877.7 | -0.026 |
| 1877.8 | -0.026 |
| 1877.9 | -0.026 |
| 1878.0 | -0.026 |
| 1878.1 | -0.026 |
| 1878.2 | -0.026 |
| 1878.3 | -0.026 |
| 1878.4 | -0.026 |
| 1878.5 | -0.026 |
| 1878.6 | -0.026 |
| 1878.7 | -0.026 |
| 1878.8 | -0.026 |
| 1878.9 | -0.026 |
| 1879.0 | -0.026 |
| 1879.1 | -0.026 |
| 1879.2 | -0.026 |
| 1879.3 | -0.026 |
| 1879.4 | -0.026 |
| 1879.5 | -0.026 |
| 1879.6 | -0.026 |
| 1879.7 | -0.026 |
| 1879.8 | -0.026 |
| 1879.9 | -0.026 |
| 1880.0 | -0.026 |
| 1880.1 | -0.026 |
| 1880.2 | -0.026 |
| 1880.3 | -0.026 |
| 1880.4 | -0.026 |
| 1880.5 | -0.026 |
| 1880.6 | -0.026 |
| 1880.7 | -0.026 |
| 1880.8 | -0.026 |
| 1880.9 | -0.026 |
| 1881.0 | -0.026 |
| 1881.1 | -0.026 |
| 1881.2 | -0.026 |
| 1881.3 | -0.026 |
| 1881.4 | -0.026 |
| 1881.5 | -0.026 |
| 1881.6 | -0.026 |
| 1881.7 | -0.026 |
| 1881.8 | -0.026 |
| 1881.9 | -0.026 |
| 1882.0 | -0.026 |
| 1882.1 | -0.026 |
| 1882.2 | -0.026 |
| 1882.3 | -0.026 |
| 1882.4 | -0.026 |
| 1882.5 | -0.026 |
| 1882.6 | -0.026 |
| 1882.7 | -0.026 |
| 1882.8 | -0.026 |
| 1882.9 | -0.026 |
| 1883.0 | -0.026 |
| 1883.1 | -0.026 |
| 1883.2 | -0.026 |
| 1883.3 | -0.026 |
| 1883.4 | -0.026 |
| 1883.5 | -0.026 |
| 1883.6 | -0.026 |
| 1883.7 | -0.026 |
| 1883.8 | -0.026 |
| 1883.9 | -0.026 |
| 1884.0 | -0.026 |
| 1884.1 | -0.026 |
| 1884.2 | -0.026 |
| 1884.3 | -0.026 |
| 1884.4 | -0.026 |
| 1884.5 | -0.026 |
| 1884.6 | -0.026 |
| 1884.7 | -0.026 |
| 1884.8 | -0.026 |
| 1884.9 | -0.026 |
| 1885.0 | -0.026 |
| 1885.1 | -0.026 |
| 1885.2 | -0.026 |
| 1885.3 | -0.026 |
| 1885.4 | -0.026 |
| 1885.5 | -0.026 |
| 1885.6 | -0.026 |
| 1885.7 | -0.026 |
| 1885.8 | -0.026 |
| 1885.9 | -0.026 |
| 1886.0 | -0.026 |
| 1886.1 | -0.026 |
| 1886.2 | -0.026 |
| 1886.3 | -0.026 |
| 1886.4 | -0.026 |
| 1886.5 | -0.026 |
| 1886.6 | -0.026 |
| 1886.7 | -0.026 |
| 1886.8 | -0.026 |
| 1886.9 | -0.026 |
| 1887.0 | -0.026 |
| 1887.1 | -0.026 |
| 1887.2 | -0.026 |
| 1887.3 | -0.026 |
| 1887.4 | -0.026 |
| 1887.5 | -0.026 |
| 1887.6 | -0.026 |
| 1887.7 | -0.026 |
| 1887.8 | -0.026 |
| 1887.9 | -0.026 |
| 1888.0 | -0.026 |
| 1888.1 | -0.026 |
| 1888.2 | -0.026 |
| 1888.3 | -0.026 |
| 1888.4 | -0.026 |
| 1888.5 | -0.026 |
| 1888.6 | -0.026 |
| 1888.7 | -0.026 |
| 1888.8 | -0.026 |
| 1888.9 | -0.026 |
| 1889.0 | -0.026 |
| 1889.1 | -0.026 |
| 1889.2 | -0.026 |
| 1889.3 | -0.026 |
| 1889.4 | -0.026 |
| 1889.5 | -0.026 |
| 1889.6 | -0.026 |
| 1889.7 | -0.026 |
| 1889.8 | -0.026 |
| 1889.9 | -0.026 |
| 1890.0 | -0.026 |
| 1890.1 | -0.026 |
| 1890.2 | -0.026 |
| 1890.3 | -0.026 |
| 1890.4 | -0.026 |
| 1890.5 | -0.026 |
| 1890.6 | -0.026 |
| 1890.7 | -0.026 |
| 1890.8 | -0.026 |
| 1890.9 | -0.026 |
| 1891.0 | -0.026 |
| 1891.1 | -0.026 |
| 1891.2 | -0.026 |
| 1891.3 | -0.026 |
| 1891.4 | -0.026 |
| 1891.5 | -0.026 |
| 1891.6 | -0.026 |
| 1891.7 | -0.026 |
| 1891.8 | -0.026 |
| 1891.9 | -0.026 |
| 1892.0 | -0.026 |
| 1892.1 | -0.026 |
| 1892.2 | -0.026 |
| 1892.3 | -0.026 |
| 1892.4 | -0.026 |
| 1892.5 | -0.026 |
| 1892.6 | -0.026 |
| 1892.7 | -0.026 |
| 1892.8 | -0.026 |
| 1892.9 | -0.026 |
| 1893.0 | -0.026 |
| 1893.1 | -0.026 |
| 1893.2 | -0.026 |
| 1893.3 | -0.026 |
| 1893.4 | -0.026 |
| 1893.5 | -0.026 |
| 1893.6 | -0.026 |
| 1893.7 | -0.026 |
| 1893.8 | -0.026 |
| 1893.9 | -0.026 |
| 1894.0 | -0.026 |
| 1894.1 | -0.026 |
| 1894.2 | -0.026 |
| 1894.3 | -0.026 |
| 1894.4 | -0.026 |
| 1894.5 | -0.026 |
| 1894.6 | -0.026 |
| 1894.7 | -0.026 |
| 1894.8 | -0.026 |
| 1894.9 | -0.026 |
| 1895.0 | -0.026 |
| 1895.1 | -0.026 |
| 1895.2 | -0.026 |
| 1895.3 | -0.026 |
| 1895.4 | -0.026 |
| 1895.5 | -0.026 |
| 1895.6 | -0.026 |
| 1895.7 | -0.026 |
| 1895.8 | -0.026 |
| 1895.9 | -0.026 |
| 1896.0 | -0.026 |
| 1896.1 | -0.026 |
| 1896.2 | -0.026 |
| 1896.3 | -0.026 |
| 1896.4 | -0.026 |
| 1896.5 | -0.026 |
| 1896.6 | -0.026 |
| 1896.7 | -0.026 |
| 1896.8 | -0.026 |
| 1896.9 | -0.026 |
| 1897.0 | -0.026 |
| 1897.1 | -0.026 |
| 1897.2 | -0.026 |
| 1897.3 | -0.026 |
| 1897.4 | -0.026 |
| 1897.5 | -0.026 |
| 1897.6 | -0.026 |
| 1897.7 | -0.026 |
| 1897.8 | -0.026 |
| 1897.9 | -0.026 |
| 1898.0 | -0.026 |
| 1898.1 | -0.026 |
| 1898.2 | -0.026 |
| 1898.3 | -0.026 |
| 1898.4 | -0.026 |
| 1898.5 | -0.026 |
| 1898.6 | -0.026 |
| 1898.7 | -0.026 |
| 1898.8 | -0.026 |
| 1898.9 | -0.026 |
| 1899.0 | -0.026 |
| 1899.1 | -0.026 |
| 1899.2 | -0.026 |
| 1899.3 | -0.026 |
| 1899.4 | -0.026 |
| 1899.5 | -0.026 |
| 1899.6 | -0.026 |
| 1899.7 | -0.026 |
| 1899.8 | -0.026 |
| 1899.9 | -0.026 |
| 1900.0 | -0.026 |
| 1900.1 | -0.026 |
| 1900.2 | -0.026 |
| 1900.3 | -0.026 |
| 1900.4 | -0.026 |
| 1900.5 | -0.026 |
| 1900.6 | -0.026 |
| 1900.7 | -0.026 |
| 1900.8 | -0.026 |
| 1900.9 | -0.026 |
| 1901.0 | -0.026 |
| 1901.1 | -0.026 |
| 1901.2 | -0.026 |
| 1901.3 | -0.026 |
| 1901.4 | -0.026 |
| 1901.5 | -0.026 |
| 1901.6 | -0.026 |
| 1901.7 | -0.026 |
| 1901.8 | -0.026 |
| 1901.9 | -0.026 |
| 1902.0 | -0.026 |
| 1902.1 | -0.026 |
| 1902.2 | -0.026 |
| 1902.3 | -0.026 |
| 1902.4 | -0.026 |
| 1902.5 | -0.026 |
| 1902.6 | -0.026 |
| 1902.7 | -0.026 |
| 1902.8 | -0.026 |
| 1902.9 | -0.026 |
| 1903.0 | -0.026 |
| 1903.1 | -0.026 |
| 1903.2 | -0.026 |
| 1903.3 | -0.026 |
| 1903.4 | -0.026 |
| 1903.5 | -0.026 |
| 1903.6 | -0.026 |
| 1903.7 | -0.026 |
| 1903.8 | -0.026 |
| 1903.9 | -0.026 |
| 1904.0 | -0.026 |
| 1904.1 | -0.026 |
| 1904.2 | -0.026 |
| 1904.3 | -0.026 |
| 1904.4 | -0.026 |
| 1904.5 | -0.026 |
| 1904.6 | -0.026 |
| 1904.7 | -0.026 |
| 1904.8 | -0.026 |
| 1904.9 | -0.026 |
| 1905.0 | -0.026 |
| 1905.1 | -0.026 |
| 1905.2 | -0.026 |
| 1905.3 | -0.026 |
| 1905.4 | -0.026 |
| 1905.5 | -0.026 |
| 1905.6 | -0.026 |
| 1905.7 | -0.026 |
| 1905.8 | -0.026 |
| 1905.9 | -0.026 |
| 1906.0 | -0.026 |
| 1906.1 | -0.026 |
| 1906.2 | -0.026 |
| 1906.3 | -0.026 |
| 1906.4 | -0.026 |
| 1906.5 | -0.026 |
| 1906.6 | -0.026 |
| 1906.7 | -0.026 |
| 1906.8 | -0.026 |
| 1906.9 | -0.026 |
| 1907.0 | -0.026 |
| 1907.1 | -0.026 |
| 1907.2 | -0.026 |
| 1907.3 | -0.026 |
| 1907.4 | -0.026 |
| 1907.5 | -0.026 |
| 1907.6 | -0.026 |
| 1907.7 | -0.026 |
| 1907.8 | -0.026 |
| 1907.9 | -0.026 |
| 1908.0 | -0.026 |
| 1908.1 | -0.026 |
| 1908.2 | -0.026 |
| 1908.3 | -0.026 |
| 1908.4 | -0.026 |
| 1908.5 | -0.026 |
| 1908.6 | -0.026 |
| 1908.7 | -0.026 |
| 1908.8 | -0.026 |
| 1908.9 | -0.026 |
| 1909.0 | -0.026 |
| 1909.1 | -0.026 |
| 1909.2 | -0.026 |
| 1909.3 | -0.026 |
| 1909.4 | -0.026 |
| 1909.5 | -0.026 |
| 1909.6 | -0.026 |
| 1909.7 | -0.026 |
| 1909.8 | -0.026 |
| 1909.9 | -0.026 |
| 1910.0 | -0.026 |
| 1910.1 | -0.026 |
| 1910.2 | -0.026 |
| 1910.3 | -0.026 |
| 1910.4 | -0.026 |
| 1910.5 | -0.026 |
| 1910.6 | -0.026 |
| 1910.7 | -0.026 |
| 1910.8 | -0.026 |
| 1910.9 | -0.026 |
| 1911.0 | -0.026 |
| 1911.1 | -0.026 |
| 1911.2 | -0.026 |
| 1911.3 | -0.026 |
| 1911.4 | -0.026 |
| 1911.5 | -0.026 |
| 1911.6 | -0.026 |
| 1911.7 | -0.026 |
| 1911.8 | -0.026 |
| 1911.9 | -0.026 |
| 1912.0 | -0.026 |
| 1912.1 | -0.026 |
| 1912.2 | -0.026 |
| 1912.3 | -0.026 |
| 1912.4 | -0.026 |
| 1912.5 | -0.026 |
| 1912.6 | -0.026 |
| 1912.7 | -0.026 |
| 1912.8 | -0.026 |
| 1912.9 | -0.026 |
| 1913.0 | -0.026 |
| 1913.1 | -0.026 |
| 1913.2 | -0.026 |
| 1913.3 | -0.026 |
| 1913.4 | -0.026 |
| 1913.5 | -0.026 |
| 1913.6 | -0.026 |
| 1913.7 | -0.026 |
| 1913.8 | -0.026 |
| 1913.9 | -0.026 |
| 1914.0 | -0.026 |
| 1914.1 | -0.026 |
| 1914.2 | -0.026 |
| 1914.3 | -0.026 |
| 1914.4 | -0.026 |
| 1914.5 | -0.026 |
| 1914.6 | -0.026 |
| 1914.7 | -0.026 |
| 1914.8 | -0.026 |
| 1914.9 | -0.026 |
| 1915.0 | -0.026 |
| 1915.1 | -0.026 |
| 1915.2 | -0.026 |
| 1915.3 | -0.026 |
| 1915.4 | -0.026 |
| 1915.5 | -0.026 |
| 1915.6 | -0.026 |
| 1915.7 | -0.026 |
| 1915.8 | -0.026 |
| 1915.9 | -0.026 |
| 1916.0 | -0.026 |
| 1916.1 | -0.026 |
| 1916.2 | -0.026 |
| 1916.3 | -0.026 |
| 1916.4 | -0.026 |
| 1916.5 | -0.026 |
| 1916.6 | -0.026 |
| 1916.7 | -0.026 |
| 1916.8 | -0.026 |
| 1916.9 | -0.026 |
| 1917.0 | -0.026 |
| 1917.1 | -0.026 |
| 1917.2 | -0.026 |
| 1917.3 | -0.026 |
| 1917.4 | -0.026 |
| 1917.5 | -0.026 |
| 1917.6 | -0.026 |
| 1917.7 | -0.026 |
| 1917.8 | -0.026 |
| 1917.9 | -0.026 |
| 1918.0 | -0.026 |
| 1918.1 | -0.026 |
| 1918.2 | -0.026 |
| 1918.3 | -0.026 |
| 1918.4 | -0.026 |
| 1918.5 | -0.026 |
| 1918.6 | -0.026 |
| 1918.7 | -0.026 |
| 1918.8 | -0.026 |
| 1918.9 | -0.026 |
| 1919.0 | -0.026 |
| 1919.1 | -0.026 |
| 1919.2 | -0.026 |
| 1919.3 | -0.026 |
| 1919.4 | -0.026 |
| 1919.5 | -0.026 |
| 1919.6 | -0.026 |
| 1919.7 | -0.026 |
| 1919.8 | -0.026 |
| 1919.9 | -0.026 |
| 1920.0 | -0.026 |
| 1920.1 | -0.026 |
| 1920.2 | -0.026 |
| 1920.3 | -0.026 |
| 1920.4 | -0.026 |
| 1920.5 | -0.026 |
| 1920.6 | -0.026 |
| 1920.7 | -0.026 |
| 1920.8 | -0.026 |
| 1920.9 | -0.026 |
| 1921.0 | -0.026 |
| 1921.1 | -0.026 |
| 1921.2 | -0.026 |
| 1921.3 | -0.026 |
| 1921.4 | -0.026 |
| 1921.5 | -0.026 |
| 1921.6 | -0.026 |
| 1921.7 | -0.026 |
| 1921.8 | -0.026 |
| 1921.9 | -0.026 |
| 1922.0 | -0.026 |
| 1922.1 | -0.026 |
| 1922.2 | -0.026 |
| 1922.3 | -0.026 |
| 1922.4 | -0.026 |
| 1922.5 | -0.026 |
| 1922.6 | -0.026 |
| 1922.7 | -0.026 |
| 1922.8 | -0.026 |
| 1922.9 | -0.026 |
| 1923.0 | -0.026 |
| 1923.1 | -0.026 |
| 1923.2 | -0.026 |
| 1923.3 | -0.026 |
| 1923.4 | -0.026 |
| 1923.5 | -0.026 |
| 1923.6 | -0.026 |
| 1923.7 | -0.026 |
| 1923.8 | -0.026 |
| 1923.9 | -0.026 |
| 1924.0 | -0.026 |
| 1924.1 | -0.026 |
| 1924.2 | -0.026 |
| 1924.3 | -0.026 |
| 1924.4 | -0.026 |
| 1924.5 | -0.026 |
| 1924.6 | -0.026 |
| 1924.7 | -0.026 |
| 1924.8 | -0.026 |
| 1924.9 | -0.026 |
| 1925.0 | -0.026 |
| 1925.1 | -0.026 |
| 1925.2 | -0.026 |
| 1925.3 | -0.026 |
| 1925.4 | -0.026 |
| 1925.5 | -0.026 |
| 1925.6 | -0.026 |
| 1925.7 | -0.026 |
| 1925.8 | -0.026 |
| 1925.9 | -0.026 |
| 1926.0 | -0.026 |
| 1926.1 | -0.026 |
| 1926.2 | -0.026 |
| 1926.3 | -0.026 |
| 1926.4 | -0.026 |
| 1926.5 | -0.026 |
| 1926.6 | -0.026 |
| 1926.7 | -0.026 |
| 1926.8 | -0.026 |
| 1926.9 | -0.026 |
| 1927.0 | -0.026 |
| 1927.1 | -0.026 |
| 1927.2 | -0.026 |
| 1927.3 | -0.026 |
| 1927.4 | -0.026 |
| 1927.5 | -0.026 |
| 1927.6 | -0.026 |
| 1927.7 | -0.026 |
| 1927.8 | -0.026 |
| 1927.9 | -0.026 |
| 1928.0 | -0.026 |
| 1928.1 | -0.026 |
| 1928.2 | -0.026 |
| 1928.3 | -0.026 |
| 1928.4 | -0.026 |
| 1928.5 | -0.026 |
| 1928.6 | -0.026 |
| 1928.7 | -0.026 |
| 1928.8 | -0.026 |
| 1928.9 | -0.026 |
| 1929.0 | -0.026 |
| 1929.1 | -0.026 |
| 1929.2 | -0.026 |
| 1929.3 | -0.026 |
| 1929.4 | -0.026 |
| 1929.5 | -0.026 |
| 1929.6 | -0.026 |
| 1929.7 | -0.026 |
| 1929.8 | -0.026 |
| 1929.9 | -0.026 |
| 1930.0 | -0.026 |
| 1930.1 | -0.026 |
| 1930.2 | -0.026 |
| 1930.3 | -0.026 |
| 1930.4 | -0.026 |
| 1930.5 | -0.026 |
| 1930.6 | -0.026 |
| 1930.7 | -0.026 |
| 1930.8 | -0.026 |
| 1930.9 | -0.026 |
| 1931.0 | -0.026 |
| 1931.1 | -0.026 |
| 1931.2 | -0.026 |
| 1931.3 | -0.026 |
| 1931.4 | -0.026 |
| 1931.5 | -0.026 |
| 1931.6 | -0.026 |
| 1931.7 | -0.026 |
| 1931.8 | -0.026 |
| 1931.9 | -0.026 |
| 1932.0 | -0.026 |
| 1932.1 | -0.026 |
| 1932.2 | -0.026 |
| 1932.3 | -0.026 |
| 1932.4 | -0.026 |
| 1932.5 | -0.026 |
| 1932.6 | -0.026 |
| 1932.7 | -0.026 |
| 1932.8 | -0.026 |
| 1932.9 | -0.026 |
| 1933.0 | -0.026 |
| 1933.1 | -0.026 |
| 1933.2 | -0.026 |
| 1933.3 | -0.026 |
| 1933.4 | -0.026 |
| 1933.5 | -0.026 |
| 1933.6 | -0.026 |
| 1933.7 | -0.026 |
| 1933.8 | -0.026 |
| 1933.9 | -0.026 |
| 1934.0 | -0.026 |
| 1934.1 | -0.026 |
| 1934.2 | -0.026 |
| 1934.3 | -0.026 |
| 1934.4 | -0.026 |
| 1934.5 | -0.026 |
| 1934.6 | -0.026 |
| 1934.7 | -0.026 |
| 1934.8 | -0.026 |
| 1934.9 | -0.026 |
| 1935.0 | -0.026 |
| 1935.1 | -0.026 |
| 1935.2 | -0.026 |
| 1935.3 | -0.026 |
| 1935.4 | -0.026 |
| 1935.5 | -0.026 |
| 1935.6 | -0.026 |
| 1935.7 | -0.026 |
| 1935.8 | -0.026 |
| 1935.9 | -0.026 |
| 1936.0 | -0.026 |
| 1936.1 | -0.026 |
| 1936.2 | -0.026 |
| 1936.3 | -0.026 |
| 1936.4 | -0.026 |
| 1936.5 | -0.026 |
| 1936.6 | -0.026 |
| 1936.7 | -0.026 |
| 1936.8 | -0.026 |
| 1936.9 | -0.026 |
| 1937.0 | -0.026 |
| 1937.1 | -0.026 |
| 1937.2 | -0.026 |
| 1937.3 | -0.026 |
| 1937.4 | -0.026 |
| 1937.5 | -0.026 |
| 1937.6 | -0.026 |
| 1937.7 | -0.026 |
| 1937.8 | -0.026 |
| 1937.9 | -0.026 |
| 1938.0 | -0.026 |
| 1938.1 | -0.026 |
| 1938.2 | -0.026 |
| 1938.3 | -0.026 |
| 1938.4 | -0.026 |
| 1938.5 | -0.026 |
| 1938.6 | -0.026 |
| 1938.7 | -0.026 |
| 1938.8 | -0.026 |
| 1938.9 | -0.026 |
| 1939.0 | -0.026 |
| 1939.1 | -0.026 |
| 1939.2 | -0.026 |
| 1939.3 | -0.026 |
| 1939.4 | -0.026 |
| 1939.5 | -0.026 |
| 1939.6 | -0.026 |
| 1939.7 | -0.026 |
| 1939.8 | -0.026 |
| 1939.9 | -0.026 |
| 1940.0 | -0.026 |
| 1940.1 | -0.026 |
| 1940.2 | -0.026 |
| 1940.3 | -0.026 |
| 1940.4 | -0.026 |
| 1940.5 | -0.026 |
| 1940.6 | -0.026 |
| 1940.7 | -0.026 |
| 1940.8 | -0.026 |
| 1940.9 | -0.026 |
| 1941.0 | -0.026 |
| 1941.1 | -0.026 |
| 1941.2 | -0.026 |
| 1941.3 | -0.026 |
| 1941.4 | -0.026 |
| 1941.5 | -0.026 |
| 1941.6 | -0.026 |
| 1941.7 | -0.026 |
| 1941.8 | -0.026 |
| 1941.9 | -0.026 |
| 1942.0 | -0.026 |
| 1942.1 | -0.026 |
| 1942.2 | -0.026 |
| 1942.3 | -0.026 |
| 1942.4 | -0.026 |
| 1942.5 | -0.026 |
| 1942.6 | -0.026 |
| 1942.7 | -0.026 |
| 1942.8 | -0.026 |
| 1942.9 | -0.026 |
| 1943.0 | -0.026 |
| 1943.1 | -0.026 |
| 1943.2 | -0.026 |
| 1943.3 | -0.026 |
| 1943.4 | -0.026 |
| 1943.5 | -0.026 |
| 1943.6 | -0.026 |
| 1943.7 | -0.026 |
| 1943.8 | -0.026 |
| 1943.9 | -0.026 |
| 1944.0 | -0.026 |
| 1944.1 | -0.026 |
| 1944.2 | -0.026 |
| 1944.3 | -0.026 |
| 1944.4 | -0.026 |
| 1944.5 | -0.026 |
| 1944.6 | -0.026 |
| 1944.7 | -0.026 |
| 1944.8 | -0.026 |
| 1944.9 | -0.026 |
| 1945.0 | -0.026 |
| 1945.1 | -0.026 |
| 1945.2 | -0.026 |
| 1945.3 | -0.026 |
| 1945.4 | -0.026 |
| 1945.5 | -0.026 |
| 1945.6 | -0.026 |
| 1945.7 | -0.026 |
| 1945.8 | -0.026 |
| 1945.9 | -0.026 |
| 1946.0 | -0.026 |
| 1946.1 | -0.026 |
| 1946.2 | -0.026 |
| 1946.3 | -0.026 |
| 1946.4 | -0.026 |
| 1946.5 | -0.026 |
| 1946.6 | -0.026 |
| 1946.7 | -0.026 |
| 1946.8 | -0.026 |
| 1946.9 | -0.026 |
| 1947.0 | -0.026 |
| 1947.1 | -0.026 |
| 1947.2 | -0.026 |
| 1947.3 | -0.026 |
| 1947.4 | -0.026 |
| 1947.5 | -0.026 |
| 1947.6 | -0.026 |
| 1947.7 | -0.026 |
| 1947.8 | -0.026 |
| 1947.9 | -0.026 |
| 1948.0 | -0.026 |
| 1948.1 | -0.026 |
| 1948.2 | -0.026 |
| 1948.3 | -0.026 |
| 1948.4 | -0.026 |
| 1948.5 | -0.026 |
| 1948.6 | -0.026 |
| 1948.7 | -0.026 |
| 1948.8 | -0.026 |
| 1948.9 | -0.026 |
| 1949.0 | -0.026 |
| 1949.1 | -0.026 |
| 1949.2 | -0.026 |
| 1949.3 | -0.026 |
| 1949.4 | -0.026 |
| 1949.5 | -0.026 |
| 1949.6 | -0.026 |
| 1949.7 | -0.026 |
| 1949.8 | -0.026 |
| 1949.9 | -0.026 |
| 1950.0 | -0.026 |
| 1950.1 | -0.026 |
| 1950.2 | -0.026 |
| 1950.3 | -0.026 |
| 1950.4 | -0.026 |
| 1950.5 | -0.026 |
| 1950.6 | -0.026 |
| 1950.7 | -0.026 |
| 1950.8 | -0.026 |
| 1950.9 | -0.026 |
| 1951.0 | -0.026 |
| 1951.1 | -0.026 |
| 1951.2 | -0.026 |
| 1951.3 | -0.026 |
| 1951.4 | -0.026 |
| 1951.5 | -0.026 |
| 1951.6 | -0.026 |
| 1951.7 | -0.026 |
| 1951.8 | -0.026 |
| 1951.9 | -0.026 |
| 1952.0 | -0.026 |
| 1952.1 | -0.026 |
| 1952.2 | -0.026 |
| 1952.3 | -0.026 |
| 1952.4 | -0.026 |
| 1952.5 | -0.026 |
| 1952.6 | -0.026 |
| 1952.7 | -0.026 |
| 1952.8 | -0.026 |
| 1952.9 | -0.026 |
| 1953.0 | -0.026 |
| 1953.1 | -0.026 |
| 1953.2 | -0.026 |
| 1953.3 | -0.026 |
| 1953.4 | -0.026 |
| 1953.5 | -0.026 |
| 1953.6 | -0.026 |
| 1953.7 | -0.026 |
| 1953.8 | -0.026 |
| 1953.9 | -0.026 |
| 1954.0 | -0.026 |
| 1954.1 | -0.026 |
| 1954.2 | -0.026 |
| 1954.3 | -0.026 |
| 1954.4 | -0.026 |
| 1954.5 | -0.026 |
| 1954.6 | -0.026 |
| 1954.7 | -0.026 |
| 1954.8 | -0.026 |
| 1954.9 | -0.026 |
| 1955.0 | -0.026 |
| 1955.1 | -0.026 |
| 1955.2 | -0.026 |
| 1955.3 | -0.026 |
| 1955.4 | -0.026 |
| 1955.5 | -0.026 |
| 1955.6 | -0.026 |
| 1955.7 | -0.026 |
| 1955.8 | -0.026 |
| 1955.9 | -0.026 |
| 1956.0 | -0.026 |
| 1956.1 | -0.026 |
| 1956.2 | -0.026 |
| 1956.3 | -0.026 |
| 1956.4 | -0.026 |
| 1956.5 | -0.026 |
| 1956.6 | -0.026 |
| 1956.7 | -0.026 |
| 1956.8 | -0.026 |
| 1956.9 | -0.026 |
| 1957.0 | -0.026 |
| 1957.1 | -0.026 |
| 1957.2 | -0.026 |
| 1957.3 | -0.026 |
| 1957.4 | -0.026 |
| 1957.5 | -0.026 |
| 1957.6 | -0.026 |
| 1957.7 | -0.026 |
| 1957.8 | -0.026 |
| 1957.9 | -0.026 |
| 1958.0 | -0.026 |
| 1958.1 | -0.026 |
| 1958.2 | -0.026 |
| 1958.3 | -0.026 |
| 1958.4 | -0.026 |
| 1958.5 | -0.026 |
| 1958.6 | -0.026 |
| 1958.7 | -0.026 |
| 1958.8 | -0.026 |
| 1958.9 | -0.026 |
| 1959.0 | -0.026 |
| 1959.1 | -0.026 |
| 1959.2 | -0.026 |
| 1959.3 | -0.026 |
| 1959.4 | -0.026 |
| 1959.5 | -0.026 |
| 1959.6 | -0.026 |
| 1959.7 | -0.026 |
| 1959.8 | -0.026 |
| 1959.9 | -0.026 |
| 1960.0 | -0.026 |
| 1960.1 | -0.026 |
| 1960.2 | -0.026 |
| 1960.3 | -0.026 |
| 1960.4 | -0.026 |
| 1960.5 | -0.026 |
| 1960.6 | -0.026 |
| 1960.7 | -0.026 |
| 1960.8 | -0.026 |
| 1960.9 | -0.026 |
| 1961.0 | -0.026 |
| 1961.1 | -0.026 |
| 1961.2 | -0.026 |
| 1961.3 | -0.026 |
| 1961.4 | -0.026 |
| 1961.5 | -0.026 |
| 1961.6 | -0.026 |
| 1961.7 | -0.026 |
| 1961.8 | -0.026 |
| 1961.9 | -0.026 |
| 1962.0 | -0.026 |
| 1962.1 | -0.026 |
| 1962.2 | -0.026 |
| 1962.3 | -0.026 |
| 1962.4 | -0.026 |
| 1962.5 | -0.026 |
| 1962.6 | -0.026 |
| 1962.7 | -0.026 |
| 1962.8 | -0.026 |
| 1962.9 | -0.026 |
| 1963.0 | -0.026 |
| 1963.1 | -0.026 |
| 1963.2 | -0.026 |
| 1963.3 | -0.026 |
| 1963.4 | -0.026 |
| 1963.5 | -0.026 |
| 1963.6 | -0.026 |
| 1963.7 | -0.026 |
| 1963.8 | -0.026 |
| 1963.9 | -0.026 |
| 1964.0 | -0.026 |
| 1964.1 | -0.026 |
| 1964.2 | -0.026 |
| 1964.3 | -0.026 |
| 1964.4 | -0.026 |
| 1964.5 | -0.026 |
| 1964.6 | -0.026 |
| 1964.7 | -0.026 |
| 1964.8 | -0.026 |
| 1964.9 | -0.026 |
| 1965.0 | -0.026 |
| 1965.1 | -0.026 |
| 1965.2 | -0.026 |
| 1965.3 | -0.026 |
| 1965.4 | -0.026 |
| 1965.5 | -0.026 |
| 1965.6 | -0.026 |
| 1965.7 | -0.026 |
| 1965.8 | -0.026 |
| 1965.9 | -0.026 |
| 1966.0 | -0.026 |
| 1966.1 | -0.026 |
| 1966.2 | -0.026 |
| 1966.3 | -0.026 |
| 1966.4 | -0.026 |
| 1966.5 | -0.026 |
| 1966.6 | -0.026 |
| 1966.7 | -0.026 |
| 1966.8 | -0.026 |
| 1966.9 | -0.026 |
| 1967.0 | -0.026 |
| 1967.1 | -0.026 |
| 1967.2 | -0.026 |
| 1967.3 | -0.026 |
| 1967.4 | -0.026 |
| 1967.5 | -0.026 |
| 1967.6 | -0.026 |
| 1967.7 | -0.026 |
| 1967.8 | -0.026 |
| 1967.9 | -0.026 |
| 1968.0 | -0.026 |
| 1968.1 | -0.026 |
| 1968.2 | -0.026 |
| 1968.3 | -0.026 |
| 1968.4 | -0.026 |
| 1968.5 | -0.026 |
| 1968.6 | -0.026 |
| 1968.7 | -0.026 |
| 1968.8 | -0.026 |
| 1968.9 | -0.026 |
| 1969.0 | -0.026 |
| 1969.1 | -0.026 |
| 1969.2 | -0.026 |
| 1969.3 | -0.026 |
| 1969.4 | -0.026 |
| 1969.5 | -0.026 |
| 1969.6 | -0.026 |
| 1969.7 | -0.026 |
| 1969.8 | -0.026 |
| 1969.9 | -0.026 |
| 1970.0 | -0.026 |
| 1970.1 | -0.026 |
| 1970.2 | -0.026 |
| 1970.3 | -0.026 |
| 1970.4 | -0.026 |
| 1970.5 | -0.026 |
| 1970.6 | -0.026 |
| 1970.7 | -0.026 |
| 1970.8 | -0.026 |
| 1970.9 | -0.026 |
| 1971.0 | -0.026 |
| 1971.1 | -0.026 |
| 1971.2 | -0.026 |
| 1971.3 | -0.026 |
| 1971.4 | -0.026 |
| 1971.5 | -0.026 |
| 1971.6 | -0.026 |
| 1971.7 | -0.026 |
| 1971.8 | -0.026 |
| 1971.9 | -0.026 |
| 1972.0 | -0.026 |
| 1972.1 | -0.026 |
| 1972.2 | -0.026 |
| 1972.3 | -0.026 |
| 1972.4 | -0.026 |
| 1972.5 | -0.026 |
| 1972.6 | -0.026 |
| 1972.7 | -0.026 |
| 1972.8 | -0.026 |
| 1972.9 | -0.026 |
| 1973.0 | -0.026 |
| 1973.1 | -0.026 |
| 1973.2 | -0.026 |
| 1973.3 | -0.026 |
| 1973.4 | -0.026 |
| 1973.5 | -0.026 |
| 1973.6 | -0.026 |
| 1973.7 | -0.026 |
| 1973.8 | -0.026 |
| 1973.9 | -0.026 |
| 1974.0 | -0.026 |
| 1974.1 | -0.026 |
| 1974.2 | -0.026 |
| 1974.3 | -0.026 |
| 1974.4 | -0.026 |
| 1974.5 | -0.026 |
| 1974.6 | -0.026 |
| 1974.7 | -0.026 |
| 1974.8 | -0.026 |
| 1974.9 | -0.026 |
| 1975.0 | -0.026 |
| 1975.1 | -0.026 |
| 1975.2 | -0.026 |
| 1975.3 | -0.026 |
| 1975.4 | -0.026 |
| 1975.5 | -0.026 |
| 1975.6 | -0.026 |
| 1975.7 | -0.026 |
| 1975.8 | -0.026 |
| 1975.9 | -0.026 |
| 1976.0 | -0.026 |
| 1976.1 | -0.026 |
| 1976.2 | -0.026 |
| 1976.3 | -0.026 |
| 1976.4 | -0.026 |
| 1976.5 | -0.026 |
| 1976.6 | -0.026 |
| 1976.7 | -0.026 |
| 1976.8 | -0.026 |
| 1976.9 | -0.026 |
| 1977.0 | -0.026 |
| 1977.1 | -0.026 |
| 1977.2 | -0.026 |
| 1977.3 | -0.026 |
| 1977.4 | -0.026 |
| 1977.5 | -0.026 |
| 1977.6 | -0.026 |
| 1977.7 | -0.026 |
| 1977.8 | -0.026 |
| 1977.9 | -0.026 |
| 1978.0 | -0.026 |
| 1978.1 | -0.026 |
| 1978.2 | -0.026 |
| 1978.3 | -0.026 |
| 1978.4 | -0.026 |
| 1978.5 | -0.026 |
| 1978.6 | -0.026 |
| 1978.7 | -0.026 |
| 1978.8 | -0.026 |
| 1978.9 | -0.026 |
| 1979.0 | -0.026 |
| 1979.1 | -0.026 |
| 1979.2 | -0.026 |
| 1979.3 | -0.026 |
| 1979.4 | -0.026 |
| 1979.5 | -0.026 |
| 1979.6 | -0.026 |
| 1979.7 | -0.026 |
| 1979.8 | -0.026 |
| 1979.9 | -0.026 |
| 1980.0 | -0.026 |
| 1980.1 | -0.026 |
| 1980.2 | -0.026 |
| 1980.3 | -0.026 |
| 1980.4 | -0.026 |
| 1980.5 | -0.026 |
| 1980.6 | -0.026 |
| 1980.7 | -0.026 |
| 1980.8 | -0.026 |
| 1980.9 | -0.026 |
| 1981.0 | -0.026 |
| 1981.1 | -0.026 |
| 1981.2 | -0.026 |
| 1981.3 | -0.026 |
| 1981.4 | -0.026 |
| 1981.5 | -0.026 |
| 1981.6 | -0.026 |
| 1981.7 | -0.026 |
| 1981.8 | -0.026 |
| 1981.9 | -0.026 |
| 1982.0 | -0.026 |
| 1982.1 | -0.026 |
| 1982.2 | -0.026 |
| 1982.3 | -0.026 |
| 1982.4 | -0.026 |
| 1982.5 | -0.026 |
| 1982.6 | -0.026 |
| 1982.7 | -0.026 |
| 1982.8 | -0.026 |
| 1982.9 | -0.026 |
| 1983.0 | -0.026 |
| 1983.1 | -0.026 |
| 1983.2 | -0.026 |
| 1983.3 | -0.026 |
| 1983.4 | -0.026 |
| 1983.5 | -0.026 |
| 1983.6 | -0.026 |
| 1983.7 | -0.026 |
| 1983.8 | -0.026 |
| 1983.9 | -0.026 |
| 1984.0 | -0.026 |
| 1984.1 | -0.026 |
| 1984.2 | -0.026 |
| 1984.3 | -0.026 |
| 1984.4 | -0.026 |
| 1984.5 | -0.026 |
| 1984.6 | -0.026 |
| 1984.7 | -0.026 |
| 1984.8 | -0.026 |
| 1984.9 | -0.026 |
| 1985.0 | -0.026 |
| 1985.1 | -0.026 |
| 1985.2 | -0.026 |
| 1985.3 | -0.026 |
| 1985.4 | -0.026 |
| 1985.5 | -0.026 |
| 1985.6 | -0.026 |
| 1985.7 | -0.026 |
| 1985.8 | -0.026 |
| 1985.9 | -0.026 |
| 1986.0 | -0.026 |
| 1986.1 | -0.026 |
| 1986.2 | -0.026 |
| 1986.3 | -0.026 |
| 1986.4 | -0.026 |
| 1986.5 | -0.026 |
| 1986.6 | -0.026 |
| 1986.7 | -0.026 |
| 1986.8 | -0.026 |
| 1986.9 | -0.026 |
| 1987.0 | -0.026 |
| 1987.1 | -0.026 |
| 1987.2 | -0.026 |
| 1987.3 | -0.026 |
| 1987.4 | -0.026 |
| 1987.5 | -0.026 |
| 1987.6 | -0.026 |
| 1987.7 | -0.026 |
| 1987.8 | -0.026 |
| 1987.9 | -0.026 |
| 1988.0 | -0.026 |
| 1988.1 | -0.026 |
| 1988.2 | -0.026 |
| 1988.3 | -0.026 |
| 1988.4 | -0.026 |
| 1988.5 | -0.026 |
| 1988.6 | -0.026 |
| 1988.7 | -0.026 |
| 1988.8 | -0.026 |
| 1988.9 | -0.026 |
| 1989.0 | -0.026 |
| 1989.1 | -0.026 |
| 1989.2 | -0.026 |
| 1989.3 | -0.026 |
| 1989.4 | -0.026 |
| 1989.5 | -0.026 |
| 1989.6 | -0.026 |
| 1989.7 | -0.026 |
| 1989.8 | -0.026 |
| 1989.9 | -0.026 |
| 1990.0 | -0.026 |
| 1990.1 | -0.026 |
| 1990.2 | -0.026 |
| 1990.3 | -0.026 |
| 1990.4 | -0.026 |
| 1990.5 | -0.026 |
| 1990.6 | -0.026 |
| 1990.7 | -0.026 |
| 1990.8 | -0.026 |
| 1990.9 | -0.026 |
| 1991.0 | -0.026 |
| 1991.1 | -0.026 |
| 1991.2 | -0.026 |
| 1991.3 | -0.026 |
| 1991.4 | -0.026 |
| 1991.5 | -0.026 |
| 1991.6 | -0.026 |
| 1991.7 | -0.026 |
| 1991.8 | -0.026 |
| 1991.9 | -0.026 |
| 1992.0 | -0.026 |
| 1992.1 | -0.026 |
| 1992.2 | -0.026 |
| 1992.3 | -0.026 |
| 1992.4 | -0.026 |
| 1992.5 | -0.026 |
| 1992.6 | -0.026 |
| 1992.7 | -0.026 |
| 1992.8 | -0.026 |
| 1992.9 | -0.026 |
| 1993.0 | -0.026 |
| 1993.1 | -0.026 |
| 1993.2 | -0.026 |
| 1993.3 | -0.026 |
| 1993.4 | -0.026 |
| 1993.5 | -0.026 |
| 1993.6 | -0.026 |
| 1993.7 | -0.026 |
| 1993.8 | -0.026 |
| 1993.9 | -0.026 |
| 1994.0 | -0.026 |
| 1994.1 | -0.026 |
| 1994.2 | -0.026 |
| 1994.3 | -0.026 |
| 1994.4 | -0.026 |
| 1994.5 | -0.026 |
| 1994.6 | -0.026 |
| 1994.7 | -0.026 |
| 1994.8 | -0.026 |
| 1994.9 | -0.026 |
| 1995.0 | -0.026 |
| 1995.1 | -0.026 |
| 1995.2 | -0.026 |
| 1995.3 | -0.026 |
| 1995.4 | -0.026 |
| 1995.5 | -0.026 |
| 1995.6 | -0.026 |
| 1995.7 | -0.026 |
| 1995.8 | -0.026 |
| 1995.9 | -0.026 |
| 1996.0 | -0.026 |
| 1996.1 | -0.026 |
| 1996.2 | -0.026 |
| 1996.3 | -0.026 |
| 1996.4 | -0.026 |
| 1996.5 | -0.026 |
| 1996.6 | -0.026 |
| 1996.7 | -0.026 |
| 1996.8 | -0.026 |
| 1996.9 | -0.026 |
| 1997.0 | -0.026 |
| 1997.1 | -0.026 |
| 1997.2 | -0.026 |
| 1997.3 | -0.026 |
| 1997.4 | -0.026 |
| 1997.5 | -0.026 |
| 1997.6 | -0.026 |
| 1997.7 | -0.026 |
| 1997.8 | -0.026 |
| 1997.9 | -0.026 |
| 1998.0 | -0.026 |
| 1998.1 | -0.026 |
| 1998.2 | -0.026 |
| 1998.3 | -0.026 |
| 1998.4 | -0.026 |
| 1998.5 | -0.026 |
| 1998.6 | -0.026 |
| 1998.7 | -0.026 |
| 1998.8 | -0.026 |
| 1998.9 | -0.026 |
| 1999.0 | -0.026 |
| 1999.1 | -0.026 |
| 1999.2 | -0.026 |
| 1999.3 | -0.026 |
| 1999.4 | -0.026 |
| 1999.5 | -0.026 |
| 1999.6 | -0.026 |
| 1999.7 | -0.026 |
| 1999.8 | -0.026 |
| 1999.9 | -0.026 |
| 2000.0 | -0.026 |
| 2000.1 | -0.026 |
| 2000.2 | -0.026 |
| 2000.3 | -0.026 |
| 2000.4 | -0.026 |
| 2000.5 | -0.026 |
| 2000.6 | -0.026 |
| 2000.7 | -0.026 |
| 2000.8 | -0.026 |
| 2000.9 | -0.026 |
| 2001.0 | -0.026 |
| 2001.1 | -0.026 |
| 2001.2 | -0.026 |
| 2001.3 | -0.026 |
| 2001.4 | -0.026 |
| 2001.5 | -0.026 |
| 2001.6 | -0.026 |
| 2001.7 | -0.026 |
| 2001.8 | -0.026 |
| 2001.9 | -0.026 |
| 2002.0 | -0.026 |
| 2002.1 | -0.026 |
| 2002.2 | -0.026 |
| 2002.3 | -0.026 |
| 2002.4 | -0.026 |
| 2002.5 | -0.026 |
| 2002.6 | -0.026 |
| 2002.7 | -0.026 |
| 2002.8 | -0.026 |
| 2002.9 | -0.026 |
| 2003.0 | -0.026 |
| 2003.1 | -0.026 |
| 2003.2 | -0.026 |
| 2003.3 | -0.026 |
| 2003.4 | -0.026 |
| 2003.5 | -0.026 |
| 2003.6 | -0.026 |
| 2003.7 | -0.026 |
| 2003.8 | -0.026 |
| 2003.9 | -0.026 |
| 2004.0 | -0.026 |
| 2004.1 | -0.026 |
| 2004.2 | -0.026 |
| 2004.3 | -0.026 |
| 2004.4 | -0.026 |
| 2004.5 | -0.026 |
| 2004.6 | -0.026 |
| 2004.7 | -0.026 |
| 2004.8 | -0.026 |
| 2004.9 | -0.026 |
| 2005.0 | -0.026 |
| 2005.1 | -0.026 |
| 2005.2 | -0.026 |
| 2005.3 | -0.026 |
| 2005.4 | -0.026 |
| 2005.5 | -0.026 |
| 2005.6 | -0.026 |
| 2005.7 | -0.026 |
| 2005.8 | -0.026 |
| 2005.9 | -0.026 |
| 2006.0 | -0.026 |
| 2006.1 | -0.026 |
| 2006.2 | -0.026 |
| 2006.3 | -0.026 |
| 2006.4 | -0.026 |
| 2006.5 | -0.026 |
| 2006.6 | -0.026 |
| 2006.7 | -0.026 |
| 2006.8 | -0.026 |
| 2006.9 | -0.026 |
| 2007.0 | -0.026 |
| 2007.1 | -0.026 |
| 2007.2 | -0.026 |
| 2007.3 | -0.026 |
| 2007.4 | -0.026 |
| 2007.5 | -0.026 |
| 2007.6 | -0.026 |
| 2007.7 | -0.026 |
| 2007.8 | -0.026 |
| 2007.9 | -0.026 |
| 2008.0 | -0.026 |
| 2008.1 | -0.026 |
| 2008.2 | -0.026 |
| 2008.3 | -0.026 |
| 2008.4 | -0.026 |
| 2008.5 | -0.026 |
| 2008.6 | -0.026 |
| 2008.7 | -0.026 |
| 2008.8 | -0.026 |
| 2008.9 | -0.026 |
| 2009.0 | -0.026 |
| 2009.1 | -0.026 |
| 2009.2 | -0.026 |
| 2009.3 | -0.026 |
| 2009.4 | -0.026 |
| 2009.5 | -0.026 |
| 2009.6 | -0.026 |
| 2009.7 | -0.026 |
| 2009.8 | -0.026 |
| 2009.9 | -0.026 |
| 2010.0 | -0.026 |
| 2010.1 | -0.026 |
| 2010.2 | -0.026 |
| 2010.3 | -0.026 |
| 2010.4 | -0.026 |
| 2010.5 | -0.026 |
| 2010.6 | -0.026 |
| 2010.7 | -0.026 |
| 2010.8 | -0.026 |
| 2010.9 | -0.026 |
| 2011.0 | -0.026 |
| 2011.1 | -0.026 |
| 2011.2 | -0.026 |
| 2011.3 | -0.026 |
| 2011.4 | -0.026 |
| 2011.5 | -0.026 |
| 2011.6 | -0.026 |
| 2011.7 | -0.026 |
| 2011.8 | -0.026 |
| 2011.9 | -0.026 |
| 2012.0 | -0.026 |
| 2012.1 | -0.026 |
| 2012.2 | -0.026 |
| 2012.3 | -0.026 |
| 2012.4 | -0.026 |
| 2012.5 | -0.026 |
| 2012.6 | -0.026 |
| 2012.7 | -0.026 |
| 2012.8 | -0.026 |
| 2012.9 | -0.026 |
| 2013.0 | -0.026 |
| 2013.1 | -0.026 |
| 2013.2 | -0.026 |
| 2013.3 | -0.026 |
| 2013.4 | -0.026 |
| 2013.5 | -0.026 |
| 2013.6 | -0.026 |
| 2013.7 | -0.026 |
| 2013.8 | -0.026 |
| 2013.9 | -0.026 |
| 2014.0 | -0.026 |
| 2014.1 | -0.026 |
| 2014.2 | -0.026 |
| 2014.3 | -0.026 |
| 2014.4 | -0.026 |
| 2014.5 | -0.026 |
| 2014.6 | -0.026 |
| 2014.7 | -0.026 |
| 2014.8 | -0.026 |
| 2014.9 | -0.026 |
| 2015.0 | -0.026 |
| 2015.1 | -0.026 |
| 2015.2 | -0.026 |
| 2015.3 | -0.026 |
| 2015.4 | -0.026 |
| 2015.5 | -0.026 |
| 2015.6 | -0.026 |
| 2015.7 | -0.026 |
| 2015.8 | -0.026 |
| 2015.9 | -0.026 |
| 2016.0 | -0.026 |
| 2016.1 | -0.026 |
| 2016.2 | -0.026 |
| 2016.3 | -0.026 |
| 2016.4 | -0.026 |
| 2016.5 | -0.026 |
| 2016.6 | -0.026 |
| 2016.7 | -0.026 |
| 2016.8 | -0.026 |
| 2016.9 | -0.026 |
| 2017.0 | -0.026 |
| 2017.1 | -0.026 |
| 2017.2 | -0.026 |
| 2017.3 | -0.026 |
| 2017.4 | -0.026 |
| 2017.5 | -0.026 |
| 2017.6 | -0.026 |
| 2017.7 | -0.026 |
| 2017.8 | -0.026 |
| 2017.9 | -0.026 |
| 2018.0 | -0.026 |
| 2018.1 | -0.026 |
| 2018.2 | -0.026 |
| 2018.3 | -0.026 |
| 2018.4 | -0.026 |
| 2018.5 | -0.026 |
| 2018.6 | -0.026 |
| 2018.7 | -0.026 |
| 2018.8 | -0.026 |
| 2018.9 | -0.026 |
| 2019.0 | -0.026 |
| 2019.1 | -0.026 |
| 2019.2 | -0.026 |
| 2019.3 | -0.026 |
| 2019.4 | -0.026 |
| 2019.5 | -0.026 |
| 2019.6 | -0.026 |
| 2019.7 | -0.026 |
| 2019.8 | -0.026 |
| 2019.9 | -0.026 |
| 2020.0 | -0.026 |
| 2020.1 | -0.026 |
| 2020.2 | -0.026 |
| 2020.3 | -0.026 |
| 2020.4 | -0.026 |
| 2020.5 | -0.026 |
| 2020.6 | -0.026 |
| 2020.7 | -0.026 |
| 2020.8 | -0.026 |
| 2020.9 | -0.026 |
| 2021.0 | -0.026 |
| 2021.1 | -0.026 |
| 2021.2 | -0.026 |
| 2021.3 | -0.026 |
| 2021.4 | -0.026 |
| 2021.5 | -0.026 |
| 2021.6 | -0.026 |
| 2021.7 | -0.026 |
| 2021.8 | -0.026 |
| 2021.9 | -0.026 |
| 2022.0 | -0.026 |
| 2022.1 | -0.026 |
| 2022.2 | -0.026 |
| 2022.3 | -0.026 |
| 2022.4 | -0.026 |
| 2022.5 | -0.026 |
| 2022.6 | -0.026 |
| 2022.7 | -0.026 |
| 2022.8 | -0.026 |
| 2022.9 | -0.026 |
| 2023.0 | -0.026 |
| 2023.1 | -0.026 |
| 2023.2 | -0.026 |
| 2023.3 | -0.026 |
| 2023.4 | -0.026 |
| 2023.5 | -0.026 |
| 2023.6 | -0.026 |
| 2023.7 | -0.026 |
| 2023.8 | -0.026 |
| 2023.9 | -0.026 |
| 2024.0 | -0.026 |
| 2024.1 | -0.026 |
| 2024.2 | -0.026 |
| 2024.3 | -0.026 |
| 2024.4 | -0.026 |
| 2024.5 | -0.026 |
| 2024.6 | -0.026 |
| 2024.7 | -0.026 |
| 2024.8 | -0.026 |
| 2024.9 | -0.026 |
| 2025.0 | -0.026 |
| 2025.1 | -0.026 |
| 2025.2 | -0.026 |
| 2025.3 | -0.026 |
| 2025.4 | -0.026 |
| 2025.5 | -0.026 |
| 2025.6 | -0.026 |
| 2025.7 | -0.026 |
| 2025.8 | -0.026 |
| 2025.9 | -0.026 |
| 2026.0 | -0.026 |
| 2026.1 | -0.026 |
| 2026.2 | -0.026 |
| 2026.3 | -0.026 |
| 2026.4 | -0.026 |
| 2026.5 | -0.026 |
| 2026.6 | -0.026 |
| 2026.7 | -0.026 |
| 2026.8 | -0.026 |
| 2026.9 | -0.026 |
| 2027.0 | -0.026 |
| 2027.1 | -0.026 |
| 2027.2 | -0.026 |
| 2027.3 | -0.026 |
| 2027.4 | -0.026 |
| 2027.5 | -0.026 |
| 2027.6 | -0.026 |
| 2027.7 | -0.026 |
| 2027.8 | -0.026 |
| 2027.9 | -0.026 |
| 2028.0 | -0.026 |
| 2028.1 | -0.026 |
| 2028.2 | -0.026 |
| 2028.3 | -0.026 |
| 2028.4 | -0.026 |
| 2028.5 | -0.026 |
| 2028.6 | -0.026 |
| 2028.7 | -0.026 |
| 2028.8 | -0.026 |
| 2028.9 | -0.026 |
| 2029.0 | -0.026 |
| 2029.1 | -0.026 |
| 2029.2 | -0.026 |
| 2029.3 | -0.026 |
| 2029.4 | -0.026 |
| 2029.5 | -0.026 |
| 2029.6 | -0.026 |
| 2029.7 | -0.026 |
| 2029.8 | -0.026 |
| 2029.9 | -0.026 |
| 2030.0 | -0.026 |
| 2030.1 | -0.026 |
| 2030.2 | -0.026 |
| 2030.3 | -0.026 |
| 2030.4 | -0.026 |
| 2030.5 | -0.026 |
| 2030.6 | -0.026 |
| 2030.7 | -0.026 |
| 2030.8 | -0.026 |
| 2030.9 | -0.026 |
| 2031.0 | -0.026 |
| 2031.1 | -0.026 |
| 2031.2 | -0.026 |
| 2031.3 | -0.026 |
| 2031.4 | -0.026 |
| 2031.5 | -0.026 |
| 2031.6 | -0.026 |
| 2031.7 | -0.026 |
| 2031.8 | -0.026 |
| 2031.9 | -0.026 |
| 2032.0 | -0.026 |
| 2032.1 | -0.026 |
| 2032.2 | -0.026 |
| 2032.3 | -0.026 |
| 2032.4 | -0.026 |
| 2032.5 | -0.026 |
| 2032.6 | -0.026 |
| 2032.7 | -0.026 |
| 2032.8 | -0.026 |
| 2032.9 | -0.026 |
| 2033.0 | -0.026 |
| 2033.1 | -0.026 |
| 2033.2 | -0.026 |
| 2033.3 | -0.026 |
| 2033.4 | -0.026 |
| 2033.5 | -0.026 |
| 2033.6 | -0.026 |
| 2033.7 | -0.026 |
| 2033.8 | -0.026 |
| 2033.9 | -0.026 |
| 2034.0 | -0.026 |
| 2034.1 | -0.026 |
| 2034.2 | -0.026 |
| 2034.3 | -0.026 |
| 2034.4 | -0.026 |
| 2034.5 | -0.026 |
| 2034.6 | -0.026 |
| 2034.7 | -0.026 |
| 2034.8 | -0.026 |
| 2034.9 | -0.026 |
| 2035.0 | -0.026 |
| 2035.1 | -0.026 |
| 2035.2 | -0.026 |
| 2035.3 | -0.026 |
| 2035.4 | -0.026 |
| 2035.5 | -0.026 |
| 2035.6 | -0.026 |
| 2035.7 | -0.026 |
| 2035.8 | -0.026 |
| 2035.9 | -0.026 |
| 2036.0 | -0.026 |
| 2036.1 | -0.026 |
| 2036.2 | -0.026 |
| 2036.3 | -0.026 |
| 2036.4 | -0.026 |
| 2036.5 | -0.026 |
| 2036.6 | -0.026 |
| 2036.7 | -0.026 |
| 2036.8 | -0.026 |
| 2036.9 | -0.026 |
| 2037.0 | -0.026 |
| 2037.1 | -0.026 |
| 2037.2 | -0.026 |
| 2037.3 | -0.026 |
| 2037.4 | -0.026 |
| 2037.5 | -0.026 |
| 2037.6 | -0.026 |
| 2037.7 | -0.026 |
| 2037.8 | -0.026 |
| 2037.9 | -0.026 |
| 2038.0 | -0.026 |
| 2038.1 | -0.026 |
| 2038.2 | -0.026 |
| 2038.3 | -0.026 |
| 2038.4 | -0.026 |
| 2038.5 | -0.026 |
| 2038.6 | -0.026 |
| 2038.7 | -0.026 |
| 2038.8 | -0.026 |
| 2038.9 | -0.026 |
| 2039.0 | -0.026 |
| 2039.1 | -0.026 |
| 2039.2 | -0.026 |
| 2039.3 | -0.026 |
| 2039.4 | -0.026 |
| 2039.5 | -0.026 |
| 2039.6 | -0.026 |
| 2039.7 | -0.026 |
| 2039.8 | -0.026 |
| 2039.9 | -0.026 |
| 2040.0 | -0.026 |
| 2040.1 | -0.026 |
| 2040.2 | -0.026 |
| 2040.3 | -0.026 |
| 2040.4 | -0.026 |
| 2040.5 | -0.026 |
| 2040.6 | -0.026 |
| 2040.7 | -0.026 |
| 2040.8 | -0.026 |
| 2040.9 | -0.026 |
| 2041.0 | -0.026 |
| 2041.1 | -0.026 |
| 2041.2 | -0.026 |
| 2041.3 | -0.026 |
| 2041.4 | -0.026 |
| 2041.5 | -0.026 |
| 2041.6 | -0.026 |
| 2041.7 | -0.026 |
| 2041.8 | -0.026 |
| 2041.9 | -0.026 |
| 2042.0 | -0.026 |
| 2042.1 | -0.026 |
| 2042.2 | -0.026 |
| 2042.3 | -0.026 |
| 2042.4 | -0.026 |
| 2042.5 | -0.026 |
| 2042.6 | -0.026 |
| 2042.7 | -0.026 |
| 2042.8 | -0.026 |
| 2042.9 | -0.026 |
| 2043.0 | -0.026 |
| 2043.1 | -0.026 |
| 2043.2 | -0.026 |
| 2043.3 | -0.026 |
| 2043.4 | -0.026 |
| 2043.5 | -0.026 |
| 2043.6 | -0.026 |
| 2043.7 | -0.026 |
| 2043.8 | -0.026 |
| 2043.9 | -0.026 |
| 2044.0 | -0.026 |
| 2044.1 | -0.026 |
| 2044.2 | -0.026 |
| 2044.3 | -0.026 |
| 2044.4 | -0.026 |
| 2044.5 | -0.026 |
| 2044.6 | -0.026 |
| 2044.7 | -0.026 |
| 2044.8 | -0.026 |
| 2044.9 | -0.026 |
| 2045.0 | -0.026 |
| 2045.1 | -0.026 |
| 2045.2 | -0.026 |
| 2045.3 | -0.026 |
| 2045.4 | -0.026 |
| 2045.5 | -0.026 |
| 2045.6 | -0.026 |
| 2045.7 | -0.026 |
| 2045.8 | -0.026 |
| 2045.9 | -0.026 |
| 2046.0 | -0.026 |
| 2046.1 | -0.026 |
| 2046.2 | -0.026 |
| 2046.3 | -0.026 |
| 2046.4 | -0.026 |
| 2046.5 | -0.026 |
| 2046.6 | -0.026 |
| 2046.7 | -0.026 |
| 2046.8 | -0.026 |
| 2046.9 | -0.026 |
| 2047.0 | -0.026 |
| 2047.1 | -0.026 |
| 2047.2 | -0.026 |
| 2047.3 | -0.026 |
| 2047.4 | -0.026 |
| 2047.5 | -0.026 |
| 2047.6 | -0.026 |
| 2047.7 | -0.026 |
| 2047.8 | -0.026 |
| 2047.9 | -0.026 |
| 2048.0 | -0.026 |
| 2048.1 | -0.026 |
| 2048.2 | -0.026 |
| 2048.3 | -0.026 |
| 2048.4 | -0.026 |
| 2048.5 | -0.026 |
| 2048.6 | -0.026 |
| 2048.7 | -0.026 |
| 2048.8 | -0.026 |
| 2048.9 | -0.026 |
| 2049.0 | -0.026 |
| 2049.1 | -0.026 |
| 2049.2 | -0.026 |
| 2049.3 | -0.026 |
| 2049.4 | -0.026 |
| 2049.5 | -0.026 |
| 2049.6 | -0.026 |
| 2049.7 | -0.026 |
| 2049.8 | -0.026 |
| 2049.9 | -0.026 |
| 2050.0 | -0.026 |
| 2050.1 | -0.026 |
| 2050.2 | -0.026 |
| 2050.3 | -0.026 |
| 2050.4 | -0.026 |
| 2050.5 | -0.026 |
| 2050.6 | -0.026 |
| 2050.7 | -0.026 |
| 2050.8 | -0.026 |
| 2050.9 | -0.026 |
| 2051.0 | -0.026 |
| 2051.1 | -0.026 |
| 2051.2 | -0.026 |
| 2051.3 | -0.026 |
| 2051.4 | -0.026 |
| 2051.5 | -0.026 |
| 2051.6 | -0.026 |
| 2051.7 | -0.026 |
| 2051.8 | -0.026 |
| 2051.9 | -0.026 |
| 2052.0 | -0.026 |
| 2052.1 | -0.026 |
| 2052.2 | -0.026 |
| 2052.3 | -0.026 |
| 2052.4 | -0.026 |
| 2052.5 | -0.026 |
| 2052.6 | -0.026 |
| 2052.7 | -0.026 |
| 2052.8 | -0.026 |
| 2052.9 | -0.026 |
| 2053.0 | -0.026 |
| 2053.1 | -0.026 |
| 2053.2 | -0.026 |
| 2053.3 | -0.026 |
| 2053.4 | -0.026 |
| 2053.5 | -0.026 |
| 2053.6 | -0.026 |
| 2053.7 | -0.026 |
| 2053.8 | -0.026 |
| 2053.9 | -0.026 |
| 2054.0 | -0.026 |
| 2054.1 | -0.026 |
| 2054.2 | -0.026 |
| 2054.3 | -0.026 |
| 2054.4 | -0.026 |
| 2054.5 | -0.026 |
| 2054.6 | -0.026 |
| 2054.7 | -0.026 |
| 2054.8 | -0.026 |
| 2054.9 | -0.026 |
| 2055.0 | -0.026 |
| 2055.1 | -0.026 |
| 2055.2 | -0.026 |
| 2055.3 | -0.026 |
| 2055.4 | -0.026 |
| 2055.5 | -0.026 |
| 2055.6 | -0.026 |
| 2055.7 | -0.026 |
| 2055.8 | -0.026 |
| 2055.9 | -0.026 |
| 2056.0 | -0.026 |
| 2056.1 | -0.026 |
| 2056.2 | -0.026 |
| 2056.3 | -0.026 |
| 2056.4 | -0.026 |
| 2056.5 | -0.026 |
| 2056.6 | -0.026 |
| 2056.7 | -0.026 |
| 2056.8 | -0.026 |
| 2056.9 | -0.026 |
| 2057.0 | -0.026 |
| 2057.1 | -0.026 |
| 2057.2 | -0.026 |
| 2057.3 | -0.026 |
| 2057.4 | -0.026 |
| 2057.5 | -0.026 |
| 2057.6 | -0.026 |
| 2057.7 | -0.026 |
| 2057.8 | -0.026 |
| 2057.9 | -0.026 |
| 2058.0 | -0.026 |
| 2058.1 | -0.026 |
| 2058.2 | -0.026 |
| 2058.3 | -0.026 |
| 2058.4 | -0.026 |
| 2058.5 | -0.026 |
| 2058.6 | -0.026 |
| 2058.7 | -0.026 |
| 2058.8 | -0.026 |
| 2058.9 | -0.026 |
| 2059.0 | -0.026 |
| 2059.1 | -0.026 |
| 2059.2 | -0.026 |
| 2059.3 | -0.026 |
| 2059.4 | -0.026 |
| 2059.5 | -0.026 |
| 2059.6 | -0.026 |
| 2059.7 | -0.026 |
| 2059.8 | -0.026 |
| 2059.9 | -0.026 |
| 2060.0 | -0.026 |
| 2060.1 | -0.026 |
| 2060.2 | -0.026 |
| 2060.3 | -0.026 |
| 2060.4 | -0.026 |
| 2060.5 | -0.026 |
| 2060.6 | -0.026 |
| 2060.7 | -0.026 |
| 2060.8 | -0.026 |
| 2060.9 | -0.026 |
| 2061.0 | -0.026 |
| 2061.1 | -0.026 |
| 2061.2 | -0.026 |
| 2061.3 | -0.026 |
| 2061.4 | -0.026 |
| 2061.5 | -0.026 |
| 2061.6 | -0.026 |
| 2061.7 | -0.026 |
| 2061.8 | -0.026 |
| 2061.9 | -0.026 |
| 2062.0 | -0.026 |
| 2062.1 | -0.026 |
| 2062.2 | -0.026 |
| 2062.3 | -0.026 |
| 2062.4 | -0.026 |
| 2062.5 | -0.026 |
| 2062.6 | -0.026 |
| 2062.7 | -0.026 |
| 2062.8 | -0.026 |
| 2062.9 | -0.026 |
| 2063.0 | -0.026 |
| 2063.1 | -0.026 |
| 2063.2 | -0.026 |
| 2063.3 | -0.026 |
| 2063.4 | -0.026 |
| 2063.5 | -0.026 |
| 2063.6 | -0.026 |
| 2063.7 | -0.026 |
| 2063.8 | -0.026 |
| 2063.9 | -0.026 |
| 2064.0 | -0.026 |
| 2064.1 | -0.026 |
| 2064.2 | -0.026 |
| 2064.3 | -0.026 |
| 2064.4 | -0.026 |
| 2064.5 | -0.026 |
| 2064.6 | -0.026 |
| 2064.7 | -0.026 |
| 2064.8 | -0.026 |
| 2064.9 | -0.026 |
| 2065.0 | -0.026 |
| 2065.1 | -0.026 |
| 2065.2 | -0.026 |
| 2065.3 | -0.026 |
| 2065.4 | -0.026 |
| 2065.5 | -0.026 |
| 2065.6 | -0.026 |
| 2065.7 | -0.026 |
| 2065.8 | -0.027 |
| 2065.9 | -0.027 |
| 2066.0 | -0.027 |
| 2066.1 | -0.027 |
| 2066.2 | -0.027 |
| 2066.3 | -0.027 |
| 2066.4 | -0.027 |
| 2066.5 | -0.027 |
| 2066.6 | -0.027 |
| 2066.7 | -0.027 |
| 2066.8 | -0.027 |
| 2066.9 | -0.027 |
| 2067.0 | -0.027 |
| 2067.1 | -0.027 |
| 2067.2 | -0.027 |
| 2067.3 | -0.027 |
| 2067.4 | -0.027 |
| 2067.5 | -0.027 |
| 2067.6 | -0.027 |
| 2067.7 | -0.027 |
| 2067.8 | -0.027 |
| 2067.9 | -0.027 |
| 2068.0 | -0.027 |
| 2068.1 | -0.027 |
| 2068.2 | -0.027 |
| 2068.3 | -0.027 |
| 2068.4 | -0.027 |
| 2068.5 | -0.027 |
| 2068.6 | -0.027 |
| 2068.7 | -0.027 |
| 2068.8 | -0.027 |
| 2068.9 | -0.027 |
| 2069.0 | -0.027 |
| 2069.1 | -0.027 |
| 2069.2 | -0.027 |
| 2069.3 | -0.027 |
| 2069.4 | -0.027 |
| 2069.5 | -0.027 |
| 2069.6 | -0.027 |
| 2069.7 | -0.027 |
| 2069.8 | -0.027 |
| 2069.9 | -0.027 |
| 2070.0 | -0.027 |
| 2070.1 | -0.027 |
| 2070.2 | -0.027 |
| 2070.3 | -0.027 |
| 2070.4 | -0.027 |
| 2070.5 | -0.027 |
| 2070.6 | -0.027 |
| 2070.7 | -0.027 |
| 2070.8 | -0.027 |
| 2070.9 | -0.027 |
| 2071.0 | -0.027 |
| 2071.1 | -0.027 |
| 2071.2 | -0.027 |
| 2071.3 | -0.027 |
| 2071.4 | -0.027 |
| 2071.5 | -0.027 |
| 2071.6 | -0.027 |
| 2071.7 | -0.027 |
| 2071.8 | -0.027 |
| 2071.9 | -0.027 |
| 2072.0 | -0.027 |
| 2072.1 | -0.027 |
| 2072.2 | -0.027 |
| 2072.3 | -0.027 |
| 2072.4 | -0.027 |
| 2072.5 | -0.027 |
| 2072.6 | -0.027 |
| 2072.7 | -0.027 |
| 2072.8 | -0.027 |
| 2072.9 | -0.027 |
| 2073.0 | -0.027 |
| 2073.1 | -0.027 |
| 2073.2 | -0.027 |
| 2073.3 | -0.027 |
| 2073.4 | -0.027 |
| 2073.5 | -0.027 |
| 2073.6 | -0.027 |
| 2073.7 | -0.027 |
| 2073.8 | -0.027 |
| 2073.9 | -0.027 |
| 2074.0 | -0.027 |
| 2074.1 | -0.027 |
| 2074.2 | -0.027 |
| 2074.3 | -0.027 |
| 2074.4 | -0.027 |
| 2074.5 | -0.027 |
| 2074.6 | -0.027 |
| 2074.7 | -0.027 |
| 2074.8 | -0.027 |
| 2074.9 | -0.027 |
| 2075.0 | -0.027 |
| 2075.1 | -0.027 |
| 2075.2 | -0.027 |
| 2075.3 | -0.027 |
| 2075.4 | -0.027 |
| 2075.5 | -0.027 |
| 2075.6 | -0.027 |
| 2075.7 | -0.027 |
| 2075.8 | -0.027 |
| 2075.9 | -0.027 |
| 2076.0 | -0.027 |
| 2076.1 | -0.027 |
| 2076.2 | -0.027 |
| 2076.3 | -0.027 |
| 2076.4 | -0.027 |
| 2076.5 | -0.027 |
| 2076.6 | -0.027 |
| 2076.7 | -0.027 |
| 2076.8 | -0.027 |
| 2076.9 | -0.027 |
| 2077.0 | -0.027 |
| 2077.1 | -0.027 |
| 2077.2 | -0.027 |
| 2077.3 | -0.027 |
| 2077.4 | -0.027 |
| 2077.5 | -0.027 |
| 2077.6 | -0.027 |
| 2077.7 | -0.027 |
| 2077.8 | -0.027 |
| 2077.9 | -0.027 |
| 2078.0 | -0.027 |
| 2078.1 | -0.027 |
| 2078.2 | -0.027 |
| 2078.3 | -0.027 |
| 2078.4 | -0.027 |
| 2078.5 | -0.027 |
| 2078.6 | -0.027 |
| 2078.7 | -0.027 |
| 2078.8 | -0.027 |
| 2078.9 | -0.027 |
| 2079.0 | -0.027 |
| 2079.1 | -0.027 |
| 2079.2 | -0.027 |
| 2079.3 | -0.027 |
| 2079.4 | -0.027 |
| 2079.5 | -0.027 |
| 2079.6 | -0.027 |
| 2079.7 | -0.027 |
| 2079.8 | -0.027 |
| 2079.9 | -0.027 |
| 2080.0 | -0.027 |
| 2080.1 | -0.027 |
| 2080.2 | -0.027 |
| 2080.3 | -0.027 |
| 2080.4 | -0.027 |
| 2080.5 | -0.027 |
| 2080.6 | -0.027 |
| 2080.7 | -0.027 |
| 2080.8 | -0.027 |
| 2080.9 | -0.027 |
| 2081.0 | -0.027 |
| 2081.1 | -0.027 |
| 2081.2 | -0.027 |
| 2081.3 | -0.027 |
| 2081.4 | -0.027 |
| 2081.5 | -0.027 |
| 2081.6 | -0.027 |
| 2081.7 | -0.027 |
| 2081.8 | -0.027 |
| 2081.9 | -0.027 |
| 2082.0 | -0.027 |
| 2082.1 | -0.027 |
| 2082.2 | -0.027 |
| 2082.3 | -0.027 |
| 2082.4 | -0.027 |
| 2082.5 | -0.027 |
| 2082.6 | -0.027 |
| 2082.7 | -0.027 |
| 2082.8 | -0.027 |
| 2082.9 | -0.027 |
| 2083.0 | -0.027 |
| 2083.1 | -0.027 |
| 2083.2 | -0.027 |
| 2083.3 | -0.027 |
| 2083.4 | -0.027 |
| 2083.5 | -0.027 |
| 2083.6 | -0.027 |
| 2083.7 | -0.027 |
| 2083.8 | -0.027 |
| 2083.9 | -0.027 |
| 2084.0 | -0.027 |
| 2084.1 | -0.027 |
| 2084.2 | -0.027 |
| 2084.3 | -0.027 |
| 2084.4 | -0.027 |
| 2084.5 | -0.027 |
| 2084.6 | -0.027 |
| 2084.7 | -0.027 |
| 2084.8 | -0.027 |
| 2084.9 | -0.027 |
| 2085.0 | -0.027 |
| 2085.1 | -0.027 |
| 2085.2 | -0.027 |
| 2085.3 | -0.027 |
| 2085.4 | -0.027 |
| 2085.5 | -0.027 |
| 2085.6 | -0.027 |
| 2085.7 | -0.027 |
| 2085.8 | -0.027 |
| 2085.9 | -0.027 |
| 2086.0 | -0.027 |
| 2086.1 | -0.027 |
| 2086.2 | -0.027 |
| 2086.3 | -0.027 |
| 2086.4 | -0.027 |
| 2086.5 | -0.027 |
| 2086.6 | -0.027 |
| 2086.7 | -0.027 |
| 2086.8 | -0.027 |
| 2086.9 | -0.027 |
| 2087.0 | -0.027 |
| 2087.1 | -0.027 |
| 2087.2 | -0.027 |
| 2087.3 | -0.027 |
| 2087.4 | -0.027 |
| 2087.5 | -0.027 |
| 2087.6 | -0.027 |
| 2087.7 | -0.027 |
| 2087.8 | -0.027 |
| 2087.9 | -0.027 |
| 2088.0 | -0.027 |
| 2088.1 | -0.027 |
| 2088.2 | -0.027 |
| 2088.3 | -0.027 |
| 2088.4 | -0.027 |
| 2088.5 | -0.027 |
| 2088.6 | -0.027 |
| 2088.7 | -0.027 |
| 2088.8 | -0.027 |
| 2088.9 | -0.027 |
| 2089.0 | -0.027 |
| 2089.1 | -0.027 |
| 2089.2 | -0.027 |
| 2089.3 | -0.027 |
| 2089.4 | -0.027 |
| 2089.5 | -0.027 |
| 2089.6 | -0.027 |
| 2089.7 | -0.027 |
| 2089.8 | -0.027 |
| 2089.9 | -0.027 |
| 2090.0 | -0.027 |
| 2090.1 | -0.027 |
| 2090.2 | -0.027 |
| 2090.3 | -0.027 |
| 2090.4 | -0.027 |
| 2090.5 | -0.027 |
| 2090.6 | -0.027 |
| 2090.7 | -0.027 |
| 2090.8 | -0.027 |
| 2090.9 | -0.027 |
| 2091.0 | -0.027 |
| 2091.1 | -0.027 |
| 2091.2 | -0.027 |
| 2091.3 | -0.027 |
| 2091.4 | -0.027 |
| 2091.5 | -0.027 |
| 2091.6 | -0.027 |
| 2091.7 | -0.027 |
| 2091.8 | -0.027 |
| 2091.9 | -0.027 |
| 2092.0 | -0.027 |
| 2092.1 | -0.027 |
| 2092.2 | -0.027 |
| 2092.3 | -0.027 |
| 2092.4 | -0.027 |
| 2092.5 | -0.027 |
| 2092.6 | -0.027 |
| 2092.7 | -0.027 |
| 2092.8 | -0.027 |
| 2092.9 | -0.027 |
| 2093.0 | -0.027 |
| 2093.1 | -0.027 |
| 2093.2 | -0.027 |
| 2093.3 | -0.027 |
| 2093.4 | -0.027 |
| 2093.5 | -0.027 |
| 2093.6 | -0.027 |
| 2093.7 | -0.027 |
| 2093.8 | -0.027 |
| 2093.9 | -0.027 |
| 2094.0 | -0.027 |
| 2094.1 | -0.027 |
| 2094.2 | -0.027 |
| 2094.3 | -0.027 |
| 2094.4 | -0.027 |
| 2094.5 | -0.027 |
| 2094.6 | -0.027 |
| 2094.7 | -0.027 |
| 2094.8 | -0.027 |
| 2094.9 | -0.027 |
| 2095.0 | -0.027 |
| 2095.1 | -0.027 |
| 2095.2 | -0.027 |
| 2095.3 | -0.027 |
| 2095.4 | -0.027 |
| 2095.5 | -0.027 |
| 2095.6 | -0.027 |
| 2095.7 | -0.027 |
| 2095.8 | -0.027 |
| 2095.9 | -0.027 |
| 2096.0 | -0.027 |
| 2096.1 | -0.027 |
| 2096.2 | -0.027 |
| 2096.3 | -0.027 |
| 2096.4 | -0.027 |
| 2096.5 | -0.027 |
| 2096.6 | -0.027 |
| 2096.7 | -0.027 |
| 2096.8 | -0.027 |
| 2096.9 | -0.027 |
| 2097.0 | -0.027 |
| 2097.1 | -0.027 |
| 2097.2 | -0.027 |
| 2097.3 | -0.027 |
| 2097.4 | -0.027 |
| 2097.5 | -0.027 |
| 2097.6 | -0.027 |
| 2097.7 | -0.027 |
| 2097.8 | -0.027 |
| 2097.9 | -0.027 |
| 2098.0 | -0.027 |
| 2098.1 | -0.027 |
| 2098.2 | -0.027 |
| 2098.3 | -0.027 |
| 2098.4 | -0.027 |
| 2098.5 | -0.027 |
| 2098.6 | -0.027 |
| 2098.7 | -0.027 |
| 2098.8 | -0.027 |
| 2098.9 | -0.027 |
| 2099.0 | -0.027 |
| 2099.1 | -0.027 |
| 2099.2 | -0.027 |
| 2099.3 | -0.027 |
| 2099.4 | -0.027 |
| 2099.5 | -0.027 |
| 2099.6 | -0.027 |
| 2099.7 | -0.027 |
| 2099.8 | -0.027 |
| 2099.9 | -0.027 |
| 2100.0 | -0.027 |
| 2100.1 | -0.027 |
| 2100.2 | -0.027 |
| 2100.3 | -0.027 |
| 2100.4 | -0.027 |
| 2100.5 | -0.027 |
| 2100.6 | -0.027 |
| 2100.7 | -0.027 |
| 2100.8 | -0.027 |
| 2100.9 | -0.027 |
| 2101.0 | -0.027 |
| 2101.1 | -0.027 |
| 2101.2 | -0.027 |
| 2101.3 | -0.027 |
| 2101.4 | -0.027 |
| 2101.5 | -0.027 |
| 2101.6 | -0.027 |
| 2101.7 | -0.027 |
| 2101.8 | -0.027 |
| 2101.9 | -0.027 |
| 2102.0 | -0.027 |
| 2102.1 | -0.027 |
| 2102.2 | -0.027 |
| 2102.3 | -0.027 |
| 2102.4 | -0.027 |
| 2102.5 | -0.027 |
| 2102.6 | -0.027 |
| 2102.7 | -0.027 |
| 2102.8 | -0.027 |
| 2102.9 | -0.027 |
| 2103.0 | -0.027 |
| 2103.1 | -0.027 |
| 2103.2 | -0.027 |
| 2103.3 | -0.027 |
| 2103.4 | -0.027 |
| 2103.5 | -0.027 |
| 2103.6 | -0.027 |
| 2103.7 | -0.027 |
| 2103.8 | -0.027 |
| 2103.9 | -0.027 |
| 2104.0 | -0.027 |
| 2104.1 | -0.027 |
| 2104.2 | -0.027 |
| 2104.3 | -0.027 |
| 2104.4 | -0.027 |
| 2104.5 | -0.027 |
| 2104.6 | -0.027 |
| 2104.7 | -0.027 |
| 2104.8 | -0.027 |
| 2104.9 | -0.027 |
| 2105.0 | -0.027 |
| 2105.1 | -0.027 |
| 2105.2 | -0.027 |
| 2105.3 | -0.027 |
| 2105.4 | -0.027 |
| 2105.5 | -0.027 |
| 2105.6 | -0.027 |
| 2105.7 | -0.027 |
| 2105.8 | -0.027 |
| 2105.9 | -0.027 |
| 2106.0 | -0.027 |
| 2106.1 | -0.027 |
| 2106.2 | -0.027 |
| 2106.3 | -0.027 |
| 2106.4 | -0.027 |
| 2106.5 | -0.027 |
| 2106.6 | -0.027 |
| 2106.7 | -0.027 |
| 2106.8 | -0.027 |
| 2106.9 | -0.027 |
| 2107.0 | -0.027 |
| 2107.1 | -0.027 |
| 2107.2 | -0.027 |
| 2107.3 | -0.027 |
| 2107.4 | -0.027 |
| 2107.5 | -0.027 |
| 2107.6 | -0.027 |
| 2107.7 | -0.027 |
| 2107.8 | -0.027 |
| 2107.9 | -0.027 |
| 2108.0 | -0.027 |
| 2108.1 | -0.027 |
| 2108.2 | -0.027 |
| 2108.3 | -0.027 |
| 2108.4 | -0.027 |
| 2108.5 | -0.027 |
| 2108.6 | -0.027 |
| 2108.7 | -0.027 |
| 2108.8 | -0.027 |
| 2108.9 | -0.027 |
| 2109.0 | -0.027 |
| 2109.1 | -0.027 |
| 2109.2 | -0.027 |
| 2109.3 | -0.027 |
| 2109.4 | -0.027 |
| 2109.5 | -0.027 |
| 2109.6 | -0.027 |
| 2109.7 | -0.027 |
| 2109.8 | -0.027 |
| 2109.9 | -0.027 |
| 2110.0 | -0.027 |
| 2110.1 | -0.027 |
| 2110.2 | -0.027 |
| 2110.3 | -0.027 |
| 2110.4 | -0.027 |
| 2110.5 | -0.027 |
| 2110.6 | -0.027 |
| 2110.7 | -0.027 |
| 2110.8 | -0.027 |
| 2110.9 | -0.027 |
| 2111.0 | -0.027 |
| 2111.1 | -0.027 |
| 2111.2 | -0.027 |
| 2111.3 | -0.027 |
| 2111.4 | -0.027 |
| 2111.5 | -0.027 |
| 2111.6 | -0.027 |
| 2111.7 | -0.027 |
| 2111.8 | -0.027 |
| 2111.9 | -0.027 |
| 2112.0 | -0.027 |
| 2112.1 | -0.027 |
| 2112.2 | -0.027 |
| 2112.3 | -0.027 |
| 2112.4 | -0.027 |
| 2112.5 | -0.027 |
| 2112.6 | -0.027 |
| 2112.7 | -0.027 |
| 2112.8 | -0.027 |
| 2112.9 | -0.027 |
| 2113.0 | -0.027 |
| 2113.1 | -0.027 |
| 2113.2 | -0.027 |
| 2113.3 | -0.027 |
| 2113.4 | -0.027 |
| 2113.5 | -0.027 |
| 2113.6 | -0.027 |
| 2113.7 | -0.027 |
| 2113.8 | -0.027 |
| 2113.9 | -0.027 |
| 2114.0 | -0.027 |
| 2114.1 | -0.027 |
| 2114.2 | -0.027 |
| 2114.3 | -0.027 |
| 2114.4 | -0.027 |
| 2114.5 | -0.027 |
| 2114.6 | -0.027 |
| 2114.7 | -0.027 |
| 2114.8 | -0.027 |
| 2114.9 | -0.027 |
| 2115.0 | -0.027 |
| 2115.1 | -0.027 |
| 2115.2 | -0.027 |
| 2115.3 | -0.027 |
| 2115.4 | -0.027 |
| 2115.5 | -0.027 |
| 2115.6 | -0.027 |
| 2115.7 | -0.027 |
| 2115.8 | -0.027 |
| 2115.9 | -0.027 |
| 2116.0 | -0.027 |
| 2116.1 | -0.027 |
| 2116.2 | -0.027 |
| 2116.3 | -0.027 |
| 2116.4 | -0.027 |
| 2116.5 | -0.027 |
| 2116.6 | -0.027 |
| 2116.7 | -0.027 |
| 2116.8 | -0.027 |
| 2116.9 | -0.027 |
| 2117.0 | -0.027 |
| 2117.1 | -0.027 |
| 2117.2 | -0.027 |
| 2117.3 | -0.027 |
| 2117.4 | -0.027 |
| 2117.5 | -0.027 |
| 2117.6 | -0.027 |
| 2117.7 | -0.027 |
| 2117.8 | -0.027 |
| 2117.9 | -0.027 |
| 2118.0 | -0.027 |
| 2118.1 | -0.027 |
| 2118.2 | -0.027 |
| 2118.3 | -0.027 |
| 2118.4 | -0.027 |
| 2118.5 | -0.027 |
| 2118.6 | -0.027 |
| 2118.7 | -0.027 |
| 2118.8 | -0.027 |
| 2118.9 | -0.027 |
| 2119.0 | -0.027 |
| 2119.1 | -0.027 |
| 2119.2 | -0.027 |
| 2119.3 | -0.027 |
| 2119.4 | -0.027 |
| 2119.5 | -0.027 |
| 2119.6 | -0.027 |
| 2119.7 | -0.027 |
| 2119.8 | -0.027 |
| 2119.9 | -0.027 |
| 2120.0 | -0.027 |
| 2120.1 | -0.027 |
| 2120.2 | -0.027 |
| 2120.3 | -0.027 |
| 2120.4 | -0.027 |
| 2120.5 | -0.027 |
| 2120.6 | -0.027 |
| 2120.7 | -0.027 |
| 2120.8 | -0.027 |
| 2120.9 | -0.027 |
| 2121.0 | -0.027 |
| 2121.1 | -0.027 |
| 2121.2 | -0.027 |
| 2121.3 | -0.027 |
| 2121.4 | -0.027 |
| 2121.5 | -0.027 |
| 2121.6 | -0.027 |
| 2121.7 | -0.027 |
| 2121.8 | -0.027 |
| 2121.9 | -0.027 |
| 2122.0 | -0.027 |
| 2122.1 | -0.027 |
| 2122.2 | -0.027 |
| 2122.3 | -0.027 |
| 2122.4 | -0.027 |
| 2122.5 | -0.027 |
| 2122.6 | -0.027 |
| 2122.7 | -0.027 |
| 2122.8 | -0.027 |
| 2122.9 | -0.027 |
| 2123.0 | -0.027 |
| 2123.1 | -0.027 |
| 2123.2 | -0.027 |
| 2123.3 | -0.027 |
| 2123.4 | -0.027 |
| 2123.5 | -0.027 |
| 2123.6 | -0.027 |
| 2123.7 | -0.027 |
| 2123.8 | -0.027 |
| 2123.9 | -0.027 |
| 2124.0 | -0.027 |
| 2124.1 | -0.027 |
| 2124.2 | -0.027 |
| 2124.3 | -0.027 |
| 2124.4 | -0.027 |
| 2124.5 | -0.027 |
| 2124.6 | -0.027 |
| 2124.7 | -0.027 |
| 2124.8 | -0.027 |
| 2124.9 | -0.027 |
| 2125.0 | -0.027 |
| 2125.1 | -0.027 |
| 2125.2 | -0.027 |
| 2125.3 | -0.027 |
| 2125.4 | -0.027 |
| 2125.5 | -0.027 |
| 2125.6 | -0.027 |
| 2125.7 | -0.027 |
| 2125.8 | -0.027 |
| 2125.9 | -0.027 |
| 2126.0 | -0.027 |
| 2126.1 | -0.027 |
| 2126.2 | -0.027 |
| 2126.3 | -0.027 |
| 2126.4 | -0.027 |
| 2126.5 | -0.027 |
| 2126.6 | -0.027 |
| 2126.7 | -0.027 |
| 2126.8 | -0.027 |
| 2126.9 | -0.027 |
| 2127.0 | -0.027 |
| 2127.1 | -0.027 |
| 2127.2 | -0.027 |
| 2127.3 | -0.027 |
| 2127.4 | -0.027 |
| 2127.5 | -0.027 |
| 2127.6 | -0.027 |
| 2127.7 | -0.027 |
| 2127.8 | -0.027 |
| 2127.9 | -0.027 |
| 2128.0 | -0.027 |
| 2128.1 | -0.027 |
| 2128.2 | -0.027 |
| 2128.3 | -0.027 |
| 2128.4 | -0.027 |
| 2128.5 | -0.027 |
| 2128.6 | -0.027 |
| 2128.7 | -0.027 |
| 2128.8 | -0.027 |
| 2128.9 | -0.027 |
| 2129.0 | -0.027 |
| 2129.1 | -0.027 |
| 2129.2 | -0.027 |
| 2129.3 | -0.027 |
| 2129.4 | -0.027 |
| 2129.5 | -0.027 |
| 2129.6 | -0.027 |
| 2129.7 | -0.027 |
| 2129.8 | -0.027 |
| 2129.9 | -0.027 |
| 2130.0 | -0.027 |
| 2130.1 | -0.027 |
| 2130.2 | -0.027 |
| 2130.3 | -0.027 |
| 2130.4 | -0.027 |
| 2130.5 | -0.027 |
| 2130.6 | -0.027 |
| 2130.7 | -0.027 |
| 2130.8 | -0.027 |
| 2130.9 | -0.027 |
| 2131.0 | -0.027 |
| 2131.1 | -0.027 |
| 2131.2 | -0.027 |
| 2131.3 | -0.027 |
| 2131.4 | -0.027 |
| 2131.5 | -0.027 |
| 2131.6 | -0.027 |
| 2131.7 | -0.027 |
| 2131.8 | -0.027 |
| 2131.9 | -0.027 |
| 2132.0 | -0.027 |
| 2132.1 | -0.027 |
| 2132.2 | -0.027 |
| 2132.3 | -0.027 |
| 2132.4 | -0.027 |
| 2132.5 | -0.027 |
| 2132.6 | -0.027 |
| 2132.7 | -0.027 |
| 2132.8 | -0.027 |
| 2132.9 | -0.027 |
| 2133.0 | -0.027 |
| 2133.1 | -0.027 |
| 2133.2 | -0.027 |
| 2133.3 | -0.027 |
| 2133.4 | -0.027 |
| 2133.5 | -0.027 |
| 2133.6 | -0.027 |
| 2133.7 | -0.027 |
| 2133.8 | -0.027 |
| 2133.9 | -0.027 |
| 2134.0 | -0.027 |
| 2134.1 | -0.027 |
| 2134.2 | -0.027 |
| 2134.3 | -0.027 |
| 2134.4 | -0.027 |
| 2134.5 | -0.027 |
| 2134.6 | -0.027 |
| 2134.7 | -0.027 |
| 2134.8 | -0.027 |
| 2134.9 | -0.027 |
| 2135.0 | -0.027 |
| 2135.1 | -0.027 |
| 2135.2 | -0.027 |
| 2135.3 | -0.027 |
| 2135.4 | -0.027 |
| 2135.5 | -0.027 |
| 2135.6 | -0.027 |
| 2135.7 | -0.027 |
| 2135.8 | -0.027 |
| 2135.9 | -0.027 |
| 2136.0 | -0.027 |
| 2136.1 | -0.027 |
| 2136.2 | -0.027 |
| 2136.3 | -0.027 |
| 2136.4 | -0.027 |
| 2136.5 | -0.027 |
| 2136.6 | -0.027 |
| 2136.7 | -0.027 |
| 2136.8 | -0.027 |
| 2136.9 | -0.027 |
| 2137.0 | -0.027 |
| 2137.1 | -0.027 |
| 2137.2 | -0.027 |
| 2137.3 | -0.027 |
| 2137.4 | -0.027 |
| 2137.5 | -0.027 |
| 2137.6 | -0.027 |
| 2137.7 | -0.027 |
| 2137.8 | -0.027 |
| 2137.9 | -0.027 |
| 2138.0 | -0.027 |
| 2138.1 | -0.027 |
| 2138.2 | -0.027 |
| 2138.3 | -0.027 |
| 2138.4 | -0.027 |
| 2138.5 | -0.027 |
| 2138.6 | -0.027 |
| 2138.7 | -0.027 |
| 2138.8 | -0.027 |
| 2138.9 | -0.027 |
| 2139.0 | -0.027 |
| 2139.1 | -0.027 |
| 2139.2 | -0.027 |
| 2139.3 | -0.027 |
| 2139.4 | -0.027 |
| 2139.5 | -0.027 |
| 2139.6 | -0.027 |
| 2139.7 | -0.027 |
| 2139.8 | -0.027 |
| 2139.9 | -0.027 |
| 2140.0 | -0.027 |
| 2140.1 | -0.027 |
| 2140.2 | -0.027 |
| 2140.3 | -0.027 |
| 2140.4 | -0.027 |
| 2140.5 | -0.027 |
| 2140.6 | -0.027 |
| 2140.7 | -0.027 |
| 2140.8 | -0.027 |
| 2140.9 | -0.027 |
| 2141.0 | -0.027 |
| 2141.1 | -0.027 |
| 2141.2 | -0.027 |
| 2141.3 | -0.027 |
| 2141.4 | -0.027 |
| 2141.5 | -0.027 |
| 2141.6 | -0.027 |
| 2141.7 | -0.027 |
| 2141.8 | -0.027 |
| 2141.9 | -0.027 |
| 2142.0 | -0.027 |
| 2142.1 | -0.027 |
| 2142.2 | -0.027 |
| 2142.3 | -0.027 |
| 2142.4 | -0.027 |
| 2142.5 | -0.027 |
| 2142.6 | -0.027 |
| 2142.7 | -0.027 |
| 2142.8 | -0.027 |
| 2142.9 | -0.027 |
| 2143.0 | -0.027 |
| 2143.1 | -0.027 |
| 2143.2 | -0.027 |
| 2143.3 | -0.027 |
| 2143.4 | -0.027 |
| 2143.5 | -0.027 |
| 2143.6 | -0.027 |
| 2143.7 | -0.027 |
| 2143.8 | -0.027 |
| 2143.9 | -0.027 |
| 2144.0 | -0.027 |
| 2144.1 | -0.027 |
| 2144.2 | -0.027 |
| 2144.3 | -0.027 |
| 2144.4 | -0.027 |
| 2144.5 | -0.027 |
| 2144.6 | -0.027 |
| 2144.7 | -0.027 |
| 2144.8 | -0.027 |
| 2144.9 | -0.027 |
| 2145.0 | -0.027 |
| 2145.1 | -0.027 |
| 2145.2 | -0.027 |
| 2145.3 | -0.027 |
| 2145.4 | -0.027 |
| 2145.5 | -0.027 |
| 2145.6 | -0.027 |
| 2145.7 | -0.027 |
| 2145.8 | -0.027 |
| 2145.9 | -0.027 |
| 2146.0 | -0.027 |
| 2146.1 | -0.027 |
| 2146.2 | -0.027 |
| 2146.3 | -0.027 |
| 2146.4 | -0.027 |
| 2146.5 | -0.027 |
| 2146.6 | -0.027 |
| 2146.7 | -0.027 |
| 2146.8 | -0.027 |
| 2146.9 | -0.027 |
| 2147.0 | -0.027 |
| 2147.1 | -0.027 |
| 2147.2 | -0.027 |
| 2147.3 | -0.027 |
| 2147.4 | -0.027 |
| 2147.5 | -0.027 |
| 2147.6 | -0.027 |
| 2147.7 | -0.027 |
| 2147.8 | -0.027 |
| 2147.9 | -0.027 |
| 2148.0 | -0.027 |
| 2148.1 | -0.027 |
| 2148.2 | -0.027 |
| 2148.3 | -0.027 |
| 2148.4 | -0.027 |
| 2148.5 | -0.027 |
| 2148.6 | -0.027 |
| 2148.7 | -0.027 |
| 2148.8 | -0.027 |
| 2148.9 | -0.027 |
| 2149.0 | -0.027 |
| 2149.1 | -0.027 |
| 2149.2 | -0.027 |
| 2149.3 | -0.027 |
| 2149.4 | -0.027 |
| 2149.5 | -0.027 |
| 2149.6 | -0.027 |
| 2149.7 | -0.027 |
| 2149.8 | -0.027 |
| 2149.9 | -0.027 |
| 2150.0 | -0.027 |
| 2150.1 | -0.027 |
| 2150.2 | -0.027 |
| 2150.3 | -0.027 |
| 2150.4 | -0.027 |
| 2150.5 | -0.027 |
| 2150.6 | -0.027 |
| 2150.7 | -0.027 |
| 2150.8 | -0.027 |
| 2150.9 | -0.027 |
| 2151.0 | -0.027 |
| 2151.1 | -0.027 |
| 2151.2 | -0.027 |
| 2151.3 | -0.027 |
| 2151.4 | -0.027 |
| 2151.5 | -0.027 |
| 2151.6 | -0.027 |
| 2151.7 | -0.027 |
| 2151.8 | -0.027 |
| 2151.9 | -0.027 |